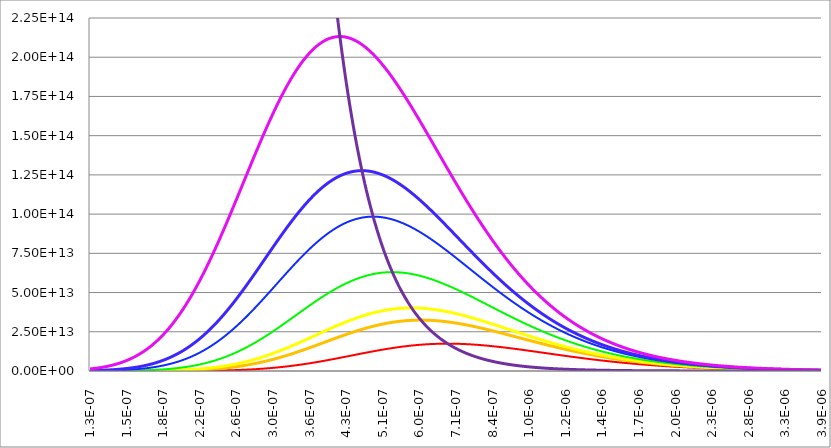
| Category | Series 0 | Series 2 | Series 3 | Series 4 | Series 5 | Series 6 | Series 7 | Series 8 |
|---|---|---|---|---|---|---|---|---|
| 1.3e-07 | 43685138.739 | 930653025.452 | 2456064956.772 | 16452432174.006 | 92391966750.19 | 236537325695.557 | 1309697465786.23 | 70807421631972600 |
| 1.30221265918748e-07 | 45284381.751 | 959721600.731 | 2528606285.021 | 16883714095.347 | 94536330275.323 | 241640933370.322 | 1334070800630.02 | 70207899069705504 |
| 1.30442908442164e-07 | 46938624.629 | 989632102.476 | 2603123802.267 | 17325289490.276 | 96725294709.74 | 246842138157.935 | 1358835514209.74 | 69613452632149400 |
| 1.30664928211246e-07 | 48649628.291 | 1020406833.061 | 2679666373.035 | 17777377075.269 | 98959665130.538 | 252142529249.845 | 1383996691087.79 | 69024039340034304 |
| 1.30887325868083e-07 | 50419205.486 | 1052068624.104 | 2758283931.46 | 18240199549.229 | 101240258477.966 | 257543716109.634 | 1409559460929.66 | 68439616577993296 |
| 1.31110102055858e-07 | 52249222.172 | 1084640847.335 | 2839027501.119 | 18713983650.925 | 103567903677.132 | 263047328628.225 | 1435528998568.02 | 67860142091481400 |
| 1.31333257418846e-07 | 54141598.924 | 1118147425.638 | 2921949215.143 | 19198960216.934 | 105943441759.982 | 268655017278.492 | 1461910524061.21 | 67285573983720704 |
| 1.31556792602423e-07 | 56098312.376 | 1152612844.287 | 3007102336.609 | 19695364240.106 | 108367725987.514 | 274368453269.189 | 1488709302745.95 | 66715870712671000 |
| 1.3178070825306e-07 | 58121396.694 | 1188062162.355 | 3094541279.224 | 20203434928.53 | 110841621972.233 | 280189328698.186 | 1515930645284.19 | 66150991088026200 |
| 1.32005005018328e-07 | 60212945.086 | 1224521024.312 | 3184321628.298 | 20723415765.013 | 113366007800.798 | 286119356704.962 | 1543579907704.01 | 65590894268236096 |
| 1.32229683546903e-07 | 62375111.346 | 1262015671.818 | 3276500161.998 | 21255554567.065 | 115941774156.87 | 292160271622.324 | 1571662491434.59 | 65035539757554000 |
| 1.32454744488563e-07 | 64610111.43 | 1300572955.695 | 3371134872.908 | 21800103547.381 | 118569824444.11 | 298313829127.292 | 1600183843335.03 | 64484887403108400 |
| 1.32680188494192e-07 | 66920225.07 | 1340220348.098 | 3468284989.873 | 22357319374.832 | 121251074909.339 | 304581806391.143 | 1629149455717.06 | 63938897391999696 |
| 1.32906016215783e-07 | 69307797.427 | 1380985954.878 | 3568011000.141 | 22927463235.95 | 123986454765.811 | 310966002228.531 | 1658564866361.43 | 63397530248422200 |
| 1.33132228306438e-07 | 71775240.776 | 1422898528.142 | 3670374671.812 | 23510800896.908 | 126776906316.584 | 317468237245.687 | 1688435658528.08 | 62860746830809696 |
| 1.33358825420371e-07 | 74325036.234 | 1465987479.006 | 3775439076.573 | 24107602765.989 | 129623385077.99 | 324090353987.621 | 1718767460959.88 | 62328508329005400 |
| 1.33585808212908e-07 | 76959735.521 | 1510282890.554 | 3883268612.744 | 24718143956.555 | 132526859903.139 | 330834217084.301 | 1749565947879.8 | 61800776261455904 |
| 1.33813177340492e-07 | 79681962.766 | 1555815530.994 | 3993929028.631 | 25342704350.488 | 135488313105.478 | 337701713395.768 | 1780836838981.73 | 61277512472429104 |
| 1.34040933460683e-07 | 82494416.349 | 1602616867.021 | 4107487446.172 | 25981568662.122 | 138508740582.347 | 344694752156.13 | 1812585899414.47 | 60758679129255400 |
| 1.3426907723216e-07 | 85399870.785 | 1650719077.381 | 4224012384.903 | 26635026502.649 | 141589151938.537 | 351815265116.427 | 1844818939759.15 | 60244238719592400 |
| 1.34497609314724e-07 | 88401178.649 | 1700155066.647 | 4343573786.227 | 27303372445.004 | 144730570609.801 | 359065206686.263 | 1877541815999.82 | 59734154048712496 |
| 1.34726530369297e-07 | 91501272.545 | 1750958479.199 | 4466243037.991 | 27986906089.212 | 147934033986.314 | 366446554074.231 | 1910760429487.19 | 59228388236813800 |
| 1.34955841057927e-07 | 94703167.112 | 1803163713.422 | 4592092999.383 | 28685932128.211 | 151200593536.046 | 373961307427.036 | 1944480726895.49 | 58726904716354096 |
| 1.35185542043789e-07 | 98009961.085 | 1856805936.11 | 4721198026.135 | 29400760414.128 | 154531314928.024 | 381611489967.294 | 1978708700172.24 | 58229667229405800 |
| 1.35415633991188e-07 | 101424839.384 | 1911921097.087 | 4853633996.044 | 30131706025.018 | 157927278155.469 | 389399148129.966 | 2013450386481.1 | 57736639825036000 |
| 1.35646117565556e-07 | 104951075.267 | 1968545944.049 | 4989478334.814 | 30879089332.051 | 161389577658.764 | 397326351697.356 | 2048711868137.37 | 57247786856705800 |
| 1.35876993433462e-07 | 108592032.511 | 2026718037.616 | 5128810042.207 | 31643236067.147 | 164919322448.239 | 405395193932.666 | 2084499272536.48 | 56763072979693800 |
| 1.36108262262607e-07 | 112351167.653 | 2086475766.612 | 5271709718.521 | 32424477391.054 | 168517636226.755 | 413607791712.037 | 2120818772075.07 | 56282463148540600 |
| 1.36339924721828e-07 | 116232032.272 | 2147858363.564 | 5418259591.387 | 33223149961.861 | 172185657512.035 | 421966285655.032 | 2157676584064.79 | 55805922614514400 |
| 1.36571981481102e-07 | 120238275.318 | 2210905920.422 | 5568543542.884 | 34039596003.941 | 175924539758.742 | 430472840253.525 | 2195078970638.6 | 55333416923099400 |
| 1.36804433211546e-07 | 124373645.499 | 2275659404.508 | 5722647136.984 | 34874163377.32 | 179735451480.258 | 439129643998.94 | 2233032238649.63 | 54864911911504000 |
| 1.37037280585418e-07 | 128641993.704 | 2342160674.695 | 5880657647.316 | 35727205647.466 | 183619576370.154 | 447938909507.811 | 2271542739562.53 | 54400373706191104 |
| 1.37270524276122e-07 | 133047275.491 | 2410452497.804 | 6042664085.256 | 36599082155.486 | 187578113423.296 | 456902873645.58 | 2310616869337.05 | 53939768720429400 |
| 1.37504164958206e-07 | 137593553.616 | 2480578565.247 | 6208757228.344 | 37490158088.734 | 191612277056.597 | 466023797648.636 | 2350261068304.13 | 53483063651864000 |
| 1.37738203307369e-07 | 142285000.618 | 2552583509.89 | 6379029649.033 | 38400804551.818 | 195723297229.347 | 475303967244.508 | 2390481821034.02 | 53030225480109600 |
| 1.37972640000458e-07 | 147125901.461 | 2626512923.154 | 6553575743.756 | 39331398637.992 | 199912419563.118 | 484745692770.176 | 2431285656196.78 | 52581221464362800 |
| 1.38207475715472e-07 | 152120656.225 | 2702413372.353 | 6732491762.334 | 40282323500.947 | 204180905461.217 | 494351309288.474 | 2472679146414.75 | 52136019141034400 |
| 1.38442711131564e-07 | 157273782.85 | 2780332418.271 | 6915875837.702 | 41253968426.966 | 208530032227.622 | 504123176702.485 | 2514668908107.18 | 51694586321402896 |
| 1.38678346929045e-07 | 162589919.948 | 2860318632.967 | 7103828015.977 | 42246728907.463 | 212961093185.433 | 514063679867.949 | 2557261601326.79 | 51256891089286800 |
| 1.38914383789382e-07 | 168073829.653 | 2942421617.838 | 7296450286.847 | 43261006711.873 | 217475397794.736 | 524175228703.586 | 2600463929588.28 | 50822901798737400 |
| 1.39150822395201e-07 | 173730400.546 | 3026692021.906 | 7493846614.301 | 44297209960.903 | 222074271769.915 | 534460258299.29 | 2644282639688.78 | 50392587071750200 |
| 1.39387663430292e-07 | 179564650.629 | 3113181560.362 | 7696122967.684 | 45355753200.135 | 226759057196.332 | 544921229022.18 | 2688724521520 | 49965915795996800 |
| 1.39624907579608e-07 | 185581730.361 | 3201943033.345 | 7903387353.087 | 46437057473.956 | 231531112646.379 | 555560626620.409 | 2733796407872.28 | 49542857122575000 |
| 1.39862555529267e-07 | 191786925.753 | 3293030344.973 | 8115749845.072 | 47541550399.829 | 236391813294.847 | 566380962324.738 | 2779505174230.24 | 49123380463778704 |
| 1.40100607966557e-07 | 198185661.527 | 3386498522.622 | 8333322618.73 | 48669666242.875 | 241342551033.589 | 577384772947.771 | 2825857738560.14 | 48707455490886200 |
| 1.40339065579933e-07 | 204783504.333 | 3482403736.448 | 8556219982.068 | 49821845990.782 | 246384734585.458 | 588574620980.849 | 2872861061088.81 | 48295052131967400 |
| 1.40577929059024e-07 | 211586166.034 | 3580803319.166 | 8784558408.735 | 50998537428.998 | 251519789617.453 | 599953094688.522 | 2920522144074.17 | 47886140569709600 |
| 1.40817199094631e-07 | 218599507.052 | 3681755786.077 | 9018456571.081 | 52200195216.236 | 256749158853.092 | 611522808200.559 | 2968848031567.21 | 47480691239261504 |
| 1.41056876378733e-07 | 225829539.776 | 3785320855.348 | 9258035373.546 | 53427280960.25 | 262074302183.928 | 623286401601.482 | 3017845809165.42 | 47078674826096200 |
| 1.41296961604484e-07 | 233282432.046 | 3891559468.549 | 9503417986.387 | 54680263293.891 | 267496696780.204 | 635246541017.479 | 3067522603757.65 | 46680062263890704 |
| 1.41537455466221e-07 | 240964510.69 | 4000533811.438 | 9754729879.735 | 55959617951.426 | 273017837200.615 | 647405918700.778 | 3117885583260.26 | 46284824732425600 |
| 1.41778358659459e-07 | 248882265.142 | 4112307335.014 | 10012098857.986 | 57265827845.112 | 278639235501.127 | 659767253111.33 | 3168941956344.65 | 45892933655500096 |
| 1.42019671880901e-07 | 257042351.119 | 4226944776.816 | 10275655094.528 | 58599383142.009 | 284362421342.834 | 672333288995.792 | 3220698972156.02 | 45504360698867104 |
| 1.42261395828432e-07 | 265451594.373 | 4344512182.486 | 10545531166.791 | 59960781341.027 | 290188942098.817 | 685106797463.749 | 3273163920023.31 | 45119077768183600 |
| 1.42503531201127e-07 | 274116994.513 | 4465076927.594 | 10821862091.643 | 61350527350.2 | 296120362959.953 | 698090576061.15 | 3326344129160.38 | 44737057006980000 |
| 1.42746078699251e-07 | 283045728.897 | 4588707739.717 | 11104785361.102 | 62769133564.16 | 302158267039.674 | 711287448840.879 | 3380246968358.28 | 44358270794645904 |
| 1.42989039024259e-07 | 292245156.599 | 4715474720.784 | 11394440978.39 | 64217119941.818 | 308304255477.61 | 724700266430.431 | 3434879845668.66 | 43982691744433296 |
| 1.43232412878803e-07 | 301722822.448 | 4845449369.683 | 11690971494.308 | 65695014084.224 | 314559947542.095 | 738331906096.622 | 3490250208078.16 | 43610292701475904 |
| 1.43476200966727e-07 | 311486461.143 | 4978704605.13 | 11994522043.946 | 67203351312.613 | 320926980731.503 | 752185271807.316 | 3546365541173.92 | 43241046740826496 |
| 1.43720403993076e-07 | 321544001.439 | 5115314788.804 | 12305240383.717 | 68742674746.601 | 327407010874.366 | 766263294290.099 | 3603233368799.97 | 42874927165509808 |
| 1.43965022664094e-07 | 331903570.423 | 5255355748.742 | 12623276928.716 | 70313535382.542 | 334001712228.256 | 780568931087.833 | 3660861252704.72 | 42511907504592304 |
| 1.44210057687228e-07 | 342573497.85 | 5398904803.006 | 12948784790.409 | 71916492172.012 | 340712777577.389 | 795105166611.097 | 3719256792179.19 | 42151961511268496 |
| 1.44455509771127e-07 | 353562320.569 | 5546040783.61 | 13281919814.641 | 73552112100.434 | 347541918328.901 | 809875012187.406 | 3778427623686.23 | 41795063160963200 |
| 1.44701379625648e-07 | 364878787.028 | 5696844060.719 | 13622840619.971 | 75220970265.792 | 354490864607.782 | 824881506107.19 | 3838381420480.71 | 41441186649449904 |
| 1.44947667961856e-07 | 376531861.858 | 5851396567.108 | 13971708636.323 | 76923649957.471 | 361561365350.424 | 840127713666.487 | 3899125892220.27 | 41090306390984896 |
| 1.45194375492025e-07 | 388530730.535 | 6009781822.9 | 14328688143.959 | 78660742735.154 | 368755188396.735 | 855616727206.278 | 3960668784567.13 | 40742397016457696 |
| 1.45441502929643e-07 | 400884804.135 | 6172084960.559 | 14693946312.772 | 80432848507.813 | 376074120580.799 | 871351666148.45 | 4023017878780.57 | 40397433371556704 |
| 1.45689050989411e-07 | 413603724.162 | 6338392750.157 | 15067653241.887 | 82240575612.742 | 383519967820.036 | 887335677028.288 | 4086180991300.18 | 40055390514950400 |
| 1.45937020387247e-07 | 426697367.47 | 6508793624.917 | 15449981999.585 | 84084540894.644 | 391094555202.833 | 903571933523.535 | 4150165973319.87 | 39716243716484096 |
| 1.46185411840288e-07 | 440175851.262 | 6683377707.011 | 15841108663.532 | 85965369784.736 | 398799727074.599 | 920063636479.844 | 4214980710352.6 | 39379968455392304 |
| 1.46434226066892e-07 | 454049538.186 | 6862236833.636 | 16241212361.32 | 87883696379.877 | 406637347122.208 | 936814013932.709 | 4280633121785.76 | 39046540418525200 |
| 1.46683463786637e-07 | 468329041.511 | 7045464583.361 | 16650475311.316 | 89840163521.693 | 414609298456.813 | 953826321125.733 | 4347131160427.38 | 38715935498591104 |
| 1.46933125720328e-07 | 483025230.398 | 7233156302.735 | 17069082863.814 | 91835422875.679 | 422717483694.951 | 971103840525.217 | 4414482812042.74 | 38388129792413504 |
| 1.47183212589998e-07 | 498149235.257 | 7425409133.17 | 17497223542.49 | 93870135010.28 | 430963825037.959 | 988649881831.049 | 4482696094882.01 | 38063099599202800 |
| 1.47433725118906e-07 | 513712453.195 | 7622322038.094 | 17935089086.156 | 95944969475.917 | 439350264349.609 | 1006467781983.79 | 4551779059198.22 | 37740821418842704 |
| 1.47684664031544e-07 | 529726553.565 | 7823995830.37 | 18382874490.812 | 98060604883.953 | 447878763231.96 | 1024560905167.95 | 4621739786755.96 | 37421271950191096 |
| 1.47936030053636e-07 | 546203483.594 | 8030533199.982 | 18840778051.994 | 100217728985.583 | 456551303099.37 | 1042932642811.43 | 4692586390330.83 | 37104428089395200 |
| 1.48187823912142e-07 | 563155474.12 | 8242038741.999 | 19309001407.405 | 102417038750.622 | 465369885250.651 | 1061586413581.01 | 4764327013199.39 | 36790266928221600 |
| 1.48440046335259e-07 | 580595045.413 | 8458618984.793 | 19787749579.844 | 104659240446.19 | 474336530939.298 | 1080525663373.89 | 4836969828619.73 | 36478765752399400 |
| 1.48692698052423e-07 | 598535013.099 | 8680382418.539 | 20277231020.414 | 106945049715.263 | 483453281441.789 | 1099753865305.25 | 4910523039302.73 | 36169902039978304 |
| 1.48945779794313e-07 | 616988494.182 | 8907439523.97 | 20777657652.012 | 109275191655.079 | 492722198123.88 | 1119274519691.75 | 4984994876873.88 | 35863653459700000 |
| 1.49199292292851e-07 | 635968913.162 | 9139902801.407 | 21289244913.094 | 111650400895.386 | 502145362504.917 | 1139091154030.94 | 5060393601325.74 | 35559997869383900 |
| 1.49453236281203e-07 | 655490008.25 | 9377886800.053 | 21812211801.723 | 114071421676.504 | 511724876320.04 | 1159207322976.53 | 5136727500461.07 | 35258913314326000 |
| 1.49707612493785e-07 | 675565837.695 | 9621508147.549 | 22346780919.879 | 116539007927.2 | 521462861580.324 | 1179626608309.49 | 5214004889326.48 | 34960378025711300 |
| 1.49962421666262e-07 | 696210786.197 | 9870885579.798 | 22893178518.036 | 119053923342.337 | 531361460630.774 | 1200352618904.88 | 5292234109636.77 | 34664370419040700 |
| 1.50217664535552e-07 | 717439571.438 | 10126139971.053 | 23451634540.007 | 121616941460.296 | 541422836206.144 | 1221388990694.55 | 5371423529189.98 | 34370869092569300 |
| 1.50473341839826e-07 | 739267250.707 | 10387394364.262 | 24022382668.042 | 124228845740.153 | 551649171484.547 | 1242739386625.32 | 5451581541272.98 | 34079852825760100 |
| 1.50729454318513e-07 | 761709227.632 | 10654774001.684 | 24605660368.183 | 126890429638.569 | 562042670138.817 | 1264407496612.99 | 5532716564057.78 | 33791300577748900 |
| 1.50986002712299e-07 | 784781259.023 | 10928406355.757 | 25201708935.87 | 129602496686.414 | 572605556385.582 | 1286397037491.89 | 5614837039988.56 | 33505191485823400 |
| 1.51242987763132e-07 | 808499461.819 | 11208421160.227 | 25810773541.787 | 132365860565.073 | 583340075032.01 | 1308711752959.97 | 5697951435159.3 | 33221504863914800 |
| 1.51500410214221e-07 | 832880320.136 | 11494950441.54 | 26433103277.953 | 135181345182.421 | 594248491520.198 | 1331355413519.45 | 5782068238682.25 | 32940220201102200 |
| 1.51758270810042e-07 | 857940692.437 | 11788128550.485 | 27068951204.048 | 138049784748.469 | 605333091969.151 | 1354331816412.96 | 5867195962046.95 | 32661317160129300 |
| 1.52016570296338e-07 | 883697818.807 | 12088092194.092 | 27718574393.971 | 140972023850.629 | 616596183214.327 | 1377644785555.08 | 5953343138470.19 | 32384775575934400 |
| 1.52275309420119e-07 | 910169328.332 | 12394980467.789 | 28382233982.618 | 143948917528.611 | 628040092844.713 | 1401298171459.33 | 6040518322236.78 | 32110575454192400 |
| 1.52534488929669e-07 | 937373246.601 | 12708934887.805 | 29060195212.889 | 146981331348.907 | 639667169237.374 | 1425295851160.49 | 6128730088030.81 | 31838696969868700 |
| 1.52794109574545e-07 | 965328003.316 | 13030099423.826 | 29752727482.902 | 150070141478.85 | 651479781589.458 | 1449641728132.31 | 6217987030258.16 | 31569120465786500 |
| 1.53054172105578e-07 | 994052440.017 | 13358620531.9 | 30460104393.425 | 153216234760.243 | 663480319947.606 | 1474339732200.42 | 6308297762359.56 | 31301826451205100 |
| 1.53314677274879e-07 | 1023565817.92 | 13694647187.583 | 31182603795.504 | 156420508782.504 | 675671195234.755 | 1499393819450.54 | 6399670916114.74 | 31036795600410900 |
| 1.53575625835839e-07 | 1053887825.876 | 14038330919.34 | 31920507838.292 | 159683871955.351 | 688054839274.243 | 1524807972131.94 | 6492115140937.35 | 30774008751320000 |
| 1.53837018543131e-07 | 1085038588.445 | 14389825842.175 | 32674103017.078 | 163007243580.959 | 700633704811.253 | 1550586198556.03 | 6585639103161.03 | 30513446904092800 |
| 1.54098856152711e-07 | 1117038674.084 | 14749288691.514 | 33443680221.487 | 166391553925.611 | 713410265531.492 | 1576732532990.07 | 6680251485316.32 | 30255091219760400 |
| 1.54361139421824e-07 | 1149909103.462 | 15116878857.316 | 34229534783.875 | 169837744290.786 | 726387016077.1 | 1603251035546.07 | 6775960985398.64 | 29998923018862300 |
| 1.54623869109002e-07 | 1183671357.887 | 15492758418.422 | 35031966527.89 | 173346767083.695 | 739566472059.769 | 1630145792064.75 | 6872776316127.52 | 29744923780096000 |
| 1.5488704597407e-07 | 1218347387.861 | 15877092177.141 | 35851279817.2 | 176919585887.213 | 752951170070.981 | 1657420913994.42 | 6970706204196.69 | 29493075138978000 |
| 1.55150670778144e-07 | 1253959621.755 | 16270047694.063 | 36687783604.386 | 180557175529.215 | 766543667689.401 | 1685080538265.07 | 7069759389515.62 | 29243358886515700 |
| 1.55414744283638e-07 | 1290530974.6 | 16671795323.098 | 37541791479.985 | 184260522151.268 | 780346543485.316 | 1713128827157.29 | 7169944624442.01 | 28995756967891100 |
| 1.5567926725426e-07 | 1328084857.013 | 17082508246.742 | 38413621721.685 | 188030623276.676 | 794362397022.146 | 1741569968166.13 | 7271270673005.79 | 28750251481155300 |
| 1.55944240455022e-07 | 1366645184.242 | 17502362511.564 | 39303597343.652 | 191868487877.851 | 808593848854.948 | 1770408173860.03 | 7373746310124.31 | 28506824675934300 |
| 1.56209664652236e-07 | 1406236385.331 | 17931537063.916 | 40212046145.997 | 195775136442.974 | 823043540525.903 | 1799647681734.42 | 7477380320808.93 | 28265458952145600 |
| 1.56475540613517e-07 | 1446883412.425 | 18370213785.849 | 41139300764.365 | 199751601041.955 | 837714134556.738 | 1829292754060.38 | 7582181499363.15 | 28026136858725500 |
| 1.5674186910779e-07 | 1488611750.19 | 18818577531.254 | 42085698719.644 | 203798925391.634 | 852608314438.053 | 1859347677727.96 | 7688158648571.95 | 27788841092367500 |
| 1.57008650905286e-07 | 1531447425.366 | 19276816162.204 | 43051582467.783 | 207918164920.222 | 867728784615.513 | 1889816764084.4 | 7795320578883.02 | 27553554496271400 |
| 1.57275886777547e-07 | 1575417016.449 | 19745120585.5 | 44037299449.708 | 212110386830.969 | 883078270472.905 | 1920704348767.1 | 7903676107579.51 | 27320260058902500 |
| 1.5754357749743e-07 | 1620547663.503 | 20223684789.431 | 45043202141.346 | 216376670164.988 | 898659518311.934 | 1952014791531.31 | 8013234057944.1 | 27088940912762100 |
| 1.57811723839106e-07 | 1666867078.102 | 20712705880.718 | 46069648103.718 | 220718105863.287 | 914475295328.852 | 1983752476072.61 | 8124003258415.52 | 26859580333167300 |
| 1.58080326578063e-07 | 1714403553.402 | 21212384121.665 | 47117000033.124 | 225135796827.913 | 930528389587.794 | 2015921809843.97 | 8235992541736.14 | 26632161737042500 |
| 1.58349386491112e-07 | 1763185974.348 | 21722922967.493 | 48185625811.39 | 229630857982.233 | 946821609990.799 | 2048527223867.61 | 8349210744091.98 | 26406668681720000 |
| 1.58618904356382e-07 | 1813243828.014 | 22244529103.867 | 49275898556.184 | 234204416330.306 | 963357786244.526 | 2081573172541.41 | 8463666704244.32 | 26183084863751200 |
| 1.5888888095333e-07 | 1864607214.068 | 22777412484.602 | 50388196671.372 | 238857611015.338 | 980139768823.597 | 2115064133440.02 | 8579369262653.64 | 25961394117728004 |
| 1.59159317062738e-07 | 1917306855.389 | 23321786369.549 | 51522903897.434 | 243591593377.17 | 997170428930.529 | 2149004607110.53 | 8696327260595.31 | 25741580415113800 |
| 1.59430213466717e-07 | 1971374108.8 | 23877867362.657 | 52680409361.902 | 248407527008.821 | 1014452658452.26 | 2183399116862.73 | 8814549539267.86 | 25523627863085000 |
| 1.59701570948709e-07 | 2026840975.947 | 24445875450.204 | 53861107629.831 | 253306587812.005 | 1031989369913.22 | 2218252208553.98 | 8934044938893.2 | 25307520703381200 |
| 1.59973390293489e-07 | 2083740114.317 | 25026034039.195 | 55065398754.284 | 258289964051.651 | 1049783496424.87 | 2253568450368.61 | 9054822297809.23 | 25093243311166900 |
| 1.6024567228717e-07 | 2142104848.382 | 25618569995.919 | 56293688326.823 | 263358856409.366 | 1067837991631.76 | 2289352432591.73 | 9176890451555.15 | 24880780193900900 |
| 1.60518417717201e-07 | 2201969180.892 | 26223713684.663 | 57546387528.003 | 268514478035.838 | 1086155829654.02 | 2325608767377.81 | 9300258231948.78 | 24670115990216400 |
| 1.60791627372372e-07 | 2263367804.3 | 26841699006.581 | 58823913177.847 | 273758054602.145 | 1104740005026.28 | 2362342088513.51 | 9424934466157.05 | 24461235468810700 |
| 1.61065302042815e-07 | 2326336112.327 | 27472763438.702 | 60126687786.304 | 279090824349.948 | 1123593532632.98 | 2399557051175.14 | 9550927975758.64 | 24254123527343500 |
| 1.61339442520007e-07 | 2390910211.664 | 28117148073.088 | 61455139603.676 | 284514038140.546 | 1142719447640.01 | 2437258331680.52 | 9678247575799.89 | 24048765191345500 |
| 1.61614049596772e-07 | 2457126933.824 | 28775097656.121 | 62809702670.997 | 290028959502.766 | 1162120805422.7 | 2475450627235.31 | 9806902073843.2 | 23845145613135000 |
| 1.61889124067285e-07 | 2525023847.118 | 29446860627.929 | 64190816870.37 | 295636864679.671 | 1181800681490.17 | 2514138655673.86 | 9936900269008.54 | 23643250070745100 |
| 1.6216466672707e-07 | 2594639268.785 | 30132689161.927 | 65598927975.23 | 301339042674.043 | 1201762171405.85 | 2553327155194.31 | 10068250951008.2 | 23443063966858800 |
| 1.62440678373008e-07 | 2666012277.261 | 30832839204.485 | 67034487700.542 | 307136795292.652 | 1222008390704.3 | 2593020884088.35 | 10200962899174.4 | 23244572827754000 |
| 1.62717159803333e-07 | 2739182724.583 | 31547570514.712 | 68497953752.917 | 313031437189.241 | 1242542474804.34 | 2633224620465.23 | 10335044881480.4 | 23047762302256700 |
| 1.6299411181764e-07 | 2814191248.943 | 32277146704.343 | 69989789880.621 | 319024295906.242 | 1263367578918.18 | 2673943161970.19 | 10470505653554.8 | 22852618160703400 |
| 1.63271535216886e-07 | 2891079287.379 | 33021835277.73 | 71510465923.496 | 325116711915.183 | 1284486877956.92 | 2715181325497.35 | 10607353957689.5 | 22659126293912600 |
| 1.63549430803387e-07 | 2969889088.616 | 33781907671.933 | 73060457862.753 | 331310038655.747 | 1305903566432.06 | 2756943946897.01 | 10745598521841.2 | 22467272712164200 |
| 1.63827799380829e-07 | 3050663726.038 | 34557639296.896 | 74640247870.638 | 337605642573.5 | 1327620858353.22 | 2799235880677.22 | 10885248058626.4 | 22277043544188600 |
| 1.64106641754264e-07 | 3133447110.816 | 35349309575.713 | 76250324359.963 | 344004903156.203 | 1349641987121.88 | 2842061999699.84 | 11026311264310.4 | 22088425036163200 |
| 1.64385958730113e-07 | 3218284005.175 | 36157201984.967 | 77891182033.489 | 350509212968.759 | 1371970205421.26 | 2885427194870.99 | 11168796817790.4 | 21901403550718400 |
| 1.64665751116172e-07 | 3305220035.801 | 36981604095.142 | 79563321933.135 | 357119977686.687 | 1394608785102.24 | 2929336374825.79 | 11312713379572 | 21715965565951600 |
| 1.64946019721612e-07 | 3394301707.396 | 37822807611.102 | 81267251489.028 | 363838616128.178 | 1417561017065.22 | 2973794465607.57 | 11458069590740.7 | 21532097674449000 |
| 1.65226765356977e-07 | 3485576416.381 | 38681108412.625 | 83003484568.357 | 370666560284.648 | 1440830211138.15 | 3018806410341.41 | 11604874071926.7 | 21349786582317100 |
| 1.65507988834197e-07 | 3579092464.732 | 39556806594.987 | 84772541524.031 | 377605255349.797 | 1464419695950.38 | 3064377168902.08 | 11753135422264.8 | 21169019108220700 |
| 1.65789690966578e-07 | 3674899073.976 | 40450206509.596 | 86574949243.136 | 384656159747.141 | 1488332818802.61 | 3110511717576.36 | 11902862218349 | 20989782182430600 |
| 1.66071872568814e-07 | 3773046399.317 | 41361616804.655 | 88411241195.155 | 391820745155.994 | 1512572945532.64 | 3157215048719.77 | 12054063013180.7 | 20812062845877900 |
| 1.66354534456985e-07 | 3873585543.914 | 42291350465.863 | 90281957479.966 | 399100496535.863 | 1537143460377.24 | 3204492170407.63 | 12206746335112.5 | 20635848249217800 |
| 1.66637677448558e-07 | 3976568573.306 | 43239724857.134 | 92187644875.588 | 406496912149.262 | 1562047765829.74 | 3252348106080.64 | 12360920686786.8 | 20461125651899800 |
| 1.66921302362394e-07 | 4082048529.974 | 44207061761.33 | 94128856885.67 | 414011503582.888 | 1587289282493.59 | 3300787894184.72 | 12516594544069 | 20287882421247300 |
| 1.67205410018747e-07 | 4190079448.053 | 45193687421.006 | 96106153786.7 | 421645795767.15 | 1612871448931.84 | 3349816587805.37 | 12673776354976.5 | 20116106031543700 |
| 1.67490001239266e-07 | 4300716368.19 | 46199932579.152 | 98120102674.941 | 429401326994.032 | 1638797721512.33 | 3399439254296.42 | 12832474538601.9 | 19945784063127100 |
| 1.67775076846999e-07 | 4414015352.538 | 47226132519.927 | 100171277513.062 | 437279648933.259 | 1665071574248.91 | 3449660974903.2 | 12992697484032.9 | 19776904201491900 |
| 1.68060637666396e-07 | 4530033499.901 | 48272627109.378 | 102260259176.457 | 445282326646.744 | 1691696498638.34 | 3500486844380.18 | 13154453549266.8 | 19609454236399000 |
| 1.68346684523309e-07 | 4648828961.023 | 49339760836.136 | 104387635499.24 | 453410938601.283 | 1718676003493 | 3551921970603.1 | 13317751060121 | 19443422060992800 |
| 1.68633218244996e-07 | 4770460954.019 | 50427882852.081 | 106554001319.909 | 461667076679.502 | 1746013614769.53 | 3603971474175.48 | 13482598309139.2 | 19278795670925400 |
| 1.68920239660122e-07 | 4894989779.943 | 51537347012.961 | 108759958526.648 | 470052346188.993 | 1773712875393.06 | 3656640488029.7 | 13649003554493.8 | 19115563163489600 |
| 1.69207749598765e-07 | 5022476838.512 | 52668511918.972 | 111006116102.277 | 478568365869.658 | 1801777345077.38 | 3709934157022.58 | 13816975018884 | 18953712736757200 |
| 1.69495748892413e-07 | 5152984643.962 | 53821740955.274 | 113293090168.809 | 487216767899.195 | 1830210600140.76 | 3763857637525.41 | 13986520888430.5 | 18793232688726700 |
| 1.69784238373972e-07 | 5286576841.048 | 54997402332.44 | 115621504031.631 | 495999197896.739 | 1859016233317.54 | 3818416097008.64 | 14157649311566.3 | 18634111416476600 |
| 1.70073218877762e-07 | 5423318221.189 | 56195869126.841 | 117991988223.267 | 504917314924.619 | 1888197853565.48 | 3873614713621.05 | 14330368397924.4 | 18476337415326800 |
| 1.70362691239527e-07 | 5563274738.753 | 57417519320.938 | 120405180546.727 | 513972791488.207 | 1917759085868.82 | 3929458675763.47 | 14504686217221.4 | 18319899278006700 |
| 1.70652656296431e-07 | 5706513527.479 | 58662735843.486 | 122861726118.423 | 523167313533.828 | 1947703571037.04 | 3985953181657.2 | 14680610798138.8 | 18164785693830300 |
| 1.70943114887064e-07 | 5853102917.041 | 59931906609.633 | 125362277410.636 | 532502580444.751 | 1978034965499.35 | 4043103438907.03 | 14858150127201 | 18010985447878600 |
| 1.71234067851442e-07 | 6003112449.755 | 61225424560.922 | 127907494293.516 | 541980305035.165 | 2008756941094.87 | 4100914664058.87 | 15037312147649.8 | 17858487420189000 |
| 1.71525516031012e-07 | 6156612897.422 | 62543687705.154 | 130498044076.617 | 551602213542.187 | 2039873184858.52 | 4159392082152.02 | 15218104758317 | 17707280584950500 |
| 1.71817460268653e-07 | 6313676278.302 | 63887099156.141 | 133134601549.932 | 561370045615.859 | 2071387398802.56 | 4218540926266.37 | 15400535812494.3 | 17557354009707400 |
| 1.72109901408679e-07 | 6474375874.238 | 65256067173.305 | 135817849024.429 | 571285554307.073 | 2103303299693.87 | 4278366437064.01 | 15584613116799.8 | 17408696854568500 |
| 1.72402840296839e-07 | 6638786247.908 | 66651005201.145 | 138548476372.058 | 581350506053.472 | 2135624618826.83 | 4338873862325.88 | 15770344430043.7 | 17261298371423300 |
| 1.72696277780325e-07 | 6806983260.211 | 68072331908.536 | 141327181065.24 | 591566680663.24 | 2168355101792 | 4400068456483.06 | 15957737462091.1 | 17115147903164700 |
| 1.72990214707767e-07 | 6979044087.794 | 69520471227.86 | 144154668215.79 | 601935871296.811 | 2201498508240.3 | 4461955480142.92 | 16146799872722.5 | 16970234882919200 |
| 1.73284651929242e-07 | 7155047240.708 | 70995852393.971 | 147031650613.288 | 612459884446.431 | 2235058611643.02 | 4524540199610.18 | 16337539270493.1 | 16826548833282200 |
| 1.73579590296273e-07 | 7335072580.196 | 72498909982.96 | 149958848762.868 | 623140539913.595 | 2269039199047.44 | 4587827886402.76 | 16529963211590.6 | 16684079365560600 |
| 1.73875030661833e-07 | 7519201336.615 | 74030083950.734 | 152936990922.412 | 633979670784.302 | 2303444070828.06 | 4651823816762.7 | 16724079198690.7 | 16542816179022100 |
| 1.74170973880347e-07 | 7707516127.486 | 75589819671.381 | 155966813139.142 | 644979123402.134 | 2338277040433.63 | 4716533271161.9 | 16919894679812.3 | 16402749060149900 |
| 1.74467420807692e-07 | 7900100975.676 | 77178567975.321 | 159049059285.575 | 656140757339.121 | 2373541934129.7 | 4781961533803 | 17117417047170.6 | 16263867881904500 |
| 1.74764372301205e-07 | 8097041327.705 | 78796785187.228 | 162184481094.862 | 667466445364.386 | 2409242590737 | 4848113892115.16 | 17316653636029.9 | 16126162602991700 |
| 1.75061829219679e-07 | 8298424072.176 | 80444933163.715 | 165373838195.448 | 678958073410.53 | 2445382861365.34 | 4914995636245.07 | 17517611723555.6 | 15989623267136000 |
| 1.75359792423372e-07 | 8504337558.344 | 82123479330.768 | 168617898145.087 | 690617540537.765 | 2481966609143.34 | 4982612058542.97 | 17720298527664.7 | 15854240002361600 |
| 1.75658262774003e-07 | 8714871614.791 | 83832896720.925 | 171917436464.155 | 702446758895.763 | 2518997708943.77 | 5050968453043.93 | 17924721205877.1 | 15720003020277700 |
| 1.7595724113476e-07 | 8930117568.234 | 85573664010.182 | 175273236668.274 | 714447653683.181 | 2556480047104.51 | 5120070114944.22 | 18130886854165.2 | 15586902615371800 |
| 1.76256728370299e-07 | 9150168262.455 | 87346265554.617 | 178686090300.221 | 726622163104.889 | 2594417521145.4 | 5189922340073.07 | 18338802505804.9 | 15454929164306900 |
| 1.76556725346748e-07 | 9375118077.345 | 89151191426.728 | 182156796961.105 | 738972238326.834 | 2632814039480.62 | 5260530424359.69 | 18548475130225 | 15324073125226700 |
| 1.7685723293171e-07 | 9605062948.065 | 90988937451.459 | 185686164340.793 | 751499843428.561 | 2671673521126.86 | 5331899663295.54 | 18759911631858 | 15194325037065100 |
| 1.77158251994263e-07 | 9840100384.332 | 92860005241.926 | 189275008247.595 | 764206955353.348 | 2710999895407.21 | 5404035351392.21 | 18973118848990.9 | 15065675518862200 |
| 1.77459783404965e-07 | 10080329489.807 | 94764902234.802 | 192924152637.147 | 777095563855.95 | 2750797101650.79 | 5476942781634.52 | 19188103552616.4 | 14938115269086400 |
| 1.77761828035857e-07 | 10325850981.607 | 96704141725.381 | 196634429640.527 | 790167671447.928 | 2791069088888.07 | 5550627244929.23 | 19404872445284.8 | 14811635064961600 |
| 1.78064386760463e-07 | 10576767209.919 | 98678242902.283 | 200406679591.542 | 803425293340.554 | 2831819815542.08 | 5625094029549.41 | 19623432159957.1 | 14686225761800400 |
| 1.78367460453793e-07 | 10833182177.73 | 100687730881.811 | 204241751053.215 | 816870457385.269 | 2873053249115.21 | 5700348420574.17 | 19843789258859 | 14561878292342800 |
| 1.78671049992347e-07 | 11095201560.658 | 102733136741.925 | 208140500843.416 | 830505204011.671 | 2914773365871.92 | 5776395699324.25 | 20065950232335.5 | 14438583666101200 |
| 1.78975156254118e-07 | 11362932726.89 | 104814997555.851 | 212103794059.651 | 844331586163.048 | 2956984150517.26 | 5853241142793.26 | 20289921497708.8 | 14316332968709600 |
| 1.79279780118593e-07 | 11636484757.226 | 106933856425.278 | 216132504102.973 | 858351669229.386 | 2999689595871.11 | 5930890023074.69 | 20515709398135.1 | 14195117361279700 |
| 1.79584922466754e-07 | 11915968465.22 | 109090262513.169 | 220227512701.019 | 872567530977.905 | 3042893702538.31 | 6009347606784.77 | 20743320201465.6 | 14074928079761300 |
| 1.79890584181084e-07 | 12201496417.419 | 111284771076.139 | 224389709930.138 | 886981261481.031 | 3086600478574.64 | 6088619154481.15 | 20972760099107.7 | 13955756434309200 |
| 1.80196766145568e-07 | 12493182953.702 | 113517943496.417 | 228619994236.612 | 901594963041.88 | 3130813939148.68 | 6168709920077.71 | 21204035204889.7 | 13837593808654500 |
| 1.80503469245696e-07 | 12791144207.711 | 115790347313.36 | 232919272456.934 | 916410750117.143 | 3175538106199.5 | 6249625150255.1 | 21437151553926.6 | 13720431659481800 |
| 1.80810694368465e-07 | 13095498127.372 | 118102556254.524 | 237288459837.157 | 931430749237.441 | 3220777008090.32 | 6331370083867.66 | 21672115101489.4 | 13604261515811600 |
| 1.81118442402379e-07 | 13406364495.51 | 120455150266.256 | 241728480051.261 | 946657098925.072 | 3266534679258.07 | 6413949951346.26 | 21908931721876.1 | 13489074978387600 |
| 1.81426714237459e-07 | 13723864950.544 | 122848715543.828 | 246240265218.564 | 962091949609.197 | 3312815159858.88 | 6497369974097.43 | 22147607207286.4 | 13374863719069500 |
| 1.81735510765238e-07 | 14048123007.275 | 125283844561.067 | 250824755920.118 | 977737463538.408 | 3359622495409.57 | 6581635363898.8 | 22388147266699 | 13261619480231000 |
| 1.82044832878766e-07 | 14379264077.745 | 127761136099.5 | 255482901214.12 | 993595814690.662 | 3406960736425.19 | 6666751322290.73 | 22630557524751.8 | 13149334074162600 |
| 1.82354681472614e-07 | 14717415492.187 | 130281195276.973 | 260215658650.275 | 1009669188680.62 | 3454833938052.42 | 6752723039964.53 | 22874843520626.3 | 13037999382479900 |
| 1.82665057442876e-07 | 15062706520.038 | 132844633575.754 | 265023994283.144 | 1025959782664.33 | 3503246159699.21 | 6839555696147.01 | 23121010706934.6 | 12927607355535998 |
| 1.82975961687171e-07 | 15415268391.039 | 135452068870.099 | 269908882684.419 | 1042469805241.25 | 3552201464660.38 | 6927254457981.67 | 23369064448611.2 | 12818150011840400 |
| 1.83287395104644e-07 | 15775234316.396 | 138104125453.262 | 274871306954.143 | 1059201476353.63 | 3601703919739.33 | 7015824479906.44 | 23619010021807.3 | 12709619437481000 |
| 1.83599358595973e-07 | 16142739510.01 | 140801434063.954 | 279912258730.83 | 1076157027183.22 | 3651757594865.95 | 7105270903028.12 | 23870852612790.8 | 12602007785552800 |
| 1.83911853063368e-07 | 16517921209.778 | 143544631912.224 | 285032738200.504 | 1093338700045.28 | 3702366562710.57 | 7195598854493.66 | 24124597316849.3 | 12495307275589600 |
| 1.84224879410574e-07 | 16900918698.948 | 146334362704.748 | 290233754104.606 | 1110748748279.93 | 3753534898294.25 | 7286813446858.08 | 24380249137198.1 | 12389510193002600 |
| 1.84538438542874e-07 | 17291873327.536 | 149171276669.532 | 295516323746.78 | 1128389436140.76 | 3805266678595.17 | 7378919777449.59 | 24637812983893.4 | 12284608888521400 |
| 1.84852531367094e-07 | 17690928533.801 | 152056030579.991 | 300881472998.516 | 1146263038680.77 | 3857565982151.32 | 7471922927731.48 | 24897293672748.6 | 12180595777641900 |
| 1.85167158791601e-07 | 18098229865.766 | 154989287778.417 | 306330236303.625 | 1164371841635.61 | 3910436888659.52 | 7565827962661.02 | 25158695924257.8 | 12077463340077600 |
| 1.85482321726308e-07 | 18513925002.793 | 157971718198.804 | 311863656681.547 | 1182718141304.03 | 3963883478570.66 | 7660639930045.77 | 25422024362522.5 | 11975204119215600 |
| 1.8579802108268e-07 | 18938163777.203 | 161003998389.027 | 317482785729.471 | 1201304244425.68 | 4017909832681.43 | 7756363859896.96 | 25687283514185.3 | 11873810721578000 |
| 1.8611425777373e-07 | 19371098195.936 | 164086811532.356 | 323188683623.237 | 1220132468056.11 | 4072520031722.27 | 7853004763780.03 | 25954477807367.8 | 11773275816286900 |
| 1.86431032714025e-07 | 19812882462.25 | 167220847468.306 | 328982419117.043 | 1239205139439.07 | 4127718155942 | 7950567634162.81 | 26223611570615 | 11673592134534700 |
| 1.86748346819692e-07 | 20263672997.46 | 170406802712.798 | 334865069541.895 | 1258524595876.06 | 4183508284688.63 | 8049057443761.09 | 26494689031845.7 | 11574752469058200 |
| 1.87066201008413e-07 | 20723628462.698 | 173645380477.612 | 340837720802.831 | 1278093184593.13 | 4239894495986.91 | 8148479144881.57 | 26767714317307.9 | 11476749673617900 |
| 1.87384596199435e-07 | 21192909780.714 | 176937290689.144 | 346901467374.862 | 1297913262604.87 | 4296880866112.25 | 8248837668762.68 | 27042691450541.8 | 11379576662480900 |
| 1.87703533313568e-07 | 21671680157.69 | 180283250006.433 | 353057412297.659 | 1317987196575.74 | 4354471469161.44 | 8350137924913.02 | 27319624351348.9 | 11283226409909000 |
| 1.88023013273191e-07 | 22160105105.082 | 183683981838.448 | 359306667168.935 | 1338317362678.54 | 4412670376619.74 | 8452384800447.56 | 27598516834766.5 | 11187691949650400 |
| 1.8834303700225e-07 | 22658352461.473 | 187140216360.636 | 365650352136.53 | 1358906146450.19 | 4471481656924.86 | 8555583159421.81 | 27879372610050.8 | 11092966374436400 |
| 1.88663605426266e-07 | 23166592414.442 | 190652690530.705 | 372089595889.172 | 1379755942644.68 | 4530909375027.54 | 8659737842163.91 | 28162195279665.9 | 10999042835481600 |
| 1.88984719472335e-07 | 23684997522.441 | 194222148103.624 | 378625535645.921 | 1400869155083.31 | 4590957591948.87 | 8764853664604.75 | 28446988338279.7 | 10905914541988700 |
| 1.89306380069131e-07 | 24213742736.676 | 197849339645.861 | 385259317144.251 | 1422248196502.08 | 4651630364334.57 | 8870935417606.47 | 28733755171768 | 10813574760658100 |
| 1.89628588146907e-07 | 24753005422.986 | 201535022548.795 | 391992094626.784 | 1443895488396.38 | 4712931744005.88 | 8977987866288.93 | 29022499056225.5 | 10722016815200500 |
| 1.89951344637501e-07 | 25302965383.725 | 205279961041.341 | 398825030826.649 | 1465813460862.9 | 4774865777507.56 | 9086015749354.58 | 29313223156984.4 | 10631234085854300 |
| 1.90274650474337e-07 | 25863804879.628 | 209084926201.732 | 405759296951.459 | 1488004552438.7 | 4837436505652.75 | 9195023778411.95 | 29605930527641.3 | 10541220008907100 |
| 1.90598506592427e-07 | 26435708651.67 | 212950695968.484 | 412796072665.892 | 1510471209937.61 | 4900647963064.78 | 9305016637297.45 | 29900624109091.5 | 10451968076221200 |
| 1.90922913928375e-07 | 27018863942.91 | 216878055150.501 | 419936546072.852 | 1533215888283.75 | 4964504177716.08 | 9415998981395.84 | 30197306728572.1 | 10363471834762800 |
| 1.91247873420378e-07 | 27613460520.304 | 220867795436.321 | 427181913693.215 | 1556241050342.35 | 5029009170464.2 | 9527975436959.46 | 30495981098713.1 | 10275724886135600 |
| 1.91573386008232e-07 | 28219690696.505 | 224920715402.495 | 434533380444.139 | 1579549166747.84 | 5094166954584.88 | 9640950600426.24 | 30796649816596.6 | 10188720886118400 |
| 1.9189945263333e-07 | 28837749351.624 | 229037620521.08 | 441992159615.923 | 1603142715729.06 | 5159981535302.44 | 9754929037736.54 | 31099315362825.9 | 10102453544205900 |
| 1.9222607423867e-07 | 29467833954.963 | 233219323166.228 | 449559472847.404 | 1627024182931.78 | 5226456909317.28 | 9869915283649.1 | 31403980100602 | 10016916623154200 |
| 1.92553251768853e-07 | 30110144586.702 | 237466642619.88 | 457236550099.892 | 1651196061238.51 | 5293597064330.87 | 9985913841056.04 | 31710646274810.3 | 9932103938529950 |
| 1.92880986170088e-07 | 30764883959.545 | 241780405076.523 | 465024629629.598 | 1675660850585.47 | 5361405978567.84 | 10102929180296.9 | 32019316011115.5 | 9848009358262940 |
| 1.93209278390196e-07 | 31432257440.322 | 246161443647.028 | 472924957958.599 | 1700421057776.83 | 5429887620295.71 | 10220965738472.2 | 32329991315067 | 9764626802202880 |
| 1.93538129378609e-07 | 32112473071.526 | 250610598361.534 | 480938789844.265 | 1725479196296.28 | 5499045947342.02 | 10340027918756.5 | 32642674071212.7 | 9681950241679810 |
| 1.93867540086376e-07 | 32805741592.805 | 255128716171.38 | 489067388247.181 | 1750837786115.8 | 5568884906608.92 | 10460120089710.3 | 32957366042223 | 9599973699068160 |
| 1.94197511466166e-07 | 33512276462.379 | 259716650950.065 | 497312024297.535 | 1776499353501.69 | 5639408433585.35 | 10581246584592 | 33274068868024.6 | 9518691247354600 |
| 1.94528044472267e-07 | 34232293878.394 | 264375263493.227 | 505673977259.976 | 1802466430817.94 | 5710620451857.01 | 10703411700670.1 | 33592784064944.9 | 9438097009709510 |
| 1.94859140060594e-07 | 34966012800.204 | 269105421517.64 | 514154534496.906 | 1828741556326.85 | 5782524872613.8 | 10826619698533.7 | 33913513024864.7 | 9358185159062050 |
| 1.95190799188686e-07 | 35713654969.568 | 273907999659.189 | 522754991430.215 | 1855327273986.95 | 5855125594155.19 | 10950874801404.5 | 34236257014383.8 | 9278949917678860 |
| 1.95523022815714e-07 | 36475444931.77 | 278783879469.847 | 531476651501.442 | 1882226133248.22 | 5928426501393.4 | 11076181194447.5 | 34561017173994.8 | 9200385556746340 |
| 1.95855811902481e-07 | 37251610056.647 | 283733949413.616 | 540320826130.361 | 1909440688844.67 | 6002431465354.31 | 11202543024082.9 | 34887794517269 | 9122486395956470 |
| 1.96189167411426e-07 | 38042380559.521 | 288759104861.431 | 549288834671.968 | 1936973500584.17 | 6077144342676.49 | 11329964397296.9 | 35216589930052.3 | 9045246803096040 |
| 1.96523090306624e-07 | 38847989522.032 | 293860248085.015 | 558382004371.86 | 1964827133135.67 | 6152568975108.2 | 11458449380954.4 | 35547404169672.8 | 8968661193639510 |
| 1.96857581553792e-07 | 39668672912.87 | 299038288249.68 | 567601670320.02 | 1993004155813.78 | 6228709189002.34 | 11588002001110.5 | 35880237864158.4 | 8892724030345200 |
| 1.97192642120293e-07 | 40504669608.389 | 304294141406.043 | 576949175402.962 | 2021507142360.66 | 6305568794809.69 | 11718626242323.7 | 36215091511466.6 | 8817429822854960 |
| 1.97528272975132e-07 | 41356221413.112 | 309628730480.674 | 586425870254.26 | 2050338670725.33 | 6383151586570.26 | 11850326046969 | 36551965478725.1 | 8742773127297200 |
| 1.97864475088967e-07 | 42223573080.109 | 315042985265.634 | 596033113203.43 | 2079501322840.32 | 6461461341402.88 | 11983105314552 | 36890860001484.7 | 8668748545893290 |
| 1.98201249434107e-07 | 43106972331.251 | 320537842406.93 | 605772270223.175 | 2108997684395.81 | 6540501818993.29 | 12116967901024 | 37231775182983 | 8595350726567300 |
| 1.98538596984516e-07 | 44006669877.332 | 326114245391.833 | 615644714874.961 | 2138830344611.02 | 6620276761080.36 | 12251917618097.5 | 37574710993420 | 8522574362559020 |
| 1.98876518715814e-07 | 44922919438.045 | 331773144535.09 | 625651828252.946 | 2169001896003.28 | 6700789890941.04 | 12387958232562.9 | 37919667269246.9 | 8450414192040320 |
| 1.99215015605284e-07 | 45855977761.827 | 337515496963.982 | 635794998926.219 | 2199514934154.24 | 6782044912873.67 | 12525093465607.2 | 38266643712465 | 8378864997734640 |
| 1.99554088631871e-07 | 46806104645.539 | 343342266602.253 | 646075622879.386 | 2230372057473.83 | 6864045511679.96 | 12663326992132.4 | 38615639889938.9 | 8307921606539850 |
| 1.99893738776187e-07 | 47773562954 | 349254424152.87 | 656495103451.444 | 2261575866961.49 | 6946795352145.62 | 12802662440076.5 | 38966655232720.7 | 8237578889154160 |
| 2.00233967020512e-07 | 48758618639.358 | 355252947079.627 | 667054851272.988 | 2293128965965.04 | 7030298078519.82 | 12943103389735.2 | 39319689035386.9 | 8167831759705340 |
| 2.005747743488e-07 | 49761540760.288 | 361338819587.557 | 677756284201.689 | 2325033959936.95 | 7114557313993.27 | 13084653373086 | 39674740455388.8 | 8098675175382920 |
| 2.00916161746677e-07 | 50782601501.021 | 367513032602.182 | 688600827256.098 | 2357293456188.24 | 7199576660175.44 | 13227315873112.9 | 40031808512414.9 | 8030104136073640 |
| 2.01258130201448e-07 | 51822076190.194 | 373776583747.543 | 699589912547.726 | 2389910063639.85 | 7285359696570.49 | 13371094323133.6 | 40390892087766.4 | 7962113683999950 |
| 2.01600680702098e-07 | 52880243319.507 | 380130477323.041 | 710724979211.396 | 2422886392571.67 | 7371909980052.47 | 13515992106128.7 | 40751989923746 | 7894698903361500 |
| 2.01943814239297e-07 | 53957384562.198 | 386575724279.057 | 722007473333.882 | 2456225054369.07 | 7459231044339.36 | 13662012554072.2 | 41115100623059.4 | 7827854919979770 |
| 2.02287531805398e-07 | 55053784791.313 | 393113342191.353 | 733438847880.835 | 2489928661267.1 | 7547326399466.53 | 13809158947264.6 | 41480222648230.6 | 7761576900945650 |
| 2.02631834394446e-07 | 56169732097.772 | 399744355234.233 | 745020562621.935 | 2523999826092.34 | 7636199531259.3 | 13957434513668.4 | 41847354321030.4 | 7695860054269970 |
| 2.02976723002176e-07 | 57305517808.233 | 406469794152.469 | 756754084054.356 | 2558441162002.35 | 7725853900804.89 | 14106842428245 | 42216493821919 | 7630699628537130 |
| 2.03322198626019e-07 | 58461436502.722 | 413290696231.978 | 768640885324.459 | 2593255282222.86 | 7816292943923.76 | 14257385812295.7 | 42587639189500.49 | 7566090912561430 |
| 2.03668262265103e-07 | 59637786032.059 | 420208105269.23 | 780682446147.725 | 2628444799782.63 | 7907520070640.37 | 14409067732802.8 | 42960788319994.1 | 7502029235046600 |
| 2.04014914920256e-07 | 60834867535.044 | 427223071539.408 | 792880252726.989 | 2664012327246.03 | 7999538664653.65 | 14561891201776.2 | 43335938966716.3 | 7438509964247920 |
| 2.04362157594011e-07 | 62052985455.409 | 434336651763.272 | 805235797668.865 | 2699960476443.42 | 8092352082806.85 | 14715859175600 | 43713088739579.1 | 7375528507637420 |
| 2.04709991290607e-07 | 63292447558.528 | 441549909072.751 | 817750579898.45 | 2736291858199.24 | 8185963654557.35 | 14870974554383.9 | 44092235104601.1 | 7313080311571820 |
| 2.0505841701599e-07 | 64553564947.881 | 448863912975.246 | 830426104572.261 | 2773009082057.98 | 8280376681446.08 | 15027240181317.1 | 44473375383434.1 | 7251160860963290 |
| 2.05407435777821e-07 | 65836652081.26 | 456279739316.623 | 843263882989.4 | 2810114756007.91 | 8375594436566.88 | 15184658842024.3 | 44856506752903 | 7189765678952990 |
| 2.05757048585476e-07 | 67142026786.714 | 463798470242.924 | 856265432500.974 | 2847611486202.7 | 8471620164035.8 | 15343233263926.4 | 45241626244560.1 | 7128890326587390 |
| 2.06107256450047e-07 | 68470010278.231 | 471421194160.724 | 869432276417.728 | 2885501876680.96 | 8568457078460.35 | 15502966115603.2 | 45628730744254.9 | 7068530402497360 |
| 2.06458060384347e-07 | 69820927171.134 | 479149005696.214 | 882765943915.934 | 2923788529083.6 | 8666108364408.92 | 15663860006160.6 | 46017816991717.7 | 7008681542579900 |
| 2.06809461402916e-07 | 71195105497.215 | 486983005652.925 | 896267969941.491 | 2962474042369.24 | 8764577175880.43 | 15825917484600 | 46408881580158.8 | 6949339419682660 |
| 2.07161460522017e-07 | 72592876719.557 | 494924300968.123 | 909939895112.266 | 3001561012527.48 | 8863866635774 | 15989141039192.6 | 46801920955881.2 | 6890499743291010 |
| 2.07514058759645e-07 | 74014575747.088 | 502974004667.882 | 923783265618.673 | 3041052032290.27 | 8963979835359.21 | 16153533096856.9 | 47196931417910 | 6832158259217920 |
| 2.07867257135526e-07 | 75460540948.811 | 511133235820.78 | 937799633122.473 | 3080949690841.25 | 9064919833746.71 | 16319096022539.2 | 47593909117635.2 | 6774310749296290 |
| 2.08221056671124e-07 | 76931114167.745 | 519403119490.271 | 951990554653.785 | 3121256573523.15 | 9166689657359.21 | 16485832118599.9 | 47992850058470.8 | 6716953031074030 |
| 2.0857545838964e-07 | 78426640734.538 | 527784786685.683 | 966357592506.389 | 3161975261543.35 | 9269292299403.23 | 16653743624202.1 | 48393750095529.1 | 6660080957511640 |
| 2.08930463316016e-07 | 79947469480.773 | 536279374311.852 | 980902314131.182 | 3203108331677.47 | 9372730719341.32 | 16822832714704.9 | 48796604935308.7 | 6603690416682360 |
| 2.0928607247694e-07 | 81493952751.93 | 544888025117.39 | 995626292027.939 | 3244658355971.17 | 9477007842365.2 | 16993101501061.4 | 49201410135400.49 | 6547777331474910 |
| 2.09642286900846e-07 | 83066446420.032 | 553611887641.58 | 1010531103635.24 | 3286627901440.13 | 9582126558869.5 | 17164552029220.3 | 49608161104206.9 | 6492337659298690 |
| 2.0999910761792e-07 | 84665309895.938 | 562452116159.888 | 1025618331218.7 | 3329019529768.27 | 9688089723926.74 | 17337186279532.7 | 50016853100678.1 | 6437367391791470 |
| 2.103565356601e-07 | 86290906141.292 | 571409870628.085 | 1040889561757.42 | 3371835797004.22 | 9794900156762.94 | 17511006166162.9 | 50427481234062.49 | 6382862554529630 |
| 2.10714572061081e-07 | 87943601680.118 | 580486316624.994 | 1056346386828.6 | 3415079253256.03 | 9902560640234.48 | 17686013536504 | 50840040463674.9 | 6328819206740750 |
| 2.11073217856317e-07 | 89623766610.058 | 589682625293.836 | 1071990402490.57 | 3458752442384.31 | 10011073920306.2 | 17862210170598.4 | 51254525598678.2 | 6275233441018740 |
| 2.11432474083026e-07 | 91331774613.238 | 598999973282.164 | 1087823209163.85 | 3502857901693.63 | 10120442705530.3 | 18039597780563.1 | 51670931297882.6 | 6222101383041290 |
| 2.11792341780189e-07 | 93068002966.755 | 608439542680.43 | 1103846411510.68 | 3547398161622.38 | 10230669666527.4 | 18218178010019.8 | 52089252069560.2 | 6169419191289760 |
| 2.12152821988557e-07 | 94832832552.8 | 618002520959.108 | 1120061618312.61 | 3592375745431.08 | 10341757435467.8 | 18397952433530.7 | 52509482271275 | 6117183056771460 |
| 2.12513915750651e-07 | 96626647868.37 | 627690100904.445 | 1136470442346.5 | 3637793168889.08 | 10453708605555.7 | 18578922556038.3 | 52931616109729.7 | 6065389202744210 |
| 2.12875624110769e-07 | 98449837034.608 | 637503480552.77 | 1153074500258.73 | 3683652939959.86 | 10566525730513.3 | 18761089812311.7 | 53355647640629.1 | 6014033884443310 |
| 2.13237948114984e-07 | 100302791805.727 | 647443863123.414 | 1169875412437.62 | 3729957558484.86 | 10680211324068.1 | 18944455566397.9 | 53781570768557.6 | 5963113388810770 |
| 2.13600888811151e-07 | 102185907577.528 | 657512456950.194 | 1186874802884.25 | 3776709515865.82 | 10794767859441 | 19129021111077.5 | 54209379246875.51 | 5912624034226860 |
| 2.13964447248906e-07 | 104099583395.516 | 667710475411.493 | 1204074299081.46 | 3823911294745.9 | 10910197768836.3 | 19314787667328.4 | 54639066677629.51 | 5862562170243930 |
| 2.14328624479675e-07 | 106044221962.572 | 678039136858.906 | 1221475531861.18 | 3871565368689.3 | 11026503442934.3 | 19501756383792.3 | 55070626511480.3 | 5812924177322470 |
| 2.14693421556672e-07 | 108020229646.221 | 688499664544.472 | 1239080135270.03 | 3919674201859.66 | 11143687230384.4 | 19689928336249.1 | 55504052047647.1 | 5763706466569410 |
| 2.15058839534902e-07 | 110028016485.45 | 699093286546.49 | 1256889746433.29 | 3968240248697.29 | 11261751437302.5 | 19879304527096.2 | 55939336433867.9 | 5714905479478630 |
| 2.15424879471168e-07 | 112067996197.089 | 709821235693.881 | 1274906005417.07 | 4017265953594.99 | 11380698326768.1 | 20069885884834.2 | 56376472666375.8 | 5666517687673710 |
| 2.15791542424071e-07 | 114140586181.743 | 720684749489.155 | 1293130555088.88 | 4066753750572.94 | 11500530118325.3 | 20261673263558.1 | 56815453589893.1 | 5618539592652780 |
| 2.16158829454014e-07 | 116246207529.277 | 731685070029.935 | 1311565040976.53 | 4116706062952.23 | 11621248987485.7 | 20454667442455.4 | 57256271897640.4 | 5570967725535600 |
| 2.16526741623204e-07 | 118385285023.824 | 742823443929.056 | 1330211111125.29 | 4167125303027.5 | 11742857065233.2 | 20648869125309.7 | 57698920131363.8 | 5523798646812750 |
| 2.16895279995656e-07 | 120558247148.342 | 754101122233.231 | 1349070415953.47 | 4218013871738.37 | 11865356437532.2 | 20844278940011.2 | 58143390681377.1 | 5477028946096959 |
| 2.17264445637198e-07 | 122765526088.687 | 765519360340.299 | 1368144608106.3 | 4269374158340 | 11988749144837.3 | 21040897438073.6 | 58589675786622.2 | 5430655241876490 |
| 2.17634239615469e-07 | 125007557737.209 | 777079417915.042 | 1387435342308.2 | 4321208540072.63 | 12113037181606.5 | 21238725094157.1 | 59037767534744.8 | 5384674181270710 |
| 2.18004662999927e-07 | 127284781695.853 | 788782558803.569 | 1406944275213.44 | 4373519381830.23 | 12238222495816.8 | 21437762305598.2 | 59487657862187.7 | 5339082439787620 |
| 2.1837571686185e-07 | 129597641278.782 | 800630050946.284 | 1426673065255.11 | 4426309035828.23 | 12364306988482.4 | 21638009391946.8 | 59939338554300.2 | 5293876721083530 |
| 2.18747402274341e-07 | 131946583514.481 | 812623166289.417 | 1446623372492.56 | 4479579841270.51 | 12491292513176.4 | 21839466594509.1 | 60392801245465.1 | 5249053756724710 |
| 2.19119720312325e-07 | 134332059147.366 | 824763180695.155 | 1466796858457.22 | 4533334124015.55 | 12619180875554.5 | 22042134075898 | 60848037419240.49 | 5204610305951070 |
| 2.19492672052562e-07 | 136754522638.88 | 837051373850.316 | 1487195185996.8 | 4587574196241.85 | 12747973832883.1 | 22246011919590.8 | 61305038408521.3 | 5160543155441850 |
| 2.1986625857364e-07 | 139214432168.062 | 849489029173.638 | 1507820019117.99 | 4642302356112.74 | 12877673093568.8 | 22451100129492.9 | 61763795395714.6 | 5116849119083330 |
| 2.20240480955987e-07 | 141712249631.594 | 862077433721.628 | 1528673022827.53 | 4697520887440.4 | 13008280316693.1 | 22657398629509.5 | 62224299412933.6 | 5073525037738420 |
| 2.20615340281866e-07 | 144248440643.319 | 874817878093.015 | 1549755862971.76 | 4753232059349.43 | 13139797111548.7 | 22864907263124.7 | 62686541342207.1 | 5030567779018280 |
| 2.20990837635384e-07 | 146823474533.218 | 887711656331.77 | 1571070206074.66 | 4809438125939.85 | 13272225037180.3 | 23073625792986.8 | 63150511915707.7 | 4987974237055810 |
| 2.21366974102494e-07 | 149437824345.841 | 900760065828.742 | 1592617719174.35 | 4866141325949.46 | 13405565601927.9 | 23283553900502.6 | 63616201715993.9 | 4945741332281160 |
| 2.21743750770997e-07 | 152091966838.184 | 913964407221.865 | 1614400069658.06 | 4923343882415.98 | 13539820262974.8 | 23494691185437.5 | 64083601176272.1 | 4903866011198990 |
| 2.22121168730543e-07 | 154786382477.023 | 927325984294.991 | 1636418925095.62 | 4981048002338.57 | 13674990425898.3 | 23707037165524.4 | 64552700580672.7 | 4862345246167760 |
| 2.2249922907264e-07 | 157521555435.668 | 940846103875.293 | 1658675953071.54 | 5039255876339.14 | 13811077444224 | 23920591276080 | 65023490064544.2 | 4821176035180790 |
| 2.22877932890651e-07 | 160297973590.158 | 954526075729.316 | 1681172821015.53 | 5097969678323.28 | 13948082618985.1 | 24135352869628.1 | 65495959614764.9 | 4780355401649250 |
| 2.23257281279803e-07 | 163116128514.88 | 968367212457.601 | 1703911196031.6 | 5157191565140.96 | 14086007198284.2 | 24351321215531.7 | 65970099070069.2 | 4739880394186900 |
| 2.23637275337185e-07 | 165976515477.603 | 982370829387.949 | 1726892744725.76 | 5216923676246.97 | 14224852376859.5 | 24568495499632.4 | 66445898121392.6 | 4699748086396730 |
| 2.24017916161753e-07 | 168879633433.935 | 996538244467.32 | 1750119133032.31 | 5277168133361.34 | 14364619295655.4 | 24786874823897.8 | 66923346312232.49 | 4659955576659390 |
| 2.24399204854334e-07 | 171825985021.171 | 1010870778152.31 | 1773592026038.68 | 5337927040129.44 | 14505309041396.6 | 25006458206077.1 | 67402433039025.2 | 4620499987923360 |
| 2.2478114251763e-07 | 174816076551.562 | 1025369753298.33 | 1797313087808.9 | 5399202481782.21 | 14646922646166.9 | 25227244579364.5 | 67883147551541 | 4581378467496970 |
| 2.25163730256218e-07 | 177850418004.967 | 1040036495047.38 | 1821283981205.78 | 5460996524796.29 | 14789461086991.8 | 25449232792071.4 | 68365478953294.8 | 4542588186842140 |
| 2.25546969176555e-07 | 180929523020.898 | 1054872330714.47 | 1845506367711.61 | 5523311216554.17 | 14932925285425.5 | 25672421607306 | 68849416201973.6 | 4504126341369860 |
| 2.25930860386984e-07 | 184053908889.956 | 1069878589672.71 | 1869981907247.69 | 5586148585004.5 | 15077316107142.9 | 25896809702661.5 | 69334948109880.4 | 4465990150237410 |
| 2.26315404997731e-07 | 187224096544.641 | 1085056603237.08 | 1894712257992.37 | 5649510638322.54 | 15222634361535 | 26122395669913.7 | 69822063344395.3 | 4428176856147330 |
| 2.26700604120913e-07 | 190440610549.535 | 1100407704546.83 | 1919699076198.01 | 5713399364570.68 | 15368880801309.9 | 26349178014725 | 70310750428452.6 | 4390683725148050 |
| 2.27086458870541e-07 | 193703979090.858 | 1115933228446.57 | 1944944016006.42 | 5777816731359.37 | 15516056122097.6 | 26577155156358.7 | 70800997741033.7 | 4353508046436190 |
| 2.2747297036252e-07 | 197014733965.39 | 1131634511366.04 | 1970448729263.27 | 5842764685508.29 | 15664160962060 | 26806325427401.6 | 71292793517678.8 | 4316647132160630 |
| 2.27860139714655e-07 | 200373410568.74 | 1147512891198.61 | 1996214865331.15 | 5908245152707.75 | 15813195901505.7 | 27036687073493.9 | 71786125851011.3 | 4280098317228110 |
| 2.28247968046656e-07 | 203780547882.982 | 1163569707178.42 | 2022244070901.43 | 5974260037180.76 | 15963161462509.1 | 27268238253069.9 | 72280982691282.7 | 4243858959110580 |
| 2.28636456480134e-07 | 207236688463.631 | 1179806299756.29 | 2048537989804.92 | 6040811221345.16 | 16114058108535.1 | 27500977037105.4 | 72777351846929.9 | 4207926437654140 |
| 2.29025606138614e-07 | 210742378425.966 | 1196224010474.28 | 2075098262821.42 | 6107900565476.73 | 16265886244068.1 | 27734901408875.6 | 73275220985152.2 | 4172298154889580 |
| 2.29415418147531e-07 | 214298167430.691 | 1212824181839.08 | 2101926527488.01 | 6175529907372.41 | 16418646214247 | 27970009263721 | 73774577632501.4 | 4136971534844540 |
| 2.29805893634234e-07 | 217904608668.924 | 1229608157194.03 | 2129024417906.35 | 6243701062014.45 | 16572338304504.1 | 28206298408822.3 | 74275409175491.02 | 4101944023357290 |
| 2.30197033727993e-07 | 221562258846.526 | 1246577280589.96 | 2156393564548.7 | 6312415821234.94 | 16726962740210.1 | 28443766562984.3 | 74777702861218.2 | 4067213087892060 |
| 2.30588839560001e-07 | 225271678167.748 | 1263732896654.78 | 2184035594063.04 | 6381675953381.5 | 16882519686324.4 | 28682411356429.7 | 75281445798005.9 | 4032776217355910 |
| 2.30981312263372e-07 | 229033430318.196 | 1281076350461.79 | 2211952129076.97 | 6451483202983.07 | 17039009247049.8 | 28922230330599.9 | 75786624956056.2 | 3998630921917170 |
| 2.31374452973154e-07 | 232848082447.121 | 1298608987396.88 | 2240144788000.67 | 6521839290417.26 | 17196431465493.8 | 29163220937968.2 | 76293227168123.7 | 3964774732825460 |
| 2.31768262826323e-07 | 236716205149.002 | 1316332153024.38 | 2268615184828.77 | 6592745911577.94 | 17354786323334.5 | 29405380541858.6 | 76801239130202.7 | 3931205202233180 |
| 2.32162742961792e-07 | 240638372444.462 | 1334247192951.87 | 2297364928941.31 | 6664204737544.21 | 17514073740492.5 | 29648706416276.9 | 77310647402229.3 | 3897919903018490 |
| 2.32557894520411e-07 | 244615161760.464 | 1352355452693.63 | 2326395624903.64 | 6736217414250.05 | 17674293574807.9 | 29893195745748.9 | 77821438408801.9 | 3864916428609900 |
| 2.32953718644974e-07 | 248647153909.816 | 1370658277533.13 | 2355708872265.43 | 6808785562155.2 | 17835445621723.7 | 30138845625169.4 | 78333598439914.7 | 3832192392812190 |
| 2.33350216480219e-07 | 252734933069.976 | 1389157012384.16 | 2385306265358.79 | 6881910775917.05 | 17997529613974.3 | 30385653059660.2 | 78847113651708.4 | 3799745429633940 |
| 2.33747389172831e-07 | 256879086761.134 | 1407853001650.96 | 2415189393095.36 | 6955594624063.57 | 18160545221279.9 | 30633614964436.7 | 79361970067235.1 | 3767573193116460 |
| 2.34145237871449e-07 | 261080205823.595 | 1426747589087.12 | 2445359838762.66 | 7029838648667.66 | 18324492050047.1 | 30882728164685.3 | 79878153577239.02 | 3735673357164150 |
| 2.34543763726665e-07 | 265338884394.442 | 1445842117653.44 | 2475819179819.6 | 7104644365022.52 | 18489369643075 | 31132989395449.6 | 80395649940954.1 | 3704043615376340 |
| 2.34942967891031e-07 | 269655719883.473 | 1465137929374.62 | 2506568987690.99 | 7180013261318.43 | 18655177479267.4 | 31384395301526.2 | 80914444786913.1 | 3672681680880530 |
| 2.35342851519061e-07 | 274031312948.428 | 1484636365194.94 | 2537610827561.54 | 7255946798320.98 | 18821914973351 | 31636942437370.1 | 81434523613776.2 | 3641585286167030 |
| 2.35743415767232e-07 | 278466267469.474 | 1504338764832.76 | 2568946258168.81 | 7332446409050.41 | 18989581475600.2 | 31890627267010 | 81955871791171.02 | 3610752182925050 |
| 2.3614466179399e-07 | 282961190522.972 | 1524246466634.03 | 2600576831595.58 | 7409513498462.65 | 19158176271566.9 | 32145446163972.5 | 82478474560548.98 | 3580180141880110 |
| 2.36546590759754e-07 | 287516692354.517 | 1544360807424.75 | 2632504093061.52 | 7487149443131.99 | 19327698581817.7 | 32401395411217.9 | 83002317036058 | 3549866952632890 |
| 2.36949203826917e-07 | 292133386351.218 | 1564683122362.39 | 2664729580714.01 | 7565355590934.85 | 19498147561676.9 | 32658471201082.7 | 83527384205426.7 | 3519810423499390 |
| 2.37352502159851e-07 | 296811889013.272 | 1585214744786.26 | 2697254825418.52 | 7644133260735.69 | 19669522300975.3 | 32916669635234.9 | 84053660930866 | 3490008381352470 |
| 2.37756486924909e-07 | 301552819924.769 | 1605957006066.95 | 2730081350548.15 | 7723483742074.23 | 19841821823806.2 | 33175986724637.2 | 84581131949983.5 | 3460458671464750 |
| 2.38161159290431e-07 | 306356801723.777 | 1626911235454.73 | 2763210671772.71 | 7803408294854.58 | 20015045088287.7 | 33436418389520.7 | 85109781876713.4 | 3431159157352820 |
| 2.38566520426742e-07 | 311224460071.661 | 1648078759926.99 | 2796644296847.17 | 7883908149036.07 | 20189190986330.6 | 33697960459368.3 | 85639595202260.2 | 3402107720622720 |
| 2.38972571506164e-07 | 316156423621.67 | 1669460904034.78 | 2830383725399.53 | 7964984504325.94 | 20364258343414.3 | 33960608672908.3 | 86170556296057.2 | 3373302260816860 |
| 2.39379313703009e-07 | 321153323986.762 | 1691058989748.34 | 2864430448718.23 | 8046638529873.89 | 20540245918367.6 | 34224358678116.8 | 86702649406736.98 | 3344740695262090 |
| 2.39786748193592e-07 | 326215795706.687 | 1712874336301.76 | 2898785949539.01 | 8128871363968.6 | 20717152403157.7 | 34489206032232 | 87235858663119.7 | 3316420958919130 |
| 2.40194876156228e-07 | 331344476214.304 | 1734908260036.77 | 2933451701831.35 | 8211684113736.16 | 20894976422684.5 | 34755146201776.3 | 87770168075211.02 | 3288341004233280 |
| 2.40603698771238e-07 | 336540005801.154 | 1757162074245.58 | 2968429170584.48 | 8295077854840.63 | 21073716534583.1 | 35022174562589.8 | 88305561535216.6 | 3260498800986390 |
| 2.41013217220953e-07 | 341803027582.272 | 1779637089012.9 | 3003719811592.94 | 8379053631186.71 | 21253371229031.6 | 35290286399873 | 88842022818570.4 | 3232892336150030 |
| 2.41423432689713e-07 | 347134187460.221 | 1802334611057.1 | 3039325071241.8 | 8463612454624.38 | 21433938928566.5 | 35559476908240 | 89379535584973.6 | 3205519613739990 |
| 2.41834346363878e-07 | 352534134088.408 | 1825255943570.57 | 3075246386291.53 | 8548755304655.89 | 21615417987905.1 | 35829741191781.1 | 89918083379449.6 | 3178378654671950 |
| 2.42245959431824e-07 | 358003518833.591 | 1848402386059.28 | 3111485183662.62 | 8634483128145.08 | 21797806693774.3 | 36101074264136.4 | 90457649633412.1 | 3151467496618380 |
| 2.42658273083953e-07 | 363542995737.648 | 1871775234181.46 | 3148042880219.7 | 8720796839028.62 | 21981103264746.7 | 36373471048578.2 | 90998217665744.3 | 3124784193866670 |
| 2.4307128851269e-07 | 369153221478.59 | 1895375779585.63 | 3184920882555.72 | 8807697318030.16 | 22165305851083.4 | 36646926378104 | 91539770683893.8 | 3098326817178450 |
| 2.4348500691249e-07 | 374834855330.781 | 1919205309747.85 | 3222120586775.71 | 8895185412376.3 | 22350412534584.5 | 36921434995540.1 | 92082291784978.3 | 3072093453650120 |
| 2.43899429479843e-07 | 380588559124.42 | 1943265107808.17 | 3259643378280.33 | 8983261935515.45 | 22536421328445.5 | 37196991553654.4 | 92625763956904.4 | 3046082206574510 |
| 2.44314557413274e-07 | 386414997204.24 | 1967556452406.49 | 3297490631549.36 | 9071927666838.94 | 22723330177122.3 | 37473590615279 | 93170170079500.2 | 3020291195303770 |
| 2.44730391913348e-07 | 392314836387.447 | 1992080617517.59 | 3335663709925.03 | 9161183351404.85 | 22911136956201.5 | 37751226653444.49 | 93715492925659.3 | 2994718555113410 |
| 2.45146934182673e-07 | 398288745920.894 | 2016838872285.66 | 3374163965395.25 | 9251029699664.2 | 23099839472280.2 | 38029894051522.1 | 94261715162496.7 | 2969362437067450 |
| 2.45564185425906e-07 | 404337397437.485 | 2041832480858.03 | 3412992738376.73 | 9341467387190.09 | 23289435462850.4 | 38309587103377.7 | 94808819352518 | 2944221007884750 |
| 2.45982146849751e-07 | 410461464911.809 | 2067062702218.37 | 3452151357498.15 | 9432497054409.31 | 23479922596193.1 | 38590300013534.6 | 95356787954800.1 | 2919292449806440 |
| 2.4640081966297e-07 | 416661624615.016 | 2092530790019.24 | 3491641139383.29 | 9524119306336.85 | 23671298471278.2 | 38872026897347.7 | 95905603326184.6 | 2894574960464550 |
| 2.46820205076378e-07 | 422938555068.916 | 2118237992414.07 | 3531463388434.14 | 9616334712313 | 23863560617671.7 | 39154761781185.8 | 96455247722480.1 | 2870066752751640 |
| 2.47240304302853e-07 | 429292936999.328 | 2144185551888.64 | 3571619396614.18 | 9709143805743.56 | 24056706495451.2 | 39438498602626.2 | 97005703299680.9 | 2845766054691620 |
| 2.47661118557339e-07 | 435725453288.639 | 2170374705091.86 | 3612110443231.67 | 9802547083842.73 | 24250733495128 | 39723231210656.9 | 97556952115192.6 | 2821671109311620 |
| 2.48082649056845e-07 | 442236788927.629 | 2196806682666.23 | 3652937794723.11 | 9896545007379.1 | 24445638937576.8 | 40008953365891.4 | 98108976129071.1 | 2797780174514950 |
| 2.48504897020453e-07 | 448827630966.508 | 2223482709077.67 | 3694102704436.84 | 9991138000424.45 | 24641420073972.8 | 40295658740791 | 98661757205273.6 | 2774091522955190 |
| 2.4892786366932e-07 | 455498668465.198 | 2250404002444.93 | 3735606412416.87 | 10086326450105.8 | 24838074085736.9 | 40583340919899.2 | 99215277112918.6 | 2750603441911230 |
| 2.4935155022668e-07 | 462250592442.859 | 2277571774368.54 | 3777450145186.85 | 10182110706360.2 | 25035598084486.7 | 40871993400084.4 | 99769517527557.8 | 2727314233163500 |
| 2.4977595791785e-07 | 469084095826.653 | 2304987229759.36 | 3819635115534.48 | 10278491081693.2 | 25233989111997.3 | 41161609590793.6 | 100324460032459.02 | 2704222212871160 |
| 2.50201087970234e-07 | 475999873399.749 | 2332651566666.69 | 3862162522295.99 | 10375467850940 | 25433244140167.5 | 41452182814315.8 | 100880086119898 | 2681325711450360 |
| 2.50626941613323e-07 | 482998621748.56 | 2360565976105.99 | 3905033550141.09 | 10473041251029.7 | 25633360070995.2 | 41743706306055 | 101436377192464 | 2658623073453500 |
| 2.51053520078701e-07 | 490081039209.254 | 2388731641886.32 | 3948249369358.3 | 10571211480753.7 | 25834333736559.4 | 42036173214813.51 | 101993314564371.02 | 2636112657449600 |
| 2.51480824600048e-07 | 497247825813.48 | 2417149740437.41 | 3991811135640.53 | 10669978700536.2 | 26036161899009.8 | 42329576603085.1 | 102550879462784 | 2613792835905570 |
| 2.51908856413146e-07 | 504499683233.364 | 2445821440636.31 | 4035719989871.25 | 10769343032209.2 | 26238841250565 | 42623909447357.3 | 103109053029150 | 2591661995068540 |
| 2.52337616755877e-07 | 511837314725.753 | 2474747903634.02 | 4079977057911.02 | 10869304558789.9 | 26442368413516.6 | 42919164638424.8 | 103667816320542 | 2569718534849220 |
| 2.52767106868232e-07 | 519261425075.715 | 2503930282681.59 | 4124583450384.61 | 10969863324262.1 | 26646739940243.4 | 43215334981711.4 | 104227150311012.98 | 2547960868706180 |
| 2.53197327992313e-07 | 526772720539.282 | 2533369722956.08 | 4169540262468.45 | 11071019333361.2 | 26851952313230.2 | 43512413197602.6 | 104787035892956.98 | 2526387423531140 |
| 2.53628281372335e-07 | 534371908785.478 | 2563067361386.47 | 4214848573678.96 | 11172772551362.4 | 27058001945097 | 43810391921787.6 | 105347453878480.98 | 2504996639535260 |
| 2.5405996825463e-07 | 542059698837.582 | 2593024326479.07 | 4260509447661.13 | 11275122903872.2 | 27264885178634.3 | 44109263705610.4 | 105908385000787.02 | 2483786970136330 |
| 2.54492389887653e-07 | 549836801013.686 | 2623241738143.06 | 4306523931978.01 | 11378070276624.6 | 27472598286846.8 | 44409021016432.2 | 106469809915556.98 | 2462756881846980 |
| 2.54925547521983e-07 | 557703926866.5 | 2653720707515.73 | 4352893057900.72 | 11481614515279.4 | 27681137473004.8 | 44709656238001.7 | 107031709202356.98 | 2441904854163780 |
| 2.55359442410328e-07 | 565661789122.436 | 2684462336787.69 | 4399617840199.15 | 11585755425225.7 | 27890498870702.3 | 45011161670836 | 107594063366039.02 | 2421229379457330 |
| 2.55794075807528e-07 | 573711101619.981 | 2715467719027.96 | 4446699276933.54 | 11690492771388 | 28100678543924.6 | 45313529532610.6 | 108156852838158 | 2400728962863250 |
| 2.56229448970558e-07 | 581852579247.328 | 2746737938008.99 | 4494138349246.57 | 11795826278036.7 | 28311672487121.8 | 45616751958559.4 | 108720057978396 | 2380402122174070 |
| 2.56665563158533e-07 | 590086937879.314 | 2778274068031.67 | 4541936021156.56 | 11901755628602.4 | 28523476625291.6 | 45920821001883.8 | 109283659075991.02 | 2360247387732120 |
| 2.57102419632712e-07 | 598414894313.629 | 2810077173750.35 | 4590093239351.22 | 12008280465493.2 | 28736086814068.5 | 46225728634171.3 | 109847636351176.98 | 2340263302323220 |
| 2.575400196565e-07 | 606837166206.333 | 2842148309997.86 | 4638610932982.51 | 12115400389917.3 | 28949498839821.9 | 46531466745823.8 | 110411969956632.98 | 2320448421071350 |
| 2.57978364495452e-07 | 615354472006.654 | 2874488521610.56 | 4687490013462.16 | 12223114961708.5 | 29163708419761.1 | 46838027146494.6 | 110976639978936 | 2300801311334180 |
| 2.58417455417277e-07 | 623967530891.107 | 2907098843253.48 | 4736731374258.37 | 12331423699155.7 | 29378711202048.6 | 47145401565535.8 | 111541626440018 | 2281320552599480 |
| 2.58857293691842e-07 | 632677062696.905 | 2939980299245.56 | 4786335890693.33 | 12440326078837 | 29594502765920.4 | 47453581652453.8 | 112106909298644 | 2262004736382430 |
| 2.59297880591176e-07 | 641483787854.681 | 2973133903384.99 | 4836304419741.72 | 12549821535457 | 29811078621815 | 47762558977374.4 | 112672468451876.98 | 2242852466123740 |
| 2.59739217389471e-07 | 650388427320.545 | 3006560658774.79 | 4886637799830.43 | 12659909461689.2 | 30028434211509.7 | 48072325031518 | 113238283736571.02 | 2223862357088750 |
| 2.60181305363091e-07 | 659391702507.442 | 3040261557648.4 | 4937336850639.09 | 12770589208021.4 | 30246564908264.3 | 48382871227682.2 | 113804334930852 | 2205033036267260 |
| 2.6062414579057e-07 | 668494335215.849 | 3074237581195.64 | 4988402372902.01 | 12881860082605.9 | 30465466016972.8 | 48694188900734.9 | 114370601755616 | 2186363142274260 |
| 2.61067739952619e-07 | 677697047563.812 | 3108489699388.83 | 5039835148210.94 | 12993721351113.9 | 30685132774323.3 | 49006269308116 | 114937063876032 | 2167851325251530 |
| 2.61512089132128e-07 | 687000561916.294 | 3143018870809.15 | 5091635938819.25 | 13106172236593.8 | 30905560348964.7 | 49319103630347.2 | 115503700903047.02 | 2149496246770010 |
| 2.6195719461417e-07 | 696405600813.906 | 3177826042473.3 | 5143805487447.2 | 13219211919333.6 | 31126743841681.9 | 49632682971552.3 | 116070492394903.02 | 2131296579733060 |
| 2.62403057686009e-07 | 705912886900.965 | 3212912149660.53 | 5196344517088.5 | 13332839536728.2 | 31348678285577.8 | 49946998359985 | 116637417858652.98 | 2113251008280480 |
| 2.62849679637095e-07 | 715523142852.914 | 3248278115739.91 | 5249253730818.12 | 13447054183150.4 | 31571358646264.4 | 50262040748566.3 | 117204456751687.02 | 2095358227693400 |
| 2.63297061759077e-07 | 725237091303.109 | 3283924851998.04 | 5302533811601.37 | 13561854909826.5 | 31794779822059.9 | 50577801015429.51 | 117771588483260 | 2077616944299919.8 |
| 2.63745205345798e-07 | 735055454768.973 | 3319853257467.13 | 5356185422104.4 | 13677240724716.2 | 32018936644194.8 | 50894269964475.4 | 118338792416032 | 2060025875381610 |
| 2.64194111693308e-07 | 744978955577.538 | 3356064218753.48 | 5410209204506.01 | 13793210592396.6 | 32243823877024.6 | 51211438325935.2 | 118906047867603.02 | 2042583749080719.8 |
| 2.64643782099859e-07 | 755008315790.345 | 3392558609866.42 | 5464605780310.88 | 13909763433951.1 | 32469436218251.1 | 51529296756941.4 | 119473334112058 | 2025289304308260 |
| 2.65094217865916e-07 | 765144257127.777 | 3429337292047.82 | 5519375750164.29 | 14026898126862.9 | 32695768299150.5 | 51847835842108.7 | 120040630381520.98 | 2008141290652830 |
| 2.65545420294154e-07 | 775387500892.75 | 3466401113601.89 | 5574519693668.23 | 14144613504911.6 | 32922814684809.5 | 52167046094121.7 | 120607915867700.98 | 1991138468290170 |
| 2.65997390689467e-07 | 785738767893.828 | 3503750909725.72 | 5630038169199.05 | 14262908358076.3 | 33150569874368.7 | 52486917954331.6 | 121175169723456.98 | 1974279607893550 |
| 2.66450130358971e-07 | 796198778367.763 | 3541387502340.27 | 5685931713726.68 | 14381781432441.4 | 33379028301274.2 | 52807441793361.8 | 121742371064355.02 | 1957563490544890 |
| 2.66903640612005e-07 | 806768251901.431 | 3579311699921.97 | 5742200842635.36 | 14501231430108.4 | 33608184333535.7 | 53128607911720.2 | 122309498970235.02 | 1940988907646620 |
| 2.67357922760138e-07 | 817447907353.213 | 3617524297334.92 | 5798846049545.97 | 14621257009110.8 | 33838032273992.6 | 53450406540421.1 | 122876532486780.98 | 1924554660834290 |
| 2.6781297811717e-07 | 828238462773.82 | 3656026075663.79 | 5855867806140.15 | 14741856783335.4 | 34068566360588.3 | 53772827841613.8 | 123443450627092 | 1908259561889960 |
| 2.68268807999137e-07 | 839140635326.545 | 3694817802047.26 | 5913266561985.75 | 14863029322446.1 | 34299780766650.3 | 54095861909220.6 | 124010232373256.98 | 1892102432656230 |
| 2.68725413724317e-07 | 850155141206.976 | 3733900229512.3 | 5971042744364.39 | 14984773151814.4 | 34531669601179.5 | 54419498769581.4 | 124576856677938 | 1876082104951119.8 |
| 2.6918279661323e-07 | 861282695562.191 | 3773274096809.07 | 6029196758100.4 | 15107086752452.9 | 34764226909145.3 | 54743728382106.7 | 125143302465944 | 1860197420483580 |
| 2.69640957988644e-07 | 872524012409.376 | 3812940128246.62 | 6087728985391.67 | 15229968560954.5 | 34997446671789.6 | 55068540639938.2 | 125709548635823.02 | 1844447230769750 |
| 2.7009989917558e-07 | 883879804553.984 | 3852899033529.36 | 6146639785642.38 | 15353416969435.9 | 35231322806936.8 | 55393925370617.4 | 126275574061444 | 1828830397049900 |
| 2.70559621501309e-07 | 895350783507.339 | 3893151507594.28 | 6205929495297.34 | 15477430325486 | 35465849169311.7 | 55719872336761.4 | 126841357593587.02 | 1813345790206150 |
| 2.71020126295368e-07 | 906937659403.745 | 3933698230449.13 | 6265598427678.35 | 15602006932118.7 | 35701019550865 | 56046371236745.51 | 127406878061534 | 1797992290680760 |
| 2.71481414889552e-07 | 918641140917.123 | 3974539867011.31 | 6325646872822.33 | 15727145047730.6 | 35936827681105.2 | 56373411705395.2 | 127972114274662 | 1782768788395250 |
| 2.71943488617926e-07 | 930461935177.13 | 4015677066947.7 | 6386075097321.41 | 15852842886063.9 | 36173267227438.3 | 56700983314683.2 | 128537045024036.98 | 1767674182670100 |
| 2.72406348816823e-07 | 942400747684.851 | 4057110464515.51 | 6446883344165.08 | 15979098616173.7 | 36410331795515 | 57029075574435.7 | 129101649084010 | 1752707382145210 |
| 2.72869996824852e-07 | 954458282227.973 | 4098840678403.87 | 6508071832584.02 | 16105910362399.6 | 36648014929583.8 | 57357677933043.6 | 129665905213815.02 | 1737867304700930 |
| 2.73334433982901e-07 | 966635240795.546 | 4140868311576.57 | 6569640757896.25 | 16233276204343.2 | 36886310112852.2 | 57686779778183.51 | 130229792159167.02 | 1723152877379880 |
| 2.73799661634137e-07 | 978932323492.288 | 4183193951115.69 | 6631590291355.1 | 16361194176849.7 | 37125210767855.2 | 58016370437543 | 130793288653862 | 1708563036309350 |
| 2.74265681124017e-07 | 991350228452.434 | 4225818168066.25 | 6693920579999.26 | 16489662269994.4 | 37364710256829.3 | 58346439179554.7 | 131356373421375.02 | 1694096726624370 |
| 2.74732493800286e-07 | 1003889651753.21 | 4268741517282 | 6756631746505.08 | 16618678429074.4 | 37604801882095.51 | 58676975214136.2 | 131919025176463.02 | 1679752902391470 |
| 2.75200101012984e-07 | 1016551287327.83 | 4311964537272.19 | 6819723889040.78 | 16748240554605 | 37845478886447.7 | 59007967693437.1 | 132481222626764 | 1665530526533020 |
| 2.75668504114447e-07 | 1029335826878.16 | 4355487750049.5 | 6883197081122.9 | 16878346502320.5 | 38086734453548.2 | 59339405712592.49 | 133042944474402 | 1651428570752300 |
| 2.76137704459315e-07 | 1042243959786.91 | 4399311660979.01 | 6947051371474.9 | 17008994083180.7 | 38328561708331.1 | 59671278310483.1 | 133604169417580.98 | 1637446015459090 |
| 2.76607703404532e-07 | 1055276373029.52 | 4443436758628.48 | 7011286783888.04 | 17140181063382 | 38570953717410.6 | 60003574470501.3 | 134164876152195.02 | 1623581849696010 |
| 2.77078502309352e-07 | 1068433751085.64 | 4487863514619.66 | 7075903317084.4 | 17271905164373 | 38813903489498.6 | 60336283121324.8 | 134725043373420 | 1609835071065380 |
| 2.77550102535343e-07 | 1081716775850.24 | 4532592383480.86 | 7140900944582.05 | 17404164062875.5 | 39057403975825.9 | 60669393137694.2 | 135284649777319.02 | 1596204685656790 |
| 2.78022505446391e-07 | 1095126126544.38 | 4577623802500.86 | 7206279614562.82 | 17536955390910.4 | 39301448070573.3 | 61002893341200.3 | 135843674062442 | 1582689707975190 |
| 2.784957124087e-07 | 1108662479625.69 | 4622958191583.83 | 7272039249742.06 | 17670276735828.4 | 39546028611306.49 | 61336772501073.6 | 136402094931420 | 1569289160869680.2 |
| 2.78969724790804e-07 | 1122326508698.41 | 4668595953105.8 | 7338179747240.81 | 17804125640345.5 | 39791138379419.3 | 61671019334981.7 | 136959891092564 | 1556002075462840 |
| 2.79444543963564e-07 | 1136118884423.25 | 4714537471772.33 | 7404700978460.55 | 17938499602583.5 | 40036770100582.9 | 62005622509833.7 | 137517041261463.02 | 1542827491080660 |
| 2.79920171300174e-07 | 1150040274426.88 | 4760783114477.41 | 7471602788959.97 | 18073396076116.1 | 40282916445201 | 62340570642587 | 138073524162575.02 | 1529764455183150 |
| 2.80396608176165e-07 | 1164091343211.1 | 4807333230163.98 | 7538884998334.44 | 18208812470018.7 | 40529570028872.2 | 62675852301063.8 | 138629318530820.98 | 1516812023295390 |
| 2.80873855969411e-07 | 1178272752061.77 | 4854188149685.58 | 7606547400097.76 | 18344746148924.1 | 40776723412858.2 | 63011456004769.2 | 139184403113176.98 | 1503969258939270 |
| 2.8135191606013e-07 | 1192585158957.53 | 4901348185669.53 | 7674589761566.48 | 18481194433083.4 | 41024369104558.4 | 63347370225718.1 | 139738756670260 | 1491235233565820 |
| 2.81830789830888e-07 | 1207029218478.13 | 4948813632381.59 | 7743011823746.55 | 18618154598430.5 | 41272499557990.9 | 63683583389265.4 | 140292357977915.02 | 1478609026488020 |
| 2.82310478666607e-07 | 1221605581712.64 | 4996584765592.01 | 7811813301222.68 | 18755623876653.1 | 41521107174279.2 | 64020083874942.3 | 140845185828803 | 1466089724814270 |
| 2.82790983954564e-07 | 1236314896167.34 | 5044661842443.04 | 7880993882049.96 | 18893599455267.6 | 41770184302145.8 | 64356860017297 | 141397219033974 | 1453676423382360 |
| 2.83272307084398e-07 | 1251157805673.51 | 5093045101318.1 | 7950553227648.4 | 19032078477699.5 | 42019723238410.8 | 64693900106742 | 141948436424456 | 1441368224694040 |
| 2.83754449448113e-07 | 1266134950294.86 | 5141734761712.3 | 8020490972699.64 | 19171058043368.7 | 42269716228497.6 | 65031192390403.8 | 142498816852823 | 1429164238850150 |
| 2.84237412440082e-07 | 1281246966234.9 | 5190731024104.67 | 8090806725046.57 | 19310535207779.3 | 42520155466943.8 | 65368725072980.7 | 143048339194768 | 1417063583486240 |
| 2.84721197457053e-07 | 1296494485744.06 | 5240034069831.87 | 8161500065595.41 | 19450506982615.2 | 42771033097918.1 | 65706486317601.8 | 143596982350676 | 1405065383708780 |
| 2.85205805898148e-07 | 1311878137026.68 | 5289644060963.61 | 8232570548220.48 | 19590970335839.6 | 43022341215743.4 | 66044464246693.7 | 144144725247189 | 1393168772031940 |
| 2.85691239164874e-07 | 1327398544147.8 | 5339561140179.58 | 8304017699671.63 | 19731922191800.2 | 43274071865424.9 | 66382646942849.9 | 144691546838764 | 1381372888314830 |
| 2.86177498661121e-07 | 1343056326939.86 | 5389785430648.15 | 8375841019484.35 | 19873359431339.4 | 43526217043184.8 | 66721022449704.8 | 145237426109235 | 1369676879699330 |
| 2.8666458579317e-07 | 1358852100909.27 | 5440317035906.72 | 8448039979892.62 | 20015278891908.7 | 43778768697001.7 | 67059578772812.9 | 145782342073368 | 1358079900548430 |
| 2.87152501969694e-07 | 1374786477142.82 | 5491156039743.66 | 8520614025744.32 | 20157677367688.7 | 44031718727156.49 | 67398303880530.9 | 146326273778407 | 1346581112385060 |
| 2.87641248601764e-07 | 1390860062214.02 | 5542302506082.19 | 8593562574419.71 | 20300551609713.7 | 44285058986782.7 | 67737185704905.6 | 146869200305621 | 1335179683831520 |
| 2.88130827102854e-07 | 1407073458089.37 | 5593756478865.82 | 8666885015752.28 | 20443898326001.4 | 44538781282423.3 | 68076212142563.4 | 147411100771849 | 1323874790549310 |
| 2.88621238888843e-07 | 1423427262034.52 | 5645517981945.63 | 8740580711952.76 | 20587714181687.3 | 44792877374592.1 | 68415371055606.3 | 147951954331030.03 | 1312665615179590 |
| 2.8911248537802e-07 | 1439922066520.39 | 5697587018969.32 | 8814648997535.57 | 20731995799163.9 | 45047338978340.49 | 68754650272509.4 | 148491740175741 | 1301551347284020 |
| 2.89604567991087e-07 | 1456558459129.25 | 5749963573272.14 | 8889089179248.32 | 20876739758225.3 | 45302157763830.2 | 69094037589023.51 | 149030437538717 | 1290531183286210 |
| 2.90097488151166e-07 | 1473337022460.74 | 5802647607769.6 | 8963900536004.19 | 21021942596215.9 | 45557325356910.2 | 69433520769080.7 | 149568025694380 | 1279604326413630 |
| 2.90591247283799e-07 | 1490258334037.92 | 5855639064851.97 | 9039082318816.92 | 21167600808184.6 | 45812833339698.7 | 69773087545703.2 | 150104483960345 | 1268769986639940 |
| 2.91085846816956e-07 | 1507322966213.24 | 5908937866280.83 | 9114633750738.88 | 21313710847043.6 | 46068673251171.51 | 70112725621916 | 150639791698942.03 | 1258027380627940 |
| 2.91581288181037e-07 | 1524531486074.61 | 5962543913087.38 | 9190554026801.98 | 21460269123732 | 46324836587753.51 | 70452422671662.5 | 151173928318710.03 | 1247375731672890 |
| 2.92077572808877e-07 | 1541884455351.41 | 6016457085472.65 | 9266842313961.32 | 21607272007383.8 | 46581314803916 | 70792166340722.5 | 151706873275904 | 1236814269646360 |
| 2.92574702135749e-07 | 1559382430320.6 | 6070677242709.84 | 9343497751042.12 | 21754715825501.7 | 46838099312779 | 71131944247635.2 | 152238606075982.03 | 1226342230940570 |
| 2.93072677599368e-07 | 1577025961712.83 | 6125204223048.33 | 9420519448689.13 | 21902596864135 | 47095181486717.6 | 71471743984621.6 | 152769106275097 | 1215958858413170 |
| 2.935715006399e-07 | 1594815594618.65 | 6180037843619.98 | 9497906489319.37 | 22050911368061.8 | 47352552657973.2 | 71811553118514 | 153298353481572 | 1205663401332470 |
| 2.94071172699956e-07 | 1612751868394.79 | 6235177900347.12 | 9575657927077.5 | 22199655540977.1 | 47610204119269.4 | 72151359191684.2 | 153826327357377.97 | 1195455115323190 |
| 2.94571695224608e-07 | 1630835316570.56 | 6290624167852.87 | 9653772787794.59 | 22348825545684.7 | 47868127124432.7 | 72491149722977.1 | 154353007619599 | 1185333262312660 |
| 2.95073069661386e-07 | 1649066466754.25 | 6346376399373.21 | 9732250068949.35 | 22498417504294.2 | 48126312889016.8 | 72830912208644.4 | 154878374041895 | 1175297110477390 |
| 2.95575297460282e-07 | 1667445840539.84 | 6402434326671.34 | 9811088739632.84 | 22648427498422.5 | 48384752590931.7 | 73170634123282.6 | 155402406455951 | 1165345934190240 |
| 2.96078380073757e-07 | 1685973953413.69 | 6458797659953.92 | 9890287740515.83 | 22798851569400.2 | 48643437371077.4 | 73510302920771.7 | 155925084752928 | 1155479013967880 |
| 2.96582318956745e-07 | 1704651314661.37 | 6515466087789.56 | 9969845983819.39 | 22949685718482.4 | 48902358333981.4 | 73849906035217.2 | 156446388884901 | 1145695636418840 |
| 2.97087115566656e-07 | 1723478427274.86 | 6572439277029.31 | 10049762353288.6 | 23100925907064.2 | 49161506548439.4 | 74189430881892.5 | 156966298866287 | 1135995094191870 |
| 2.9759277136338e-07 | 1742455787859.67 | 6629716872729.36 | 10130035704168.8 | 23252568056900.9 | 49420873048162.3 | 74528864858185.1 | 157484794775276 | 1126376685924830 |
| 2.98099287809292e-07 | 1761583886542.32 | 6687298498075.8 | 10210664863185.9 | 23404608050332.6 | 49680448832424.49 | 74868195344542.5 | 158001856755241.97 | 1116839716193980 |
| 2.98606666369256e-07 | 1780863206877.97 | 6745183754311.61 | 10291648628528.2 | 23557041730513.6 | 49940224866718.4 | 75207409705421.2 | 158517465016152 | 1107383495463690 |
| 2.99114908510629e-07 | 1800294225758.33 | 6803372220665.79 | 10372985769833.3 | 23709864901646 | 50200192083410.8 | 75546495290236.98 | 159031599835972 | 1098007340036610 |
| 2.99624015703267e-07 | 1819877413319.7 | 6861863454284.76 | 10454675028176 | 23863073329218 | 50460341382404.2 | 75885439434315.8 | 159544241562054.03 | 1088710572004180 |
| 3.00133989419525e-07 | 1839613232851.39 | 6920656990165.77 | 10536715116060.9 | 24016662740246.6 | 50720663631800.8 | 76224229459846.1 | 160055370612521.97 | 1079492519197680 |
| 3.00644831134267e-07 | 1859502140704.31 | 6979752341092.82 | 10619104717417.3 | 24170628823525 | 50981149668571.4 | 76562852676833.5 | 160564967477648 | 1070352515139610 |
| 3.01156542324866e-07 | 1879544586199.92 | 7039148997574.6 | 10701842487597.5 | 24324967229874.1 | 51241790299226 | 76901296384055.2 | 161073012721222.03 | 1061289898995490 |
| 3.01669124471209e-07 | 1899741011539.41 | 7098846427784.78 | 10784927053378 | 24479673572398 | 51502576300489.4 | 77239547870015.6 | 161579486981905.97 | 1052304015526090 |
| 3.02182579055701e-07 | 1920091851713.24 | 7158844077504.48 | 10868357012963.9 | 24634743426745.4 | 51763498419978.49 | 77577594413902.9 | 162084370974588 | 1043394215040039.9 |
| 3.02696907563274e-07 | 1940597534410.96 | 7219141370067.27 | 10952130935996.7 | 24790172331373.4 | 52024547376884.7 | 77915423286546.9 | 162587645491721.97 | 1034559853346900 |
| 3.03212111481384e-07 | 1961258479931.47 | 7279737706306.06 | 11036247363564.9 | 24945955787816.8 | 52285713862657.2 | 78253021751376.2 | 163089291404657 | 1025800291710540 |
| 3.03728192300018e-07 | 1982075101093.51 | 7340632464502.75 | 11120704808217.8 | 25102089260961.4 | 52546988541691.6 | 78590377065376.9 | 163589289664967 | 1017114896802970 |
| 3.04245151511703e-07 | 2003047803146.58 | 7401825000339.85 | 11205501753982.3 | 25258568179321.3 | 52808362052019.3 | 78927476480051.1 | 164087621305757 | 1008503040658560 |
| 3.04762990611502e-07 | 2024176983682.28 | 7463314646854.61 | 11290636656383.5 | 25415387935321.2 | 53069825006001.51 | 79264307242375.8 | 164584267442969 | 999964100628621 |
| 3.05281711097026e-07 | 2045463032546.02 | 7525100714395.52 | 11376107942467.6 | 25572543885581.4 | 53331367991025 | 79600856595762.7 | 165079209276680 | 991497459336414 |
| 3.05801314468433e-07 | 2066906331749.1 | 7587182490581.09 | 11461914010828.7 | 25730031351208.5 | 53592981570201.3 | 79937111781016.1 | 165572428092384 | 983102504632482 |
| 3.06321802228435e-07 | 2088507255381.33 | 7649559240260.99 | 11548053231637.8 | 25887845618089.5 | 53854656283067.4 | 80273060037292.9 | 166063905262267 | 974778629550405 |
| 3.06843175882301e-07 | 2110266169523.95 | 7712230205479.71 | 11634523946676.4 | 26045981937189.6 | 54116382646290 | 80608688603060.98 | 166553622246472 | 966525232262918 |
| 3.07365436937865e-07 | 2132183432163.16 | 7775194605442.45 | 11721324469371.7 | 26204435524854.8 | 54378151154372.2 | 80943984717057.8 | 167041560594356 | 958341716038393 |
| 3.07888586905522e-07 | 2154259393104.03 | 7838451636483.54 | 11808453084836 | 26363201563118.1 | 54639952280361.3 | 81278935619247.8 | 167527701945733 | 950227489197695 |
| 3.08412627298243e-07 | 2176494393884.88 | 7902000472037.24 | 11895908049908.9 | 26522275200009.7 | 54901776476560.49 | 81613528551781.2 | 168012028032109 | 942181965071404 |
| 3.08937559631572e-07 | 2198888767692.28 | 7965840262610.96 | 11983687593202.9 | 26681651549871.2 | 55163614175241.9 | 81947750759949.6 | 168494520677905.97 | 934204561957401 |
| 3.09463385423631e-07 | 2221442839276.44 | 8029970135760.9 | 12071789915151.7 | 26841325693673.5 | 55425455789361.51 | 82281589493143.3 | 168975161801677 | 926294703078804 |
| 3.09990106195128e-07 | 2244156924867.23 | 8094389196070.16 | 12160213188062.1 | 27001292679339 | 55687291713276.4 | 82615032005805.3 | 169453933417309 | 918451816542267 |
| 3.1051772346936e-07 | 2267031332090.65 | 8159096525129.32 | 12248955556168.8 | 27161547522066.6 | 55949112323463.9 | 82948065558386 | 169930817635213 | 910675335296640 |
| 3.11046238772214e-07 | 2290066359885.94 | 8224091181519.53 | 12338015135692.6 | 27322085204662.5 | 56210907979243 | 83280677418297.1 | 170405796663511 | 902964697091958 |
| 3.11575653632176e-07 | 2313262298423.27 | 8289372200797.83 | 12427390014901.6 | 27482900677872 | 56472669023496.1 | 83612854860861.9 | 170878852809199 | 895319344438800 |
| 3.12105969580334e-07 | 2336619429021.95 | 8354938595485.37 | 12517078254175.5 | 27643988860717.5 | 56734385783394.2 | 83944585170267.6 | 171349968479313.97 | 887738724567974 |
| 3.1263718815038e-07 | 2360138024069.3 | 8420789355057.66 | 12607077886073 | 27805344640838.4 | 56996048571122.3 | 84275855640513.7 | 171819126182081 | 880222289390558 |
| 3.13169310878618e-07 | 2383818346940.13 | 8486923445937.68 | 12697386915403 | 27966962874835.6 | 57257647684607.1 | 84606653576359.8 | 172286308528044 | 872769495458266 |
| 3.13702339303966e-07 | 2407660651916.85 | 8553339811491.31 | 12788003319297.8 | 28128838388619.5 | 57519173408245.51 | 84936966294271.5 | 172751498231203 | 865379803924160 |
| 3.14236274967963e-07 | 2431665184110.21 | 8620037372025.27 | 12878925047290.4 | 28290965977760.8 | 57780616013634.8 | 85266781123364.7 | 173214678110120 | 858052680503689 |
| 3.14771119414769e-07 | 2455832179380.71 | 8687015024787.6 | 12970150021394.6 | 28453340407845.7 | 58041965760303.8 | 85596085406348.7 | 173675831089027 | 850787595436060 |
| 3.15306874191174e-07 | 2480161864260.73 | 8754271643970.74 | 13061676136188.1 | 28615956414833.9 | 58303212896445.6 | 85924866500465.7 | 174134940198913 | 843584023445938 |
| 3.15843540846602e-07 | 2504654455877.26 | 8821806080716.92 | 13153501258898.8 | 28778808705420.5 | 58564347659650.6 | 86253111778429.8 | 174591988578611 | 836441443705461 |
| 3.1638112093311e-07 | 2529310161875.44 | 8889617163126.43 | 13245623229494.7 | 28941891957400.6 | 58825360277641.1 | 86580808629363.6 | 175046959475857.97 | 829359339796593 |
| 3.16919616005401e-07 | 2554129180342.68 | 8957703696267.96 | 13338039860775.8 | 29105200820038.2 | 59086240969006.49 | 86907944459731.3 | 175499836248359 | 822337199673777 |
| 3.17459027620822e-07 | 2579111699733.68 | 9026064462191.87 | 13430748938470.3 | 29268729914437.1 | 59346979943939.2 | 87234506694270.9 | 175950602364827 | 815374515626921 |
| 3.17999357339372e-07 | 2604257898796.01 | 9094698219945.85 | 13523748221333.2 | 29432473833916.3 | 59607567404971.4 | 87560482776923.5 | 176399241406015 | 808470784244684 |
| 3.18540606723703e-07 | 2629567946496.64 | 9163603705593.08 | 13617035441248.1 | 29596427144387.6 | 59867993547712.8 | 87885860171759.1 | 176845737065740 | 801625506378083 |
| 3.19082777339128e-07 | 2655042001949.06 | 9232779632233.04 | 13710608303332.1 | 29760584384737.1 | 60128248561587.4 | 88210626363901.6 | 177290073151888 | 794838187104400 |
| 3.19625870753626e-07 | 2680680214341.31 | 9302224690024.69 | 13804464486044.1 | 29924940067208.7 | 60388322630572.6 | 88534768860448.6 | 177732233587409.97 | 788108335691404 |
| 3.20169888537841e-07 | 2706482722864.74 | 9371937546212.48 | 13898601641295.4 | 30089488677792.2 | 60648205933937.7 | 88858275191390.7 | 178172202411310.03 | 781435465561863 |
| 3.20714832265093e-07 | 2732449656643.64 | 9441916845154.64 | 13993017394564 | 30254224676612.8 | 60907888646982 | 89181132910526.1 | 178609963779611 | 774819094258372 |
| 3.2126070351138e-07 | 2758581134665.62 | 9512161208354.19 | 14087709345012 | 30419142498324.8 | 61167360941774.8 | 89503329596373.1 | 179045501966313.97 | 768258743408462 |
| 3.21807503855381e-07 | 2784877265712.89 | 9582669234492.34 | 14182675065605.2 | 30584236552507.2 | 61426612987893.3 | 89824852853078.3 | 179478801364351 | 761753938690020 |
| 3.22355234878463e-07 | 2811338148294.36 | 9653439499464.73 | 14277912103236.9 | 30749501224063 | 61685634953162.8 | 90145690311323.2 | 179909846486509 | 755304209796993 |
| 3.22903898164684e-07 | 2837963870578.6 | 9724470556419.88 | 14373417978853.4 | 30914930873620.5 | 61944417004394.4 | 90465829629226.1 | 180338621966360 | 748909090405382 |
| 3.23453495300797e-07 | 2864754510327.7 | 9795760935800.43 | 14469190187583.8 | 31080519837938.2 | 62202949308125 | 90785258493240.6 | 180765112559164 | 742568118139529 |
| 3.2400402787626e-07 | 2891710134832 | 9867309145386.8 | 14565226198871.6 | 31246262430311.3 | 62461222031354.7 | 91103964619051.2 | 181189303142764 | 736280834538683 |
| 3.24555497483229e-07 | 2918830800845.7 | 9939113670343.57 | 14661523456610.2 | 31412152940982 | 62719225342285.3 | 91421935752464.7 | 181611178718475 | 730046785023858 |
| 3.25107905716579e-07 | 2946116554523.42 | 10011172973268.1 | 14758079379280.5 | 31578185637552 | 62976949411058 | 91739159670297.7 | 182030724411945.97 | 723865518864963 |
| 3.25661254173892e-07 | 2973567431357.7 | 10083485494242.2 | 14854891360092.5 | 31744354765396.5 | 63234384410490.7 | 92055624181261.6 | 182447925474023 | 717736589148212 |
| 3.26215544455472e-07 | 3001183456117.36 | 10156049650885.6 | 14951956767128.4 | 31910654548082.7 | 63491520516813.9 | 92371317126840.6 | 182862767281590.03 | 711659552743815 |
| 3.26770778164348e-07 | 3028964642786.86 | 10228863838412.9 | 15049272943490.1 | 32077079187789 | 63748347910407.3 | 92686226382170.2 | 183275235338400 | 705633970273938 |
| 3.27326956906276e-07 | 3056910994506.67 | 10301926429692 | 15146837207448.2 | 32243622865727.4 | 64004856776533.9 | 93000339856906.5 | 183685315275895 | 699659406080934 |
| 3.27884082289744e-07 | 3085022503514.49 | 10375235775306.3 | 15244646852595.2 | 32410279742567.9 | 64261037306075.1 | 93313645496095.4 | 184092992854007 | 693735428195846 |
| 3.28442155925981e-07 | 3113299151087.57 | 10448790203617.9 | 15342699148000.4 | 32577043958865.7 | 64516879696263 | 93626131281035.2 | 184498253961952 | 687861608307175 |
| 3.29001179428954e-07 | 3141740907485.97 | 10522588020834.9 | 15440991338368.2 | 32743909635490 | 64772374151413 | 93937785230135.6 | 184901084619009.97 | 682037521729911 |
| 3.29561154415382e-07 | 3170347731896.83 | 10596627511080.4 | 15539520644199.6 | 32910870874055.3 | 65027510883655.1 | 94248595399772 | 185301470975285 | 676262747374829 |
| 3.30122082504731e-07 | 3199119572379.7 | 10670906936463.5 | 15638284261955.3 | 33077921757355 | 65282280113663.1 | 94558549885135.4 | 185699399312460 | 670536867718044 |
| 3.30683965319227e-07 | 3228056365812.79 | 10745424537154.3 | 15737279364222.7 | 33245056349796.4 | 65536672071383.3 | 94867636821077.4 | 186094856044537 | 664859468770822 |
| 3.31246804483855e-07 | 3257158037840.41 | 10820178531459.8 | 15836503099885.5 | 33412268697838.7 | 65790676996762 | 95175844382950.4 | 186487827718558.03 | 659230140049649 |
| 3.31810601626367e-07 | 3286424502821.37 | 10895167115903.4 | 15935952594295.4 | 33579552830432 | 66044285140470.7 | 95483160787443.3 | 186878301015316 | 653648474546555 |
| 3.32375358377284e-07 | 3315855663778.43 | 10970388465306.4 | 16035624949447.2 | 33746902759459.2 | 66297486764631 | 95789574293412.3 | 187266262750061 | 648114068699680 |
| 3.32941076369904e-07 | 3345451412348.88 | 11045840732872.3 | 16135517244156.3 | 33914312480178.3 | 66550272143535.8 | 96095073202705.9 | 187651699873172 | 642626522364103 |
| 3.33507757240304e-07 | 3375211628736.16 | 11121522050272.8 | 16235626534238.8 | 34081775971668.6 | 66802631564371.8 | 96399645860986.2 | 188034599470841 | 637185438782907 |
| 3.34075402627346e-07 | 3405136181662.6 | 11197430527737.6 | 16335949852694.7 | 34249287197276.3 | 67054555327937.4 | 96703280658543.4 | 188414948765721 | 631790424558495 |
| 3.34644014172681e-07 | 3435224928323.24 | 11273564254145.4 | 16436484209893.1 | 34416840105063.8 | 67306033749360.2 | 97005966031106.5 | 188792735117575 | 626441089624146 |
| 3.35213593520754e-07 | 3465477714340.77 | 11349921297118 | 16537226593760.4 | 34584428628259.3 | 67557057158812.49 | 97307690460647.8 | 189167946023903 | 621137047215811 |
| 3.3578414231881e-07 | 3495894373721.59 | 11426499703116.6 | 16638173969971.3 | 34752046685708.6 | 67807615902224.3 | 97608442476182 | 189540569120561.97 | 615877913844152.1 |
| 3.36355662216896e-07 | 3526474728813.06 | 11503297497540.7 | 16739323282141.9 | 34919688182328.6 | 68057700341994.8 | 97908210654561.3 | 189910592182369 | 610663309266814 |
| 3.3692815486787e-07 | 3557218590261.75 | 11580312684829.6 | 16840671452025.4 | 35087347009561.3 | 68307300857700.8 | 98206983621261.8 | 190278003123685 | 605492856460935 |
| 3.375016219274e-07 | 3588125756972.99 | 11657543248565.5 | 16942215379711.2 | 35255017045830.5 | 68556407846803.8 | 98504750051167.6 | 190642789998999 | 600366181595882 |
| 3.38076065053975e-07 | 3619196016071.52 | 11734987151580.1 | 17043951943824.8 | 35422692156998.9 | 68805011725354.8 | 98801498669347.9 | 191004941003486.03 | 595282914006226 |
| 3.38651485908906e-07 | 3650429142863.28 | 11812642336062.5 | 17145878001731.9 | 35590366196827.1 | 69053102928695.2 | 99097218251826.6 | 191364444473552 | 590242686164944 |
| 3.39227886156329e-07 | 3681824900798.41 | 11890506723670.9 | 17247990389744.1 | 35758033007433.5 | 69300671912157.7 | 99391897626349.7 | 191721288887377 | 585245133656844 |
| 3.39805267463217e-07 | 3713383041435.46 | 11968578215644.9 | 17350285923327 | 35925686419755.1 | 69547709151762 | 99685525673143.3 | 192075462865429 | 580289895152214 |
| 3.40383631499376e-07 | 3745103304406.75 | 12046854692921.4 | 17452761397311 | 36093320254010.6 | 69794205144910 | 99978091325667.8 | 192426955170973 | 575376612380705 |
| 3.40962979937457e-07 | 3776985417384.94 | 12125334016252.6 | 17555413586104.4 | 36260928320163 | 70040150411076.8 | 100269583571364 | 192775754710568 | 570504930105421 |
| 3.41543314452957e-07 | 3809029096050.79 | 12204014026326.2 | 17658239243908.4 | 36428504418384.8 | 70285535492500.3 | 100559991452396.98 | 193121850534543 | 565674496097238 |
| 3.42124636724224e-07 | 3841234044062.26 | 12282892543888 | 17761235104935.7 | 36596042339522.7 | 70530350954866.1 | 100849304066388.98 | 193465231837465 | 560884961109338 |
| 3.42706948432464e-07 | 3873599953024.65 | 12361967369866.5 | 17864397883629.5 | 36763535865564.4 | 70774587387991.9 | 101137510567146 | 193805887958589 | 556135978851954 |
| 3.43290251261743e-07 | 3906126502462.12 | 12441236285500.2 | 17967724274886.8 | 36930978770105.51 | 71018235406506.5 | 101424600165387.02 | 194143808382302.03 | 551427205967338 |
| 3.43874546898995e-07 | 3938813359790.37 | 12520697052467 | 18071210954282.1 | 37098364818817.7 | 71261285650527 | 101710562129454 | 194478982738542.03 | 546758302004931 |
| 3.44459837034023e-07 | 3971660180290.61 | 12600347413016.2 | 18174854578294.7 | 37265687769917.1 | 71503728786333.1 | 101995385786022 | 194811400803215 | 542128929396752 |
| 3.4504612335951e-07 | 4004666607084.8 | 12680185090101.9 | 18278651784537.7 | 37432941374634.3 | 71745555507037.5 | 102279060520806 | 195141052498585.97 | 537538753432990 |
| 3.45633407571014e-07 | 4037832271112.05 | 12760207787519.4 | 18382599191989 | 37600119377683.6 | 71986756533252.9 | 102561575779254 | 195467927893669 | 532987442237802 |
| 3.46221691366986e-07 | 4071156791106.4 | 12840413190043.6 | 18486693401224.3 | 37767215517734.1 | 72227322613756.5 | 102842921067236.98 | 195792017204593.97 | 528474666745320 |
| 3.46810976448762e-07 | 4104639773575.91 | 12920798963569.6 | 18590930994653.1 | 37934223527880.9 | 72467244526150.3 | 103123085951735.02 | 196113310794966.03 | 524000100675859.94 |
| 3.47401264520576e-07 | 4138280812782.81 | 13001362755255.5 | 18695308536755.7 | 38101137136116.3 | 72706513077518.7 | 103402060061510 | 196431799176201.97 | 519563420512328 |
| 3.47992557289564e-07 | 4172079490725.21 | 13082102193667.1 | 18799822574323.1 | 38267950065802.2 | 72945119105081.4 | 103679833087778 | 196747473007868 | 515164305476834 |
| 3.48584856465766e-07 | 4206035377119.88 | 13163014888925.3 | 18904469636698.1 | 38434656036142 | 73183053476843.5 | 103956394784868.98 | 197060323097991 | 510802437507494 |
| 3.49178163762132e-07 | 4240148029386.53 | 13244098432855.1 | 19009246236019.1 | 38601248762653.6 | 73420307092242.1 | 104231734970887.02 | 197370340403358.03 | 506477501235440 |
| 3.49772480894529e-07 | 4274416992633.2 | 13325350399137 | 19114148867465.7 | 38767721957642.1 | 73656870882788.7 | 104505843528355.02 | 197677516029809.97 | 502189183962012.06 |
| 3.50367809581744e-07 | 4308841799643.05 | 13406768343460.3 | 19219174009506.1 | 38934069330673 | 73892735812707.3 | 104778710404856.98 | 197981841232513 | 497937175636153 |
| 3.50964151545489e-07 | 4343421970862.52 | 13488349803678.9 | 19324318124146.1 | 39100284589045 | 74127892879570.2 | 105050325613678 | 198283307416220 | 493721168831993 |
| 3.51561508510408e-07 | 4378157014390.71 | 13570092299968.7 | 19429577657180.8 | 39266361438263.51 | 74362333114928 | 105320679234422 | 198581906135521 | 489540858726618 |
| 3.52159882204077e-07 | 4413046425970.12 | 13651993334987.2 | 19534949038447.1 | 39432293582514.2 | 74596047584936.8 | 105589761413642 | 198877629095072 | 485395943078035 |
| 3.52759274357017e-07 | 4448089688978.72 | 13734050394035.2 | 19640428682079.3 | 39598074725135.7 | 74829027390981.5 | 105857562365447.02 | 199170468149823 | 481286122203315 |
| 3.5335968670269e-07 | 4483286274423.34 | 13816260945220.4 | 19746012986764.9 | 39763698569092.8 | 75061263670293.2 | 106124072372111.02 | 199460415305217.97 | 477211098956930 |
| 3.53961120977512e-07 | 4518635640934.48 | 13898622439623.2 | 19851698336003.7 | 39929158817449.8 | 75292747596565.2 | 106389281784671.02 | 199747462717395 | 473170578709264 |
| 3.54563578920852e-07 | 4554137234762.26 | 13981132311463.9 | 19957481098367.4 | 40094449173842.8 | 75523470380562.3 | 106653181023515.02 | 200031602693361.97 | 469164269325319 |
| 3.55167062275041e-07 | 4589790489773.93 | 14063787978272.8 | 20063357627761.5 | 40259563342952.49 | 75753423270727.02 | 106915760578972.98 | 200312827691167 | 465191881143582 |
| 3.55771572785375e-07 | 4625594827452.62 | 14146586841061.3 | 20169324263689 | 40424495030976.4 | 75982597553780.8 | 107177011011884.98 | 200591130320051 | 461253126955093 |
| 3.5637711220012e-07 | 4661549656897.41 | 14229526284495.4 | 20275377331515 | 40589237946100.1 | 76210984555322 | 107436922954176.98 | 200866503340589 | 457347721982671 |
| 3.56983682270518e-07 | 4697654374824.87 | 14312603677070.8 | 20381513142733.7 | 40753785798969.4 | 76438575640417.9 | 107695487109416 | 201138939664817 | 453475383860332.06 |
| 3.57591284750793e-07 | 4733908365571.81 | 14395816371290.3 | 20487727995236.3 | 40918132303160.8 | 76665362214193.1 | 107952694253372 | 201408432356345 | 449635832612864 |
| 3.58199921398152e-07 | 4770311001099.5 | 14479161703842.7 | 20594018173581.1 | 41082271175651.9 | 76891335722413.1 | 108208535234552.98 | 201674974630461 | 445828790635595 |
| 3.58809593972796e-07 | 4806861640999.2 | 14562636995783.3 | 20700379949264.1 | 41246196137290.9 | 77116487652063.3 | 108463000974756 | 201938559854217 | 442053982674312 |
| 3.59420304237919e-07 | 4843559632499.04 | 14646239552717.1 | 20806809580992 | 41409900913266.49 | 77340809531923.02 | 108716082469587.02 | 202199181546502.03 | 438311135805367 |
| 3.60032053959719e-07 | 4880404310472.32 | 14729966664982.3 | 20913303314956.4 | 41573379233575.51 | 77564292933135.3 | 108967770788992 | 202456833378110.03 | 434599979415942 |
| 3.60644844907397e-07 | 4917394997447.12 | 14813815607837.2 | 21019857385108.9 | 41736624833491 | 77786929469771.5 | 109218057077768 | 202711509171783 | 430920245184481 |
| 3.61258678853168e-07 | 4954531003617.26 | 14897783641647.6 | 21126468013438 | 41899631454029 | 78008710799391.02 | 109466932556071.02 | 202963202902247 | 427271667061293 |
| 3.61873557572262e-07 | 4991811626854.77 | 14981868012076.7 | 21233131410247.2 | 42062392842414.4 | 78229628623596.6 | 109714388519920 | 203211908696240 | 423653981249315 |
| 3.6248948284293e-07 | 5029236152723.49 | 15066065950275.7 | 21339843774434.6 | 42224902752546.4 | 78449674688584.2 | 109960416341680.98 | 203457620832519 | 420066926185040 |
| 3.63106456446452e-07 | 5066803854494.27 | 15150374673077.7 | 21446601293773.2 | 42387154945462.6 | 78668840785688 | 110205007470562 | 203700333741856 | 416510242519603 |
| 3.63724480167137e-07 | 5104513993161.42 | 15234791383191 | 21553400145192.8 | 42549143189801.51 | 78887118751920.2 | 110448153433078 | 203940042007025.97 | 412983673100034 |
| 3.64343555792332e-07 | 5142365817460.52 | 15319313269396.4 | 21660236495063.5 | 42710861262265.8 | 79104500470506.5 | 110689845833527.02 | 204176740362780 | 409486962950662 |
| 3.64963685112427e-07 | 5180358563887.69 | 15403937506744.3 | 21767106499479 | 42872302948082 | 79320977871415.3 | 110930076354447.02 | 204410423695797 | 406019859254680 |
| 3.65584869920859e-07 | 5218491456720.16 | 15488661256754.2 | 21874006304542.8 | 43033462041460.9 | 79536542931882.7 | 111168836757072 | 204641087044643 | 402582111335869 |
| 3.66207112014116e-07 | 5256763708038.2 | 15573481667615.1 | 21980932046653.8 | 43194332346056.49 | 79751187676931.7 | 111406118881768.98 | 204868725599693 | 399173470640471 |
| 3.66830413191746e-07 | 5295174517748.44 | 15658395874388.8 | 22087879852794.2 | 43354907675422.3 | 79964904179886.3 | 111641914648484.98 | 205093334703062.03 | 395793690719218 |
| 3.6745477525636e-07 | 5333723073608.7 | 15743400999212.8 | 22194845840817.6 | 43515181853468.4 | 80177684562880.5 | 111876216057164.98 | 205314909848513 | 392442527209516.06 |
| 3.68080200013632e-07 | 5372408551253.88 | 15828494151506.1 | 22301826119738.7 | 43675148714914.9 | 80389520997361.7 | 112109015188178 | 205533446681351 | 389119737817776 |
| 3.68706689272317e-07 | 5411230114223.46 | 15913672428176 | 22408816790023 | 43834802105746.2 | 80600405704588.5 | 112340304202731.02 | 205748940998310.03 | 385825082301893 |
| 3.69334244844243e-07 | 5450186913990.38 | 15998932913825.8 | 22515813943878.7 | 43994135883662.2 | 80810330956123.9 | 112570075343267.02 | 205961388747427 | 382558322453882 |
| 3.69962868544325e-07 | 5489278089991.09 | 16084272680965.1 | 22622813665548.2 | 44153143918528.1 | 81019289074321.6 | 112798320933866 | 206170786027904 | 379319222082649 |
| 3.70592562190565e-07 | 5528502769657.15 | 16169688790219.9 | 22729812031601.4 | 44311820092824 | 81227272432809.1 | 113025033380631.02 | 206377129089952 | 376107546996919 |
| 3.7122332760406e-07 | 5567860068448.1 | 16255178290545.4 | 22836805111229 | 44470158302090.7 | 81434273456962.2 | 113250205172070 | 206580414334633 | 372923064988302 |
| 3.71855166609007e-07 | 5607349089885.74 | 16340738219439.6 | 22943788966537.1 | 44628152455376.3 | 81640284624376.7 | 113473828879462 | 206780638313683 | 369765545814502 |
| 3.72488081032707e-07 | 5646968925589.67 | 16426365603157.7 | 23050759652842.5 | 44785796475678.7 | 81845298465333.1 | 113695897157228.98 | 206977797729323 | 366634761182674 |
| 3.73122072705572e-07 | 5686718655314.31 | 16512057456928.7 | 23157713218968.3 | 44943084300388.3 | 82049307563255.3 | 113916402743283.02 | 207171889434064 | 363530484732913 |
| 3.73757143461129e-07 | 5726597346987.21 | 16597810785172.4 | 23264645707540.5 | 45100009881727.3 | 82252304555165.2 | 114135338459379.02 | 207362910430495 | 360452492021894 |
| 3.74393295136026e-07 | 5766604056748.68 | 16683622581718.1 | 23371553155284.9 | 45256567187188.9 | 82454282132129.5 | 114352697211452 | 207550857871062.03 | 357400560506640 |
| 3.75030529570037e-07 | 5806737828992.81 | 16769489830024.4 | 23478431593325.1 | 45412750199972.6 | 82655233039702.9 | 114568471989946 | 207735729057830.03 | 354374469528432 |
| 3.75668848606067e-07 | 5846997696409.85 | 16855409503399.9 | 23585277047480.5 | 45568552919418.9 | 82855150078363.5 | 114782655870140 | 207917521442246.03 | 351374000296860.06 |
| 3.76308254090158e-07 | 5887382680029.83 | 16941378565225.2 | 23692085538565.1 | 45723969361442.1 | 83054026103944.3 | 114995242012458 | 208096232624876 | 348398935873996.06 |
| 3.76948747871495e-07 | 5927891789267.64 | 17027393969176.2 | 23798853082686.3 | 45878993558959.9 | 83251854028056.9 | 115206223662780.98 | 208271860355141 | 345449061158716.06 |
| 3.77590331802409e-07 | 5968524021969.35 | 17113452659448.2 | 23905575691545.2 | 46033619562322.2 | 83448626818511.1 | 115415594152740 | 208444402531033 | 342524162871146 |
| 3.78233007738383e-07 | 6009278364459.92 | 17199551570980.9 | 24012249372736.1 | 46187841439737 | 83644337499727.5 | 115623346900007.02 | 208613857198833.97 | 339624029537238 |
| 3.78876777538061e-07 | 6050153791592.11 | 17285687629684.6 | 24118870130046.9 | 46341653277694.2 | 83838979153144.5 | 115829475408576 | 208780222552806.03 | 336748451473488 |
| 3.79521643063248e-07 | 6091149266796.94 | 17371857752668 | 24225433963760 | 46495049181387.7 | 84032544917619.9 | 116033973269039.02 | 208943496934883 | 333897220771766 |
| 3.80167606178919e-07 | 6132263742135.17 | 17458058848465.6 | 24331936870953.2 | 46648023275134.49 | 84225027989825.1 | 116236834158848.98 | 209103678834349 | 331070131284291 |
| 3.80814668753223e-07 | 6173496158350.33 | 17544287817267.2 | 24438374845801 | 46800569702792.1 | 84416421624634.7 | 116438051842574 | 209260766887499 | 328266978608723.94 |
| 3.81462832657488e-07 | 6214845444922.91 | 17630541551147.8 | 24544743879875.6 | 46952682628173.3 | 84606719135509.5 | 116637620172152.98 | 209414759877301 | 325487560073389 |
| 3.82112099766228e-07 | 6256310520125.95 | 17716816934298.5 | 24651039962449.3 | 47104356235458.49 | 84795913894873.9 | 116835533087127.02 | 209565656733037 | 322731674722620.06 |
| 3.82762471957148e-07 | 6297890291081.75 | 17803110843258.1 | 24757259080795.6 | 47255584729606 | 84983999334486 | 117031784614880.98 | 209713456529935 | 319999123302233 |
| 3.83413951111147e-07 | 6339583653820.08 | 17889420147145.7 | 24863397220491.4 | 47406362336759.3 | 85170968945803.3 | 117226368870859.02 | 209858158488799 | 317289708245115 |
| 3.84066539112328e-07 | 6381389493337.56 | 17975741707894.1 | 24969450365719.1 | 47556683304652.2 | 85356816280340.8 | 117419280058787.02 | 209999761975617 | 314603233656945 |
| 3.84720237847998e-07 | 6423306683658.26 | 18062072380483.8 | 25075414499568.1 | 47706541903011.4 | 85541534950024.3 | 117610512470875.02 | 210138266501163 | 311939505302030 |
| 3.85375049208678e-07 | 6465334087895.65 | 18148409013177.7 | 25181285604337.5 | 47855932423956.4 | 85725118627536.4 | 117800060488020 | 210273671720596 | 309298330589257 |
| 3.86030975088107e-07 | 6507470558315.84 | 18234748447756.9 | 25287059661837.2 | 48004849182396.7 | 85907561046656.98 | 117987918579996.98 | 210405977433037 | 306679518558174 |
| 3.86688017383247e-07 | 6549714936401.87 | 18321087519756.3 | 25392732653690.7 | 48153286516426.4 | 86088856002596.8 | 118174081305639.02 | 210535183581141 | 304082879865178 |
| 3.87346177994287e-07 | 6592066052919.61 | 18407423058702.1 | 25498300561636.2 | 48301238787716.4 | 86268997352327.1 | 118358543313016 | 210661290250665 | 301508226769831 |
| 3.88005458824652e-07 | 6634522727984.46 | 18493751888349 | 25603759367828.6 | 48448700381903.2 | 86447979014898.9 | 118541299339600.98 | 210784297670016 | 298955373121280 |
| 3.88665861781007e-07 | 6677083771129.67 | 18580070826918 | 25709105055141 | 48595665708975.7 | 86625794971760.98 | 118722344212424.98 | 210904206209795 | 296424134344803 |
| 3.89327388773261e-07 | 6719747981375.6 | 18666376687335.2 | 25814333607465.9 | 48742129203658.49 | 86802439267067.3 | 118901672848232 | 211021016382329 | 293914327428463 |
| 3.89990041714575e-07 | 6762514147300.38 | 18752666277470.9 | 25919441010016.1 | 48888085325792.6 | 86977906007980.5 | 119079280253619.02 | 211134728841199 | 291425770909871 |
| 3.90653822521364e-07 | 6805381047111.68 | 18838936400379.2 | 26024423249625.5 | 49033528560713.6 | 87152189364969.8 | 119255161525174 | 211245344380749 | 288958284863074 |
| 3.91318733113308e-07 | 6848347448719.69 | 18925183854538 | 26129276315049.9 | 49178453419626.4 | 87325283572099.5 | 119429311849595.02 | 211352863935593.97 | 286511690885541 |
| 3.91984775413352e-07 | 6891412109811.4 | 19011405434089.8 | 26233996197266.5 | 49322854439977.3 | 87497182927315.1 | 119601726503816.98 | 211457288580112 | 284085812085266 |
| 3.92651951347714e-07 | 6934573777925.81 | 19097597929082.1 | 26338578889774.2 | 49466726185822.7 | 87667881792720 | 119772400855116.98 | 211558619527935 | 281680473067976 |
| 3.93320262845893e-07 | 6977831190530.63 | 19183758125709.5 | 26443020388892.3 | 49610063248195.51 | 87837374594847.3 | 119941330361218 | 211656858131422.03 | 279295499924453 |
| 3.93989711840669e-07 | 7021183075099.92 | 19269882806554.7 | 26547316694059.9 | 49752860245467.6 | 88005655824925.8 | 120108510570380.98 | 211752005881129.97 | 276930720217960 |
| 3.94660300268113e-07 | 7064628149192.97 | 19355968750830.7 | 26651463808133.9 | 49895111823710.3 | 88172720039138.1 | 120273937121496 | 211844064405269 | 274585962971771 |
| 3.95332030067592e-07 | 7108165120534.3 | 19442012734623.4 | 26755457737686.8 | 50036812657050.1 | 88338561858873.7 | 120437605744158 | 211933035469158.03 | 272261058656811 |
| 3.96004903181772e-07 | 7151792687094.86 | 19528011531133.9 | 26859294493304.5 | 50177957448023.51 | 88503175970975.7 | 120599512258736 | 212018920974662.03 | 269955839179397 |
| 3.96678921556629e-07 | 7195509537174.23 | 19613961910921.2 | 26962970089882.3 | 50318540927926.1 | 88666557127980.2 | 120759652576436.98 | 212101722959625 | 267670137869088 |
| 3.97354087141446e-07 | 7239314349484.11 | 19699860642145.7 | 27066480546921.5 | 50458557857160.4 | 88828700148350.4 | 120918022699363.02 | 212181443597300 | 265403789466632 |
| 3.98030401888828e-07 | 7283205793232.76 | 19785704490811.6 | 27169821888824.4 | 50598003025579.9 | 88989599916703.5 | 121074618720554 | 212258085195757 | 263156630112017 |
| 3.98707867754702e-07 | 7327182528210.65 | 19871490221011.3 | 27272990145189.6 | 50736871252829.1 | 89149251384032.8 | 121229436824028.98 | 212331650197296 | 260928497332627 |
| 3.99386486698324e-07 | 7371243204877.1 | 19957214595168 | 27375981351105.5 | 50875157388681.51 | 89307649567921.1 | 121382473284820 | 212402141177846.03 | 258719230031489 |
| 4.00066260682285e-07 | 7415386464448.15 | 20042874374279.7 | 27478791547443.9 | 51012856313373.1 | 89464789552749.6 | 121533724468991.02 | 212469560846353 | 256528668475633.97 |
| 4.00747191672516e-07 | 7459610938985.32 | 20128466318162.8 | 27581416781152.3 | 51149962937933.4 | 89620666489900.7 | 121683186833656.98 | 212533912044168 | 254356654284540 |
| 4.01429281638294e-07 | 7503915251485.49 | 20213987185695.7 | 27683853105545.6 | 51286472204512.4 | 89775275597952 | 121830856926991.02 | 212595197744419 | 252203030418683 |
| 4.02112532552249e-07 | 7548298015971.97 | 20299433735062.6 | 27786096580597.1 | 51422379086704.4 | 89928612162867.5 | 121976731388226 | 212653421051377.97 | 250067641168189 |
| 4.02796946390367e-07 | 7592757837586.32 | 20384802723997 | 27888143273228.2 | 51557678589868.7 | 90080671538179.3 | 122120806947646 | 212708585199824 | 247950332141566.03 |
| 4.03482525131998e-07 | 7637293312681.5 | 20470090910025.5 | 27989989257597.6 | 51692365751446.49 | 90231449145165.2 | 122263080426572.98 | 212760693554393 | 245850950254550.03 |
| 4.04169270759861e-07 | 7681903028915.8 | 20555295050711.2 | 28091630615389.2 | 51826435641273.7 | 90380940473018.3 | 122403548737343.02 | 212809749608924 | 243769343719030.03 |
| 4.04857185260049e-07 | 7726585565347.85 | 20640411903897.3 | 28193063436099.6 | 51959883361892.1 | 90529141079011.7 | 122542208883279.02 | 212855756985793 | 241705362032080 |
| 4.05546270622036e-07 | 7771339492532.7 | 20725438227950.4 | 28294283817323.8 | 52092704048854.3 | 90676046588656.4 | 122679057958652.98 | 212898719435246.03 | 239658855965070.03 |
| 4.06236528838683e-07 | 7816163372618.78 | 20810370782003.2 | 28395287865040.2 | 52224892871027.7 | 90821652695852.1 | 122814093148639.02 | 212938640834723 | 237629677552883 |
| 4.06927961906241e-07 | 7861055759445.82 | 20895206326198.2 | 28496071693895.4 | 52356445030893 | 90965955163032.98 | 122947311729262 | 212975525188168 | 235617680083216 |
| 4.07620571824361e-07 | 7906015198643.8 | 20979941621929.9 | 28596631427485.7 | 52487355764840.4 | 91108949821306.1 | 123078711067340.98 | 213009376625345 | 233622718085968 |
| 4.08314360596094e-07 | 7951040227732.79 | 21064573432087.4 | 28696963198640.6 | 52617620343461.1 | 91250632570584.98 | 123208288620419.02 | 213040199401133 | 231644647322726.03 |
| 4.09009330227905e-07 | 7996129376223.77 | 21149098521296.8 | 28797063149701.9 | 52747234071836 | 91390999379714.7 | 123336041936692.98 | 213067997894825 | 229683324776339 |
| 4.0970548272967e-07 | 8041281165720.21 | 21233513656162.8 | 28896927432803.8 | 52876192289820 | 91530046286593.2 | 123461968654926 | 213092776609414.03 | 227738608640569.97 |
| 4.10402820114688e-07 | 8086494110020.89 | 21317815605510.6 | 28996552210151.2 | 53004490372323.7 | 91667769398284.1 | 123586066504364.98 | 213114540170877 | 225810358309848 |
| 4.11101344399684e-07 | 8131766715223.17 | 21402001140626.8 | 29095933654296.5 | 53132123729589.7 | 91804164891125.5 | 123708333304640.98 | 213133293327448 | 223898434369105.97 |
| 4.11801057604817e-07 | 8177097479827.54 | 21486067035500.8 | 29195067948415.2 | 53259087807466.9 | 91939229010830.5 | 123828766965670 | 213149040948887 | 222002698583693 |
| 4.12501961753681e-07 | 8222484894842.81 | 21570010067064.3 | 29293951286580.5 | 53385378087679.6 | 92072958072582.7 | 123947365487538 | 213161788025744 | 220123013889385 |
| 4.13204058873319e-07 | 8267927443892.15 | 21653827015432.3 | 29392579874036.1 | 53510990088094.6 | 92205348461125.4 | 124064126960388.98 | 213171539668615 | 218259244382470.03 |
| 4.13907350994219e-07 | 8313423603320.24 | 21737514664142.1 | 29490949927468 | 53635919362982.2 | 92336396630844.3 | 124179049564296.98 | 213178301107390.03 | 216411255309929 |
| 4.1461184015033e-07 | 8358971842300.73 | 21821069800392 | 29589057675275 | 53760161503275.4 | 92466099105844.6 | 124292131569136 | 213182077690500 | 214578913059689 |
| 4.15317528379058e-07 | 8404570622945.13 | 21904489215280.8 | 29686899357836.9 | 53883712136824.1 | 92594452480020.8 | 124403371334444 | 213182874884153 | 212762085150961 |
| 4.16024417721282e-07 | 8450218400412.06 | 21987769704044.8 | 29784471227783 | 54006566928646.2 | 92721453417122 | 124512767309276 | 213180698271571 | 210960640224665 |
| 4.16732510221349e-07 | 8495913623017.42 | 22070908066295.5 | 29881769550257.2 | 54128721581174.3 | 92847098650809.8 | 124620318032052 | 213175553552211 | 209174448033932 |
| 4.1744180792709e-07 | 8541654732345.4 | 22153901106256.8 | 29978790603182.6 | 54250171834498.9 | 92971384984710.8 | 124726022130402 | 213167446540993 | 207403379434684 |
| 4.1815231288982e-07 | 8587440163360.15 | 22236745633000.5 | 30075530677524.7 | 54370913466607.51 | 93094309292462.1 | 124829878320995.02 | 213156383167509 | 205647306376300 |
| 4.18864027164345e-07 | 8633268344518.32 | 22319438460682.2 | 30171986077552.7 | 54490942293619.7 | 93215868517752.8 | 124931885409372.98 | 213142369475241 | 203906101892357 |
| 4.19576952808969e-07 | 8679137697882.15 | 22401976408776.1 | 30268153121099.2 | 54610254170018.8 | 93336059674356.8 | 125032042289767.02 | 213125411620761.97 | 202179640091449 |
| 4.20291091885498e-07 | 8725046639233.47 | 22484356302308.9 | 30364028139818.4 | 54728844988879.51 | 93454879846161.6 | 125130347944916.98 | 213105515872937 | 200467796148085 |
| 4.2100644645925e-07 | 8770993578188.32 | 22566574972093.7 | 30459607479442.7 | 54846710682090.8 | 93572326187190.3 | 125226801445876.98 | 213082688612120 | 198770446293667 |
| 4.21723018599056e-07 | 8816976918312.19 | 22648629254962 | 30554887500037.7 | 54963847220575.9 | 93688395921617.8 | 125321401951816.98 | 213056936329343 | 197087467807537 |
| 4.22440810377268e-07 | 8862995057236.14 | 22730515993996.1 | 30649864576255.5 | 55080250614508.2 | 93803086343780.7 | 125414148709819.02 | 213028265625501 | 195418739008107 |
| 4.23159823869766e-07 | 8909046386773.3 | 22812232038759.6 | 30744535097585.8 | 55195916913522.1 | 93916394818182 | 125505041054664.98 | 212996683210537 | 193764139244057.97 |
| 4.23880061155965e-07 | 8955129293036.34 | 22893774245528.3 | 30838895468606.4 | 55310842206921.8 | 94028318779489.7 | 125594078408623.02 | 212962195902613 | 192123548885623 |
| 4.24601524318817e-07 | 9001242156555.25 | 22975139477519 | 30932942109230.4 | 55425022623883.7 | 94138855732528.9 | 125681260281216.98 | 212924810627286.03 | 190496849315931 |
| 4.2532421544482e-07 | 9047383352396.01 | 23056324605118.4 | 31026671454953.4 | 55538454333657.7 | 94248003252268.3 | 125766586269004 | 212884534416673.97 | 188883922922433.97 |
| 4.26048136624021e-07 | 9093551250279.72 | 23137326506110.1 | 31120079957097.2 | 55651133545761.2 | 94355758983802.1 | 125850056055331.02 | 212841374408617.97 | 187284653088403 |
| 4.26773289950029e-07 | 9139744214702.33 | 23218142065902.1 | 31213164083053 | 55763056510172.3 | 94462120642324.2 | 125931669410100 | 212795337845843 | 185698924184497 |
| 4.27499677520014e-07 | 9185960605054.98 | 23298768177751.5 | 31305920316521.8 | 55874219517516.49 | 94567086013097.5 | 126011426189512.98 | 212746432075113.97 | 184126621560401.97 |
| 4.28227301434714e-07 | 9232198775744.9 | 23379201742990.2 | 31398345157753.5 | 55984618899251.1 | 94670652951418.4 | 126089326335820.98 | 212694664546382.03 | 182567631536543 |
| 4.28956163798444e-07 | 9278457076316.84 | 23459439671248 | 31490435123784.2 | 56094251027843.9 | 94772819382574 | 126165369877062 | 212640042811937.97 | 181021841395860 |
| 4.29686266719103e-07 | 9324733851575.03 | 23539478880675.3 | 31582186748670.9 | 56203112316950.3 | 94873583301794.2 | 126239556926796 | 212582574525550.03 | 179489139375668 |
| 4.30417612308172e-07 | 9371027441705.67 | 23619316298165.2 | 31673596583725.1 | 56311199221583.3 | 94972942774199.02 | 126311887683834 | 212522267441607 | 177969414659565 |
| 4.31150202680732e-07 | 9417336182399.89 | 23698948859573.5 | 31764661197743.6 | 56418508238282.2 | 95070895934738.8 | 126382362431956 | 212459129414254.03 | 176462557369429 |
| 4.3188403995546e-07 | 9463658404977.25 | 23778373509938.5 | 31855377177238.3 | 56525035905275.3 | 95167440988129.8 | 126450981539630 | 212393168396521.97 | 174968458557469 |
| 4.3261912625464e-07 | 9509992436509.64 | 23857587203699.5 | 31945741126663.2 | 56630778802640 | 95262576208784.4 | 126517745459722 | 212324392439463 | 173487010198347 |
| 4.33355463704169e-07 | 9556336599945.74 | 23936586904913.8 | 32035749668639.7 | 56735733552457.9 | 95356299940735.2 | 126582654729200.98 | 212252809691271 | 172018105181374.03 |
| 4.34093054433562e-07 | 9602689214235.76 | 24015369587472.6 | 32125399444179.7 | 56839896818966 | 95448610597552.98 | 126645709968839.02 | 212178428396406.03 | 170561637302757 |
| 4.34831900575957e-07 | 9649048594456.78 | 24093932235316.4 | 32214687112907.2 | 56943265308704.4 | 95539506662262.1 | 126706911882900.98 | 212101256894716 | 169117501257926.03 |
| 4.35572004268126e-07 | 9695413051938.35 | 24172271842648.2 | 32303609353276.8 | 57045835770659.2 | 95628986687245.6 | 126766261258838 | 212021303620551 | 167685592633921.97 |
| 4.36313367650475e-07 | 9741780894388.65 | 24250385414146 | 32392162862791.3 | 57147604996401.8 | 95717049294150.7 | 126823758966968 | 211938577101880 | 166265807901840 |
| 4.37055992867054e-07 | 9788150426020.82 | 24328269965174.6 | 32480344358216.2 | 57248569820224 | 95803693173783.3 | 126879405960154 | 211853085959400 | 164858044409352 |
| 4.37799882065563e-07 | 9834519947679.82 | 24405922521994.5 | 32568150575792.5 | 57348727119269 | 95888917086001.7 | 126933203273472 | 211764838905644 | 163462200373279 |
| 4.38545037397356e-07 | 9880887756969.59 | 24483340121971.6 | 32655578271447.8 | 57448073813658.7 | 95972719859602.2 | 126985152023884.98 | 211673844744089.97 | 162078174872239 |
| 4.3929146101745e-07 | 9927252148380.52 | 24560519813783.7 | 32742624221003.9 | 57546606866616.6 | 96055100392200.7 | 127035253409900.98 | 211580112368263 | 160705867839340 |
| 4.40039155084529e-07 | 9973611413417.27 | 24637458657627 | 32829285220384.1 | 57644323284586.2 | 96136057650108.8 | 127083508711227.02 | 211483650760836 | 159345180054955 |
| 4.40788121760951e-07 | 10019963840726.8 | 24714153725420.7 | 32915558085816.4 | 57741220117346.4 | 96215590668204.5 | 127129919288424.98 | 211384468992729 | 157996013139544 |
| 4.41538363212757e-07 | 10066307716226.9 | 24790602101010 | 33001439654035.7 | 57837294458122.1 | 96293698549797.7 | 127174486582558 | 211282576222208 | 156658269546537.97 |
| 4.42289881609671e-07 | 10112641323234.7 | 24866800880368.5 | 33086926782483.9 | 57932543443691.2 | 96370380466491.9 | 127217212114828 | 211177981693975 | 155331852555294.03 |
| 4.43042679125112e-07 | 10158962942595.7 | 24942747171798 | 33172016349506.2 | 58026964254487 | 96445635658038.6 | 127258097486218 | 211070694738265 | 154016666264093 |
| 4.43796757936199e-07 | 10205270852812.8 | 25018438096128.2 | 33256705254547.4 | 58120554114697 | 96519463432187.9 | 127297144377118 | 210960724769937 | 152712615583214.03 |
| 4.44552120223755e-07 | 10251563330175.9 | 25093870786913.9 | 33340990418344 | 58213310292357.7 | 96591863164534.9 | 127334354546958 | 210848081287560 | 151419606228053 |
| 4.45308768172314e-07 | 10297838648891.2 | 25169042390631.4 | 33424868783115.1 | 58305230099445.1 | 96662834298359.6 | 127369729833826 | 210732773872504 | 150137544712310.03 |
| 4.46066703970132e-07 | 10344095081211.1 | 25243950066872.9 | 33508337312750.5 | 58396310891961.4 | 96732376344462.5 | 127403272154087.02 | 210614812188022.03 | 148866338341229 |
| 4.46825929809185e-07 | 10390330897564.4 | 25318590988540 | 33591392992996.7 | 58486550070017.4 | 96800488880995.5 | 127434983501998 | 210494205978337.97 | 147605895204893 |
| 4.47586447885183e-07 | 10436544366685.9 | 25392962342034.9 | 33674032831640.4 | 58575945077911.3 | 96867171553288 | 127464865949312.98 | 210370965067729.97 | 146356124171583 |
| 4.48348260397572e-07 | 10482733755747.1 | 25467061327451 | 33756253858690.1 | 58664493404203.51 | 96932424073667.9 | 127492921644892.98 | 210245099359606.03 | 145116934881188 |
| 4.49111369549541e-07 | 10528897330486.5 | 25540885158760.9 | 33838053126554.4 | 58752192581786.6 | 96996246221277.9 | 127519152814299.02 | 210116618835593.97 | 143888237738670 |
| 4.49875777548031e-07 | 10575033355340 | 25614431064003.7 | 33919427710219.2 | 58839040187952.7 | 97058637841887.02 | 127543561759391.02 | 209985533554612 | 142669943907586 |
| 4.50641486603736e-07 | 10621140093571.5 | 25687696285470.4 | 34000374707421.4 | 58925033844455.4 | 97119598847698.1 | 127566150857920.98 | 209851853651953 | 141461965303669 |
| 4.51408498931116e-07 | 10667215807403.6 | 25760678079887.6 | 34080891238820.7 | 59010171217569.1 | 97179129217149.6 | 127586922563116 | 209715589338359 | 140264214588454 |
| 4.52176816748399e-07 | 10713258758148.8 | 25833373718599.5 | 34160974448169.1 | 59094450018143.3 | 97237228994713.5 | 127605879403264 | 209576750899097.97 | 139076605162968.98 |
| 4.52946442277587e-07 | 10759267206339.4 | 25905780487748.6 | 34240621502477.8 | 59177868001653.2 | 97293898290688.2 | 127623023981291.02 | 209435348693041 | 137899051161467.02 |
| 4.53717377744466e-07 | 10805239411859.2 | 25977895688454.5 | 34319829592181.3 | 59260422968247.51 | 97349137280988.4 | 127638358974335.02 | 209291393151736 | 136731467445226 |
| 4.54489625378609e-07 | 10851173634074 | 26049716636991.3 | 34398595931300.3 | 59342112762790.2 | 97402946206927.6 | 127651887133320.98 | 209144894778484 | 135573769596384.98 |
| 4.55263187413386e-07 | 10897068131962.5 | 26121240664962.5 | 34476917757600.3 | 59422935274900 | 97455325374998.9 | 127663611282522 | 208995864147409.97 | 134425873911847.02 |
| 4.56038066085964e-07 | 10942921164247 | 26192465119475.3 | 34554792332749.5 | 59502888438985.8 | 97506275156650.6 | 127673534319126 | 208844311902541 | 133287697397222 |
| 4.56814263637323e-07 | 10988730989524.8 | 26263387363312.9 | 34632216942473.1 | 59581970234277.3 | 97555795988056.5 | 127681659212794 | 208690248756877 | 132159157760832 |
| 4.57591782312254e-07 | 11034495866398.3 | 26334004775104.2 | 34709188896705.9 | 59660178684852.49 | 97603888369883.3 | 127687989005216.98 | 208533685491463 | 131040173407756 |
| 4.58370624359369e-07 | 11080214053606.2 | 26404314749492.7 | 34785705529741.2 | 59737511859661.6 | 97650552867052.7 | 127692526809664.98 | 208374632954463 | 129930663433934 |
| 4.59150792031108e-07 | 11125883810154.3 | 26474314697303.8 | 34861764200379.1 | 59813967872546 | 97695790108500.2 | 127695275810536.98 | 208213102060236 | 128830547620314 |
| 4.59932287583744e-07 | 11171503395445.4 | 26544002045709 | 34937362292070.2 | 59889544882254.4 | 97739600786928.9 | 127696239262907.02 | 208049103788404 | 127739746427056.98 |
| 4.60715113277392e-07 | 11217071069410.7 | 26613374238390 | 35012497213058.7 | 59964241092454.6 | 97781985658559.7 | 127695420492063.02 | 207882649182929 | 126658180987782 |
| 4.61499271376011e-07 | 11262585092639.4 | 26682428735699.9 | 35087166396521.4 | 60038054751741.8 | 97822945542876.98 | 127692822893047.02 | 207713749351184 | 125585773103866 |
| 4.62284764147415e-07 | 11308043726509.4 | 26751163014822.8 | 35161367300705.2 | 60110984153643 | 97862481322371.3 | 127688449930186 | 207542415463027 | 124522445238790 |
| 4.6307159386328e-07 | 11353445233317.4 | 26819574569931.9 | 35235097409061.6 | 60183027636617.2 | 97900593942276.7 | 127682305136628.98 | 207368658749877 | 123468120512528.98 |
| 4.63859762799144e-07 | 11398787876408.5 | 26887660912345.2 | 35308354230379.2 | 60254183584052.4 | 97937284410304.7 | 127674392113871.02 | 207192490503787 | 122422722696002 |
| 4.64649273234421e-07 | 11444069920306.3 | 26955419570680.1 | 35381135298912.7 | 60324450424258.9 | 97972553796374.9 | 127664714531278 | 207013922076518.03 | 121386176205552 |
| 4.65440127452405e-07 | 11489289630842.4 | 27022848091005.5 | 35453438174510 | 60393826630458.4 | 98006403232341.3 | 127653276125612 | 206832964878615 | 120358406097487.02 |
| 4.66232327740275e-07 | 11534445275285.7 | 27089944036992.3 | 35525260442737.1 | 60462310720769.4 | 98038833911714.1 | 127640080700544 | 206649630378486.03 | 119339338062656 |
| 4.67025876389102e-07 | 11579535122471.4 | 27156704990062 | 35596599714999.6 | 60529901258189.4 | 98069847089379.7 | 127625132126179.02 | 206463930101476 | 118328898421082 |
| 4.67820775693859e-07 | 11624557442930.4 | 27223128549533.5 | 35667453628662.2 | 60596596850573.1 | 98099444081314.4 | 127608434338558 | 206275875628945 | 117327014116632 |
| 4.68617027953423e-07 | 11669510509017.5 | 27289212332767.6 | 35737819847165.5 | 60662396150607.1 | 98127626264297.1 | 127589991339178 | 206085478597349 | 116333612711734 |
| 4.69414635470586e-07 | 11714392595040 | 27354953975310.2 | 35807696060139.8 | 60727297855780.2 | 98154395075615.7 | 127569807194492.98 | 205892750697320 | 115348622382144 |
| 4.70213600552057e-07 | 11759201977385.6 | 27420351131033.2 | 35877079983517.4 | 60791300708351.51 | 98179752012772.7 | 127547886035423.02 | 205697703672743 | 114371971911746 |
| 4.71013925508473e-07 | 11803936934650.8 | 27485401472273.4 | 35945969359641.4 | 60854403495314 | 98203698633185.3 | 127524232056851.02 | 205500349319841.97 | 113403590687410 |
| 4.71815612654402e-07 | 11848595747767.8 | 27550102689969.8 | 36014361957371.7 | 60916605048353.7 | 98226236553882.6 | 127498849517128.98 | 205300699486264 | 112443408693880.98 |
| 4.72618664308354e-07 | 11893176700131.9 | 27614452493798.3 | 36082255572189.6 | 60977904243807.6 | 98247367451199.6 | 127471742737568 | 205098766070159 | 111491356508722 |
| 4.73423082792783e-07 | 11937678077728.7 | 27678448612305.7 | 36149648026298.9 | 61038300002615.8 | 98267093060467.7 | 127442916101939.02 | 204894561019273 | 110547365297290 |
| 4.74228870434096e-07 | 11982098169260.1 | 27742088793039.8 | 36216537168724.1 | 61097791290271.1 | 98285415175701.6 | 127412374055960 | 204688096330025.97 | 109611366807762 |
| 4.75036029562661e-07 | 12026435266270.9 | 27805370802680 | 36282920875407.3 | 61156377116765 | 98302335649283.4 | 127380121106788.98 | 204479384046614.03 | 108683293366199.02 |
| 4.75844562512813e-07 | 12070687663274.1 | 27868292427163.1 | 36348797049301.3 | 61214056536530.49 | 98317856391643.4 | 127346161822508.98 | 204268436260086.03 | 107763077871654 |
| 4.76654471622857e-07 | 12114853657876.8 | 27930851471809.8 | 36414163620460.9 | 61270828648380.4 | 98331979370936.98 | 127310500831615.02 | 204055265107446.03 | 106850653791319.02 |
| 4.7746575923508e-07 | 12158931550905.1 | 27993045761447.3 | 36479018546130.6 | 61326692595444 | 98344706612719.8 | 127273142822499.02 | 203839882770745 | 105945955155718 |
| 4.78278427695757e-07 | 12202919646528.3 | 28054873140530.8 | 36543359810831.51 | 61381647565097.8 | 98356040199618.1 | 127234092542924.98 | 203622301476174.03 | 105048916553932.98 |
| 4.79092479355153e-07 | 12246816252383.2 | 28116331473262.6 | 36607185426443.1 | 61435692788895.51 | 98365982270997.4 | 127193354799512.98 | 203402533493164 | 104159473128876 |
| 4.79907916567537e-07 | 12290619679698.2 | 28177418643709.7 | 36670493432285.3 | 61488827542493.1 | 98374535022628.1 | 127150934457216 | 203180591133488 | 103277560572602 |
| 4.80724741691182e-07 | 12334328243415.9 | 28238132555918.4 | 36733281895195.4 | 61541051145570.2 | 98381700706346.6 | 127106836438792.98 | 202956486750358.03 | 102403115121658 |
| 4.81542957088376e-07 | 12377940262316.4 | 28298471134028.1 | 36795548909604 | 61592362961749.7 | 98387481629716 | 127061065724284 | 202730232737532 | 101536073552471.02 |
| 4.82362565125429e-07 | 12421454059139.1 | 28358432322382.4 | 36857292597607.8 | 61642762398512.49 | 98391880155682 | 127013627350478 | 202501841528421 | 100676373176780 |
| 4.83183568172677e-07 | 12464867960705 | 28418014085637.5 | 36918511109039.9 | 61692248907110.3 | 98394898702226.6 | 126964526410390 | 202271325595195 | 99823951837101.2 |
| 4.8400596860449e-07 | 12508180298037.3 | 28477214408870.4 | 36979202621537.3 | 61740821982473.4 | 98396539742019.02 | 126913768052720 | 202038697447895 | 98978747902236 |
| 4.84829768799281e-07 | 12551389406483 | 28536031297682.7 | 37039365340606.2 | 61788481163117.3 | 98396805802064.5 | 126861357481327.02 | 201803969633545.97 | 98140700262812.6 |
| 4.85654971139511e-07 | 12594493625832.3 | 28594462778304.7 | 37098997499684.49 | 61835226031045 | 98395699463349.5 | 126807299954688.98 | 201567154735270.03 | 97309748326869.2 |
| 4.86481578011694e-07 | 12637491300438.8 | 28652506897695.6 | 37158097360201.8 | 61881056211645.51 | 98393223360485.1 | 126751600785371.02 | 201328265371409.97 | 96485832015472.98 |
| 4.87309591806408e-07 | 12680380779338.3 | 28710161723642.4 | 37216663211636.6 | 61925971373590.6 | 98389380181347.02 | 126694265339482 | 201087314194641.97 | 95668891758376.2 |
| 4.88139014918299e-07 | 12723160416367.4 | 28767425344856.8 | 37274693371571.4 | 61969971228727.51 | 98384172666714 | 126635299036140 | 200844313891104 | 94858868489708.9 |
| 4.88969849746089e-07 | 12765828570281.7 | 28824295871070.3 | 37332186185744.9 | 62013055531969 | 98377603609903.4 | 126574707346928 | 200599277179521.97 | 94055703643708.8 |
| 4.89802098692583e-07 | 12808383604872.6 | 28880771433126 | 37389140028101.6 | 62055224081179.51 | 98369675856404.1 | 126512495795355.02 | 200352216810336 | 93259339150486.7 |
| 4.90635764164676e-07 | 12850823889084.6 | 28936850183069.6 | 37445553300838.9 | 62096476717059.51 | 98360392303507.4 | 126448669956310 | 200103145564829 | 92469717431827.9 |
| 4.91470848573357e-07 | 12893147797131 | 28992530294238 | 37501424434452.2 | 62136813323025.4 | 98349755899935.2 | 126383235455522 | 199852076254268 | 91686781397029.4 |
| 4.92307354333723e-07 | 12935353708609.7 | 29047809961345.8 | 37556751887776.3 | 62176233825088.3 | 98337769645466.8 | 126316197969008.98 | 199599021719035 | 90910474438771.9 |
| 4.93145283864978e-07 | 12977440008617.6 | 29102687400568.9 | 37611534148025.7 | 62214738191727.1 | 98324436590562.2 | 126247563222536 | 199343994827769 | 90140740429027.4 |
| 4.93984639590445e-07 | 13019405087865.2 | 29157160849627.5 | 37665769730830.6 | 62252326433761.9 | 98309759835984.7 | 126177336991068 | 199087008476509 | 89377523715000.6 |
| 4.94825423937572e-07 | 13061247342790.1 | 29211228567866 | 37719457180272.7 | 62288998604221.4 | 98293742532419.7 | 126105525098216 | 198828075587840 | 88620769115105.5 |
| 4.95667639337937e-07 | 13102965175669.3 | 29264888836330.9 | 37772595068915.9 | 62324754798209.6 | 98276387880093.1 | 126032133415696.98 | 198567209110043 | 87870421914975.6 |
| 4.96511288227259e-07 | 13144556994731.9 | 29318139957846.9 | 37825181997836.6 | 62359595152768.4 | 98257699128386.4 | 125957167862775.02 | 198304422016246.03 | 87126427863507.9 |
| 4.97356373045401e-07 | 13186021214270.2 | 29370980257090.6 | 37877216596650.1 | 62393519846737.8 | 98237679575450.5 | 125880634405716.98 | 198039727303580 | 86388733168940.5 |
| 4.98202896236379e-07 | 13227356254750.7 | 29423408080662.9 | 37928697523535.9 | 62426529100613.8 | 98216332567817.9 | 125802539057240.98 | 197773137992339 | 85657284494963.2 |
| 4.99050860248369e-07 | 13268560542923.9 | 29475421797157.8 | 37979623465258.4 | 62458623176402 | 98193661500011.7 | 125722887875956.98 | 197504667125137.97 | 84932028956861.9 |
| 4.99900267533715e-07 | 13309632511933.5 | 29527019797230.9 | 38029993137187.7 | 62489802377470.1 | 98169669814154.2 | 125641686965827.02 | 197234327766087 | 84212914117694.2 |
| 5.00751120548933e-07 | 13350570601424.9 | 29578200493664.1 | 38079805283315.7 | 62520067048397.1 | 98144360999572.6 | 125558942475599.02 | 196962132999951 | 83499887984498.2 |
| 5.01603421754721e-07 | 13391373257653.3 | 29628962321429.7 | 38129058676271 | 62549417574818.8 | 98117738592404.1 | 125474660598262 | 196688095931328 | 82792899004534.1 |
| 5.02457173615965e-07 | 13432038933590.2 | 29679303737751.5 | 38177752117331.1 | 62577854383272.2 | 98089806175198.5 | 125388847570491.02 | 196412229683824 | 82091896061555.8 |
| 5.03312378601748e-07 | 13472566089030 | 29729223222163.9 | 38225884436431.7 | 62605377941036.7 | 98060567376518.8 | 125301509672090 | 196134547399231 | 81396828472116 |
| 5.04169039185353e-07 | 13512953190695.3 | 29778719276569.5 | 38273454492174.2 | 62631988755971.8 | 98030025870541.8 | 125212653225436.98 | 195855062236713 | 80707645981901.1 |
| 5.05027157844274e-07 | 13553198712341.4 | 29827790425293.6 | 38320461171830.49 | 62657687376353.4 | 97998185376655.1 | 125122284594934 | 195573787371990.03 | 80024298762098.3 |
| 5.05886737060221e-07 | 13593301134860.3 | 29876435215138 | 38366903391345.2 | 62682474390707 | 97965049659054.3 | 125030410186448.98 | 195290735996533 | 79346737405792.5 |
| 5.0674777931913e-07 | 13633258946383.6 | 29924652215431.3 | 38412780095335.6 | 62706350427638.7 | 97930622526337.8 | 124937036446759.02 | 195005921316752 | 78674912924394.1 |
| 5.07610287111166e-07 | 13673070642384.7 | 29972440018077.8 | 38458090257089.2 | 62729316155662.7 | 97894907831100.1 | 124842169862996.98 | 194719356553201.97 | 78008776744097.5 |
| 5.08474262930733e-07 | 13712734725780.4 | 30019797237604.9 | 38502832878558.8 | 62751372283027.8 | 97857909469525.1 | 124745816962098 | 194431054939777.97 | 77348280702368.7 |
| 5.0933970927648e-07 | 13752249707030.8 | 30066722511207.1 | 38547006990355.8 | 62772519557540.49 | 97819631380976.1 | 124647984310240.98 | 194141029722928 | 76693377044463.1 |
| 5.10206628651311e-07 | 13791614104239.6 | 30113214498788.9 | 38590611651739.6 | 62792758766385.6 | 97780077547585.7 | 124548678512295.02 | 193849294160855 | 76044018419973.2 |
| 5.11075023562387e-07 | 13830826443252.6 | 30159271883005.8 | 38633645950607 | 62812090735945.51 | 97739251993844.7 | 124447906211264 | 193555861522740 | 75400157879404.7 |
| 5.11944896521139e-07 | 13869885257755.6 | 30204893369302.1 | 38676109003476.3 | 62830516331615.2 | 97697158786189.2 | 124345674087732 | 193260745087952 | 74761748870782 |
| 5.12816250043272e-07 | 13908789089371.4 | 30250077685948.2 | 38717999955472.3 | 62848036457617.2 | 97653802032586.6 | 124241988859308.98 | 192963958145275 | 74128745236282.4 |
| 5.1368908664877e-07 | 13947536487756.3 | 30294823584074.1 | 38759317980306.2 | 62864652056812.9 | 97609185882120.9 | 124136857280072.98 | 192665513992133 | 73501101208899.4 |
| 5.14563408861911e-07 | 13986126010694.7 | 30339129837702.6 | 38800062280254.8 | 62880364110510.9 | 97563314524576.8 | 124030286140020.98 | 192365425933820 | 72878771409132.8 |
| 5.15439219211265e-07 | 14024556224194.2 | 30382995243779.4 | 38840232086136.9 | 62895173638275.7 | 97516192190022.5 | 123922282264512 | 192063707282734.03 | 72261710841708.4 |
| 5.16316520229708e-07 | 14062825702578.5 | 30426418622200.9 | 38879826657287.3 | 62909081697731.2 | 97467823148392.1 | 123812852513715.02 | 191760371357617.97 | 71649874892324.5 |
| 5.17195314454427e-07 | 14100933028580.2 | 30469398815841.3 | 38918845281529 | 62922089384363.8 | 97418211709066.7 | 123702003782054 | 191455431482799 | 71043219324426.2 |
| 5.18075604426927e-07 | 14138876793432.4 | 30511934690576.1 | 38957287275142.6 | 62934197831323.4 | 97367362220455.02 | 123589742997658 | 191148900987439 | 70441700276007 |
| 5.18957392693039e-07 | 14176655596958.9 | 30554025135305 | 38995151982833.51 | 62945408209221.1 | 97315279069572 | 123476077121808 | 190840793204787 | 69845274256437.7 |
| 5.19840681802927e-07 | 14214268047664.8 | 30595669061971.4 | 39032438777697.4 | 62955721725925.9 | 97261966681618.6 | 123361013148384 | 190531121471431 | 69253898143321.8 |
| 5.20725474311094e-07 | 14251712762824.2 | 30636865405581 | 39069147061183.1 | 62965139626359.2 | 97207429519559.6 | 123244558103319.02 | 190219899126561.97 | 68667529179378.1 |
| 5.21611772776395e-07 | 14288988368569 | 30677613124218.1 | 39105276263053.1 | 62973663192286.9 | 97151672083700.6 | 123126719044043.02 | 189907139511237 | 68086124969348.4 |
| 5.22499579762035e-07 | 14326093499975.2 | 30717911199059.4 | 39140825841342.1 | 62981293742109.6 | 97094698911264.98 | 123007503058939.02 | 189592855967649.97 | 67509643476933.4 |
| 5.23388897835585e-07 | 14363026801148.6 | 30757758634386.5 | 39175795282313.51 | 62988032630650.7 | 97036514575969.6 | 122886917266791.02 | 189277061838401.97 | 66938043021752.4 |
| 5.24279729568987e-07 | 14399786925310.3 | 30797154457596.1 | 39210184100413.51 | 62993881248943.8 | 96977123687601.4 | 122764968816240 | 188959770465785 | 66371282276330.49 |
| 5.25172077538557e-07 | 14436372534880.2 | 30836097719208 | 39243991838223 | 62998841024016 | 96916530891591.1 | 122641664885231.02 | 188640995191060 | 65809320263110 |
| 5.26065944324999e-07 | 14472782301559.8 | 30874587492871.7 | 39277218066407.8 | 63002913418671.2 | 96854740868588.6 | 122517012680474 | 188320749353745.97 | 65252116351488.1 |
| 5.26961332513408e-07 | 14509014906414.6 | 30912622875370.4 | 39309862383665.8 | 63006099931271.2 | 96791758334036.98 | 122391019436895.02 | 187999046290913 | 64699630254879.1 |
| 5.2785824469328e-07 | 14545069039954.5 | 30950202986623.7 | 39341924416673.2 | 63008402095513.9 | 96727588037745.9 | 122263692417092.98 | 187675899336477 | 64151822027801.7 |
| 5.28756683458517e-07 | 14580943402214.2 | 30987326969687.4 | 39373403820028 | 63009821480211.1 | 96662234763465.7 | 122135038910799.02 | 187351321820501 | 63608652062990.4 |
| 5.29656651407438e-07 | 14616636702831.6 | 31023993990752.9 | 39404300276191.1 | 63010359689064 | 96595703328459.9 | 122005066234330 | 187025327068505 | 63070081088532.9 |
| 5.30558151142782e-07 | 14652147661126.1 | 31060203239142.8 | 39434613495425.9 | 63010018360436.8 | 96527998583078.2 | 121873781730051.02 | 186697928400771 | 62536070165029.4 |
| 5.3146118527172e-07 | 14687475006175.3 | 31095953927306.2 | 39464343215736 | 63008799167128.8 | 96459125410328.98 | 121741192765838 | 186369139131663 | 62006580682778.2 |
| 5.3236575640586e-07 | 14722617476890.5 | 31131245290810.8 | 39493489202800.1 | 63006703816145.3 | 96389088725452.3 | 121607306734534 | 186038972568943 | 61481574358983.8 |
| 5.33271867161254e-07 | 14757573822092.2 | 31166076588334.3 | 39522051249905.7 | 63003734048465.7 | 96317893475491.6 | 121472131053415.02 | 185707442013102.03 | 60961013234989 |
| 5.34179520158408e-07 | 14792342800583 | 31200447101653.1 | 39550029177879.8 | 62999891638811.4 | 96245544638866.1 | 121335673163656 | 185374560756681.97 | 60444859673530.49 |
| 5.35088718022287e-07 | 14826923181221.1 | 31234356135629 | 39577422835019.3 | 62995178395411.3 | 96172047224942.8 | 121197940529792.98 | 185040342083617.97 | 59933076356017.6 |
| 5.35999463382325e-07 | 14861313742991.3 | 31267803018194.6 | 39604232097017.4 | 62989596159765.8 | 96097406273608.98 | 121058940639192 | 184704799268572 | 59425626279834 |
| 5.36911758872432e-07 | 14895513275075.8 | 31300787100336.8 | 39630456866889.51 | 62983146806410 | 96021626854844.2 | 120918681001516.98 | 184367945576281.97 | 58922472755662.7 |
| 5.37825607130998e-07 | 14929520576924.1 | 31333307756077.7 | 39656097074896.6 | 62975832242674.3 | 95944714068292.2 | 120777169148198 | 184029794260905.97 | 58423579404832.9 |
| 5.38741010800907e-07 | 14963334458320.7 | 31365364382454.8 | 39681152678467.1 | 62967654408444.6 | 95866673042833.6 | 120634412631904.98 | 183690358565381 | 57928910156690.4 |
| 5.39657972529539e-07 | 14996953739453.4 | 31396956399498.1 | 39705623662116.2 | 62958615275920.7 | 95787508936158.1 | 120490419026020 | 183349651720779 | 57438429245988.8 |
| 5.40576494968781e-07 | 15030377250978.6 | 31428083250206.3 | 39729510037363.8 | 62948716849373.2 | 95707226934337.2 | 120345195924110 | 183007686945673 | 56952101210304.4 |
| 5.41496580775035e-07 | 15063603834087.6 | 31458744400521 | 39752811842650.4 | 62937961164899.2 | 95625832251396.98 | 120198750939404 | 182664477445504 | 56469890887471.9 |
| 5.42418232609221e-07 | 15096632340570 | 31488939339298.9 | 39775529143251.4 | 62926350290176.8 | 95543330128891.4 | 120051091704268.98 | 182320036411956 | 55991763413041.8 |
| 5.4334145313679e-07 | 15129461632877.1 | 31518667578282.1 | 39797662031189.2 | 62913886324218.1 | 95459725835475.02 | 119902225869691.02 | 181974377022337.97 | 55517684217760.4 |
| 5.44266245027731e-07 | 15162090584184 | 31547928652067.1 | 39819210625143.7 | 62900571397120.9 | 95375024666477.3 | 119752161104756 | 181627512438960 | 55047619025069.7 |
| 5.45192610956575e-07 | 15194518078450 | 31576722118071.6 | 39840175070361 | 62886407669819.8 | 95289231943476.98 | 119600905096130 | 181279455808529.97 | 54581533848629.51 |
| 5.46120553602406e-07 | 15226743010479.2 | 31605047556499.5 | 39860555538560.2 | 62871397333835.7 | 95202353013875.4 | 119448465547547.02 | 180930220261545.97 | 54119394989860.1 |
| 5.47050075648868e-07 | 15258764285978.5 | 31632904570304.7 | 39880352227838.49 | 62855542611023 | 95114393250472.1 | 119294850179291.02 | 180579818911692 | 53661169035506 |
| 5.47981179784173e-07 | 15290580821615.6 | 31660292785152.4 | 39899565362574.8 | 62838845753318.4 | 95025358051040.2 | 119140066727688.98 | 180228264855245 | 53206822855219.7 |
| 5.4891386870111e-07 | 15322191545075.4 | 31687211849379.2 | 39918195193331.1 | 62821309042485.9 | 94935252837902.5 | 118984122944595.02 | 179875571170484 | 52756323599166.4 |
| 5.49848145097046e-07 | 15353595395115.7 | 31713661433951.8 | 39936241996752.8 | 62802934789862 | 94844083057506.8 | 118827026596887.02 | 179521750917104 | 52309638695649.51 |
| 5.50784011673945e-07 | 15384791321620.9 | 31739641232422.4 | 39953706075466.4 | 62783725336100 | 94751854180004.1 | 118668785465956.98 | 179166817135635 | 51866735848754.7 |
| 5.51721471138366e-07 | 15415778285655.7 | 31765150960884.7 | 39970587757976.8 | 62763683050912.9 | 94658571698825.6 | 118509407347210 | 178810782846868 | 51427583036015.7 |
| 5.52660526201478e-07 | 15446555259517.2 | 31790190357926.7 | 39986887398561.8 | 62742810332815.1 | 94564241130260.98 | 118348900049558 | 178453661051284 | 50992148506098.7 |
| 5.53601179579061e-07 | 15477121226785.5 | 31814759184581.8 | 40002605377165.51 | 62721109608863.7 | 94468868013037.3 | 118187271394922 | 178095464728487 | 50560400776506.49 |
| 5.5454343399152e-07 | 15507475182374.2 | 31838857224279.2 | 40017742099290.1 | 62698583334399.1 | 94372457907898.6 | 118024529217732.98 | 177736206836647 | 50132308631302.7 |
| 5.55487292163889e-07 | 15537616132578.3 | 31862484282791.7 | 40032297995886.1 | 62675233992783.4 | 94275016397186.9 | 117860681364436 | 177375900311943 | 49707841118854.4 |
| 5.56432756825839e-07 | 15567543095122.7 | 31885640188182.6 | 40046273523240.6 | 62651064095139.51 | 94176549084421.7 | 117695735692996 | 177014558068015 | 49286967549594.49 |
| 5.5737983071169e-07 | 15597255099208.1 | 31908324790750.5 | 40059669162864.3 | 62626076180088.3 | 94077061593884.1 | 117529700072404.98 | 176652192995417.97 | 48869657493802.7 |
| 5.58328516560414e-07 | 15626751185556.8 | 31930537962972.6 | 40072485421377.51 | 62600272813486 | 93976559570197.8 | 117362582382194 | 176288817961083 | 48455880779405.8 |
| 5.59278817115646e-07 | 15656030406456.6 | 31952279599446.5 | 40084722830393.1 | 62573656588159.3 | 93875048677913.8 | 117194390511944 | 175924445807784 | 48045607489795.4 |
| 5.60230735125688e-07 | 15685091825804.6 | 31973549616830.7 | 40096381946400 | 62546230123642 | 93772534601094.7 | 117025132360800 | 175559089353607 | 47638807961665.7 |
| 5.61184273343523e-07 | 15713934519148.3 | 31994347953782.7 | 40107463350643.2 | 62517996065908 | 93669023042900.2 | 116854815836992.98 | 175192761391428 | 47235452782868.6 |
| 5.62139434526818e-07 | 15742557573727.4 | 32014674570896.5 | 40117967649004.1 | 62488957087106.6 | 93564519725173.2 | 116683448857348.98 | 174825474688393 | 46835512790286.8 |
| 5.63096221437935e-07 | 15770960088513.2 | 32034529450638.1 | 40127895471877.9 | 62459115885295 | 93459030388028.5 | 116511039346822 | 174457241985406.03 | 46438959067725.51 |
| 5.64054636843935e-07 | 15799141174247.3 | 32053912597279.3 | 40137247474050.6 | 62428475184171.3 | 93352560789439.6 | 116337595238008.98 | 174088075996619 | 46045762943821.9 |
| 5.65014683516593e-07 | 15827099953479.2 | 32072824036830.3 | 40146024334574.1 | 62397037732806.3 | 93245116704829.8 | 116163124470682 | 173717989408932 | 45655895989972 |
| 5.65976364232397e-07 | 15854835560602.7 | 32091263816971.1 | 40154226756640.2 | 62364806305375.1 | 93136703926662.2 | 115987634991312 | 173346994881491 | 45269330018275.2 |
| 5.66939681772563e-07 | 15882347141891.3 | 32109232006980.4 | 40161855467452.8 | 62331783700888.1 | 93027328264031.2 | 115811134752603.02 | 172975105045200 | 44886037079496.4 |
| 5.67904638923042e-07 | 15909633855532.3 | 32126728697664.3 | 40168911218099.4 | 62297972742921.51 | 92916995542256.3 | 115633631713024.98 | 172602332502228 | 44505989461045 |
| 5.68871238474524e-07 | 15936694871659.9 | 32143754001282.6 | 40175394783420.7 | 62263376279347.3 | 92805711602475.5 | 115455133836348 | 172228689825533 | 44129159684971.51 |
| 5.6983948322245e-07 | 15963529372387.2 | 32160308051474 | 40181306961878.9 | 62227997182062.3 | 92693482301240.9 | 115275649091183.02 | 171854189558382.03 | 43755520505980.6 |
| 5.70809375967021e-07 | 15990136551837 | 32176391003179.7 | 40186648575425.8 | 62191838346718.2 | 92580313510115.3 | 115095185450520 | 171478844213878.03 | 43385044909461.7 |
| 5.71780919513201e-07 | 16016515616171.3 | 32192003032566.4 | 40191420469367.4 | 62154902692449.2 | 92466211115269.6 | 114913750891274 | 171102666274494.03 | 43017706109534.9 |
| 5.7275411667073e-07 | 16042665783620.5 | 32207144336946.8 | 40195623512230 | 62117193161601.3 | 92351181017082.9 | 114731353393828 | 170725668191616 | 42653477547115.51 |
| 5.7372897025413e-07 | 16068586284510.1 | 32221815134699 | 40199258595622.7 | 62078712719459.8 | 92235229129742 | 114548000941584.98 | 170347862385080 | 42292332887992.6 |
| 5.74705483082712e-07 | 16094276361287.6 | 32236015665185.2 | 40202326634100.2 | 62039464353976.8 | 92118361380843.1 | 114363701520515.02 | 169969261242726.03 | 41934246020926 |
| 5.75683657980588e-07 | 16119735268547.6 | 32249746188668.2 | 40204828565023.7 | 61999451075499.2 | 92000583710996.1 | 114178463118712 | 169589877119950.03 | 41579191055757.6 |
| 5.76663497776676e-07 | 16144962273056 | 32263006986227.4 | 40206765348420.9 | 61958675916495.2 | 91881902073427.6 | 113992293725948.98 | 169209722339264 | 41227142321540.1 |
| 5.77645005304708e-07 | 16169956653773 | 32275798359672.3 | 40208137966844.9 | 61917141931281.8 | 91762322433588.1 | 113805201333235.02 | 168828809189860 | 40878074364680.6 |
| 5.78628183403239e-07 | 16194717701874.7 | 32288120631456.3 | 40208947425231.51 | 61874852195751 | 91641850768758.9 | 113617193932380.98 | 168447149927183 | 40531961947100.49 |
| 5.79613034915656e-07 | 16219244720774.6 | 32299974144587.6 | 40209194750756.3 | 61831809807096.9 | 91520493067660.6 | 113428279515559.02 | 168064756772501 | 40188780044410.49 |
| 5.80599562690187e-07 | 16243537026142.6 | 32311359262539.9 | 40208880992689.4 | 61788017883541.3 | 91398255330064.4 | 113238466074874 | 167681641912489 | 39848503844101.4 |
| 5.81587769579906e-07 | 16267593945924.2 | 32322276369161.5 | 40208007222250.9 | 61743479564060.7 | 91275143566403.1 | 113047761601930 | 167297817498812 | 39511108743750.2 |
| 5.82577658442743e-07 | 16291414820357.6 | 32332725868583.3 | 40206574532463 | 61698198008112 | 91151163797384.98 | 112856174087403.02 | 166913295647716 | 39176570349241.4 |
| 5.83569232141493e-07 | 16314999001990.1 | 32342708185124.7 | 40204584038003.2 | 61652176395358.7 | 91026322053608.8 | 112663711520616.98 | 166528088439627 | 38844864473003.1 |
| 5.84562493543823e-07 | 16338345855693.9 | 32352223763200.1 | 40202036875055.3 | 61605417925397.2 | 90900624375180.1 | 112470381889123.02 | 166142207918745 | 38515967132257.9 |
| 5.85557445522283e-07 | 16361454758679.8 | 32361273067222.1 | 40198934201159.8 | 61557925817482.1 | 90774076811329.9 | 112276193178278 | 165755666092657 | 38189854547289.9 |
| 5.86554090954308e-07 | 16384325100510.4 | 32369856581505.6 | 40195277195063.2 | 61509703310253.1 | 90646685420034.1 | 112081153370828 | 165368474931944 | 37866503139724.2 |
| 5.87552432722235e-07 | 16406956283112.7 | 32377974810168.3 | 40191067056566.3 | 61460753661460.2 | 90518456267635.02 | 111885270446496 | 164980646369796 | 37545889530822.9 |
| 5.88552473713304e-07 | 16429347720788.1 | 32385628277032.9 | 40186305006371.9 | 61411080147690.4 | 90389395428464.5 | 111688552381571.02 | 164592192301639 | 37227990539794.6 |
| 5.89554216819671e-07 | 16451498840223.2 | 32392817525525.5 | 40180992285931.3 | 61360686064093.8 | 90259508984469.6 | 111491007148496.98 | 164203124584755 | 36912783182118.49 |
| 5.90557664938413e-07 | 16473409080498.3 | 32399543118574.9 | 40175130157290 | 61309574724109.2 | 90128803024838.1 | 111292642715474 | 163813455037918.03 | 36600244667882.3 |
| 5.91562820971539e-07 | 16495077893094.8 | 32405805638509.3 | 40168719902932.2 | 61257749459191.6 | 89997283645627.4 | 111093467046050 | 163423195441028 | 36290352400134.7 |
| 5.92569687825997e-07 | 16516504741902.3 | 32411605686953 | 40161762825625.3 | 61205213618537.6 | 89864956949394.3 | 110893488098723.02 | 163032357534753 | 35983083973251.6 |
| 5.93578268413683e-07 | 16537689103224.1 | 32416943884721.6 | 40154260248262.4 | 61151970568813 | 89731829044827.5 | 110692713826548 | 162640953020177 | 35678417171316.1 |
| 5.94588565651448e-07 | 16558630465781.6 | 32421820871715.7 | 40146213513705.2 | 61098023693879.3 | 89597906046380.7 | 110491152176739.02 | 162248993558452 | 35376329966512.1 |
| 5.9560058246111e-07 | 16579328330717.9 | 32426237306814.7 | 40137623984625.3 | 61043376394520.6 | 89463194073908.1 | 110288811090280 | 161856490770452 | 35076800517531.9 |
| 5.96614321769458e-07 | 16599782211600.3 | 32430193867768.2 | 40128493043344.6 | 60988032088171.9 | 89327699252302.4 | 110085698501539.02 | 161463456236437 | 34779807167997.1 |
| 5.97629786508263e-07 | 16619991634421.4 | 32433691251087.6 | 40118822091676 | 60931994208645.51 | 89191427711133.3 | 109881822337879.02 | 161069901495721 | 34485328444892.5 |
| 5.98646979614286e-07 | 16639956137599.8 | 32436730171935.9 | 40108612550762 | 60875266205860 | 89054385584289.2 | 109677190519283.02 | 160675838046341 | 34193343057013.8 |
| 5.99665904029287e-07 | 16659675271979 | 32439311364016.8 | 40097865860913.6 | 60817851545567.9 | 88916579009619.4 | 109471810957968 | 160281277344736 | 33903829893428.1 |
| 6.00686562700034e-07 | 16679148600826.1 | 32441435579463 | 40086583481448.2 | 60759753709084.49 | 88778014128579.7 | 109265691558014 | 159886230805425.97 | 33616768021947.7 |
| 6.01708958578307e-07 | 16698375699828.5 | 32443103588723 | 40074766890526.4 | 60700976193016.9 | 88638697085879.1 | 109058840214988.98 | 159490709800704 | 33332136687616.5 |
| 6.02733094620913e-07 | 16717356157090.6 | 32444316180448 | 40062417584988.9 | 60641522508992.8 | 88498634029128.4 | 108851264815580.98 | 159094725660321 | 33049915311209.7 |
| 6.03758973789692e-07 | 16736089573128.7 | 32445074161376.9 | 40049537080192.49 | 60581396183391.1 | 88357831108491.2 | 108642973237228 | 158698289671190.03 | 32770083487745.3 |
| 6.04786599051523e-07 | 16754575560865.1 | 32445378356220.5 | 40036126909844.7 | 60520600757071.3 | 88216294476336.3 | 108433973347759.02 | 158301413077079 | 32492620985009.4 |
| 6.05815973378336e-07 | 16772813745621.2 | 32445229607545.6 | 40022188625839.2 | 60459139785104.6 | 88074030286892.7 | 108224273005028.98 | 157904107078327 | 32217507742093.3 |
| 6.0684709974712e-07 | 16790803765110.2 | 32444628775657.1 | 40007723798089.3 | 60397016836504.6 | 87931044695906.2 | 108013880056560.98 | 157506382831545.97 | 31944723867942.4 |
| 6.07879981139929e-07 | 16808545269427.4 | 32443576738480.8 | 39992734014361.9 | 60334235493959.3 | 87787343860298.4 | 107802802339196.98 | 157108251449345.97 | 31674249639919.2 |
| 6.08914620543895e-07 | 16826037921040.7 | 32442074391443.2 | 39977220880110.2 | 60270799353562.6 | 87642933937827.2 | 107591047678740 | 156709724000048 | 31406065502376.3 |
| 6.09951020951232e-07 | 16843281394780 | 32440122647352.7 | 39961186018306.4 | 60206712024547.7 | 87497821086749.7 | 107378623889608 | 156310811507416 | 31140152065242.8 |
| 6.10989185359249e-07 | 16860275377824.9 | 32437722436278.6 | 39944631069273.4 | 60141977129019.3 | 87352011465487.6 | 107165538774490 | 155911524950385 | 30876490102622.9 |
| 6.12029116770354e-07 | 16877019569692.1 | 32434874705429.7 | 39927557690516.6 | 60076598301688.1 | 87205511232293.8 | 106951800123999.02 | 155511875262795 | 30615060551405.1 |
| 6.13070818192068e-07 | 16893513682221.7 | 32431580419032.2 | 39909967556554.49 | 60010579189605.1 | 87058326544921.6 | 106737415716339.02 | 155111873333136 | 30355844509884.2 |
| 6.1411429263703e-07 | 16909757439561.9 | 32427840558207 | 39891862358749.6 | 59943923451895.8 | 86910463560295.7 | 106522393316964 | 154711530004288 | 30098823236394.9 |
| 6.15159543123004e-07 | 16925750578154.1 | 32423656120845.6 | 39873243805138.6 | 59876634759496.6 | 86761928434186.4 | 106306740678244.98 | 154310856073273.97 | 29843978147956.3 |
| 6.16206572672895e-07 | 16941492846715.3 | 32419028121486.3 | 39854113620261.51 | 59808716794890.7 | 86612727320884.2 | 106090465539142 | 153909862291013 | 29591290818928.8 |
| 6.1725538431475e-07 | 16956984006221.2 | 32413957591188.7 | 39834473544991.8 | 59740173251845 | 86462866372878.2 | 105873575624878 | 153508559362081 | 29340742979681.6 |
| 6.18305981081771e-07 | 16972223829887.1 | 32408445577408 | 39814325336364.7 | 59671007835147.51 | 86312351740535.2 | 105656078646608.98 | 153106957944473 | 29092316515271.9 |
| 6.19358366012321e-07 | 16987212103148.4 | 32402493143868.9 | 39793670767406.2 | 59601224260346.1 | 86161189571782.3 | 105437982301111.02 | 152705068649371 | 28845993464135.1 |
| 6.20412542149937e-07 | 17001948623640.6 | 32396101370438.1 | 39772511626961.2 | 59530826253487 | 86009386011790.8 | 105219294270456.98 | 152302902040921 | 28601756016786.1 |
| 6.21468512543335e-07 | 17016433201177.2 | 32389271352996.8 | 39750849719521.3 | 59459817550855.1 | 85856947202662.9 | 105000022221703.02 | 151900468636007 | 28359586514531.8 |
| 6.2252628024642e-07 | 17030665657727.8 | 32382004203312.3 | 39728686865052.6 | 59388201898714 | 85703879283119.7 | 104780173806580 | 151497778904035 | 28119467448194.4 |
| 6.23585848318293e-07 | 17044645827394.9 | 32374301048908.9 | 39706024898823 | 59315983053047.7 | 85550188388192.9 | 104559756661180.98 | 151094843266720 | 27881381456845.2 |
| 6.24647219823266e-07 | 17058373556389.4 | 32366163032938.7 | 39682865671229.2 | 59243164779302.3 | 85395880648916.98 | 104338778405659.02 | 150691672097878.03 | 27645311326549.7 |
| 6.25710397830864e-07 | 17071848703006 | 32357591314050.8 | 39659211047623.9 | 59169750852129.51 | 85240962192024.98 | 104117246643923.02 | 150288275723223 | 27411239989122.5 |
| 6.26775385415835e-07 | 17085071137596.8 | 32348587066261.5 | 39635062908141.8 | 59095745055129.9 | 85085439139645.9 | 103895168963340 | 149884664420163 | 27179150520894 |
| 6.27842185658165e-07 | 17098040742544.8 | 32339151478822 | 39610423147526.49 | 59021151180597.7 | 84929317609004.6 | 103672552934439.02 | 149480848417613 | 26949026141486.1 |
| 6.28910801643076e-07 | 17110757412236 | 32329285756087.5 | 39585293674956.49 | 58945973029266.7 | 84772603712124 | 103449406110618 | 149076837895798.03 | 26720850212599.4 |
| 6.29981236461047e-07 | 17123221053030.8 | 32318991117384.4 | 39559676413871.3 | 58870214410055.9 | 84615303555528.9 | 103225736027854 | 148672642986070.03 | 26494606236810.1 |
| 6.31053493207814e-07 | 17135431583234.7 | 32308268796877.7 | 39533573301797 | 58793879139817.1 | 84457423239952.98 | 103001550204416.98 | 148268273770728 | 26270277856376.9 |
| 6.32127574984382e-07 | 17147388933067.9 | 32297120043437.6 | 39506986290172.3 | 58716971043083.7 | 84298968860047.9 | 102776856140584.98 | 147863740282836 | 26047848852058.9 |
| 6.33203484897036e-07 | 17159093044633.9 | 32285546120505.6 | 39479917344174.1 | 58639493951818.7 | 84139946504094.1 | 102551661318368 | 147459052506057 | 25827303141942.5 |
| 6.34281226057345e-07 | 17170543871887.8 | 32273548305960.6 | 39452368442542.7 | 58561451705165.7 | 83980362253714.7 | 102325973201224.98 | 147054220374481 | 25608624780278.9 |
| 6.35360801582179e-07 | 17181741380603.4 | 32261127891984.2 | 39424341577407.4 | 58482848149199.8 | 83820222183591.2 | 102099799233792.98 | 146649253772460 | 25391797956330.9 |
| 6.36442214593707e-07 | 17192685548339 | 32248286184925.1 | 39395838754111.6 | 58403687136679.1 | 83659532361181.2 | 101873146841618 | 146244162534452 | 25176806993230 |
| 6.37525468219416e-07 | 17203376364403.7 | 32235024505164.3 | 39366861991038.2 | 58323972526798.3 | 83498298846440.1 | 101646023430882 | 145838956444862.03 | 24963636346843 |
| 6.38610565592115e-07 | 17213813829821.4 | 32221344186978.7 | 39337413319435.1 | 58243708184942.9 | 83336527691542.3 | 101418436388143.02 | 145433645237895 | 24752270604647.9 |
| 6.39697509849946e-07 | 17223997957295 | 32207246578405.1 | 39307494783239.4 | 58162897982443.4 | 83174224940607.9 | 101190393080072 | 145028238597406.03 | 24542694484619.7 |
| 6.40786304136392e-07 | 17233928771169.2 | 32192733041103.5 | 39277108438903.7 | 58081545796332.49 | 83011396629429.3 | 100961900853192 | 144622746156760 | 24334892834125.6 |
| 6.41876951600284e-07 | 17243606307392.9 | 32177804950220 | 39246256355220.4 | 57999655509101.4 | 82848048785201.2 | 100732967033626 | 144217177498692 | 24128850628829.1 |
| 6.42969455395815e-07 | 17253030613480.7 | 32162463694249.5 | 39214940613147.6 | 57917231008458.49 | 82684187426252.98 | 100503598926843.02 | 143811542155173 | 23924552971604.1 |
| 6.44063818682547e-07 | 17262201748473.5 | 32146710674898.1 | 39183163305633.3 | 57834276187088.7 | 82519818561783.6 | 100273803817408 | 143405849607281 | 23721985091457.6 |
| 6.45160044625419e-07 | 17271119782898.4 | 32130547306945.4 | 39150926537441.8 | 57750794942413.4 | 82354948191597.6 | 100043588968739.02 | 143000109285075 | 23521132342461.7 |
| 6.46258136394755e-07 | 17279784798727.8 | 32113975018105.8 | 39118232424978.49 | 57666791176353 | 82189582305845.5 | 99812961622860.1 | 142594330567473 | 23321980202694.9 |
| 6.47358097166277e-07 | 17288196889338 | 32096995248890.1 | 39085083096114.9 | 57582268795088.3 | 82023726884764.9 | 99581929000164 | 142188522782135 | 23124514273192 |
| 6.48459930121112e-07 | 17296356159466.4 | 32079609452467 | 39051480690015.1 | 57497231708825.2 | 81857387898424.6 | 99350498299174 | 141782695205348 | 22928720276903 |
| 6.49563638445801e-07 | 17304262725169.2 | 32061819094523.9 | 39017427356960.49 | 57411683831559.4 | 81690571306471.2 | 99118676696311.02 | 141376857061918 | 22734584057660.9 |
| 6.5066922533231e-07 | 17311916713776.4 | 32043625653127.4 | 38982925258176 | 57325629080842.49 | 81523283057877.9 | 98886471345662.1 | 140971017525066 | 22542091579158.1 |
| 6.51776693978035e-07 | 17319318263848.4 | 32025030618584.3 | 38947976565656.1 | 57239071377549.1 | 81355529090695.7 | 98653889378752.98 | 140565185716322 | 22351228923932 |
| 6.52886047585818e-07 | 17326467525130.1 | 32006035493301.5 | 38912583461990.1 | 57152014645645.4 | 81187315331807.2 | 98420937904324.1 | 140159370705430 | 22161982292357.9 |
| 6.53997289363948e-07 | 17333364658504.7 | 31986641791646.4 | 38876748140189.7 | 57064462811959.1 | 81018647696682.3 | 98187624008107.8 | 139753581510256.98 | 21974338001652.2 |
| 6.55110422526178e-07 | 17340009835947.8 | 31966851039806.6 | 38840472803514 | 56976419805949.8 | 80849532089136.7 | 97953954752611.02 | 139347827096698 | 21788282484882.4 |
| 6.5622545029173e-07 | 17346403240479.2 | 31946664775650 | 38803759665297.2 | 56887889559481.6 | 80679974401093.1 | 97719937176898.8 | 138942116378594 | 21603802289986.6 |
| 6.57342375885305e-07 | 17352545066115.3 | 31926084548584 | 38766610948774.7 | 56798876006595.9 | 80509980512343.9 | 97485578296382.9 | 138536458217648.98 | 21420884078800.7 |
| 6.58461202537093e-07 | 17358435517820.2 | 31905111919415.7 | 38729028886910.8 | 56709383083286.49 | 80339556290316.98 | 97250885102611.7 | 138130861423352.98 | 21239514626094.2 |
| 6.5958193348278e-07 | 17364074811456.4 | 31883748460210.5 | 38691015722225.3 | 56619414727274.9 | 80168707589843.8 | 97015864563063.5 | 137725334752904 | 21059680818613.9 |
| 6.60704571963563e-07 | 17369463173734.4 | 31861995754151.9 | 38652573706622 | 56528974877787.9 | 79997440252929.9 | 96780523620943.8 | 137319886911140 | 20881369654135.6 |
| 6.61829121226153e-07 | 17374600842162.4 | 31839855395400.6 | 38613705101215.7 | 56438067475335.8 | 79825760108527.4 | 96544869194985.2 | 136914526550476 | 20704568240524.4 |
| 6.62955584522787e-07 | 17379488064994.9 | 31817328988953.4 | 38574412176160.7 | 56346696461491.51 | 79653672972310.4 | 96308908179248.7 | 136509262270832 | 20529263794802.5 |
| 6.64083965111238e-07 | 17384125101180.1 | 31794418150502.4 | 38534697210479.4 | 56254865778672.4 | 79481184646452.5 | 96072647442930.6 | 136104102619580.98 | 20355443642224.6 |
| 6.65214266254825e-07 | 17388512220308 | 31771124506294.3 | 38494562491890.9 | 56162579369921.9 | 79308300919407.3 | 95836093830170.6 | 135699056091491.02 | 20183095215362 |
| 6.66346491222419e-07 | 17392649702556.8 | 31747449692988.5 | 38454010316639.8 | 56069841178693.4 | 79135027565690.3 | 95599254159863.2 | 135294131128672.98 | 20012206053193.5 |
| 6.67480643288457e-07 | 17396537838639.1 | 31723395357517 | 38413042989326.2 | 55976655148634.8 | 78961370345663.5 | 95362135225472.6 | 134889336120530 | 19842763800205 |
| 6.68616725732948e-07 | 17400176929747.3 | 31698963156942.8 | 38371662822735 | 55883025223375.2 | 78787335005323.7 | 95124743794850 | 134484679403718 | 19674756205495.7 |
| 6.69754741841484e-07 | 17403567287498.7 | 31674154758318.7 | 38329872137666.4 | 55788955346312 | 78612927276091.02 | 94887086610053.8 | 134080169262096.98 | 19508171121892.3 |
| 6.7089469490525e-07 | 17406709233880 | 31648971838546.6 | 38287673262766.3 | 55694449460399.9 | 78438152874601.4 | 94649170387173.4 | 133675813926702 | 19342996505071.4 |
| 6.7203658822103e-07 | 17409603101190.5 | 31623416084236.2 | 38245068534356.9 | 55599511507941.8 | 78263017502501.3 | 94411001816155.5 | 133271621575700 | 19179220412687.8 |
| 6.73180425091224e-07 | 17412249231986.1 | 31597489191564.2 | 38202060296268.49 | 55504145430379.1 | 78087526846243.9 | 94172587560632.6 | 132867600334364.98 | 19016831003511.6 |
| 6.74326208823847e-07 | 17414647979021.3 | 31571192866133 | 38158650899671.3 | 55408355168086.4 | 77911686576888.98 | 93933934257756.1 | 132463758275048 | 18855816536572.2 |
| 6.7547394273255e-07 | 17416799705191.6 | 31544528822830.1 | 38114842702906.9 | 55312144660164.3 | 77735502349904.2 | 93695048518030.7 | 132060103417156 | 18696165370308.9 |
| 6.76623630136621e-07 | 17418704783475.1 | 31517498785687.4 | 38070638071321.8 | 55215517844236.3 | 77558979804968.9 | 93455936925152.4 | 131656643727127.02 | 18537865961729.5 |
| 6.77775274360997e-07 | 17420363596873.4 | 31490104487740.1 | 38026039377099.8 | 55118478656245.51 | 77382124565781.1 | 93216606035849.5 | 131253387118416.98 | 18380906865575.6 |
| 6.78928878736276e-07 | 17421776538352 | 31462347670886.1 | 37981048999095.8 | 55021031030253.2 | 77204942239865.6 | 92977062379726 | 130850341451483.02 | 18225276733495.4 |
| 6.80084446598724e-07 | 17422944010780.6 | 31434230085746 | 37935669322670 | 54923178898239.1 | 77027438418385.7 | 92737312459108.5 | 130447514533774 | 18070964313222.8 |
| 6.81241981290286e-07 | 17423866426872.2 | 31405753491522.1 | 37889902739521.9 | 54824926189902.4 | 76849618675956.4 | 92497362748895.02 | 130044914119724.98 | 17917958447764.1 |
| 6.82401486158594e-07 | 17424544209122.3 | 31376919655858.6 | 37843751647526.1 | 54726276832465 | 76671488570460.5 | 92257219696407.3 | 129642547910752 | 17766248074591.2 |
| 6.83562964556978e-07 | 17424977789747.5 | 31347730354701.2 | 37797218450566.9 | 54627234750475.6 | 76493053642866.8 | 92016889721246.7 | 129240423555248 | 17615822224841.8 |
| 6.84726419844478e-07 | 17425167610623 | 31318187372157.3 | 37750305558375.2 | 54527803865615.3 | 76314319417050.8 | 91776379215150.7 | 128838548648592 | 17466670022526.5 |
| 6.85891855385847e-07 | 17425114123220.7 | 31288292500356.1 | 37703015386364.3 | 54427988096505 | 76135291399617.8 | 91535694541854.2 | 128436930733148.98 | 17318780683742.1 |
| 6.87059274551569e-07 | 17424817788546.1 | 31258047539309.4 | 37655350355467.8 | 54327791358513.8 | 75955975079727.9 | 91294842036953.2 | 128035577298282 | 17172143515892.3 |
| 6.88228680717862e-07 | 17424279077074.4 | 31227454296771.7 | 37607312891976.8 | 54227217563569.1 | 75776375928924.3 | 91053828007770.4 | 127634495780363.02 | 17026747916914.3 |
| 6.89400077266692e-07 | 17423498468687.4 | 31196514588101.5 | 37558905427378.2 | 54126270619968.3 | 75596499400963.02 | 90812658733224.7 | 127233693562786 | 16882583374512.5 |
| 6.90573467585781e-07 | 17422476452608.9 | 31165230236121.8 | 37510130398193.6 | 54024954432191.6 | 75416350931645.5 | 90571340463702.4 | 126833177975988.98 | 16739639465398.3 |
| 6.91748855068615e-07 | 17421213527339.6 | 31133603070982 | 37460990245818.9 | 53923272900716.4 | 75235935938653.1 | 90329879420931.9 | 126432956297472 | 16597905854536.3 |
| 6.9292624311446e-07 | 17419710200592.7 | 31101634930018.9 | 37411487416364 | 53821229921833.4 | 75055259821384.6 | 90088281797861.3 | 126033035751823.02 | 16457372294397.7 |
| 6.94105635128363e-07 | 17417966989227.8 | 31069327657618.7 | 37361624360493.6 | 53718829387464.2 | 74874327960795.4 | 89846553758537.5 | 125633423510744 | 16318028624218.5 |
| 6.9528703452117e-07 | 17415984419185 | 31036683105079.1 | 37311403533268.49 | 53616075184979.7 | 74693145719239.5 | 89604701437989.3 | 125234126693080 | 16179864769265.8 |
| 6.96470444709532e-07 | 17413763025418.7 | 31003703130471.3 | 37260827393987.2 | 53512971197020.8 | 74511718440313.1 | 89362730942112.5 | 124835152364855.02 | 16042870740108.5 |
| 6.97655869115914e-07 | 17411303351830.8 | 30970389598502.9 | 37209898406028.9 | 53409521301320.2 | 74330051448701.7 | 89120648347558.2 | 124436507539306 | 15907036631895.6 |
| 6.98843311168606e-07 | 17408605951203.6 | 30936744380380.5 | 37158619036696.3 | 53305729370525.9 | 74148150050028.2 | 88878459701622.7 | 124038199176920.98 | 15772352623640.1 |
| 7.00032774301735e-07 | 17405671385132.2 | 30902769353673.2 | 37106991757059.3 | 53201599272026.1 | 73966019530704.1 | 88636171022141.7 | 123640234185480.98 | 15638808977508.6 |
| 7.01224261955271e-07 | 17402500223956.6 | 30868466402175.8 | 37055019041799.9 | 53097134867775.3 | 73783665157783.1 | 88393788297385.5 | 123242619420108 | 15506396038117.4 |
| 7.02417777575041e-07 | 17399093046693.7 | 30833837415772.8 | 37002703369057 | 52992340014122.3 | 73601092178816.3 | 88151317485957.9 | 122845361683306 | 15375104231834.5 |
| 7.03613324612734e-07 | 17395450440968.7 | 30798884290302.4 | 36950047220272.4 | 52887218561640.1 | 73418305821710.3 | 87908764516696.98 | 122448467725015.02 | 15244924066087.1 |
| 7.04810906525918e-07 | 17391573002945.8 | 30763608927421.3 | 36897053080037.51 | 52781774354956 | 73235311294587.2 | 87666135288579.6 | 122051944242663.02 | 15115846128675.8 |
| 7.06010526778043e-07 | 17387461337259.6 | 30728013234469.1 | 36843723435940.1 | 52676011232584.7 | 73052113785647.2 | 87423435670626.6 | 121655797881220.98 | 14987861087093.6 |
| 7.07212188838454e-07 | 17383116056945.1 | 30692099124333.9 | 36790060778412.8 | 52569933026761.7 | 72868718463032.9 | 87180671501812.6 | 121260035233260.98 | 14860959687851.3 |
| 7.08415896182402e-07 | 17378537783367.8 | 30655868515317.7 | 36736067600581.2 | 52463543563279.51 | 72685130474696.9 | 86937848590977.2 | 120864662839016 | 14735132755808.5 |
| 7.09621652291053e-07 | 17373727146154.2 | 30619323331002.7 | 36681746398114 | 52356846661323.8 | 72501354948270.4 | 86694972716738.8 | 120469687186447.02 | 14610371193510.4 |
| 7.10829460651497e-07 | 17368684783120.2 | 30582465500117.2 | 36627099669072.3 | 52249846133312.6 | 72317396990934.7 | 86452049627411.02 | 120075114711302 | 14486665980529.5 |
| 7.12039324756761e-07 | 17363411340201.5 | 30545296956402.5 | 36572129913761 | 52142545784736.2 | 72133261689295.2 | 86209085040922 | 119680951797192.98 | 14364008172814.2 |
| 7.13251248105816e-07 | 17357907471381.8 | 30507819638480.5 | 36516839634580.4 | 52034949413998.3 | 71948954109256.9 | 85966084644735.9 | 119287204775658 | 14242388902041.3 |
| 7.14465234203588e-07 | 17352173838621.8 | 30470035489720.7 | 36461231335878.2 | 51927060812259.8 | 71764479295902.5 | 85723054095776.6 | 118893879926243.02 | 14121799374975.4 |
| 7.15681286560971e-07 | 17346211111787.6 | 30431946458108.8 | 36405307523803.1 | 51818883763283 | 71579842273373 | 85479999020354.4 | 118500983476572.98 | 14002230872832.9 |
| 7.16899408694831e-07 | 17340019968579.1 | 30393554496114.6 | 36349070706158.6 | 51710422043278 | 71395048044749.9 | 85236925014094.8 | 118108521602428.98 | 13883674750651.7 |
| 7.18119604128022e-07 | 17333601094457.3 | 30354861560561.5 | 36292523392257.4 | 51601679420750.2 | 71210101591940 | 84993837641869.8 | 117716500427836 | 13766122436666 |
| 7.19341876389395e-07 | 17326955182572.9 | 30315869612495.4 | 36235668092777.2 | 51492659656349.8 | 71025007875562.2 | 84750742437732 | 117324926025138 | 13649565431687 |
| 7.20566229013805e-07 | 17320082933692.9 | 30276580617055 | 36178507319617.1 | 51383366502722.6 | 70839771834836.9 | 84507644904850.2 | 116933804415088.98 | 13533995308487.6 |
| 7.21792665542125e-07 | 17312985056128.6 | 30236996543341.7 | 36121043585754.2 | 51273803704362.1 | 70654398387476.3 | 84264550515448.4 | 116543141566939.02 | 13419403711193.9 |
| 7.23021189521255e-07 | 17305662265662 | 30197119364290.6 | 36063279405101.8 | 51163974997463.51 | 70468892429578.8 | 84021464710746.6 | 116152943398526 | 13305782354680.7 |
| 7.24251804504131e-07 | 17298115285473.1 | 30156951056541.7 | 36005217292368.3 | 51053884109779.4 | 70283258835523.8 | 83778392900903.9 | 115763215776366 | 13193123023972.3 |
| 7.25484514049736e-07 | 17290344846066.3 | 30116493600311.8 | 35946859762916.2 | 50943534760476.2 | 70097502457869.8 | 83535340464964.5 | 115373964515748.98 | 13081417573648.9 |
| 7.26719321723111e-07 | 17282351685197 | 30075748979266.9 | 35888209332623.1 | 50832930659993 | 69911628127253.6 | 83292312750805.4 | 114985195380838 | 12970657927257.5 |
| 7.27956231095366e-07 | 17274136547797.6 | 30034719180394.5 | 35829268517742.2 | 50722075509901.51 | 69725640652292.8 | 83049315075086.6 | 114596914084764 | 12860836076728.1 |
| 7.29195245743687e-07 | 17265700185903.8 | 29993406193877.5 | 35770039834764.8 | 50610973002767.6 | 69539544819489.3 | 82806352723204 | 114209126289734 | 12751944081794.4 |
| 7.30436369251351e-07 | 17257043358580.8 | 29951812012967.7 | 35710525800283.3 | 50499626822014.4 | 69353345393135.8 | 82563430949243.9 | 113821837607128 | 12643974069420 |
| 7.31679605207731e-07 | 17248166831848.4 | 29909938633860.3 | 35650728930854.3 | 50388040641787.1 | 69167047115223.7 | 82320554975940.6 | 113435053597608 | 12536918233229.1 |
| 7.32924957208313e-07 | 17239071378607.1 | 29867788055569 | 35590651742863.6 | 50276218126819 | 68980654705353.3 | 82077729994634.9 | 113048779771227.02 | 12430768832941.8 |
| 7.34172428854699e-07 | 17229757778563.6 | 29825362279801 | 35530296752392 | 50164162932299.2 | 68794172860646.3 | 81834961165236.6 | 112663021587536.98 | 12325518193815.2 |
| 7.35422023754623e-07 | 17220226818155.8 | 29782663310833.6 | 35469666475080.7 | 50051878703741.9 | 68607606255660.1 | 81592253616187.9 | 112277784455700 | 12221158706087.6 |
| 7.36673745521959e-07 | 17210479290478.6 | 29739693155390.4 | 35408763425999.3 | 49939369076857.2 | 68420959542304.4 | 81349612444429.6 | 111893073734607.02 | 12117682824428.9 |
| 7.37927597776733e-07 | 17200515995208.3 | 29696453822518.7 | 35347590119513.4 | 49826637677423.4 | 68234237349759.51 | 81107042715369.1 | 111508894732988 | 12015083067394.9 |
| 7.3918358414513e-07 | 17190337738528 | 29652947323467.1 | 35286149069154 | 49713688121161 | 68047444284396.49 | 80864549462850.6 | 111125252709532.98 | 11913352016886.5 |
| 7.40441708259511e-07 | 17179945333052.7 | 29609175671564.1 | 35224442787486.5 | 49600524013607.7 | 67860584929700.6 | 80622137689128.5 | 110742152873014 | 11812482317612.9 |
| 7.41701973758415e-07 | 17169339597753.4 | 29565140882096.5 | 35162473785982.6 | 49487148949996 | 67673663846194.8 | 80379812364840.8 | 110359600382402 | 11712466676560.5 |
| 7.42964384286576e-07 | 17158521357882.7 | 29520844972189.6 | 35100244574890.8 | 49373566515130.7 | 67486685571366.9 | 80137578428987.1 | 109977600346994 | 11613297862465 |
| 7.44228943494933e-07 | 17147491444898.5 | 29476289960686.8 | 35037757663109.8 | 49259780283269.7 | 67299654619598 | 79895440788906.7 | 109596157826540.98 | 11514968705289.1 |
| 7.45495655040636e-07 | 17136250696389.4 | 29431477868030.7 | 34975015558061.3 | 49145793818005 | 67112575482092.49 | 79653404320259.8 | 109215277831368.98 | 11417472095703.4 |
| 7.46764522587061e-07 | 17124799955998.6 | 29386410716144 | 34912020765564.6 | 49031610672146 | 66925452626811.3 | 79411473867010.7 | 108834965322512.98 | 11320800984573.2 |
| 7.48035549803821e-07 | 17113140073348.6 | 29341090528312.2 | 34848775789712 | 48917234387603.8 | 66738290498405.4 | 79169654241412.9 | 108455225211848 | 11224948382448.2 |
| 7.49308740366772e-07 | 17101271903965.5 | 29295519329065.3 | 34785283132744.9 | 48802668495277.3 | 66551093518152.9 | 78927950223995.8 | 108076062362220.98 | 11129907359057.4 |
| 7.50584097958028e-07 | 17089196309203.4 | 29249699144062 | 34721545294930.4 | 48687916514940.7 | 66363866083896.7 | 78686366563554.6 | 107697481587584 | 11035671042808.3 |
| 7.5186162626597e-07 | 17076914156168.6 | 29203631999972.8 | 34657564774440.2 | 48572981955132.8 | 66176612569985 | 78444907977140.9 | 107319487653134 | 10942232620289.4 |
| 7.53141328985257e-07 | 17064426317643.9 | 29157319924365 | 34593344067229 | 48457868313047.3 | 65989337327213.6 | 78203579150056.1 | 106942085275447.02 | 10849585335778.3 |
| 7.54423209816835e-07 | 17051733672013.1 | 29110764945587.6 | 34528885666914.3 | 48342579074424.8 | 65802044682769.2 | 77962384735846.5 | 106565279122620 | 10757722490752.6 |
| 7.55707272467951e-07 | 17038837103184.6 | 29063969092657.3 | 34464192064657.7 | 48227117713446.8 | 65614738940176 | 77721329356300.4 | 106189073814414 | 10666637443406.4 |
| 7.5699352065216e-07 | 17025737500516.5 | 29016934395145 | 34399265749046.2 | 48111487692630.4 | 65427424379242.9 | 77480417601447.3 | 105813473922392.98 | 10576323608169.1 |
| 7.58281958089341e-07 | 17012435758740.1 | 28969662883062.9 | 34334109205975 | 47995692462724.7 | 65240105256013.51 | 77239654029558.4 | 105438483970070 | 10486774455230.2 |
| 7.59572588505701e-07 | 16998932777884.5 | 28922156586752.3 | 34268724918531.3 | 47879735462609.51 | 65052785802717.3 | 76999043167150.1 | 105064108433056 | 10397983510066.3 |
| 7.60865415633791e-07 | 16985229463200.8 | 28874417536772.1 | 34203115366879 | 47763620119194.3 | 64865470227722.9 | 76758589508988.2 | 104690351739203.02 | 10309944352973.9 |
| 7.62160443212513e-07 | 16971326725086.1 | 28826447763788.3 | 34137283028143.7 | 47647349847319.2 | 64678162715493.51 | 76518297518094.8 | 104317218268756.98 | 10222650618604.5 |
| 7.63457674987136e-07 | 16957225479008.3 | 28778249298463.3 | 34071230376300 | 47530928049657.9 | 64490867426543.51 | 76278171625756.9 | 103944712354504.98 | 10136095995504.7 |
| 7.647571147093e-07 | 16942926645430 | 28729824171347.2 | 34004959882058.2 | 47414358116621.6 | 64303588497397.3 | 76038216231536.4 | 103572838281932 | 10050274225659.8 |
| 7.66058766137034e-07 | 16928431149733 | 28681174412768.3 | 33938474012753 | 47297643426264 | 64116330040549.8 | 75798435703282.4 | 103201600289368.98 | 9965179104041.41 |
| 7.6736263303476e-07 | 16913739922142.8 | 28632302052725.6 | 33871775232233.3 | 47180787344188.49 | 63929096144429 | 75558834377145.5 | 102831002568152.98 | 9880804478158.87 |
| 7.6866871917331e-07 | 16898853897653.1 | 28583209120781.3 | 33804866000751.8 | 47063793223456.9 | 63741890873359.6 | 75319416557592.98 | 102461049262780.98 | 9797144247614.18 |
| 7.69977028329932e-07 | 16883774015950 | 28533897645954.2 | 33737748774856.8 | 46946664404498.4 | 63554718267528.9 | 75080186517426.5 | 102091744471066 | 9714192363661.13 |
| 7.71287564288304e-07 | 16868501221336.9 | 28484369656613.6 | 33670426007284.3 | 46829404215021.8 | 63367582342954.7 | 74841148497801.5 | 101723092244300 | 9631942828767.92 |
| 7.72600330838545e-07 | 16853036462659.3 | 28434627180374.4 | 33602900146851.2 | 46712015969927.9 | 63180487091454.4 | 74602306708248.5 | 101355096587412 | 9550389696183.5 |
| 7.73915331777223e-07 | 16837380693229 | 28384672243992.6 | 33535173638349.6 | 46594502971223.2 | 62993436480615.9 | 74363665326695.2 | 100987761459130 | 9469527069507.66 |
| 7.75232570907369e-07 | 16821534870749.7 | 28334506873261.1 | 33467248922442.2 | 46476868507936.3 | 62806434453770.4 | 74125228499491.2 | 100621090772144.98 | 9389349102264.67 |
| 7.76552052038487e-07 | 16805499957241.1 | 28284133092907.3 | 33399128435557.7 | 46359115856034.7 | 62619484929966.7 | 73887000341434.3 | 100255088393275.02 | 9309849997480.6 |
| 7.77873778986564e-07 | 16789276918964.6 | 28233552926490.3 | 33330814609789 | 46241248278342.8 | 62432591803947.51 | 73648984935798.3 | 99889758143628 | 9231024007264.18 |
| 7.79197755574084e-07 | 16772866726348.2 | 28182768396299.7 | 33262309872790.2 | 46123269024462.6 | 62245758946127.1 | 73411186334362.3 | 99525103798772.98 | 9152865432391.22 |
| 7.80523985630035e-07 | 16756270353911.4 | 28131781523254.5 | 33193616647676.7 | 46005181330694.49 | 62058990202570.49 | 73173608557441.6 | 99161129088905.1 | 9075368621892.54 |
| 7.81852472989923e-07 | 16739488780191.2 | 28080594326803.1 | 33124737352924.4 | 45886988419960.3 | 61872289394974.9 | 72936255593921.1 | 98797837699015.5 | 8998527972645.42 |
| 7.83183221495782e-07 | 16722522987667.1 | 28029208824824.1 | 33055674402271.2 | 45768693501727.2 | 61685660320652 | 72699131401289.2 | 98435233269061.5 | 8922337928968.47 |
| 7.84516234996185e-07 | 16705373962686.9 | 27977627033527.6 | 32986430204619 | 45650299771933.51 | 61499106752512.6 | 72462239905673.4 | 98073319394137.7 | 8846792982219.94 |
| 7.85851517346257e-07 | 16688042695392.3 | 27925850967357.1 | 32917007163936.7 | 45531810412915.51 | 61312632439052.4 | 72225585001878.6 | 97712099624648.9 | 8771887670399.46 |
| 7.87189072407682e-07 | 16670530179645 | 27873882638892.8 | 32847407679163.8 | 45413228593335.8 | 61126241104339.1 | 71989170553425.5 | 97351577466483.6 | 8697616577753.12 |
| 7.88528904048719e-07 | 16652837412952.5 | 27821724058755.2 | 32777634144115.9 | 45294557468113.4 | 60939936448002.3 | 71753000392591.6 | 96991756381188.1 | 8623974334381.88 |
| 7.8987101614421e-07 | 16634965396394.5 | 27769377235509.1 | 32707688947390.3 | 45175800178354.2 | 60753722145223.3 | 71517078320453.1 | 96632639786142.6 | 8550955615853.38 |
| 7.91215412575592e-07 | 16616915134549.2 | 27716844175569.5 | 32637574472273 | 45056959851284.1 | 60567601846727.9 | 71281408106928.4 | 96274231054737.7 | 8478555142816.9 |
| 7.92562097230909e-07 | 16598687635419.4 | 27664126883106.8 | 32567293096646.5 | 44938039600182.6 | 60381579178779.8 | 71045993490823.8 | 95916533516552 | 8406767680621.71 |
| 7.93911074004823e-07 | 16580283910359.9 | 27611227359953.9 | 32496847192899.1 | 44819042524318 | 60195657743175.8 | 70810838179879.5 | 95559550457530.8 | 8335588038938.57 |
| 7.95262346798623e-07 | 16561704974003.7 | 27558147605513.8 | 32426239127834.3 | 44699971708884.2 | 60009841117243 | 70575945850817.8 | 95203285120165.4 | 8265011071384.5 |
| 7.9661591952024e-07 | 16542951844189.4 | 27504889616667.2 | 32355471262581.7 | 44580830224938.49 | 59824132853836.7 | 70341320149392.9 | 94847740703674 | 8195031675150.63 |
| 7.97971796084256e-07 | 16524025541888.1 | 27451455387682.4 | 32284545952509 | 44461621129341 | 59638536481340.3 | 70106964690441.51 | 94492920364182.9 | 8125644790633.32 |
| 7.99329980411916e-07 | 16504927091131.3 | 27397846910124.4 | 32213465547134.9 | 44342347464695 | 59453055503666.4 | 69872883057935.2 | 94138827214908.1 | 8056845401068.3 |
| 8.00690476431137e-07 | 16485657518937.8 | 27344066172765.8 | 32142232390042.6 | 44223012259289.4 | 59267693400260.1 | 69639078805034.4 | 93785464326339.8 | 7988628532167.98 |
| 8.02053288076525e-07 | 16466217855242.1 | 27290115161497.8 | 32070848818794.8 | 44103618527041.51 | 59082453626102.2 | 69405555454143.2 | 93432834726425.3 | 7920989251761.77 |
| 8.03418419289381e-07 | 16446609132822.1 | 27235995859242.7 | 31999317164849.5 | 43984169267442.2 | 58897339611715.6 | 69172316496965.9 | 93080941400754.1 | 7853922669439.53 |
| 8.04785874017714e-07 | 16426832387227.5 | 27181710245866.6 | 31927639753476.3 | 43864667465501.3 | 58712354763172.2 | 68939365394564.8 | 92729787292743.5 | 7787423936197.93 |
| 8.06155656216253e-07 | 16406888656707.9 | 27127260298093.1 | 31855818903674.7 | 43745116091695.2 | 58527502462100.8 | 68706705577419.8 | 92379375303825.1 | 7721488244089.9 |
| 8.07527769846459e-07 | 16386778982141.8 | 27072647989417.7 | 31783856928092.5 | 43625518101915.4 | 58342786065697.8 | 68474340445487.9 | 92029708293631.9 | 7656110825876.98 |
| 8.08902218876534e-07 | 16366504406965.2 | 27017875290023 | 31711756132945.4 | 43505876437418.1 | 58158208906737.7 | 68242273368265.9 | 91680789080186.2 | 7591286954684.67 |
| 8.10279007281435e-07 | 16346065977100.9 | 26962944166695 | 31639518817937.8 | 43386194024775.6 | 57973774293586.3 | 68010507684852.9 | 91332620440088 | 7527011943660.66 |
| 8.11658139042885e-07 | 16325464740887.9 | 26907856582739.6 | 31567147276184.3 | 43266473775828.49 | 57789485510214.1 | 67779046704014.6 | 90985205108704.6 | 7463281145635.94 |
| 8.13039618149383e-07 | 16304701749010.6 | 26852614497900.3 | 31494643794132.5 | 43146718587639.51 | 57605345816212 | 67547893704249.2 | 90638545780360.8 | 7400089952788.85 |
| 8.14423448596217e-07 | 16283778054429.1 | 26797219868276.5 | 31422010651486.2 | 43026931342448.3 | 57421358446807.9 | 67317051933853.9 | 90292645108528.8 | 7337433796311.89 |
| 8.15809634385477e-07 | 16262694712308.7 | 26741674646243 | 31349250121130.4 | 42907114907627.8 | 57237526612884.7 | 67086524610992.7 | 89947505706020.4 | 7275308146081.41 |
| 8.17198179526061e-07 | 16241452779950.9 | 26685980780369.6 | 31276364469056.4 | 42787272135641.7 | 57053853500999.2 | 66856314923766.2 | 89603130145178.3 | 7213708510330.06 |
| 8.18589088033693e-07 | 16220053316723.6 | 26630140215341.8 | 31203355954288.3 | 42667405864003.1 | 56870342273403.6 | 66626426030281.4 | 89259520958069.1 | 7152630435322.06 |
| 8.19982363930931e-07 | 16198497383991.7 | 26574154891882.8 | 31130226828811 | 42547518915234.3 | 56686996068066.2 | 66396861058723.51 | 88916680636676.3 | 7092069505031.13 |
| 8.21378011247181e-07 | 16176786045048.8 | 26518026746675.5 | 31056979337497.8 | 42427614096828.4 | 56503817998695.51 | 66167623107428.7 | 88574611633093.9 | 7032021340821.29 |
| 8.22776034018705e-07 | 16154920365048.2 | 26461757712285.5 | 30983615718040.3 | 42307694201211.1 | 56320811154764.3 | 65938715244957.7 | 88233316359720.7 | 6972481601130.18 |
| 8.24176436288637e-07 | 16132901410934.7 | 26405349717085.3 | 30910138200878.6 | 42187762005704.8 | 56137978601535 | 65710140510171 | 87892797189455.2 | 6913445981155.26 |
| 8.25579222106991e-07 | 16110730251376.2 | 26348804685179.1 | 30836549009132.5 | 42067820272493.51 | 55955323380086.9 | 65481901912305 | 87553056455891.02 | 6854910212542.47 |
| 8.26984395530675e-07 | 16088407956696.4 | 26292124536327.7 | 30762850358533.9 | 41947871748588.4 | 55772848507344.49 | 65254002431048.8 | 87214096453512.2 | 6796870063077.71 |
| 8.28391960623502e-07 | 16065935598807.2 | 26235311185875.7 | 30689044457359.8 | 41827919165795.4 | 55590556976106.1 | 65026445016622.9 | 86875919437890.5 | 6739321336380.78 |
| 8.29801921456201e-07 | 16043314251141.2 | 26178366544677.6 | 30615133506366.7 | 41707965240683.3 | 55408451755075 | 64799232589858.2 | 86538527625880.9 | 6682259871602.01 |
| 8.31214282106432e-07 | 16020544988585 | 26121292519026.4 | 30541119698725.5 | 41588012674554 | 55226535788890.6 | 64572368042276.4 | 86201923195819.9 | 6625681543121.42 |
| 8.32629046658793e-07 | 15997628887412.8 | 26064091010582.3 | 30467005219957.7 | 41468064153412.4 | 55044811998162 | 64345854236171.6 | 85866108287722.4 | 6569582260250.42 |
| 8.34046219204834e-07 | 15974567025219.6 | 26006763916301.5 | 30392792247872.3 | 41348122347939 | 54863283279501.4 | 64119694004692.4 | 85531085003480.3 | 6513957966936.07 |
| 8.35465803843071e-07 | 15951360480855.6 | 25949313128367 | 30318482952503.6 | 41228189913462.7 | 54681952505559.4 | 63893890151925.4 | 85196855407060.7 | 6458804641467.8 |
| 8.36887804678994e-07 | 15928010334360.4 | 25891740534119.5 | 30244079496050.6 | 41108269489935 | 54500822525061.4 | 63668445452979.8 | 84863421524704.3 | 6404118296186.63 |
| 8.38312225825082e-07 | 15904517666897.7 | 25834048015989.5 | 30169584032816.2 | 40988363701905.6 | 54319896162845.1 | 63443362654072.7 | 84530785345125.6 | 6349894977196.9 |
| 8.39739071400813e-07 | 15880883560690 | 25776237451429.4 | 30094998709148.3 | 40868475158498.9 | 54139176219898.8 | 63218644472615 | 84198948819711.2 | 6296130764080.32 |
| 8.41168345532677e-07 | 15857109098954 | 25718310712847.3 | 30020325663381.6 | 40748606453391.2 | 53958665473401.3 | 62994293597299.3 | 83867913862720.8 | 6242821769612.64 |
| 8.42600052354186e-07 | 15833195365836.4 | 25660269667541.1 | 29945567025779.9 | 40628760164790.1 | 53778366676762.2 | 62770312688187.7 | 83537682351486.4 | 6189964139482.45 |
| 8.44034196005889e-07 | 15809143446349.5 | 25602116177633.5 | 29870724918479.8 | 40508938855414 | 53598282559663.9 | 62546704376801 | 83208256126613.2 | 6137554052012.63 |
| 8.45470780635382e-07 | 15784954426307.5 | 25543852100007.9 | 29795801455435.2 | 40389145072473.1 | 53418415828104.8 | 62323471266208.7 | 82879636992180.5 | 6085587717883.98 |
| 8.46909810397321e-07 | 15760629392263.3 | 25485479286244.7 | 29720798742362.6 | 40269381347651.51 | 53238769164442.4 | 62100615931119.9 | 82551826715942.3 | 6034061379861.25 |
| 8.48351289453432e-07 | 15736169431445.2 | 25426999582559.1 | 29645718876687.7 | 40149650197090.4 | 53059345227438.7 | 61878140917975.1 | 82224827029528.6 | 5982971312521.51 |
| 8.49795221972525e-07 | 15711575631694.2 | 25368414829738.6 | 29570563947492.3 | 40029954121372.3 | 52880146652306.2 | 61656048745038.7 | 81898639628647.2 | 5932313821984.76 |
| 8.51241612130506e-07 | 15686849081401.6 | 25309726863082.7 | 29495336035462.5 | 39910295605506.3 | 52701176050754.49 | 61434341902492.6 | 81573266173284.9 | 5882085245646.9 |
| 8.52690464110389e-07 | 15661990869447.1 | 25250937512341.8 | 29420037212837.9 | 39790677118914.6 | 52522436011038.4 | 61213022852530.4 | 81248708287909.7 | 5832281951914.88 |
| 8.54141782102305e-07 | 15637002085136.9 | 25192048601658.4 | 29344669543361.4 | 39671101115419.6 | 52343929098006.7 | 60992094029452.4 | 80924967561672.8 | 5782900339944.18 |
| 8.55595570303521e-07 | 15611883818142.3 | 25133061949508.1 | 29269235082230.3 | 39551570033232.7 | 52165657853152.6 | 60771557839762 | 80602045548610.7 | 5733936839378.4 |
| 8.57051832918445e-07 | 15586637158438.9 | 25073979368641.3 | 29193735876047.6 | 39432086294943.7 | 51987624794663.51 | 60551416662261.2 | 80279943767847.7 | 5685387910091.17 |
| 8.58510574158641e-07 | 15561263196246 | 25014802666026.7 | 29118173962775.3 | 39312652307511.4 | 51809832417473.8 | 60331672848149.7 | 79958663703798.5 | 5637250041930.17 |
| 8.59971798242843e-07 | 15535763021966 | 24955533642794.4 | 29042551371687.3 | 39193270462254.8 | 51632283193317.1 | 60112328721121.8 | 79638206806370.5 | 5589519754463.35 |
| 8.61435509396964e-07 | 15510137726124.8 | 24896174094180.3 | 28966870123324.3 | 39073943134846.4 | 51454979570779.8 | 59893386577465.7 | 79318574491167.02 | 5542193596727.29 |
| 8.6290171185411e-07 | 15484388399312.1 | 24836725809471.6 | 28891132229448.9 | 38954672685305.1 | 51277923975356.1 | 59674848686163.6 | 78999768139689.8 | 5495268146977.69 |
| 8.64370409854593e-07 | 15458516132122.3 | 24777190571952.4 | 28815339693001.8 | 38835461457991.2 | 51101118809502.8 | 59456717288991.51 | 78681789099542 | 5448740012441.95 |
| 8.65841607645941e-07 | 15432522015095.5 | 24717570158850.6 | 28739494508059 | 38716311781601.6 | 50924566452696 | 59238994600620.7 | 78364638684631.4 | 5402605829073.93 |
| 8.67315309482912e-07 | 15406407138659.4 | 24657866341285 | 28663598659789.9 | 38597225969166.8 | 50748269261488.7 | 59021682808719.3 | 78048318175373.2 | 5356862261310.65 |
| 8.68791519627505e-07 | 15380172593070.9 | 24598080884214 | 28587654124415.5 | 38478206318048.3 | 50572229569567.8 | 58804784074055.1 | 77732828818892.98 | 5311506001831.17 |
| 8.70270242348974e-07 | 15353819468358.6 | 24538215546384.3 | 28511662869168.7 | 38359255109936.7 | 50396449687814 | 58588300530598.2 | 77418171829230.4 | 5266533771317.45 |
| 8.7175148192384e-07 | 15327348854265.5 | 24478272080280.7 | 28435626852254.8 | 38240374610851.8 | 50220931904361.1 | 58372234285625 | 77104348387541.6 | 5221942318217.27 |
| 8.73235242635901e-07 | 15300761840191.8 | 24418252232076.7 | 28359548022812.6 | 38121567071142.4 | 50045678484656.9 | 58156587419823 | 76791359642302.9 | 5177728418509.13 |
| 8.74721528776248e-07 | 15274059515138.9 | 24358157741585.5 | 28283428320876.8 | 38002834725488.3 | 49870691671523.9 | 57941361987395 | 76479206709513.6 | 5133888875469.11 |
| 8.76210344643275e-07 | 15247242967652.8 | 24297990342212.4 | 28207269677341.5 | 37884179792901.9 | 49695973685222.4 | 57726560016165.51 | 76167890672899.02 | 5090420519439.8 |
| 8.77701694542692e-07 | 15220313285768.3 | 24237751760907.3 | 28131074013923.3 | 37765604476731.9 | 49521526723513 | 57512183507686.4 | 75857412584113.8 | 5047320207601.11 |
| 8.79195582787536e-07 | 15193271556954.1 | 24177443718118.3 | 28054843243126.9 | 37647110964667.1 | 49347352961720 | 57298234437344.49 | 75547773462944.6 | 5004584823743.03 |
| 8.80692013698189e-07 | 15166118868057.2 | 24117067927746.2 | 27978579268210.7 | 37528701428741.7 | 49173454552796.9 | 57084714754468 | 75238974297513.3 | 4962211278040.32 |
| 8.82190991602382e-07 | 15138856305248.8 | 24056626097099 | 27902283983152.6 | 37410378025341 | 48999833627390.7 | 56871626382435.3 | 74931016044479.4 | 4920196506829.13 |
| 8.83692520835215e-07 | 15111484953969.9 | 23996119926848.1 | 27825959272618 | 37292142895208.49 | 48826492293908.8 | 56658971218782.8 | 74623899629243.4 | 4878537472385.49 |
| 8.85196605739165e-07 | 15084005898877.5 | 23935551110984.9 | 27749607011927.6 | 37173998163453.3 | 48653432638585.1 | 56446751135314.6 | 74317625946148.7 | 4837231162705.66 |
| 8.867032506641e-07 | 15056420223791.4 | 23874921336777.6 | 27673229067026.6 | 37055945939558.9 | 48480656725547.6 | 56234967978211.51 | 74012195858684.7 | 4796274591288.38 |
| 8.88212459967294e-07 | 15028729011640.6 | 23814232284729.5 | 27596827294454.1 | 36937988317392.49 | 48308166596887.1 | 56023623568141.3 | 73707610199688.98 | 4755664796918.93 |
| 8.89724238013434e-07 | 15000933344411.6 | 23753485628537.8 | 27520403541314 | 36820127375215.4 | 48135964272725.51 | 55812719700369.6 | 73403869771549.6 | 4715398843455.02 |
| 8.91238589174639e-07 | 14973034303095.6 | 23692683035052.5 | 27443959645246.3 | 36702365175694.3 | 47964051751285.7 | 55602258144870.2 | 73100975346407.02 | 4675473819614.55 |
| 8.92755517830466e-07 | 14945032967636.7 | 23631826164237.6 | 27367497434399.2 | 36584703765912.9 | 47792431008961.9 | 55392240646437.3 | 72798927666356.2 | 4635886838765.04 |
| 8.9427502836793e-07 | 14916930416880.9 | 23570916669130.7 | 27291018727402.3 | 36467145177385.3 | 47621104000390.2 | 55182668924797.2 | 72497727443648.6 | 4596635038715 |
| 8.95797125181509e-07 | 14888727728524.8 | 23509956195806 | 27214525333340 | 36349691426069 | 47450072658520.7 | 54973544674720.6 | 72197375360892.98 | 4557715581506.97 |
| 8.97321812673165e-07 | 14860425979065.2 | 23448946383335.4 | 27138019051726.5 | 36232344512380 | 47279338894689.4 | 54764869566135.7 | 71897872071257.9 | 4519125653212.28 |
| 8.9884909525235e-07 | 14832026243749 | 23387888863752.5 | 27061501672481.1 | 36115106421207.8 | 47108904598691.1 | 54556645244241.3 | 71599218198671.7 | 4480862463727.67 |
| 9.00378977336018e-07 | 14803529596523 | 23326785262015.9 | 26984974975904.1 | 35997979121931.4 | 46938771638852.9 | 54348873329620.7 | 71301414338024.5 | 4442923246573.53 |
| 9.01911463348648e-07 | 14774937109985.5 | 23265637195973.9 | 26908440732653.8 | 35880964568436.5 | 46768941862108.3 | 54141555418355.51 | 71004461055368.1 | 4405305258693.86 |
| 9.03446557722243e-07 | 14746249855336.2 | 23204446276329.4 | 26831900703724.4 | 35764064699132.9 | 46599417094072.1 | 53934693082140.6 | 70708358888116.9 | 4368005780258 |
| 9.04984264896352e-07 | 14717468902328.9 | 23143214106606.2 | 26755356640424.1 | 35647281436972.9 | 46430199139115.51 | 53728287868398.49 | 70413108345248.2 | 4331022114463.91 |
| 9.06524589318083e-07 | 14688595319222.4 | 23081942283115.6 | 26678810284354.7 | 35530616689470.8 | 46261289780441.8 | 53522341300395.1 | 70118709907501.7 | 4294351587343.26 |
| 9.08067535442108e-07 | 14659630172733.6 | 23020632394923.3 | 26602263367391.3 | 35414072348722.9 | 46092690780163.4 | 53316854877354.49 | 69825164027579.6 | 4257991547568.03 |
| 9.09613107730685e-07 | 14630574527989.6 | 22959286023817.8 | 26525717611663.1 | 35297650291427.7 | 45924403879378 | 53111830074576 | 69532471130345.8 | 4221939366258.88 |
| 9.11161310653665e-07 | 14601429448481.5 | 22897904744279 | 26449174729534.9 | 35181352378908 | 45756430798247 | 52907268343549.6 | 69240631613025.1 | 4186192436795.02 |
| 9.12712148688508e-07 | 14572195996017.7 | 22836490123447.4 | 26372636423589.4 | 35065180457132.9 | 45588773236073 | 52703171112072.8 | 68949645845402.1 | 4150748174625.8 |
| 9.14265626320294e-07 | 14542875230677.5 | 22775043721094.5 | 26296104386609.9 | 34949136356740.5 | 45421432871378.6 | 52499539784367.6 | 68659514170019.4 | 4115604017083.79 |
| 9.15821748041737e-07 | 14513468210766.5 | 22713567089593.5 | 26219580301564.3 | 34833221893062 | 45254411361985.6 | 52296375741197.8 | 68370236902375.9 | 4080757423199.56 |
| 9.17380518353199e-07 | 14483975992770.4 | 22652061773890.3 | 26143065841589.2 | 34717438866145.7 | 45087710345094.49 | 52093680339986 | 68081814331124.9 | 4046205873517.91 |
| 9.189419417627e-07 | 14454399631311.1 | 22590529311476.5 | 26066562669975.4 | 34601789060782.1 | 44921331437364.8 | 51891454914932.2 | 67794246718271.3 | 4011946869915.72 |
| 9.20506022785933e-07 | 14424740179102 | 22528971232361.1 | 25990072440153.3 | 34486274246530.2 | 44755276234995.4 | 51689700777131.1 | 67507534299368.7 | 3977977935421.35 |
| 9.22072765946279e-07 | 14394998686903.9 | 22467389059045.1 | 25913596795680 | 34370896177743.1 | 44589546313806 | 51488419214690.9 | 67221677283716.4 | 3944296614035.56 |
| 9.23642175774816e-07 | 14365176203482.1 | 22405784306494.6 | 25837137370226.1 | 34255656593596 | 44424143229318.4 | 51287611492851.6 | 66936675854556 | 3910900470553.9 |
| 9.25214256810334e-07 | 14335273775563.2 | 22344158482116.4 | 25760695787564 | 34140557218113.3 | 44259068516838.49 | 51087278854104 | 66652530169266.6 | 3877787090390.66 |
| 9.2678901359935e-07 | 14305292447792 | 22282513085732.9 | 25684273661556.2 | 34025599760197.5 | 44094323691539.1 | 50887422518308.4 | 66369240359561.51 | 3844954079404.32 |
| 9.28366450696117e-07 | 14275233262690.1 | 22220849609558.5 | 25607872596145.3 | 33910785913658.4 | 43929910248542.49 | 50688043682814.2 | 66086806531682.7 | 3812399063724.4 |
| 9.29946572662642e-07 | 14245097260613.5 | 22159169538176.4 | 25531494185343.5 | 33796117357242.6 | 43765829663003.9 | 50489143522579.51 | 65805228766596.3 | 3780119689579.86 |
| 9.31529384068696e-07 | 14214885479711.6 | 22097474348515.8 | 25455140013223.3 | 33681595754664 | 43602083390195.1 | 50290723190289.9 | 65524507120186.49 | 3748113623128.91 |
| 9.33114889491825e-07 | 14184598955886.3 | 22035765509830 | 25378811653909.7 | 33567222754634.9 | 43438672865588.9 | 50092783816479.51 | 65244641623449.7 | 3716378550290.28 |
| 9.34703093517372e-07 | 14154238722751.1 | 21974044483675.4 | 25302510671571 | 33452999990897.8 | 43275599504943.4 | 49895326509649.9 | 64965632282688.3 | 3684912176575.88 |
| 9.36294000738479e-07 | 14123805811591.8 | 21912312723890.4 | 25226238620413 | 33338929082257.4 | 43112864704387 | 49698352356391.2 | 64687479079703.8 | 3653712226924.95 |
| 9.37887615756108e-07 | 14093301251326.2 | 21850571676575.7 | 25149997044671.1 | 33225011632613.8 | 42950469840503.8 | 49501862421501.6 | 64410181971989.3 | 3622776445539.52 |
| 9.39483943179053e-07 | 14062726068465.2 | 21788822780074.7 | 25073787478605.5 | 33111249230996 | 42788416270419.2 | 49305857748108.7 | 64133740892922.1 | 3592102595721.35 |
| 9.4108298762395e-07 | 14032081287073.8 | 21727067464954.9 | 24997611446495.1 | 32997643451595.6 | 42626705331886.2 | 49110339357789.3 | 63858155751955 | 3561688459710.21 |
| 9.42684753715296e-07 | 14001367928733.2 | 21665307153989.5 | 24921470462633.2 | 32884195853802.2 | 42465338343371.3 | 48915308250691 | 63583426434808.2 | 3531531838523.5 |
| 9.44289246085455e-07 | 13970587012502.3 | 21603543262140.4 | 24845366031323.6 | 32770907982237.9 | 42304316604141.9 | 48720765405652.4 | 63309552803659.6 | 3501630551797.32 |
| 9.45896469374679e-07 | 13939739554880.7 | 21541777196540.5 | 24769299646877.2 | 32657781366793.5 | 42143641394352.8 | 48526711780324.49 | 63036534697335.8 | 3471982437628.76 |
| 9.47506428231116e-07 | 13908826569771.2 | 21480010356478.2 | 24693272793609.1 | 32544817522665.2 | 41983313975133.9 | 48333148311291.51 | 62764371931501.3 | 3442585352419.63 |
| 9.49119127310827e-07 | 13877849068443.4 | 21418244133381 | 24617286945836.7 | 32432017950390.9 | 41823335588678.1 | 48140075914192.49 | 62493064298848.3 | 3413437170721.49 |
| 9.50734571277795e-07 | 13846808059497.5 | 21356479910801 | 24541343567878.3 | 32319384135888.2 | 41663707458328.9 | 47947495483842.2 | 62222611569285.3 | 3384535785081.93 |
| 9.52352764803945e-07 | 13815704548828.4 | 21294719064400.1 | 24465444114052.1 | 32206917550492.3 | 41504430788668.9 | 47755407894352.8 | 61953013490126.1 | 3355879105892.23 |
| 9.5397371256915e-07 | 13784539539590.2 | 21232962961936.2 | 24389590028675.8 | 32094619650994.5 | 41345506765608.7 | 47563813999255 | 61684269786276.8 | 3327465061236.29 |
| 9.55597419261252e-07 | 13753314032161.6 | 21171212963249.7 | 24313782746067.5 | 31982491879681.3 | 41186936556475.3 | 47372714631619.7 | 61416380160423.51 | 3299291596740.78 |
| 9.57223889576069e-07 | 13722029024110.9 | 21109470420251.3 | 24238023690545.9 | 31870535664374.1 | 41028721310101.6 | 47182110604179.51 | 61149344293219.2 | 3271356675426.67 |
| 9.58853128217413e-07 | 13690685510162.2 | 21047736676909.2 | 24162314276432.6 | 31758752418469.3 | 40870862156916 | 46992002709450.3 | 60883161843469.9 | 3243658277561.9 |
| 9.60485139897102e-07 | 13659284482161.8 | 20986013069238 | 24086655908053.8 | 31647143540979.1 | 40713360209031.4 | 46802391719853 | 60617832448320.49 | 3216194400515.36 |
| 9.62119929334974e-07 | 13627826929044.6 | 20924300925287.7 | 24011049979743.3 | 31535710416572 | 40556216560336 | 46613278387834.8 | 60353355723439.51 | 3188963058612.13 |
| 9.63757501258899e-07 | 13596313836801.6 | 20862601565133.1 | 23935497875845.3 | 31424454415615.2 | 40399432286582.7 | 46424663445991.51 | 60089731263204.2 | 3161962282989.89 |
| 9.65397860404795e-07 | 13564746188447 | 20800916300864.2 | 23860000970719 | 31313376894216.4 | 40243008445480.1 | 46236547607188.3 | 59826958640884.3 | 3135190121456.56 |
| 9.67041011516641e-07 | 13533124963986.9 | 20739246436576.7 | 23784560628742.6 | 31202479194265.8 | 40086946076782.8 | 46048931564682.4 | 59565037408825.6 | 3108644638349.16 |
| 9.6868695934649e-07 | 13501451140387 | 20677593268363.6 | 23709178204318.4 | 31091762643480.3 | 39931246202382.1 | 45861815992243.9 | 59303967098632.6 | 3082323914393.87 |
| 9.70335708654484e-07 | 13469725691541.9 | 20615958084306.6 | 23633855041878.3 | 30981228555445.7 | 39775909826397.51 | 45675201544277.9 | 59043747221351.2 | 3056226046567.26 |
| 9.71987264208865e-07 | 13437949588244.2 | 20554342164468.9 | 23558592475890.1 | 30870878229661.7 | 39620937935267.51 | 45489088855946 | 58784377267650.4 | 3030349147958.68 |
| 9.73641630785994e-07 | 13406123798154.1 | 20492746780888.2 | 23483391830864 | 30760712951585.5 | 39466331497841.4 | 45303478543287.9 | 58525856708002.8 | 3004691347633.87 |
| 9.75298813170358e-07 | 13374249285769.5 | 20431173197569.7 | 23408254421360.1 | 30650733992677.2 | 39312091465470.49 | 45118371203342.7 | 58268184992866.2 | 2979250790499.65 |
| 9.7695881615459e-07 | 13342327012396.7 | 20369622670480.6 | 23333181551995.8 | 30540942610444.5 | 39158218772100.1 | 44933767414271 | 58011361552862.4 | 2954025637169.81 |
| 9.78621644539479e-07 | 13310357936121.1 | 20308096447544.4 | 23258174517454.1 | 30431340048489.1 | 39004714334361.51 | 44749667735475.7 | 57755385798957.7 | 2929014063832.16 |
| 9.80287303133986e-07 | 13278343011778.4 | 20246595768636.3 | 23183234602492.8 | 30321927536551.8 | 38851579051663.9 | 44566072707724 | 57500257122640.3 | 2904214262116.57 |
| 9.81955796755256e-07 | 13246283190926.7 | 20185121865578.5 | 23108363081953.5 | 30212706290560.1 | 38698813806287 | 44382982853268.1 | 57245974896099.8 | 2879624438964.32 |
| 9.83627130228634e-07 | 13214179421818.5 | 20123675962136.5 | 23033561220771.3 | 30103677512674 | 38546419463473 | 44200398675967.2 | 56992538472403.51 | 2855242816498.41 |
| 9.85301308387677e-07 | 13182032649373.2 | 20062259274015.6 | 22958830273985.7 | 29994842391334.3 | 38394396871519.2 | 44018320661407.8 | 56739947185674 | 2831067631895.04 |
| 9.86978336074171e-07 | 13149843815149.8 | 20000873008858.6 | 22884171486751 | 29886202101309.6 | 38242746861871 | 43836749277025.6 | 56488200351265.1 | 2807097137256.12 |
| 9.8865821813814e-07 | 13117613857321 | 19939518366242.8 | 22809586094347.8 | 29777757803744.4 | 38091470249214.4 | 43655684972226 | 56237297265937.4 | 2783329599482.93 |
| 9.90340959437865e-07 | 13085343710646.2 | 19878196537678.5 | 22735075322194.8 | 29669510646208 | 37940567831568.6 | 43475128178505.1 | 55987237208033.2 | 2759763300150.79 |
| 9.92026564839896e-07 | 13053034306446.4 | 19816908706608 | 22660640385861.3 | 29561461762742.8 | 37790040390379.7 | 43295079309570.6 | 55738019437651.1 | 2736396535384.85 |
| 9.93715039219065e-07 | 13020686572578 | 19755656048404.3 | 22586282491080 | 29453612273913.8 | 37639888690613.2 | 43115538761462.2 | 55489643196819.3 | 2713227615736.86 |
| 9.954063874585e-07 | 12988301433408.6 | 19694439730371 | 22512002833760.1 | 29345963286857.8 | 37490113480847.4 | 42936506912672.4 | 55242107709668.7 | 2690254866063.03 |
| 9.97100614449645e-07 | 12955879809791.9 | 19633260911742.7 | 22437802600001.3 | 29238515895333.6 | 37340715493366.7 | 42757984124266.7 | 54995412182605.2 | 2667476625402.94 |
| 9.98797725092265e-07 | 12923422619043.6 | 19572120743685.1 | 22363682966108.1 | 29131271179771.9 | 37191695444255 | 42579970740004 | 54749555804481.6 | 2644891246859.41 |
| 1.00049772429447e-06 | 12890930774917.6 | 19511020369296.8 | 22289645098604.2 | 29024230207326.2 | 37043054033488.7 | 42402467086456.6 | 54504537746768.2 | 2622497097479.47 |
| 1.00220061697271e-06 | 12858405187582.8 | 19449960923610.6 | 22215690154248.1 | 28917394031923.1 | 36894791945030.8 | 42225473473130.4 | 54260357163723.8 | 2600292558136.25 |
| 1.00390640805182e-06 | 12825846763599.8 | 19388943533595.4 | 22141819280048.5 | 28810763694314 | 36746909846924.1 | 42048990192584.49 | 54017013192564.3 | 2578276023411.96 |
| 1.00561510246501e-06 | 12793256405898.4 | 19327969318159.2 | 22068033613280.3 | 28704340222126.6 | 36599408391384.7 | 41873017520550.8 | 53774504953632.8 | 2556445901481.78 |
| 1.00732670515389e-06 | 12760635013755.6 | 19267039388151.8 | 21994334281501.4 | 28598124629916.3 | 36452288214895.9 | 41697555716053.8 | 53532831550567.4 | 2534800613998.78 |
| 1.00904122106847e-06 | 12727983482773.3 | 19206154846368.5 | 21920722402569.2 | 28492117919218.4 | 36305549938301.4 | 41522605021529.7 | 53291992070468.49 | 2513338595979.84 |
| 1.01075865516719e-06 | 12695302704857.5 | 19145316787553.8 | 21847199084658.6 | 28386321078601.1 | 36159194166899.8 | 41348165662945.51 | 53051985584066.4 | 2492058295692.41 |
| 1.01247901241695e-06 | 12662593568196.6 | 19084526298405.9 | 21773765426279.3 | 28280735083717.2 | 36013221490537.4 | 41174237849918 | 52812811145887.1 | 2470958174542.43 |
| 1.01420229779307e-06 | 12629856957241.4 | 19023784457581.9 | 21700422516294.5 | 28175360897357.9 | 35867632483702.6 | 41000821775832.4 | 52574467794417.9 | 2450036706963 |
| 1.01592851627936e-06 | 12597093752684.2 | 18963092335702.3 | 21627171433939 | 28070199469505.9 | 35722427705619.3 | 40827917617961.6 | 52336954552272.49 | 2429292380304.11 |
| 1.01765767286811e-06 | 12564304831439.5 | 18902450995357.5 | 21554013248838.8 | 27965251737388.3 | 35577607700340.9 | 40655525537583.4 | 52100270426354.8 | 2408723694723.31 |
| 1.01938977256009e-06 | 12531491066624.1 | 18841861491113.4 | 21480949021030.3 | 27860518625531.3 | 35433172996843.8 | 40483645680099.51 | 51864414408022.4 | 2388329163077.18 |
| 1.02112482036462e-06 | 12498653327538.2 | 18781324869518.5 | 21407979800980.5 | 27756001045813.7 | 35289124109121.5 | 40312278175153.2 | 51629385473249.7 | 2368107310813.9 |
| 1.0228628212995e-06 | 12465792479646.6 | 18720842169110.4 | 21335106629606.6 | 27651699897521 | 35145461536277.6 | 40141423136746.9 | 51395182582789.51 | 2348056675866.6 |
| 1.0246037803911e-06 | 12432909384560.3 | 18660414420423.4 | 21262330538297.5 | 27547616067400.6 | 35002185762620.6 | 39971080663359.9 | 51161804682334.49 | 2328175808547.62 |
| 1.02634770267434e-06 | 12400004900018.8 | 18600042645996.7 | 21189652548934.4 | 27443750429716 | 34859297257756.5 | 39801250838065.6 | 50929250702678 | 2308463271443.77 |
| 1.0280945931927e-06 | 12367079879872 | 18539727860382 | 21117073673912.3 | 27340103846302.1 | 34716796476683.5 | 39631933728648.3 | 50697519559873.51 | 2288917639312.31 |
| 1.02984445699826e-06 | 12334135174063.5 | 18479471070152.9 | 21044594916161.9 | 27236677166620.3 | 34574683859884.5 | 39463129387720.2 | 50466610155394 | 2269537498978 |
| 1.03159729915169e-06 | 12301171628613.3 | 18419273273913.4 | 20972217269171.8 | 27133471227814.1 | 34432959833421.5 | 39294837852838.1 | 50236521376290.7 | 2250321449230.83 |
| 1.03335312472227e-06 | 12268190085601.9 | 18359135462307.7 | 20899941717010.9 | 27030486854764.7 | 34291624809029 | 39127059146618.9 | 50007252095350.4 | 2231268100724.79 |
| 1.0351119387879e-06 | 12235191383153.5 | 18299058618029.9 | 20827769234351.7 | 26927724860146.8 | 34150679184207.2 | 38959793276856.8 | 49778801171252.4 | 2212376075877.4 |
| 1.03687374643516e-06 | 12202176355420.6 | 18239043715834.3 | 20755700786493.2 | 26825186044484.8 | 34010123342315.5 | 38793040236638.1 | 49551167448725.2 | 2193644008770.05 |
| 1.03863855275924e-06 | 12169145832569 | 18179091722546.1 | 20683737329384.7 | 26722871196209.1 | 33869957652666 | 38626800004457.3 | 49324349758701.6 | 2175070545049.32 |
| 1.04040636286404e-06 | 12136100640762 | 18119203597072.6 | 20611879809649.7 | 26620781091712.6 | 33730182470616.6 | 38461072544331.8 | 49098346918473.7 | 2156654341829.03 |
| 1.04217718186212e-06 | 12103041602146.3 | 18059380290414.3 | 20540129164610.6 | 26518916495407.2 | 33590798137664.4 | 38295857805917.51 | 48873157731847 | 2138394067593.11 |
| 1.04395101487476e-06 | 12069969534837.6 | 17999622745676.8 | 20468486322312.7 | 26417278159780.9 | 33451804981538.6 | 38131155724623 | 48648780989293.6 | 2120288402099.41 |
| 1.04572786703195e-06 | 12036885252906.6 | 17939931898083 | 20396952201550 | 26315866825454.6 | 33313203316293.6 | 37966966221724 | 48425215468104.8 | 2102336036284.16 |
| 1.0475077434724e-06 | 12003789566365.6 | 17880308674985.6 | 20325527711889.8 | 26214683221239.4 | 33174993442402.1 | 37803289204477.8 | 48202459932543 | 2084535672167.38 |
| 1.0492906493436e-06 | 11970683281154.8 | 17820753995880.2 | 20254213753698.9 | 26113728064194.1 | 33037175646847.7 | 37640124566236.8 | 47980513133992.7 | 2066886022759.01 |
| 1.05107658980176e-06 | 11937567199130.2 | 17761268772418.2 | 20183011218169.2 | 26013002059682.5 | 32899750203217.8 | 37477472186561.8 | 47759373811111.1 | 2049385811965.86 |
| 1.05286557001189e-06 | 11904442118050.3 | 17701853908420.6 | 20111920987344.4 | 25912505901431.2 | 32762717371796.1 | 37315331931336 | 47539040689977.51 | 2032033774499.37 |
| 1.0546575951478e-06 | 11871308831564.5 | 17642510299891.8 | 20040943934146.2 | 25812240271587.4 | 32626077399655.4 | 37153703652877.1 | 47319512484242.1 | 2014828655784.09 |
| 1.05645267039206e-06 | 11838168129201 | 17583238835034.4 | 19970080922401.3 | 25712205840776.8 | 32489830520749.6 | 36992587190050.3 | 47100787895274.4 | 1997769211867 |
| 1.05825080093612e-06 | 11805020796355.5 | 17524040394263 | 19899332806869 | 25612403268161.8 | 32353976956006.3 | 36831982368380.49 | 46882865612310.3 | 1980854209327.55 |
| 1.06005199198024e-06 | 11771867614279.7 | 17464915850220.1 | 19828700433268.1 | 25512833201499.8 | 32218516913419 | 36671889000164.3 | 46665744312598.8 | 1964082425188.5 |
| 1.06185624873352e-06 | 11738709360071 | 17405866067790.6 | 19758184638305.1 | 25413496277201.6 | 32083450588138.7 | 36512306884581.6 | 46449422661547.8 | 1947452646827.51 |
| 1.06366357641394e-06 | 11705546806661.7 | 17346891904118.1 | 19687786249702.2 | 25314393120389.5 | 31948778162566.3 | 36353235807807.1 | 46233899312869.6 | 1930963671889.43 |
| 1.06547398024836e-06 | 11672380722809.1 | 17287994208620.4 | 19617506086225.7 | 25215524344956.4 | 31814499806444.1 | 36194675543121 | 46019172908724.7 | 1914614308199.38 |
| 1.06728746547252e-06 | 11639211873085.4 | 17229173823006 | 19547344957714.5 | 25116890553624.3 | 31680615676947.2 | 36036625851020.1 | 45805242079865.6 | 1898403373676.57 |
| 1.06910403733111e-06 | 11606041017868.8 | 17170431581291 | 19477303665109.2 | 25018492338003.3 | 31547125918775.6 | 35879086479327.5 | 45592105445779.9 | 1882329696248.82 |
| 1.07092370107771e-06 | 11572868913333.7 | 17111768309815.2 | 19407383000481.3 | 24920330278650.1 | 31414030664244.7 | 35722057163303.2 | 45379761614831.9 | 1866392113767.82 |
| 1.07274646197485e-06 | 11539696311442.4 | 17053184827260.4 | 19337583747062.3 | 24822404945127.6 | 31281330033377 | 35565537625753.4 | 45168209184404.49 | 1850589473925.11 |
| 1.07457232529402e-06 | 11506523959936.6 | 16994681944666.9 | 19267906679273.9 | 24724716896063.7 | 31149024133993.1 | 35409527577140.1 | 44957446741039.4 | 1834920634168.75 |
| 1.07640129631569e-06 | 11473352602329 | 16936260465452.3 | 19198352562757.7 | 24627266679210.6 | 31017113061802.1 | 35254026715689.5 | 44747472860576.8 | 1819384461620.75 |
| 1.07823338032932e-06 | 11440182977895.7 | 16877921185428.9 | 19128922154405.4 | 24530054831503.9 | 30885596900492.4 | 35099034727501.3 | 44538286108294.9 | 1803979832995.11 |
| 1.08006858263334e-06 | 11407015821668.6 | 16819664892822.5 | 19059616202389.5 | 24433081879122.6 | 30754475721822.5 | 34944551286656.3 | 44329885039047.9 | 1788705634516.64 |
| 1.08190690853525e-06 | 11373851864428.4 | 16761492368291.1 | 18990435446193.6 | 24336348337547.6 | 30623749585711.1 | 34790576055324.9 | 44122268197403.4 | 1773560761840.43 |
| 1.08374836335153e-06 | 11340691832697.4 | 16703404384943.7 | 18921380616644 | 24239854711622.1 | 30493418540326.8 | 34637108683874.1 | 43915434117779.51 | 1758544119971.99 |
| 1.08559295240775e-06 | 11307536448733.3 | 16645401708360 | 18852452435939.8 | 24143601495610.7 | 30363482622178.6 | 34484148810974.7 | 43709381324580.6 | 1743654623188.09 |
| 1.08744068103853e-06 | 11274386430522.8 | 16587485096609.5 | 18783651617685.8 | 24047589173259.2 | 30233941856205.5 | 34331696063708.5 | 43504108332332.6 | 1728891194958.27 |
| 1.08929155458756e-06 | 11241242491775.7 | 16529655300271.7 | 18714978866922.6 | 23951818217854.3 | 30104796255865.7 | 34179750057674.2 | 43299613645817.7 | 1714252767866.97 |
| 1.09114557840764e-06 | 11208105341919.2 | 16471913062455.9 | 18646434880159.7 | 23856289092283.3 | 29976045823226.4 | 34028310397093.9 | 43095895760207.7 | 1699738283536.4 |
| 1.09300275786068e-06 | 11174975686092.9 | 16414259118822.1 | 18578020345406.8 | 23761002249093.9 | 29847690549052.7 | 33877376674918.4 | 42892953161197.3 | 1685346692550 |
| 1.0948630983177e-06 | 11141854225143.2 | 16356694197601 | 18509735942206.3 | 23665958130554.3 | 29719730412896.5 | 33726948472932.6 | 42690784325135.9 | 1671076954376.54 |
| 1.09672660515887e-06 | 11108741655619.2 | 16299219019615.4 | 18441582341666 | 23571157168712.6 | 29592165383185.1 | 33577025361860.5 | 42489387719159.6 | 1656928037294.93 |
| 1.09859328377353e-06 | 11075638669768.1 | 16241834298301 | 18373560206491.4 | 23476599785457.1 | 29464995417310.2 | 33427606901469.5 | 42288761801321.3 | 1642898918319.6 |
| 1.10046313956018e-06 | 11042545955530.8 | 16184540739728.2 | 18305670191019.1 | 23382286392576.3 | 29338220461715.7 | 33278692640674.6 | 42088905020721 | 1628988583126.55 |
| 1.10233617792652e-06 | 11009464196538.4 | 16127339042623.4 | 18237912941249.2 | 23288217391818.3 | 29211840451986 | 33130282117642.4 | 41889815817634.9 | 1615196025979.98 |
| 1.10421240428943e-06 | 10976394072108.6 | 16070229898391.1 | 18170289094879.6 | 23194393174951.6 | 29085855312933.7 | 32982374859894 | 41691492623643.3 | 1601520249659.64 |
| 1.10609182407503e-06 | 10943336257242.6 | 16013213991136 | 18102799281338.2 | 23100814123824.5 | 28960264958687.5 | 32834970384408.1 | 41493933861759.1 | 1587960265388.65 |
| 1.10797444271867e-06 | 10910291422621.6 | 15956291997685.2 | 18035444121817.8 | 23007480610425.3 | 28835069292779.3 | 32688068197723.7 | 41297137946553.8 | 1574515092762.08 |
| 1.10986026566496e-06 | 10877260234605 | 15899464587611.3 | 17968224229308.9 | 22914392996942.6 | 28710268208231.4 | 32541667796042.1 | 41101103284284.1 | 1561183759676.02 |
| 1.11174929836777e-06 | 10844243355227.1 | 15842732423254.6 | 17901140208634.5 | 22821551635824.7 | 28585861587643.7 | 32395768665328.7 | 40905828273017 | 1547965302257.32 |
| 1.11364154629024e-06 | 10811241442195.9 | 15786096159746.6 | 17834192656483.9 | 22728956869840.5 | 28461849303280.1 | 32250370281414.1 | 40711311302754.6 | 1534858764793.86 |
| 1.11553701490482e-06 | 10778255148890.6 | 15729556445033.2 | 17767382161446.8 | 22636609032138.7 | 28338231217154.8 | 32105472110095.5 | 40517550755557.7 | 1521863199665.54 |
| 1.11743570969329e-06 | 10745285124360.1 | 15673113919898.2 | 17700709304048.6 | 22544508446308.3 | 28215007181119.2 | 31961073607236.6 | 40324545005669 | 1508977667275.64 |
| 1.11933763614673e-06 | 10712332013322.4 | 15616769217986.8 | 17634174656784.2 | 22452655426438.6 | 28092177036946.9 | 31817174218868.4 | 40132292419635.3 | 1496201235983.02 |
| 1.12124279976558e-06 | 10679396456162.6 | 15560522965830 | 17567778784153.4 | 22361050277179 | 27969740616420.1 | 31673773381288.3 | 39940791356428.9 | 1483532982034.64 |
| 1.12315120605966e-06 | 10646479088933.2 | 15504375782868.1 | 17501522242695.7 | 22269693293799.1 | 27847697741414.8 | 31530870521159.6 | 39750040167568.7 | 1470971989498.86 |
| 1.12506286054814e-06 | 10613580543352.7 | 15448328281475.7 | 17435405581025.3 | 22178584762248.8 | 27726048223986 | 31388465055610.5 | 39560037197240.1 | 1458517350199.17 |
| 1.12697776875959e-06 | 10580701446806.1 | 15392381066985.8 | 17369429339866.7 | 22087724959218 | 27604791866452.4 | 31246556392332.2 | 39370780782414.2 | 1446168163648.54 |
| 1.128895936232e-06 | 10547842422344.7 | 15336534737714.6 | 17303594052089.8 | 21997114152196.4 | 27483928461481.7 | 31105143929677.3 | 39182269252966.2 | 1433923536984.31 |
| 1.13081736851278e-06 | 10515004088686.3 | 15280789884986.7 | 17237900242745.5 | 21906752599533.9 | 27363457792174.1 | 30964227056757.2 | 38994500931793.3 | 1421782584903.67 |
| 1.13274207115878e-06 | 10482187060216.1 | 15225147093159.6 | 17172348429101.7 | 21816640550499.8 | 27243379632147.2 | 30823805153539.2 | 38807474134931.8 | 1409744429599.57 |
| 1.13467004973632e-06 | 10449391946987.2 | 15169606939649.9 | 17106939120678.7 | 21726778245343 | 27123693745619.6 | 30683877590943.3 | 38621187171673.1 | 1397808200697.35 |
| 1.13660130982117e-06 | 10416619354722 | 15114169994958.1 | 17041672819285.3 | 21637165915351.9 | 27004399887494.3 | 30544443730938.6 | 38435638344679.6 | 1385973035191.74 |
| 1.13853585699862e-06 | 10383869884813.4 | 15058836822694.2 | 16976550019054.9 | 21547803782913.4 | 26885497803442.3 | 30405502926639.2 | 38250825950098.6 | 1374238077384.49 |
| 1.14047369686344e-06 | 10351144134326.3 | 15003607979604.1 | 16911571206481.9 | 21458692061573.3 | 26766987229985.2 | 30267054522399.6 | 38066748277677.51 | 1362602478822.51 |
| 1.14241483501993e-06 | 10318442695999.8 | 14948484015595.4 | 16846736860457.4 | 21369830956095.4 | 26648867894578.5 | 30129097853909.5 | 37883403610875.8 | 1351065398236.51 |
| 1.14435927708195e-06 | 10285766158248.8 | 14893465473763.2 | 16782047452306.3 | 21281220662521.6 | 26531139515693.9 | 29991632248288.8 | 37700790226978.49 | 1339626001480.17 |
| 1.14630702867289e-06 | 10253115105166.7 | 14838552890416.8 | 16717503445823.2 | 21192861368230.5 | 26413801802901.1 | 29854657024181.5 | 37518906397207.7 | 1328283461469.87 |
| 1.14825809542571e-06 | 10220490116528 | 14783746795106.3 | 16653105297309.6 | 21104753251997.7 | 26296854456950.2 | 29718171491849.5 | 37337750386832.9 | 1317036958124.83 |
| 1.15021248298297e-06 | 10187891767790.7 | 14729047710649.1 | 16588853455610.2 | 21016896484054.8 | 26180297169853 | 29582174953265.8 | 37157320455282.3 | 1305885678307.88 |
| 1.15217019699684e-06 | 10155320630099.7 | 14674456153156.5 | 16524748362149.9 | 20929291226148.4 | 26064129624964.5 | 29446666702207.5 | 36977614856251.6 | 1294828815766.6 |
| 1.15413124312909e-06 | 10122777270290.2 | 14619972632061.2 | 16460790450970.7 | 20841937631600 | 25948351497063.6 | 29311646024348 | 36798631837812.8 | 1283865571075.1 |
| 1.15609562705115e-06 | 10090262250890.8 | 14565597650144 | 16396980148768.6 | 20754835845364 | 25832962452434.3 | 29177112197349.2 | 36620369642522.7 | 1272995151576.16 |
| 1.15806335444407e-06 | 10057776130127.6 | 14511331703561.1 | 16333317874931.1 | 20667986004088.1 | 25717962148945.8 | 29043064490952.6 | 36442826507529.7 | 1262216771323.97 |
| 1.16003443099861e-06 | 10025319461927.8 | 14457175281871.7 | 16269804041573.6 | 20581388236171.4 | 25603350236132.8 | 28909502167071 | 36266000664680.6 | 1251529651027.27 |
| 1.16200886241518e-06 | 9992892795924.26 | 14403128868065.7 | 16206439053577.6 | 20495042661823.5 | 25489126355274.9 | 28776424479878.6 | 36089890340626.49 | 1240933017992.99 |
| 1.16398665440392e-06 | 9960496677459.84 | 14349192938590.7 | 16143223308627.4 | 20408949393123.2 | 25375290139476.8 | 28643830675901.5 | 35914493756927.5 | 1230426106070.46 |
| 1.16596781268466e-06 | 9928131647591.85 | 14295367963380.6 | 16080157197247.6 | 20323108534077.4 | 25261841213747 | 28511719994107.1 | 35739809130157.4 | 1220008155595.92 |
| 1.16795234298701e-06 | 9895798243097.02 | 14241654405883.1 | 16017241102840.7 | 20237520180679.6 | 25148779195077 | 28380091665993.8 | 35565834672007.3 | 1209678413337.67 |
| 1.16994025105028e-06 | 9863496996476.57 | 14188052723088 | 15954475401724.9 | 20152184420968.2 | 25036103692519.6 | 28248944915679.5 | 35392568589388.2 | 1199436132441.56 |
| 1.17193154262358e-06 | 9831228435961.5 | 14134563365555 | 15891860463171.3 | 20067101335085.4 | 24923814307267.4 | 28118278959990.5 | 35220009084533.7 | 1189280572377.05 |
| 1.1739262234658e-06 | 9798993085518.01 | 14081186777442.7 | 15829396649441.5 | 19982270995335 | 24811910632730.8 | 27988093008548.5 | 35048154355100.8 | 1179210998883.58 |
| 1.17592429934563e-06 | 9766791464853.26 | 14027923396536.4 | 15767084315826 | 19897693466241 | 24700392254615.6 | 27858386263859.2 | 34877002594270.9 | 1169226683917.58 |
| 1.17792577604157e-06 | 9734624089421.31 | 13974773654276.9 | 15704923810681.4 | 19813368804605.4 | 24589258751000.2 | 27729157921398.7 | 34706551990850 | 1159326905599.75 |
| 1.17993065934198e-06 | 9702491470429.08 | 13921737975789.4 | 15642915475468.3 | 19729297059566.3 | 24478509692412.8 | 27600407169699.9 | 34536800729367.6 | 1149510948162.93 |
| 1.18193895504504e-06 | 9670394114842.85 | 13868816779911.7 | 15581059644789.6 | 19645478272655.8 | 24368144641908.2 | 27472133190439.5 | 34367746990175.2 | 1139778101900.31 |
| 1.18395066895883e-06 | 9638332525394.65 | 13816010479223.7 | 15519356646428.1 | 19561912477857.7 | 24258163155143.9 | 27344335158522.7 | 34199388949544.7 | 1130127663114.12 |
| 1.18596580690129e-06 | 9606307200588.96 | 13763319480075.9 | 15457806801384.4 | 19478599701665.1 | 24148564780456.4 | 27217012242169.2 | 34031724779764.8 | 1120558934064.78 |
| 1.18798437470027e-06 | 9574318634709.72 | 13710744182618.8 | 15396410423915.2 | 19395539963138.1 | 24039349058936.7 | 27090163602997.4 | 33864752649237.9 | 1111071222920.41 |
| 1.19000637819356e-06 | 9542367317827.31 | 13658284980831.8 | 15335167821571.5 | 19312733273960.8 | 23930515524506.1 | 26963788396109.2 | 33698470722575.4 | 1101663843706.84 |
| 1.19203182322884e-06 | 9510453735805.9 | 13605942262552.8 | 15274079295236.2 | 19230179638499.2 | 23822063703990.9 | 26837885770173.6 | 33532877160693.1 | 1092336116258.03 |
| 1.19406071566379e-06 | 9478578370310.89 | 13553716409507.2 | 15213145139162.7 | 19147879053857.6 | 23713993117197.3 | 26712454867510.1 | 33367970120904.9 | 1083087366166.84 |
| 1.19609306136604e-06 | 9446741698816.61 | 13501607797337.7 | 15152365641012.6 | 19065831509936 | 23606303276986 | 26587494824171.8 | 33203747757016.8 | 1073916924736.3 |
| 1.19812886621321e-06 | 9414944194614.12 | 13449616795633.4 | 15091741081894.6 | 18984036989487.2 | 23498993689346 | 26463004770027.9 | 33040208219419.8 | 1064824128931.27 |
| 1.20016813609291e-06 | 9383186326819.3 | 13397743767960 | 15031271736402 | 18902495468172.9 | 23392063853468.6 | 26338983828845.5 | 32877349655181.5 | 1055808321330.5 |
| 1.2022108769028e-06 | 9351468560380.97 | 13345989071888.9 | 14970957872651.3 | 18821206914621 | 23285513261820.7 | 26215431118371.7 | 32715170208138.2 | 1046868850079.07 |
| 1.20425709455054e-06 | 9319791356089.36 | 13294353059027.3 | 14910799752320.4 | 18740171290481.3 | 23179341400218.1 | 26092345750414.1 | 32553668018985.1 | 1038005068841.29 |
| 1.20630679495389e-06 | 9288155170584.62 | 13242836075048.1 | 14850797630686.9 | 18659388550482.7 | 23073547747898.1 | 25969726830922.1 | 32392841225366.8 | 1029216336753.96 |
| 1.20835998404064e-06 | 9256560456365.54 | 13191438459719.7 | 14790951756666.4 | 18578858642488.6 | 22968131777591.8 | 25847573460066.5 | 32232687961966.3 | 1020502018380.03 |
| 1.21041666774869e-06 | 9225007661798.51 | 13140160546935.7 | 14731262372850.6 | 18498581507553.3 | 22863092955596.7 | 25725884732319.9 | 32073206360593.8 | 1011861483662.67 |
| 1.21247685202606e-06 | 9193497231126.55 | 13089002664745.7 | 14671729715545.8 | 18418557079977.9 | 22758430741847.7 | 25604659736535.5 | 31914394550274.8 | 1003294107879.7 |
| 1.21454054283086e-06 | 9162029604478.53 | 13037965135384.5 | 14612354014811.3 | 18338785287365.7 | 22654144589989.5 | 25483897556026.2 | 31756250657337 | 994799271598.411 |
| 1.21660774613137e-06 | 9130605217878.64 | 12987048275303.2 | 14553135494497.3 | 18259266050678.3 | 22550233947446.5 | 25363597268642.9 | 31598772805497.5 | 986376360630.83 |
| 1.21867846790602e-06 | 9099224503255.9 | 12936252395198.5 | 14494074372283.8 | 18179999284290.6 | 22446698255494.9 | 25243757946852.7 | 31441959115948 | 978024765989.258 |
| 1.2207527141434e-06 | 9067887888453.9 | 12885577800043.9 | 14435170859718.3 | 18100984896046.2 | 22343536949331.7 | 25124378657816 | 31285807707440.7 | 969743883842.269 |
| 1.22283049084232e-06 | 9036595797240.68 | 12835024789119.4 | 14376425162254.6 | 18022222787312.3 | 22240749458146 | 25005458463463.6 | 31130316696372.2 | 961533115471.041 |
| 1.22491180401178e-06 | 9005348649318.79 | 12784593656042 | 14317837479290.9 | 17943712853035.3 | 22138335205187.8 | 24886996420573.6 | 30975484196868 | 953391867226.075 |
| 1.22699665967101e-06 | 8974146860335.46 | 12734284688796.6 | 14259408004207.8 | 17865454981794.7 | 22036293607838 | 24768991580847.1 | 30821308320865.3 | 945319550484.268 |
| 1.22908506384949e-06 | 8942990841892.96 | 12684098169765.7 | 14201136924407.2 | 17787449055858.3 | 21934624077676.9 | 24651442990984 | 30667787178195.6 | 937315581606.356 |
| 1.23117702258697e-06 | 8911881001559.08 | 12634034375760.7 | 14143024421350.1 | 17709694951236.5 | 21833326020553.3 | 24534349692758.4 | 30514918876666.6 | 929379381894.718 |
| 1.23327254193347e-06 | 8880817742877.78 | 12584093578052 | 14085070670594.8 | 17632192537736.7 | 21732398836652.7 | 24417710723093 | 30362701522143.5 | 921510377551.533 |
| 1.2353716279493e-06 | 8849801465380.01 | 12534276042399.9 | 14027275841835.5 | 17554941679017.1 | 21631841920565.3 | 24301525114133.7 | 30211133218629.2 | 913707999637.295 |
| 1.23747428670509e-06 | 8818832564594.57 | 12484582029084.9 | 13969640098940.1 | 17477942232640.9 | 21531654661353.5 | 24185791893323.2 | 30060212068344.4 | 905971684029.68 |
| 1.23958052428183e-06 | 8787911432059.24 | 12435011792938.8 | 13912163599988.8 | 17401194050130.1 | 21431836442619.6 | 24070510083474.5 | 29909936171807 | 898300871382.751 |
| 1.24169034677081e-06 | 8757038455332 | 12385565583375 | 13854846497311.8 | 17324696977018.9 | 21332386642572.1 | 23955678702843.8 | 29760303627910 | 890695007086.529 |
| 1.24380376027372e-06 | 8726214018002.29 | 12336243644419.6 | 13797688937527.7 | 17248450852907.4 | 21233304634093 | 23841296765203 | 29611312534000.1 | 883153541226.884 |
| 1.24592077090264e-06 | 8695438499702.63 | 12287046214741.9 | 13740691061581.6 | 17172455511514.5 | 21134589784803.6 | 23727363279911.4 | 29462960985954.5 | 875675928545.779 |
| 1.24804138478003e-06 | 8664712276120.12 | 12237973527685.3 | 13683853004783 | 17096710780731.3 | 21036241457130.6 | 23613877251988 | 29315247078257.5 | 868261628401.848 |
| 1.2501656080388e-06 | 8634035719008.27 | 12189025811298.3 | 13627174896843.8 | 17021216482673.8 | 20938259008371.5 | 23500837682181.9 | 29168168904076.6 | 860910104731.304 |
| 1.25229344682226e-06 | 8603409196198.79 | 12140203288365 | 13570656861916.8 | 16945972433735.6 | 20840641790760.1 | 23388243567043.1 | 29021724555337.9 | 853620826009.183 |
| 1.25442490728421e-06 | 8572833071613.69 | 12091506176436 | 13514299018633 | 16870978444640.5 | 20743389151530.9 | 23276093898993 | 28875912122800.1 | 846393265210.916 |
| 1.25655999558891e-06 | 8542307705277.36 | 12042934687859.5 | 13458101480139.6 | 16796234320494.7 | 20646500432984.2 | 23164387666393.9 | 28730729696129.4 | 839226899774.222 |
| 1.25869871791111e-06 | 8511833453328.8 | 11994489029812.1 | 13402064354138.4 | 16721739860839.2 | 20549974972549.5 | 23053123853618.2 | 28586175363972.1 | 832121211561.322 |
| 1.26084108043608e-06 | 8481410668034.06 | 11946169404329.6 | 13346187742923 | 16647494859701.5 | 20453812102850.2 | 22942301441117.8 | 28442247214027.7 | 825075686821.486 |
| 1.2629870893596e-06 | 8451039697798.68 | 11897976008337.7 | 13290471743417 | 16573499105647.6 | 20358011151766.3 | 22831919405491.8 | 28298943333121.2 | 818089816153.882 |
| 1.26513675088802e-06 | 8420720887180.31 | 11849909033683.6 | 13234916447211.2 | 16499752381833.3 | 20262571442497.8 | 22721976719554.8 | 28156261807274 | 811163094470.746 |
| 1.26729007123823e-06 | 8390454576901.43 | 11801968667166.1 | 13179521940602.1 | 16426254466055.8 | 20167492293627.4 | 22612472352404.5 | 28014200721775 | 804295020960.863 |
| 1.26944705663771e-06 | 8360241103862.24 | 11754155090567 | 13124288304628.7 | 16353005130805.1 | 20072773019183.2 | 22503405269488.5 | 27872758161251 | 797485099053.364 |
| 1.27160771332455e-06 | 8330080801153.54 | 11706468480681.8 | 13069215615110.5 | 16280004143314.3 | 19978412928700.2 | 22394774432671.3 | 27731932209736.2 | 790732836381.814 |
| 1.27377204754744e-06 | 8299973998069.82 | 11658909009350.8 | 13014303942684.9 | 16207251265611.3 | 19884411327282.2 | 22286578800299.8 | 27591720950740.7 | 784037744748.619 |
| 1.27594006556572e-06 | 8269921020122.45 | 11611476843489.8 | 12959553352844.8 | 16134746254568.7 | 19790767515663.6 | 22178817327269.9 | 27452122467319.7 | 777399340089.727 |
| 1.27811177364938e-06 | 8239922189052.88 | 11564172145121.3 | 12904963905975.7 | 16062488861954.6 | 19697480790269.7 | 22071488965090.9 | 27313134842140.4 | 770817142439.631 |
| 1.28028717807906e-06 | 8209977822846.13 | 11516995071405.1 | 12850535657393.1 | 15990478834482.7 | 19604550443277.6 | 21964592661951 | 27174756157549.8 | 764290675896.665 |
| 1.28246628514613e-06 | 8180088235744.17 | 11469945774669.1 | 12796268657380 | 15918715913862.3 | 19511975762676.8 | 21858127362781.3 | 27036984495640.7 | 757819468588.595 |
| 1.28464910115265e-06 | 8150253738259.53 | 11423024402440.7 | 12742162951224 | 15847199836848.2 | 19419756032328.6 | 21752092009320 | 26899817938317.7 | 751403052638.505 |
| 1.28683563241138e-06 | 8120474637189 | 11376231097477 | 12688218579254.1 | 15775930335290.2 | 19327890532026.2 | 21646485540175.6 | 26763254567362.9 | 745040964130.968 |
| 1.28902588524587e-06 | 8090751235627.35 | 11329565997796.4 | 12634435576878.2 | 15704907136182.5 | 19236378537553.3 | 21541306890890.2 | 26627292464500.1 | 738732743078.5 |
| 1.2912198659904e-06 | 8061083832981.29 | 11283029236708.6 | 12580813974619.9 | 15634129961713.1 | 19145219320743.7 | 21436554994002.2 | 26491929711459.1 | 732477933388.311 |
| 1.29341758099005e-06 | 8031472724983.32 | 11236620942846 | 12527353798155.4 | 15563598529312.6 | 19054412149539.4 | 21332228779108.2 | 26357164390039.3 | 726276082829.319 |
| 1.29561903660068e-06 | 8001918203705.83 | 11190341240194.4 | 12474055068350.4 | 15493312551703.1 | 18963956288048.6 | 21228327172924.9 | 26222994582172.5 | 720126742999.46 |
| 1.297824239189e-06 | 7972420557575.27 | 11144190248123.4 | 12420917801296.7 | 15423271736946.6 | 18873850996604.2 | 21124849099350.6 | 26089418369985 | 714029469293.265 |
| 1.30003319513252e-06 | 7942980071386.34 | 11098168081417.7 | 12367942008349.2 | 15353475788493.7 | 18784095531820.6 | 21021793479525.5 | 25956433835859.8 | 707983820869.716 |
| 1.30224591081963e-06 | 7913597026316.31 | 11052274850307.5 | 12315127696162.2 | 15283924405231.6 | 18694689146651 | 20919159231893 | 25824039062497.5 | 701989360620.371 |
| 1.30446239264958e-06 | 7884271699939.4 | 11006510660499 | 12262474866726.1 | 15214617281532.1 | 18605631090444.3 | 20816945272258.9 | 25692232132976.7 | 696045655137.761 |
| 1.30668264703252e-06 | 7855004366241.3 | 10960875613205.6 | 12209983517403.8 | 15145554107299.1 | 18516920609001.7 | 20715150513851.5 | 25561011130814.3 | 690152274684.057 |
| 1.3089066803895e-06 | 7825795295633.7 | 10915369805178 | 12157653640967.1 | 15076734568016.5 | 18428556944632.1 | 20613773867380.4 | 25430374140024.6 | 684308793159.994 |
| 1.31113449915252e-06 | 7796644754968.91 | 10869993328735.2 | 12105485225632.9 | 15008158344795.6 | 18340539336208.6 | 20512814241095.5 | 25300319245178.4 | 678514788074.065 |
| 1.3133661097645e-06 | 7767553007554.63 | 10824746271794.6 | 12053478255099.4 | 14939825114421.6 | 18252867019223.4 | 20412270540845 | 25170844531461.1 | 672769840511.978 |
| 1.31560151867934e-06 | 7738520313168.65 | 10779628717903.2 | 12001632708582.2 | 14871734549401.2 | 18165539225842.9 | 20312141670133.7 | 25041948084730.3 | 667073535106.364 |
| 1.31784073236194e-06 | 7709546928073.83 | 10734640746267.4 | 11949948560850.5 | 14803886318009 | 18078555184962.4 | 20212426530179.7 | 24913627991573.3 | 661425460006.748 |
| 1.32008375728817e-06 | 7680633105032.89 | 10689782431783.8 | 11898425782262.8 | 14736280084333.7 | 17991914122260.5 | 20113124019972.2 | 24785882339363.2 | 655825206849.77 |
| 1.32233059994494e-06 | 7651779093323.57 | 10645053845069.5 | 11847064338802.7 | 14668915508325.1 | 17905615260253.1 | 20014233036327.5 | 24658709216315.1 | 650272370729.66 |
| 1.32458126683022e-06 | 7622985138753.55 | 10600455052492.8 | 11795864192114.8 | 14601792245839.2 | 17819657818346.8 | 19915752473945.5 | 24532106711541.8 | 644766550168.961 |
| 1.326835764453e-06 | 7594251483675.7 | 10555986116203 | 11744825299540.3 | 14534909948684.9 | 17734041012892.3 | 19817681225465.3 | 24406072915108.1 | 639307347089.508 |
| 1.32909409933338e-06 | 7565578367003.23 | 10511647094160.8 | 11693947614152.5 | 14468268264668.9 | 17648764057237.5 | 19720018181520.3 | 24280605918085.6 | 633894366783.639 |
| 1.33135627800255e-06 | 7536966024224.96 | 10467438040168.9 | 11643231084792.2 | 14401866837641.7 | 17563826161779.8 | 19622762230793.6 | 24155703812606.6 | 628527217885.659 |
| 1.33362230700281e-06 | 7508414687420.67 | 10423359003901.9 | 11592675656103.3 | 14335705307542.3 | 17479226534018.6 | 19525912260071.8 | 24031364691916.7 | 623205512343.549 |
| 1.33589219288759e-06 | 7479924585276.45 | 10379410030936.3 | 11542281268567.5 | 14269783310443.4 | 17394964378607.1 | 19429467154299.7 | 23907586650428.2 | 617928865390.901 |
| 1.3381659422215e-06 | 7451495943100.18 | 10335591162780.8 | 11492047858540.3 | 14204100478596 | 17311038897403.6 | 19333425796633.6 | 23784367783771.8 | 612696895519.107 |
| 1.34044356158029e-06 | 7423128982837.01 | 10291902436906.4 | 11441975358285.1 | 14138656440474.2 | 17227449289523.3 | 19237787068494.5 | 23661706188848.4 | 607509224449.767 |
| 1.34272505755093e-06 | 7394823923084.95 | 10248343886776 | 11392063696008.9 | 14073450820819.1 | 17144194751388.5 | 19142549849620.9 | 23539599963880.1 | 602365477107.348 |
| 1.34501043673159e-06 | 7366580979110.42 | 10204915541874.7 | 11342312795896.7 | 14008483240683.2 | 17061274476779.6 | 19047713018121.5 | 23418047208460.9 | 597265281592.058 |
| 1.34729970573166e-06 | 7338400362863.99 | 10161617427739.5 | 11292722578146.3 | 13943753317473.9 | 16978687656885.1 | 18953275450526.8 | 23297046023606.6 | 592208269152.962 |
| 1.3495928711718e-06 | 7310282282996.02 | 10118449565989.2 | 11243292959003.1 | 13879260664997.7 | 16896433480351.4 | 18859236021840.7 | 23176594511804.1 | 587194074161.317 |
| 1.35188993968392e-06 | 7282226944872.5 | 10075411974353.7 | 11194023850794.5 | 13815004893502.9 | 16814511133332.3 | 18765593605592 | 23056690777061 | 582222334084.14 |
| 1.35419091791123e-06 | 7254234550590.77 | 10032504666704.6 | 11144915161964.3 | 13750985609723.5 | 16732919799538.4 | 18672347073884.8 | 22937332924953.1 | 577292689457.994 |
| 1.35649581250825e-06 | 7226305298995.49 | 9989727653083.63 | 11095966797106.9 | 13687202416921.6 | 16651658660285.4 | 18579495297449.3 | 22818519062673.3 | 572404783863.002 |
| 1.3588046301408e-06 | 7198439385694.39 | 9947080939733.32 | 11047178657001.6 | 13623654914930.5 | 16570726894543.2 | 18487037145690.9 | 22700247299078.4 | 567558263897.07 |
| 1.36111737748609e-06 | 7170637003074.38 | 9904564529125.77 | 10998550638646.9 | 13560342700196.9 | 16490123678983.6 | 18394971486740.7 | 22582515744736.1 | 562752779150.344 |
| 1.36343406123266e-06 | 7142898340317.42 | 9862178419992.33 | 10950082635293.8 | 13497265365823.7 | 16409848188028.2 | 18303297187504.1 | 22465322511971.6 | 557987982179.87 |
| 1.36575468808044e-06 | 7115223583416.56 | 9819922607352.94 | 10901774536480.4 | 13434422501611.4 | 16329899593895.9 | 18212013113709.6 | 22348665714913.2 | 553263528484.472 |
| 1.36807926474077e-06 | 7087612915192.06 | 9777797082545.42 | 10853626228065.2 | 13371813694100.6 | 16250277066650 | 18121118129957.3 | 22232543469538 | 548579076479.851 |
| 1.37040779793641e-06 | 7060066515307.46 | 9735801833254.65 | 10805637592260.7 | 13309438526613.1 | 16170979774245.3 | 18030611099766.7 | 22116953893716.6 | 543934287473.881 |
| 1.37274029440156e-06 | 7032584560285.67 | 9693936843541.76 | 10757808507667.1 | 13247296579293.8 | 16092006882573.8 | 17940490885624.3 | 22001895107257.2 | 539328825642.122 |
| 1.37507676088189e-06 | 7005167223525.21 | 9652202093873.19 | 10710138849305.5 | 13185387429151.5 | 16013357555511.6 | 17850756349030.7 | 21887365231950.1 | 534762358003.546 |
| 1.37741720413455e-06 | 6977814675316.39 | 9610597561149.66 | 10662628488651.4 | 13123710650099.8 | 15935030954964.3 | 17761406350547.4 | 21773362391610.7 | 530234554396.452 |
| 1.37976163092819e-06 | 6950527082857.53 | 9569123218735.18 | 10615277293667.4 | 13062265812998.3 | 15857026240912.7 | 17672439749843.4 | 21659884712122.3 | 525745087454.603 |
| 1.38211004804296e-06 | 6923304610271.24 | 9527779036485.82 | 10568085128836.6 | 13001052485692.6 | 15779342571457.5 | 17583855405740.6 | 21546930321479 | 521293632583.553 |
| 1.38446246227059e-06 | 6896147418620.72 | 9486564980778.53 | 10521051855195.5 | 12940070233054.7 | 15701979102864.5 | 17495652176259.9 | 21434497349827 | 516879867937.18 |
| 1.38681888041433e-06 | 6869055665926.06 | 9445481014539.81 | 10474177330366.5 | 12879318617023.4 | 15624934989609.1 | 17407828918666.3 | 21322583929506.5 | 512503474394.416 |
| 1.38917930928904e-06 | 6842029507180.6 | 9404527097274.4 | 10427461408590.8 | 12818797196643.6 | 15548209384419.9 | 17320384489513.6 | 21211188195092.6 | 508164135536.171 |
| 1.39154375572116e-06 | 6815069094367.32 | 9363703185093.73 | 10380903940760.7 | 12758505528106.3 | 15471801438323.2 | 17233317744688.8 | 21100308283435.7 | 503861537622.462 |
| 1.39391222654876e-06 | 6788174576475.19 | 9323009230744.43 | 10334504774452.4 | 12698443164787.7 | 15395710300686 | 17146627539456.4 | 20989942333701.4 | 499595369569.721 |
| 1.39628472862154e-06 | 6761346099515.65 | 9282445183636.72 | 10288263753957.6 | 12638609657288.7 | 15319935119259.4 | 17060312728501.7 | 20880088487410.4 | 495365322928.312 |
| 1.39866126880087e-06 | 6734583806538.97 | 9242010989872.68 | 10242180720316.5 | 12579004553473.3 | 15244475040221.3 | 16974372165974.5 | 20770744888477.3 | 491171091860.221 |
| 1.40104185395978e-06 | 6707887837650.78 | 9201706592274.47 | 10196255511349.1 | 12519627398507.9 | 15169329208218.9 | 16888804705531.7 | 20661909683249.4 | 487012373116.95 |
| 1.40342649098302e-06 | 6681258330028.53 | 9161531930412.48 | 10150487961687.4 | 12460477734899.3 | 15094496766411.1 | 16803609200379.8 | 20553581020544.7 | 482888866017.589 |
| 1.40581518676704e-06 | 6654695417937.92 | 9121486940633.35 | 10104877902807.2 | 12401555102533.3 | 15019976856510.1 | 16718784503317.4 | 20445757051689.6 | 478800272427.078 |
| 1.40820794822005e-06 | 6628199232749.51 | 9081571556087.92 | 10059425163059.7 | 12342859038712.2 | 14945768618822.9 | 16634329466776.6 | 20338435930556.4 | 474746296734.648 |
| 1.41060478226198e-06 | 6601769902955.16 | 9041785706759.16 | 10014129567702.9 | 12284389078193.3 | 14871871192293 | 16550242942864.7 | 20231615813599.7 | 470726645832.451 |
| 1.41300569582458e-06 | 6575407554184.6 | 9002129319489.87 | 9968990938933.25 | 12226144753226.1 | 14798283714540.5 | 16466523783405 | 20125294859893.1 | 466741029094.369 |
| 1.41541069585137e-06 | 6549112309221.98 | 8962602318010.43 | 9924009095916.46 | 12168125593589.4 | 14725005321903.5 | 16383170839977.7 | 20019471231164.7 | 462789158354.996 |
| 1.41781978929771e-06 | 6522884288022.43 | 8923204622966.39 | 9879183854819.01 | 12110331126628.9 | 14652035149477.8 | 16300182963960 | 19914143091833.1 | 458870747888.809 |
| 1.42023298313077e-06 | 6496723607728.61 | 8883936151945.98 | 9834515028839.01 | 12052760877293.9 | 14579372331157.1 | 16217559006566.3 | 19809308609041.9 | 454985514389.507 |
| 1.42265028432961e-06 | 6470630382687.29 | 8844796819507.53 | 9790002428236.95 | 11995414368173.9 | 14507015999672.6 | 16135297818887.4 | 19704965952694.4 | 451133176949.528 |
| 1.42507169988514e-06 | 6444604724465.96 | 8805786537206.83 | 9745645860366.6 | 11938291119535.1 | 14434965286632.3 | 16053398251930 | 19601113295487.8 | 447313457039.739 |
| 1.4274972368002e-06 | 6418646741869.39 | 8766905213624.33 | 9701445129705.41 | 11881390649356.7 | 14363219322559.7 | 15971859156655.5 | 19497748812947 | 443526078489.298 |
| 1.42992690208951e-06 | 6392756540956.25 | 8728152754392.27 | 9657400037885.05 | 11824712473366.6 | 14291777236933.3 | 15890679384018.5 | 19394870683457.6 | 439770767465.684 |
| 1.43236070277977e-06 | 6366934225055.67 | 8689529062221.8 | 9613510383721.78 | 11768256105077.9 | 14220638158223.9 | 15809857785004.8 | 19292477088298.8 | 436047252454.906 |
| 1.43479864590961e-06 | 6341179894783.87 | 8651034036929.89 | 9569775963246.52 | 11712021055823.4 | 14149801213933.7 | 15729393210669.4 | 19190566211676 | 432355264241.862 |
| 1.43724073852966e-06 | 6315493648060.79 | 8612667575466.15 | 9526196569734.93 | 11656006834791.8 | 14079265530633.2 | 15649284512173.7 | 19089136240752.7 | 428694535890.882 |
| 1.43968698770253e-06 | 6289875580126.61 | 8574429571939.68 | 9482771993737.35 | 11600212949062.4 | 14009030233999.2 | 15569530540822.6 | 18988185365681.7 | 425064802726.426 |
| 1.44213740050286e-06 | 6264325783558.45 | 8536319917645.65 | 9439502023108.57 | 11544638903640.2 | 13939094448851.8 | 15490130148101.6 | 18887711779637 | 421465802313.946 |
| 1.44459198401735e-06 | 6238844348286.9 | 8498338501091.94 | 9396386443037.41 | 11489284201490.2 | 13869457299191.2 | 15411082185712.7 | 18787713678843.9 | 417897274440.914 |
| 1.44705074534473e-06 | 6213431361612.64 | 8460485208025.53 | 9353425036076.27 | 11434148343572.3 | 13800117908234.1 | 15332385505610.4 | 18688189262609.4 | 414358961098.007 |
| 1.44951369159584e-06 | 6188086908223.03 | 8422759921458.95 | 9310617582170.47 | 11379230828875 | 13731075398450.2 | 15254038960037.8 | 18589136733352.3 | 410850606460.453 |
| 1.4519808298936e-06 | 6162811070208.72 | 8385162521696.5 | 9267963858687.46 | 11324531154449.9 | 13662328891598.1 | 15176041401561.6 | 18490554296632.9 | 407371956869.533 |
| 1.45445216737307e-06 | 6137603927080.22 | 8347692886360.41 | 9225463640445.92 | 11270048815445.2 | 13593877508760.4 | 15098391683107.4 | 18392440161181.5 | 403922760814.244 |
| 1.45692771118145e-06 | 6112465555784.44 | 8310350890416.95 | 9183116699744.69 | 11215783305139.1 | 13525720370380 | 15021088657993.8 | 18294792538927.5 | 400502768913.112 |
| 1.4594074684781e-06 | 6087396030721.33 | 8273136406202.35 | 9140922806391.59 | 11161734114973.6 | 13457856596294.2 | 14944131179967.3 | 18197609645027.7 | 397111733896.164 |
| 1.46189144643457e-06 | 6062395423760.35 | 8236049303448.7 | 9098881727732.05 | 11107900734587.1 | 13390285305769.9 | 14867518103235.8 | 18100889697894.4 | 393749410587.045 |
| 1.46437965223461e-06 | 6037463804257.12 | 8199089449309.7 | 9056993228677.7 | 11054282651847.5 | 13323005617537.9 | 14791248282502.8 | 18004630919222.1 | 390415555885.299 |
| 1.46687209307421e-06 | 6012601239069.89 | 8162256708386.29 | 9015257071734.68 | 11000879352884.9 | 13256016649827.1 | 14715320573000.1 | 17908831534015.6 | 387109928748.784 |
| 1.46936877616159e-06 | 5987807792576.04 | 8125550942752.24 | 8973673017031.9 | 10947690322124.1 | 13189317520398.3 | 14639733830520.9 | 17813489770616.3 | 383832290176.252 |
| 1.47186970871726e-06 | 5963083526688.69 | 8088972011979.59 | 8932240822349.19 | 10894715042316.6 | 13122907346577.6 | 14564486911452.9 | 17718603860728.4 | 380582403190.064 |
| 1.47437489797401e-06 | 5938428500873.11 | 8052519773163.97 | 8890960243145.2 | 10841952994572.7 | 13056785245290.1 | 14489578672810.1 | 17624172039445.1 | 377360032819.056 |
| 1.47688435117693e-06 | 5913842772163.25 | 8016194080949.88 | 8849831032585.27 | 10789403658393.5 | 12990950333092.2 | 14415007972264.9 | 17530192545274.1 | 374164946081.557 |
| 1.47939807558345e-06 | 5889326395178.2 | 7979994787555.76 | 8808852941569.08 | 10737066511702 | 12925401726204.8 | 14340773668179.8 | 17436663620162.9 | 370996911968.533 |
| 1.48191607846336e-06 | 5864879422138.59 | 7943921742799.1 | 8768025718758.17 | 10684941030875.1 | 12860138540545.7 | 14266874619638.8 | 17343583509523.6 | 367855701426.895 |
| 1.48443836709881e-06 | 5840501902883.16 | 7907974794121.25 | 8727349110603.4 | 10633026690774.2 | 12795159891761.2 | 14193309686478.4 | 17250950462257.1 | 364741087342.933 |
| 1.48696494878436e-06 | 5816193884885.01 | 7872153786612.36 | 8686822861372.11 | 10581322964776.1 | 12730464895258.4 | 14120077729318 | 17158762730777.7 | 361652844525.895 |
| 1.48949583082697e-06 | 5791955413268.11 | 7836458563035.98 | 8646446713175.31 | 10529829324804.3 | 12666052666236.5 | 14047177609590.8 | 17067018571036.5 | 358590749691.708 |
| 1.49203102054604e-06 | 5767786530823.63 | 7800888963853.69 | 8606220405994.61 | 10478545241358.8 | 12601922319718.1 | 13974608189573.1 | 16975716242544.6 | 355554581446.833 |
| 1.49457052527344e-06 | 5743687278026.31 | 7765444827249.59 | 8566143677709.06 | 10427470183546.6 | 12538072970580.2 | 13902368332414.8 | 16884854008396.6 | 352544120272.258 |
| 1.49711435235351e-06 | 5719657693050.8 | 7730125989154.7 | 8526216264121.78 | 10376603619112.1 | 12474503733584.7 | 13830456902168.5 | 16794430135292.8 | 349559148507.626 |
| 1.49966250914308e-06 | 5695697811787.92 | 7694932283271.16 | 8486437898986.6 | 10325945014466.2 | 12411213723409.1 | 13758872763818.4 | 16704442893561.8 | 346599450335.499 |
| 1.50221500301153e-06 | 5671807667861.05 | 7659863541096.48 | 8446808314034.34 | 10275493834716.8 | 12348202054676.3 | 13687614783309.4 | 16614890557182.1 | 343664811765.752 |
| 1.50477184134075e-06 | 5647987292642.28 | 7624919591947.51 | 8407327238999.17 | 10225249543697.5 | 12285467841984.7 | 13616681827575.4 | 16525771403804 | 340755020620.105 |
| 1.50733303152521e-06 | 5624236715268.72 | 7590100262984.41 | 8367994401644.61 | 10175211603997.1 | 12223010199937.5 | 13546072764567.6 | 16437083714770.7 | 337869866516.778 |
| 1.50989858097198e-06 | 5600555962658.69 | 7555405379234.48 | 8328809527789.6 | 10125379476988.8 | 12160828243172.3 | 13475786463282.3 | 16348825775139.1 | 335009140855.281 |
| 1.51246849710072e-06 | 5576945059527.9 | 7520834763615.88 | 8289772341334.23 | 10075752622858.5 | 12098921086389.8 | 13405821793788.4 | 16260995873700.6 | 332172636801.337 |
| 1.51504278734371e-06 | 5553404028405.61 | 7486388236961.22 | 8250882564285.5 | 10026330500633.5 | 12037287844382.9 | 13336177627255 | 16173592303001 | 329360149271.919 |
| 1.51762145914589e-06 | 5529932889650.76 | 7452065618041.05 | 8212139916782.79 | 9977112568211.33 | 11975927632064.9 | 13266852835977.8 | 16086613359360.6 | 326571474920.43 |
| 1.52020451996489e-06 | 5506531661468.09 | 7417866723587.26 | 8173544117123.27 | 9928098282387.14 | 11914839564497.6 | 13197846293406.2 | 16000057342893.6 | 323806412121.995 |
| 1.52279197727101e-06 | 5483200359924.17 | 7383791368316.32 | 8135094881787.16 | 9879287098882.21 | 11854022756919.6 | 13129156874169.7 | 15913922557527.5 | 321064760958.888 |
| 1.52538383854726e-06 | 5459938998963.47 | 7349839364952.46 | 8096791925462.83 | 9830678472371.41 | 11793476324773.7 | 13060783454103.7 | 15828207311021.4 | 318346323206.075 |
| 1.52798011128942e-06 | 5436747590424.37 | 7316010524250.72 | 8058634961071.74 | 9782271856510.78 | 11733199383734.4 | 12992724910275.2 | 15742909914985.5 | 315650902316.88 |
| 1.53058080300598e-06 | 5413626144055.12 | 7282304655019.84 | 8020623699793.28 | 9734066703964.82 | 11673191049735 | 12924980121008.8 | 15658028684898.2 | 312978303408.781 |
| 1.53318592121825e-06 | 5390574667529.77 | 7248721564145.1 | 7982757851089.4 | 9686062466433.6 | 11613450438994.4 | 12857547965911.4 | 15573561940125 | 310328333249.313 |
| 1.53579547346033e-06 | 5367593166464.14 | 7215261056611.05 | 7945037122729.2 | 9638258594679.64 | 11553976668044 | 12790427325897.4 | 15489508003935.3 | 307700800242.099 |
| 1.53840946727913e-06 | 5344681644431.62 | 7181922935524.04 | 7907461220813.23 | 9590654538554.63 | 11494768853753.5 | 12723617083213.1 | 15405865203520.1 | 305095514413.001 |
| 1.54102791023443e-06 | 5321840102979.09 | 7148707002134.73 | 7870029849797.84 | 9543249747025.88 | 11435826113357.6 | 12657116121461.2 | 15322631870008.9 | 302512287396.378 |
| 1.54365080989885e-06 | 5299068541642.66 | 7115613055860.47 | 7832742712519.16 | 9496043668202.58 | 11377147564481.4 | 12590923325624.8 | 15239806338486 | 299950932421.475 |
| 1.54627817385792e-06 | 5276366957963.45 | 7082640894307.49 | 7795599510217.13 | 9449035749361.91 | 11318732325166.1 | 12525037582091.1 | 15157386948007.2 | 297411264298.91 |
| 1.54891000971006e-06 | 5253735347503.38 | 7049790313293.08 | 7758599942559.27 | 9402225436974.89 | 11260579513894.5 | 12459457778674.9 | 15075372041615.4 | 294893099407.293 |
| 1.55154632506665e-06 | 5231173703860.8 | 7017061106867.58 | 7721743707664.36 | 9355612176732.03 | 11202688249615.7 | 12394182804642.1 | 14993759966356.8 | 292396255679.944 |
| 1.55418712755201e-06 | 5208682018686.18 | 6984453067336.32 | 7685030502125.97 | 9309195413568.82 | 11145057651770.2 | 12329211550732.1 | 14912549073295.8 | 289920552591.733 |
| 1.55683242480343e-06 | 5186260281697.73 | 6951965985281.34 | 7648460021035.82 | 9262974591690.99 | 11087686840314.3 | 12264542909180.9 | 14831737717530.4 | 287465811146.025 |
| 1.5594822244712e-06 | 5163908480696.97 | 6919599649583.11 | 7612031958007 | 9216949154599.52 | 11030574935744.5 | 12200175773743.2 | 14751324258206.9 | 285031853861.742 |
| 1.56213653421866e-06 | 5141626601584.27 | 6887353847442.1 | 7575746005197.11 | 9171118545115.58 | 10973721059121.5 | 12136109039714.9 | 14671307058534.3 | 282618504760.526 |
| 1.56479536172215e-06 | 5119414628374.36 | 6855228364400.17 | 7539601853331.16 | 9125482205405.1 | 10917124332094 | 12072341603954.3 | 14591684485798.6 | 280225589354.02 |
| 1.56745871467111e-06 | 5097272543211.8 | 6823222984361.93 | 7503599191724.41 | 9080039577003.31 | 10860783876922.3 | 12008872364904.4 | 14512454911376.7 | 277852934631.249 |
| 1.57012660076804e-06 | 5075200326386.36 | 6791337489615.95 | 7467737708304.98 | 9034790100838.95 | 10804698816501.4 | 11945700222613.6 | 14433616710749.9 | 275500369046.114 |
| 1.57279902772858e-06 | 5053197956348.44 | 6759571660855.84 | 7432017089636.46 | 8989733217258.36 | 10748868274384.7 | 11882824078757.2 | 14355168263517.7 | 273167722504.985 |
| 1.57547600328148e-06 | 5031265409724.37 | 6727925277201.24 | 7396437020940.19 | 8944868366049.33 | 10693291374805.9 | 11820242836657.8 | 14277107953410 | 270854826354.409 |
| 1.57815753516864e-06 | 5009402661331.72 | 6696398116218.66 | 7360997186117.55 | 8900194986464.8 | 10637967242702.4 | 11757955401306 | 14199434168300.5 | 268561513368.908 |
| 1.58084363114517e-06 | 4987609684194.53 | 6664989953942.27 | 7325697267772.03 | 8855712517246.27 | 10582895003737.1 | 11695960679380.8 | 14122145300219.1 | 266287617738.898 |
| 1.58353429897934e-06 | 4965886449558.54 | 6633700564894.48 | 7290536947231.2 | 8811420396647.2 | 10528073784320.8 | 11634257579269.1 | 14045239745364.1 | 264032975058.691 |
| 1.58622954645267e-06 | 4944232926906.31 | 6602529722106.49 | 7255515904568.5 | 8767318062455.94 | 10473502711634.1 | 11572845011086.2 | 13968715904113.7 | 261797422314.617 |
| 1.58892938135992e-06 | 4922649083972.37 | 6571477197138.68 | 7220633818624.9 | 8723404952018.78 | 10419180913648.6 | 11511721886694.4 | 13892572181038.4 | 259580797873.231 |
| 1.59163381150909e-06 | 4901134886758.24 | 6540542760100.88 | 7185890367030.45 | 8679680502262.53 | 10365107519149 | 11450887119723 | 13816806984911.7 | 257382941469.63 |
| 1.59434284472151e-06 | 4879690299547.51 | 6509726179672.57 | 7151285226225.66 | 8636144149717.11 | 10311281657753.6 | 11390339625586.8 | 13741418728721.7 | 255203694195.866 |
| 1.59705648883179e-06 | 4858315284920.76 | 6479027223122.85 | 7116818071482.69 | 8592795330537.8 | 10257702459935.6 | 11330078321505 | 13666405829681.5 | 253042898489.456 |
| 1.5997747516879e-06 | 4837009803770.52 | 6448445656330.49 | 7082488576926.55 | 8549633480527.42 | 10204369057043.7 | 11270102126519.7 | 13591766709240.3 | 250900398121.989 |
| 1.60249764115115e-06 | 4815773815316.12 | 6417981243803.67 | 7048296415555.96 | 8506658035158.25 | 10151280581322.5 | 11210409961514 | 13517499793093.3 | 248776038187.832 |
| 1.60522516509623e-06 | 4794607277118.57 | 6387633748699.67 | 7014241259264.24 | 8463868429593.77 | 10098436165932.8 | 11151000749230.2 | 13443603511191.8 | 246669665092.929 |
| 1.60795733141125e-06 | 4773510145095.28 | 6357402932844.54 | 6980322778859.93 | 8421264098710.22 | 10045834944971.7 | 11091873414287.3 | 13370076297753.4 | 244581126543.698 |
| 1.61069414799773e-06 | 4752482373534.82 | 6327288556752.46 | 6946540644087.41 | 8378844477118.01 | 9993476053492.29 | 11033026883198.5 | 13296916591271.1 | 242510271536.015 |
| 1.61343562277065e-06 | 4731523915111.63 | 6297290379645.2 | 6912894523647.22 | 8336608999182.84 | 9941358627523.13 | 10974460084388.8 | 13224122834522.5 | 240456950344.304 |
| 1.61618176365845e-06 | 4710634720900.61 | 6267408159471.26 | 6879384085216.37 | 8294557099046.75 | 9889481804087.77 | 10916171948211.6 | 13151693474579.6 | 238421014510.704 |
| 1.61893257860306e-06 | 4689814740391.72 | 6237641652925.08 | 6846008995468.42 | 8252688210648.93 | 9837844721223.72 | 10858161406965.8 | 13079626962816.8 | 236402316834.341 |
| 1.62168807555995e-06 | 4669063921504.55 | 6207990615465.98 | 6812768920093.53 | 8211001767746.34 | 9786446518001.43 | 10800427394912 | 13007921754919.6 | 234400711360.679 |
| 1.62444826249812e-06 | 4648382210602.72 | 6178454801337.08 | 6779663523818.22 | 8169497203934.14 | 9735286334542.9 | 10742968848289 | 12936576310893.2 | 232416053370.976 |
| 1.62721314740012e-06 | 4627769552508.39 | 6149033963584.09 | 6746692470425.16 | 8128173952666 | 9684363312040.2 | 10685784705330.2 | 12865589095070.5 | 230448199371.812 |
| 1.62998273826211e-06 | 4607225890516.6 | 6119727854073.92 | 6713855422772.67 | 8087031447274.12 | 9633676592773.66 | 10628873906279 | 12794958576119.7 | 228497007084.719 |
| 1.63275704309384e-06 | 4586751166409.6 | 6090536223513.28 | 6681152042814.17 | 8046069120989.21 | 9583225320129.92 | 10572235393404.3 | 12724683227051.8 | 226562335435.894 |
| 1.63553606991871e-06 | 4566345320471.12 | 6061458821467.06 | 6648581991617.48 | 8005286406960.13 | 9533008638619.71 | 10515868111016.4 | 12654761525228.4 | 224644044545.997 |
| 1.63831982677376e-06 | 4546008291500.61 | 6032495396376.69 | 6616144929383.99 | 7964682738273.5 | 9483025693895.51 | 10459771005481.9 | 12585191952368.4 | 222741995720.038 |
| 1.64110832170972e-06 | 4525740016827.39 | 6003645695578.28 | 6583840515467.66 | 7924257547972.99 | 9433275632768.84 | 10403943025238.5 | 12515972994555.2 | 220856051437.352 |
| 1.64390156279101e-06 | 4505540432324.76 | 5974909465320.76 | 6551668408393.87 | 7884010269078.57 | 9383757603227.54 | 10348383120810 | 12447103142242.9 | 218986075341.652 |
| 1.6466995580958e-06 | 4485409472424.09 | 5946286450783.83 | 6519628265878.24 | 7843940334605.48 | 9334470754452.64 | 10293090244820.4 | 12378580890263.1 | 217131932231.174 |
| 1.64950231571599e-06 | 4465347070128.79 | 5917776396095.77 | 6487719744845.16 | 7804047177583.07 | 9285414236835.19 | 10238063352008.8 | 12310404737831.1 | 215293488048.899 |
| 1.65230984375725e-06 | 4445353157028.27 | 5889379044351.24 | 6455942501446.33 | 7764330231073.46 | 9236587201992.75 | 10183301399242.7 | 12242573188551.6 | 213470609872.86 |
| 1.65512215033906e-06 | 4425427663311.85 | 5861094137628.88 | 6424296191079.05 | 7724788928189.99 | 9187988802785.8 | 10128803345532.5 | 12175084750424.6 | 211663165906.536 |
| 1.65793924359472e-06 | 4405570517782.59 | 5832921417008.8 | 6392780468404.47 | 7685422702115.56 | 9139618193333.82 | 10074568152044.6 | 12107937935851 | 209871025469.317 |
| 1.66076113167135e-06 | 4385781647871.08 | 5804860622590 | 6361394987365.59 | 7646230986120.76 | 9091474529031.24 | 10020594782115.3 | 12041131261637.8 | 208094058987.061 |
| 1.66358782272997e-06 | 4366060979649.17 | 5776911493507.64 | 6330139401205.29 | 7607213213581.81 | 9043556966563.24 | 9966882201263.41 | 11974663249003.2 | 206332137982.722 |
| 1.66641932494547e-06 | 4346408437843.63 | 5749073767950.22 | 6299013362484.05 | 7568368817998.33 | 8995864663921.2 | 9913429377203.85 | 11908532423581.5 | 204585135067.061 |
| 1.66925564650665e-06 | 4326823945849.8 | 5721347183176.59 | 6268016523097.65 | 7529697233011.02 | 8948396780418.08 | 9860235279860.01 | 11842737315427.8 | 202852923929.44 |
| 1.67209679561627e-06 | 4307307425745.1 | 5693731475532.96 | 6237148534294.71 | 7491197892419.06 | 8901152476703.58 | 9807298881376.49 | 11777276459022.4 | 201135379328.682 |
| 1.67494278049102e-06 | 4287858798302.59 | 5666226380469.67 | 6206409046694.09 | 7452870230197.37 | 8854130914779.04 | 9754619156131.4 | 11712148393275.3 | 199432377084.024 |
| 1.67779360936161e-06 | 4268477983004.38 | 5638831632557.91 | 6175797710302.15 | 7414713680513.77 | 8807331258012.2 | 9702195080748.54 | 11647351661529.7 | 197743794066.133 |
| 1.68064929047272e-06 | 4249164898055 | 5611546965506.35 | 6145314174529.89 | 7376727677745.89 | 8760752671151.8 | 9650025634109.36 | 11582884811566.3 | 196069508188.204 |
| 1.68350983208311e-06 | 4229919460394.82 | 5584372112177.61 | 6114958088209.99 | 7338911656497.95 | 8714394320341.85 | 9598109797364.72 | 11518746395607 | 194409398397.138 |
| 1.68637524246555e-06 | 4210741585713.2 | 5557306804604.6 | 6084729099613.62 | 7301265051617.38 | 8668255373135.9 | 9546446553946.4 | 11454934970317.8 | 192763344664.781 |
| 1.68924552990692e-06 | 4191631188461.81 | 5530350774006.86 | 6054626856467.25 | 7263787298211.23 | 8622334998511 | 9495034889578.53 | 11391449096812.6 | 191131227979.255 |
| 1.6921207027082e-06 | 4172588181867.72 | 5503503750806.63 | 6024651005969.21 | 7226477831662.49 | 8576632366881.39 | 9443873792288.66 | 11328287340656.1 | 189512930336.348 |
| 1.69500076918449e-06 | 4153612477946.56 | 5476765464644.93 | 5994801194806.24 | 7189336087646.18 | 8531146650112.26 | 9392962252418.79 | 11265448271866.5 | 187908334730.981 |
| 1.69788573766505e-06 | 4134703987515.48 | 5450135644397.5 | 5965077069169.78 | 7152361502145.33 | 8485877021533.05 | 9342299262636.12 | 11202930464918.1 | 186317325148.754 |
| 1.70077561649331e-06 | 4115862620206.21 | 5423614018190.57 | 5935478274772.21 | 7115553511466.74 | 8440822655950.75 | 9291883817943.6 | 11140732498744.1 | 184739786557.552 |
| 1.7036704140269e-06 | 4097088284477.93 | 5397200313416.59 | 5906004456863.01 | 7078911552256.61 | 8395982729662.91 | 9241714915690.34 | 11078852956738.7 | 183175604899.232 |
| 1.7065701386377e-06 | 4078380887630.16 | 5370894256749.85 | 5876655260244.63 | 7042435061516.05 | 8351356420470.53 | 9191791555581.8 | 11017290426759 | 181624667081.375 |
| 1.70947479871181e-06 | 4059740335815.53 | 5344695574161.88 | 5847430329288.42 | 7006123476616.34 | 8306942907690.73 | 9142112739689.79 | 10956043501127.2 | 180086860969.108 |
| 1.71238440264961e-06 | 4041166534052.58 | 5318603990936.94 | 5818329307950.27 | 6969976235314.13 | 8262741372169.27 | 9092677472462.29 | 10895110776632.2 | 178562075376.998 |
| 1.71529895886578e-06 | 4022659386238.39 | 5292619231687.16 | 5789351839786.28 | 6933992775766.4 | 8218750996292.87 | 9043484760733.11 | 10834490854531.2 | 177050200061.016 |
| 1.71821847578933e-06 | 4004218795161.22 | 5266741020367.78 | 5760497567968.13 | 6898172536545.29 | 8174970964001.35 | 8994533613731.3 | 10774182340550.8 | 175551125710.559 |
| 1.7211429618636e-06 | 3985844662513.09 | 5240969080292.14 | 5731766135298.49 | 6862514956652.85 | 8131400460799.61 | 8945823043090.43 | 10714183844888.6 | 174064743940.554 |
| 1.72407242554632e-06 | 3967536888902.26 | 5215303134146.64 | 5703157184226.18 | 6827019475535.48 | 8088038673769.44 | 8897352062857.7 | 10654493982214 | 172590947283.615 |
| 1.72700687530961e-06 | 3949295373865.67 | 5189742904005.55 | 5674670356861.28 | 6791685533098.36 | 8044884791581.11 | 8849119689502.81 | 10595111371668.8 | 171129629182.282 |
| 1.72994631963999e-06 | 3931120015881.36 | 5164288111345.74 | 5646305294990.09 | 6756512569719.63 | 8001938004504.88 | 8801124941926.73 | 10536034636868.3 | 169680683981.305 |
| 1.73289076703845e-06 | 3913010712380.74 | 5138938477061.25 | 5618061640089.94 | 6721500026264.51 | 7959197504422.18 | 8753366841470.23 | 10477262405901.6 | 168244006920.015 |
| 1.73584022602044e-06 | 3894967359760.9 | 5113693721477.84 | 5589939033343.93 | 6686647344099.15 | 7916662484836.86 | 8705844411922.26 | 10418793311331.7 | 166819494124.746 |
| 1.73879470511591e-06 | 3876989853396.76 | 5088553564367.33 | 5561937115655.51 | 6651953965104.45 | 7874332140885.97 | 8658556679528.15 | 10360625990196.1 | 165407042601.323 |
| 1.74175421286931e-06 | 3859078087653.25 | 5063517724961.91 | 5534055527662.93 | 6617419331689.63 | 7832205669350.66 | 8611502672997.63 | 10302759084006.4 | 164006550227.617 |
| 1.74471875783965e-06 | 3841231955897.35 | 5038585921968.3 | 5506293909753.61 | 6583042886805.73 | 7790282268666.71 | 8564681423512.72 | 10245191238748.1 | 162617915746.162 |
| 1.7476883486005e-06 | 3823451350510.14 | 5013757873581.83 | 5478651902078.33 | 6548824073958.89 | 7748561138935.02 | 8518091964735.42 | 10187921104880.9 | 161241038756.835 |
| 1.75066299374003e-06 | 3805736162898.74 | 4989033297500.38 | 5451129144565.34 | 6514762337223.55 | 7707041481931.83 | 8471733332815.17 | 10130947337337.2 | 159875819709.592 |
| 1.75364270186101e-06 | 3788086283508.19 | 4964411910938.27 | 5423725276934.37 | 6480857121255.47 | 7665722501118.89 | 8425604566396.31 | 10074268595522.3 | 158522159897.277 |
| 1.75662748158088e-06 | 3770501601833.31 | 4939893430639.96 | 5396439938710.43 | 6447107871304.57 | 7624603401653.36 | 8379704706625.18 | 10017883543313.1 | 157179961448.48 |
| 1.75961734153173e-06 | 3752982006430.43 | 4915477572893.73 | 5369272769237.61 | 6413514033227.7 | 7583683390397.64 | 8334032797157.16 | 9961790849057.42 | 155849127320.465 |
| 1.76261229036034e-06 | 3735527384929.12 | 4891164053545.2 | 5342223407692.63 | 6380075053501.21 | 7542961675928.97 | 8288587884163.57 | 9905989185572.6 | 154529561292.148 |
| 1.76561233672822e-06 | 3718137624043.88 | 4866952588010.76 | 5315291493098.42 | 6346790379233.4 | 7502437468548.92 | 8243369016338.35 | 9850477230144.44 | 153221167957.147 |
| 1.76861748931159e-06 | 3700812609585.61 | 4842842891290.9 | 5288476664337.42 | 6313659458176.79 | 7462109980292.69 | 8198375244904.6 | 9795253664525.67 | 151923852716.879 |
| 1.77162775680149e-06 | 3683552226473.25 | 4818834677983.43 | 5261778560164.89 | 6280681738740.34 | 7421978424938.27 | 8153605623620.95 | 9740317174934.41 | 150637521773.723 |
| 1.77464314790371e-06 | 3666356358745.18 | 4794927662296.59 | 5235196819222.06 | 6247856670001.39 | 7382042018015.45 | 8109059208787.8 | 9685666452052.42 | 149362082124.236 |
| 1.77766367133887e-06 | 3649224889570.61 | 4771121558062.1 | 5208731080049.12 | 6215183701717.61 | 7342299976814.68 | 8064735059253.4 | 9631300191023.28 | 148097441552.431 |
| 1.78068933584244e-06 | 3632157701260.96 | 4747416078748 | 5182380981098.17 | 6182662284338.67 | 7302751520395.74 | 8020632236419.72 | 9577217091450.3 | 146843508623.109 |
| 1.78372015016475e-06 | 3615154675281.09 | 4723810937471.53 | 5156146160746 | 6150291869017.92 | 7263395869596.3 | 7976749804248.26 | 9523415857394.44 | 145600192675.248 |
| 1.78675612307103e-06 | 3598215692260.53 | 4700305847011.78 | 5130026257306.75 | 6118071907623.77 | 7224232247040.31 | 7933086829265.64 | 9469895197371.97 | 144367403815.445 |
| 1.78979726334141e-06 | 3581340632004.64 | 4676900519822.32 | 5104020909044.52 | 6086001852751.06 | 7185259877146.28 | 7889642380569.04 | 9416653824352.06 | 143145052911.423 |
| 1.792843579771e-06 | 3564529373505.67 | 4653594668043.7 | 5078129754185.79 | 6054081157732.25 | 7146477986135.29 | 7846415529831.52 | 9363690455754.17 | 141933051585.582 |
| 1.79589508116984e-06 | 3547781794953.8 | 4630388003515.82 | 5052352430931.73 | 6022309276648.45 | 7107885802039.05 | 7803405351307.19 | 9311003813445.37 | 140731312208.611 |
| 1.798951776363e-06 | 3531097773748.1 | 4607280237790.27 | 5026688577470.49 | 5990685664340.37 | 7069482554707.61 | 7760610921836.21 | 9258592623737.5 | 139539747893.149 |
| 1.80201367419055e-06 | 3514477186507.44 | 4584271082142.46 | 5001137831989.25 | 5959209776419.1 | 7031267475817.11 | 7718031320849.65 | 9206455617384.14 | 138358272487.508 |
| 1.8050807835076e-06 | 3497919909081.3 | 4561360247583.8 | 4975699832686.24 | 5927881069276.71 | 6993239798877.21 | 7675665630374.23 | 9154591529577.59 | 137186800569.442 |
| 1.80815311318435e-06 | 3481425816560.59 | 4538547444873.62 | 4950374217782.63 | 5896699000096.87 | 6955398759238.52 | 7633512935036.89 | 9102999099945.55 | 136025247439.968 |
| 1.81123067210608e-06 | 3464994783288.3 | 4515832384531.09 | 4925160625534.29 | 5865663026865.16 | 6917743594099.82 | 7591572322069.22 | 9051677072547.78 | 134873529117.246 |
| 1.81431346917323e-06 | 3448626682870.21 | 4493214776847.03 | 4900058694243.47 | 5834772608379.35 | 6880273542515.14 | 7549842881311.78 | 9000624195872.59 | 133731562330.506 |
| 1.81740151330133e-06 | 3432321388185.44 | 4470694331895.58 | 4875068062270.32 | 5804027204259.57 | 6842987845400.74 | 7508323705218.22 | 8949839222833.27 | 132599264514.028 |
| 1.82049481342114e-06 | 3416078771397 | 4448270759545.8 | 4850188368044.36 | 5773426274958.24 | 6805885745541.9 | 7467013888859.34 | 8899320910764.25 | 131476553801.168 |
| 1.82359337847859e-06 | 3399898703962.23 | 4425943769473.2 | 4825419250075.82 | 5742969281770.04 | 6768966487599.61 | 7425912529926.92 | 8849068021417.33 | 130363349018.446 |
| 1.82669721743483e-06 | 3383781056643.22 | 4403713071171.08 | 4800760346966.82 | 5712655686841.56 | 6732229318117.12 | 7385018728737.56 | 8799079320957.63 | 129259569679.672 |
| 1.8298063392663e-06 | 3367725699517.14 | 4381578373961.88 | 4776211297422.53 | 5682484953180.98 | 6695673485526.33 | 7344331588236.15 | 8749353579959.49 | 128165135980.127 |
| 1.83292075296467e-06 | 3351732501986.52 | 4359539387008.39 | 4751771740262.14 | 5652456544667.57 | 6659298240154.09 | 7303850213999.5 | 8699889573402.23 | 127079968790.797 |
| 1.83604046753696e-06 | 3335801332789.46 | 4337595819324.81 | 4727441314429.81 | 5622569926061.03 | 6623102834228.32 | 7263573714239.58 | 8650686080665.85 | 126003989652.645 |
| 1.83916549200549e-06 | 3319932060009.78 | 4315747379787.79 | 4703219659005.4 | 5592824563010.76 | 6587086521884.03 | 7223501199806.78 | 8601741885526.51 | 124937120770.947 |
| 1.84229583540794e-06 | 3304124551087.13 | 4293993777147.36 | 4679106413215.2 | 5563219922064.98 | 6551248559169.21 | 7183631784192.99 | 8553055776151.99 | 123879285009.66 |
| 1.84543150679738e-06 | 3288378672826.98 | 4272334720037.73 | 4655101216442.5 | 5533755470679.74 | 6515588204050.56 | 7143964583534.55 | 8504626545096.98 | 122830405885.847 |
| 1.84857251524229e-06 | 3272694291410.62 | 4250769916988 | 4631203708238.06 | 5504430677227.78 | 6480104716419.13 | 7104498716615.1 | 8456452989298.28 | 121790407564.149 |
| 1.85171886982658e-06 | 3257071272405.06 | 4229299076432.83 | 4607413528330.48 | 5475245011007.33 | 6444797358095.83 | 7065233304868.27 | 8408533910069.93 | 120759214851.301 |
| 1.85487057964962e-06 | 3241509480772.85 | 4207921906722.92 | 4583730316636.48 | 5446197942250.72 | 6409665392836.73 | 7026167472380.25 | 8360868113098.11 | 119736753190.696 |
| 1.85802765382628e-06 | 3226008780881.88 | 4186638116135.51 | 4560153713271.04 | 5417288942132.92 | 6374708086338.42 | 6987300345892.29 | 8313454408436.09 | 118722948656.991 |
| 1.86119010148692e-06 | 3210569036515.09 | 4165447412884.67 | 4536683358557.48 | 5388517482779.95 | 6339924706243.01 | 6948631054802.96 | 8266291610498.96 | 117717727950.768 |
| 1.86435793177746e-06 | 3195190110880.13 | 4144349505131.6 | 4513318893037.4 | 5359883037277.12 | 6305314522143.22 | 6910158731170.45 | 8219378538058.27 | 116721018393.229 |
| 1.86753115385939e-06 | 3179871866618.94 | 4123344100994.76 | 4490059957480.56 | 5331385079677.28 | 6270876805587.2 | 6871882509714.58 | 8172714014236.64 | 115732747920.943 |
| 1.87070977690977e-06 | 3164614165817.33 | 4102430908559.94 | 4466906192894.6 | 5303023085008.82 | 6236610830083.31 | 6833801527818.85 | 8126296866502.18 | 114752845080.639 |
| 1.8738938101213e-06 | 3149416870014.37 | 4081609635890.26 | 4443857240534.72 | 5274796529283.65 | 6202515871104.75 | 6795914925532.21 | 8080125926662.84 | 113781239024.035 |
| 1.87708326270232e-06 | 3134279840211.9 | 4060879991036.01 | 4420912741913.21 | 5246704889504.96 | 6168591206094.06 | 6758221845570.89 | 8034200030860.69 | 112817859502.716 |
| 1.88027814387685e-06 | 3119202936883.78 | 4040241682044.49 | 4398072338808.92 | 5218747643675.03 | 6134836114467.55 | 6720721433319.95 | 7988518019566.04 | 111862636863.06 |
| 1.8834784628846e-06 | 3104186019985.25 | 4019694416969.66 | 4375335673276.6 | 5190924270802.74 | 6101249877619.54 | 6683412836834.83 | 7943078737571.54 | 110915502041.195 |
| 1.886684228981e-06 | 3089228948962.13 | 3999237903881.83 | 4352702387656.16 | 5163234250911.13 | 6067831778926.57 | 6646295206842.74 | 7897881033986.13 | 109976386558.012 |
| 1.88989545143726e-06 | 3074331582759.99 | 3978871850877.07 | 4330172124581.82 | 5135677065044.72 | 6034581103751.41 | 6609367696743.91 | 7852923762228.89 | 109045222514.208 |
| 1.89311213954034e-06 | 3059493779833.22 | 3958595966086.74 | 4307744526991.17 | 5108252195276.83 | 6001497139447.02 | 6572629462612.82 | 7808205780022.82 | 108121942585.382 |
| 1.89633430259302e-06 | 3044715398154.14 | 3938409957686.78 | 4285419238134.12 | 5080959124716.72 | 5968579175360.36 | 6536079663199.19 | 7763725949388.55 | 107206480017.165 |
| 1.89956194991392e-06 | 3029996295221.92 | 3918313533906.98 | 4263195901581.79 | 5053797337516.62 | 5935826502836.12 | 6499717459929 | 7719483136637.9 | 106298768620.391 |
| 1.90279509083751e-06 | 3015336328071.55 | 3898306403040.14 | 4241074161235.25 | 5026766318878.69 | 5903238415220.29 | 6463542016905.3 | 7675476212367.41 | 105398742766.316 |
| 1.90603373471415e-06 | 3000735353282.66 | 3878388273451.14 | 4219053661334.19 | 4999865555061.87 | 5870814207863.68 | 6427552500908.95 | 7631704051451.74 | 104506337381.872 |
| 1.90927789091013e-06 | 2986193226988.35 | 3858558853585.93 | 4197134046465.52 | 4973094533388.59 | 5838553178125.29 | 6391748081399.24 | 7588165533036.98 | 103621487944.958 |
| 1.91252756880765e-06 | 2971709804883.91 | 3838817851980.46 | 4175314961571.83 | 4946452742251.39 | 5806454625375.58 | 6356127930514.46 | 7544859540533.93 | 102744130479.782 |
| 1.9157827778049e-06 | 2957284942235.53 | 3819164977269.46 | 4153596051959.78 | 4919939671119.45 | 5774517850999.63 | 6320691223072.27 | 7501784961611.21 | 101874201552.229 |
| 1.91904352731608e-06 | 2942918493888.87 | 3799599938195.17 | 4131976963308.4 | 4893554810545.01 | 5742742158400.23 | 6285437136570.07 | 7458940688188.4 | 101011638265.276 |
| 1.92230982677138e-06 | 2928610314277.68 | 3780122443616.01 | 4110457341677.29 | 4867297652169.68 | 5711126853000.79 | 6250364851185.19 | 7416325616428.95 | 100156378254.449 |
| 1.92558168561707e-06 | 2914360257432.26 | 3760732202515.1 | 4089036833514.72 | 4841167688730.62 | 5679671242248.23 | 6215473549774.99 | 7373938646733.13 | 99308359683.308 |
| 1.92885911331548e-06 | 2900168176987.89 | 3741428924008.78 | 4067715085665.66 | 4815164414066.69 | 5648374635615.72 | 6180762417876.94 | 7331778683730.87 | 98467521238.981 |
| 1.93214211934504e-06 | 2886033926193.27 | 3722212317354.95 | 4046491745379.7 | 4789287323124.44 | 5617236344605.29 | 6146230643708.49 | 7289844636274.5 | 97633802127.726 |
| 1.93543071320034e-06 | 2871957357918.77 | 3703082091961.41 | 4025366460318.85 | 4763535911964 | 5586255682750.44 | 6111877418166.9 | 7248135417431.39 | 96807142070.539 |
| 1.93872490439211e-06 | 2857938324664.75 | 3684037957394.05 | 4004338878565.35 | 4737909677764.9 | 5555431965618.52 | 6077701934829.01 | 7206649944476.59 | 95987481298.798 |
| 1.94202470244726e-06 | 2843976678569.7 | 3665079623384.99 | 3983408648629.26 | 4712408118831.79 | 5524764510813.09 | 6043703389950.78 | 7165387138885.31 | 95174760549.934 |
| 1.94533011690895e-06 | 2830072271418.47 | 3646206799840.67 | 3962575419456.06 | 4687030734600.02 | 5494252637976.2 | 6009880982466.93 | 7124345926325.41 | 94368921063.156 |
| 1.94864115733653e-06 | 2816224954650.27 | 3627419196849.79 | 3941838840434.12 | 4661777025641.2 | 5463895668790.51 | 5976233913990.35 | 7083525236649.72 | 93569904575.192 |
| 1.95195783330568e-06 | 2802434579366.74 | 3608716524691.18 | 3921198561402.08 | 4636646493668.55 | 5433692926981.32 | 5942761388811.4 | 7042924003888.36 | 92777653316.085 |
| 1.95528015440832e-06 | 2788700996339.91 | 3590098493841.64 | 3900654232656.14 | 4611638641542.29 | 5403643738318.58 | 5909462613897.24 | 7002541166241 | 91992110005.014 |
| 1.95860813025275e-06 | 2775024056020.11 | 3571564814983.67 | 3880205504957.3 | 4586752973274.8 | 5373747430618.68 | 5876336798890.95 | 6962375666068.95 | 91213217846.15 |
| 1.96194177046358e-06 | 2761403608543.82 | 3553115199013.1 | 3859852029538.47 | 4561988994035.82 | 5344003333746.29 | 5843383156110.65 | 6922426449887.3 | 90440920524.55 |
| 1.96528108468183e-06 | 2747839503741.45 | 3534749357046.63 | 3839593458111.49 | 4537346210157.4 | 5314410779615.98 | 5810600900548.47 | 6882692468356.92 | 89675162202.089 |
| 1.96862608256491e-06 | 2734331591145.09 | 3516467000429.36 | 3819429442874.13 | 4512824129138.93 | 5284969102193.82 | 5777989249869.45 | 6843172676276.41 | 88915887513.42 |
| 1.97197677378668e-06 | 2720879719996.18 | 3498267840742.19 | 3799359636516.9 | 4488422259651.95 | 5255677637498.85 | 5745547424410.36 | 6803866032573.99 | 88163041561.969 |
| 1.97533316803746e-06 | 2707483739253.14 | 3480151589809.11 | 3779383692229.89 | 4464140111544.92 | 5226535723604.53 | 5713274647178.45 | 6764771500299.34 | 87416569915.971 |
| 1.97869527502407e-06 | 2694143497598.89 | 3462117959704.47 | 3759501263709.43 | 4439977195847.85 | 5197542700639.97 | 5681170143850.06 | 6725888046615.32 | 86676418604.53 |
| 1.98206310446985e-06 | 2680858843448.43 | 3444166662760.18 | 3739712005164.73 | 4415933024776.97 | 5168697910791.23 | 5649233142769.25 | 6687214642789.67 | 85942534113.721 |
| 1.98543666611468e-06 | 2667629624956.19 | 3426297411572.74 | 3720015571324.41 | 4392007111739.11 | 5140000698302.39 | 5617462874946.2 | 6648750264186.69 | 85214863382.715 |
| 1.98881596971502e-06 | 2654455690023.52 | 3408509919010.3 | 3700411617442.94 | 4368198971336.2 | 5111450409476.64 | 5585858574055.64 | 6610493890258.74 | 84493353799.948 |
| 1.99220102504394e-06 | 2641336886305.92 | 3390803898219.59 | 3680899799307.01 | 4344508119369.52 | 5083046392677.2 | 5554419476435.22 | 6572444504537.81 | 83777953199.317 |
| 1.99559184189115e-06 | 2628273061220.42 | 3373179062632.76 | 3661479773241.83 | 4320934072843.96 | 5054787998328.24 | 5523144821083.65 | 6534601094626.94 | 83068609856.403 |
| 1.99898843006302e-06 | 2615264061952.71 | 3355635125974.19 | 3642151196117.32 | 4297476349972.11 | 5026674578915.59 | 5492033849658.95 | 6496962652191.62 | 82365272484.737 |
| 2.00239079938259e-06 | 2602309735464.36 | 3338171802267.2 | 3622913725354.27 | 4274134470178.4 | 4998705488987.55 | 5461085806476.47 | 6459528172951.13 | 81667890232.089 |
| 2.00579895968966e-06 | 2589409928499.9 | 3320788805840.66 | 3603767018930.34 | 4250907954102.99 | 4970880085155.43 | 5430299938506.91 | 6422296656669.83 | 80976412676.793 |
| 2.00921292084073e-06 | 2576564487593.88 | 3303485851335.58 | 3584710735386.06 | 4227796323605.7 | 4943197726094.12 | 5399675495374.28 | 6385267107148.37 | 80290789824.1 |
| 2.01263269270912e-06 | 2563773259077.86 | 3286262653711.55 | 3565744533830.71 | 4204799101769.77 | 4915657772542.55 | 5369211729353.67 | 6348438532214.84 | 79610972102.562 |
| 2.01605828518493e-06 | 2551036089087.36 | 3269118928253.21 | 3546868073948.12 | 4181915812905.62 | 4888259587304.07 | 5338907895369.11 | 6311809943715.95 | 78936910360.453 |
| 2.01948970817509e-06 | 2538352823568.74 | 3252054390576.55 | 3528081016002.43 | 4159145982554.47 | 4861002535246.73 | 5308763250991.26 | 6275380357508.05 | 78268555862.21 |
| 2.02292697160341e-06 | 2525723308286.01 | 3235068756635.19 | 3509383020843.7 | 4136489137491.89 | 4833885983303.53 | 5278777056434.97 | 6239148793448.16 | 77605860284.91 |
| 2.02637008541059e-06 | 2513147388827.62 | 3218161742726.55 | 3490773749913.54 | 4113944805731.25 | 4806909300472.54 | 5248948574556.91 | 6203114275384.89 | 76948775714.782 |
| 2.02981905955422e-06 | 2500624910613.21 | 3201333065497.99 | 3472252865250.56 | 4091512516527.17 | 4780071857816.97 | 5219277070853.03 | 6167275831149.44 | 76297254643.734 |
| 2.03327390400887e-06 | 2488155718900.2 | 3184582441952.88 | 3453820029495.85 | 4069191800378.76 | 4753373028465.16 | 5189761813455.99 | 6131632492546.38 | 75651249965.923 |
| 2.03673462876608e-06 | 2475739658790.46 | 3167909589456.53 | 3435474905898.28 | 4046982189032.92 | 4726812187610.5 | 5160402073132.46 | 6096183295344.54 | 75010714974.351 |
| 2.04020124383439e-06 | 2463376575236.85 | 3151314225742.11 | 3417217158319.83 | 4024883215487.45 | 4700388712511.25 | 5131197123280.46 | 6060927279267.69 | 74375603357.483 |
| 2.04367375923937e-06 | 2451066313049.72 | 3134796068916.5 | 3399046451240.72 | 4002894413994.15 | 4674101982490.33 | 5102146239926.53 | 6025863487985.37 | 73745869195.904 |
| 2.04715218502368e-06 | 2438808716903.33 | 3118354837466.08 | 3380962449764.62 | 3981015320061.79 | 4647951378934.98 | 5073248701722.87 | 5990990969103.49 | 73121466958.992 |
| 2.05063653124704e-06 | 2426603631342.3 | 3101990250262.34 | 3362964819623.64 | 3959245470459.07 | 4621936285296.4 | 5044503789944.44 | 5956308774154.98 | 72502351501.634 |
| 2.05412680798631e-06 | 2414450900787.91 | 3085702026567.62 | 3345053227183.35 | 3937584403217.47 | 4596056087089.31 | 5015910788485.96 | 5921815958590.43 | 71888478060.958 |
| 2.05762302533549e-06 | 2402350369544.38 | 3069489886040.57 | 3327227339447.69 | 3916031657633.97 | 4570310171891.38 | 4987468983858.84 | 5887511581768.56 | 71279802253.094 |
| 2.06112519340579e-06 | 2390301881805.14 | 3053353548741.7 | 3309486824063.76 | 3894586774273.8 | 4544697929342.68 | 4959177665188.09 | 5853394706946.78 | 70676280069.971 |
| 2.06463332232559e-06 | 2378305281658.98 | 3037292735138.77 | 3291831349326.66 | 3873249294973.05 | 4519218751145 | 4931036124209.11 | 5819464401271.65 | 70077867876.129 |
| 2.06814742224053e-06 | 2366360413096.17 | 3021307166112.18 | 3274260584184.13 | 3852018762841.21 | 4493872031061.09 | 4903043655264.47 | 5785719735769.29 | 69484522405.57 |
| 2.07166750331352e-06 | 2354467120014.59 | 3005396562960.21 | 3256774198241.21 | 3830894722263.66 | 4468657164913.94 | 4875199555300.6 | 5752159785335.76 | 68896200758.624 |
| 2.07519357572476e-06 | 2342625246225.69 | 2989560647404.27 | 3239371861764.77 | 3809876718904.08 | 4443573550585.8 | 4847503123864.42 | 5718783628727.44 | 68312860398.853 |
| 2.07872564967179e-06 | 2330834635460.5 | 2973799141594.07 | 3222053245688.03 | 3788964299706.76 | 4418620588017.35 | 4819953663099.91 | 5685590348551.3 | 67734459149.97 |
| 2.08226373536948e-06 | 2319095131375.52 | 2958111768112.67 | 3204818021614.93 | 3768157012898.89 | 4393797679206.63 | 4792550477744.63 | 5652579031255.19 | 67160955192.794 |
| 2.08580784305011e-06 | 2307406577558.62 | 2942498249981.52 | 3187665861824.54 | 3747454407992.76 | 4369104228208 | 4765292875126.17 | 5619748767118.1 | 66592307062.224 |
| 2.08935798296338e-06 | 2295768817534.84 | 2926958310665.43 | 3170596439275.31 | 3726856035787.86 | 4344539641131.03 | 4738180165158.6 | 5587098650240.31 | 66028473644.243 |
| 2.09291416537641e-06 | 2284181694772.14 | 2911491674077.46 | 3153609427609.26 | 3706361448372.94 | 4320103326139.27 | 4711211660338.71 | 5554627778533.59 | 65469414172.941 |
| 2.09647640057382e-06 | 2272645052687.15 | 2896098064583.73 | 3136704501156.18 | 3685970199128.03 | 4295794693449.02 | 4684386675742.41 | 5522335253711.34 | 64915088227.575 |
| 2.10004469885772e-06 | 2261158734650.8 | 2880777207008.2 | 3119881334937.69 | 3665681842726.31 | 4271613155328.01 | 4657704529020.87 | 5490220181278.64 | 64365455729.639 |
| 2.10361907054776e-06 | 2249722583993.95 | 2865528826637.4 | 3103139604671.25 | 3645495935136.01 | 4247558126094 | 4631164540396.78 | 5458281670522.4 | 63820476939.971 |
| 2.10719952598115e-06 | 2238336444012.93 | 2850352649225.01 | 3086478986774.12 | 3625412033622.16 | 4223629022113.37 | 4604766032660.37 | 5426518834501.29 | 63280112455.877 |
| 2.1107860755127e-06 | 2227000157975.1 | 2835248400996.49 | 3069899158367.23 | 3605429696748.34 | 4199825261799.61 | 4578508331165.58 | 5394930790035.83 | 62744323208.286 |
| 2.11437872951485e-06 | 2215713569124.24 | 2820215808653.56 | 3053399797279.03 | 3585548484378.33 | 4176146265611.73 | 4552390763826.02 | 5363516657698.34 | 62213070458.919 |
| 2.11797749837768e-06 | 2204476520686.04 | 2805254599378.7 | 3036980582049.22 | 3565767957677.67 | 4152591456052.71 | 4526412661110.96 | 5332275561802.86 | 61686315797.495 |
| 2.12158239250896e-06 | 2193288855873.41 | 2790364500839.48 | 3020641191932.47 | 3546087679115.24 | 4129160257667.73 | 4500573356041.22 | 5301206630395.09 | 61164021138.95 |
| 2.12519342233418e-06 | 2182150417891.81 | 2775545241192.93 | 3004381306902.04 | 3526507212464.7 | 4105852097042.55 | 4474872184185.05 | 5270308995242.25 | 60646148720.684 |
| 2.12881059829657e-06 | 2171061049944.51 | 2760796549089.84 | 2988200607653.34 | 3507026122805.85 | 4082666402801.6 | 4449308483653.97 | 5239581791823 | 60132661099.829 |
| 2.13243393085713e-06 | 2160020595237.81 | 2746118153678.89 | 2972098775607.44 | 3487643976526.05 | 4059602605606.23 | 4423881595098.46 | 5209024159317.21 | 59623521150.547 |
| 2.13606343049467e-06 | 2149028896986.21 | 2731509784610.87 | 2956075492914.53 | 3468360341321.44 | 4036660138152.76 | 4398590861703.76 | 5178635240595.79 | 59118692061.34 |
| 2.13969910770585e-06 | 2138085798417.52 | 2716971172042.76 | 2940130442457.3 | 3449174786198.16 | 4013838435170.53 | 4373435629185.5 | 5148414182210.47 | 58618137332.392 |
| 2.14334097300516e-06 | 2127191142777.92 | 2702502046641.74 | 2924263307854.26 | 3430086881473.54 | 3991136933419.9 | 4348415245785.33 | 5118360134383.59 | 58121820772.928 |
| 2.14698903692503e-06 | 2116344773337.03 | 2688102139589.2 | 2908473773462.98 | 3411096198777.17 | 3968555071690.2 | 4323529062266.48 | 5088472250997.78 | 57629706498.601 |
| 2.15064331001578e-06 | 2105546533392.83 | 2673771182584.62 | 2892761524383.35 | 3392202311051.92 | 3946092290797.55 | 4298776431909.32 | 5058749689585.71 | 57141758928.891 |
| 2.15430380284571e-06 | 2094796266276.6 | 2659508907849.46 | 2877126246460.67 | 3373404792554.96 | 3923748033582.78 | 4274156710506.83 | 5029191611319.76 | 56657942784.539 |
| 2.15797052600109e-06 | 2084093815357.82 | 2645315048130.94 | 2861567626288.78 | 3354703218858.64 | 3901521744909.14 | 4249669256360.03 | 4999797181001.69 | 56178223084.992 |
| 2.16164349008622e-06 | 2073439024049 | 2631189336705.81 | 2846085351213.03 | 3336097166851.4 | 3879412871660.07 | 4225313430273.42 | 4970565567052.3 | 55702565145.877 |
| 2.16532270572345e-06 | 2062831735810.43 | 2617131507384.03 | 2830679109333.33 | 3317586214738.49 | 3857420862736.87 | 4201088595550.27 | 4941495941501.02 | 55230934576.49 |
| 2.1690081835532e-06 | 2052271794154.96 | 2603141294512.38 | 2815348589506.99 | 3299169942042.85 | 3835545169056.29 | 4176994117988 | 4912587479975.57 | 54763297277.313 |
| 2.17269993423402e-06 | 2041759042652.69 | 2589218432978.08 | 2800093481351.62 | 3280847929605.65 | 3813785243548.19 | 4153029365873.42 | 4883839361691.48 | 54299619437.544 |
| 2.17639796844258e-06 | 2031293324935.58 | 2575362658212.28 | 2784913475247.89 | 3262619759587.06 | 3792140541153 | 4129193709977.96 | 4855250769441.7 | 53839867532.659 |
| 2.18010229687372e-06 | 2020874484702.09 | 2561573706193.56 | 2769808262342.33 | 3244485015466.73 | 3770610518819.24 | 4105486523552.84 | 4826820889586.14 | 53384008321.981 |
| 2.18381293024051e-06 | 2010502365721.73 | 2547851313451.31 | 2754777534549.97 | 3226443282044.41 | 3749194635500.95 | 4081907182324.28 | 4798548912041.19 | 52932008846.281 |
| 2.18752987927424e-06 | 2000176811839.55 | 2534195217069.1 | 2739820984556.99 | 3208494145440.33 | 3727892352155.08 | 4058455064488.57 | 4770434030269.25 | 52483836425.396 |
| 2.19125315472444e-06 | 1989897666980.6 | 2520605154688 | 2724938305823.27 | 3190637193095.69 | 3706703131738.82 | 4035129550707.12 | 4742475441268.22 | 52039458655.86 |
| 2.19498276735898e-06 | 1979664775154.39 | 2507080864509.83 | 2710129192584.98 | 3172872013773 | 3685626439206.93 | 4011930024101.55 | 4714672345560.97 | 51598843408.57 |
| 2.19871872796403e-06 | 1969477980459.22 | 2493622085300.33 | 2695393339856.98 | 3155198197556.41 | 3664661741508.97 | 3988855870248.65 | 4687023947184.82 | 51161958826.455 |
| 2.20246104734412e-06 | 1959337127086.54 | 2480228556392.37 | 2680730443435.27 | 3137615335851.94 | 3643808507586.53 | 3965906477175.36 | 4659529453681.01 | 50728773322.178 |
| 2.20620973632218e-06 | 1949242059325.23 | 2466900017688.98 | 2666140199899.36 | 3120123021387.75 | 3623066208370.37 | 3943081235353.67 | 4632188076084.1 | 50299255575.848 |
| 2.20996480573955e-06 | 1939192621565.81 | 2453636209666.44 | 2651622306614.53 | 3102720848214.23 | 3602434316777.57 | 3920379537695.55 | 4604999028911.41 | 49873374532.76 |
| 2.21372626645603e-06 | 1929188658304.69 | 2440436873377.23 | 2637176461734.18 | 3085408411704.17 | 3581912307708.6 | 3897800779547.75 | 4577961530152.45 | 49451099401.148 |
| 2.21749412934991e-06 | 1919230014148.28 | 2427301750453.03 | 2622802364201.94 | 3068185308552.82 | 3561499658044.35 | 3875344358686.69 | 4551074801258.31 | 49032399649.955 |
| 2.22126840531799e-06 | 1909316533817.13 | 2414230583107.57 | 2608499713753.89 | 3051051136777.85 | 3541195846643.15 | 3853009675313.16 | 4524338067131.02 | 48617245006.632 |
| 2.22504910527559e-06 | 1899448062149.98 | 2401223114139.47 | 2594268210920.63 | 3034005495719.38 | 3521000354337.71 | 3830796132047.15 | 4497750556112.99 | 48205605454.945 |
| 2.22883624015666e-06 | 1889624444107.79 | 2388279086935.05 | 2580107557029.38 | 3017047986039.85 | 3500912663932.04 | 3808703133922.54 | 4471311499976.29 | 47797451232.804 |
| 2.23262982091372e-06 | 1879845524777.72 | 2375398245471.06 | 2566017454205.91 | 3000178209723.9 | 3480932260198.34 | 3786730088381.78 | 4445020133912.11 | 47392752830.116 |
| 2.23642985851794e-06 | 1870111149377.08 | 2362580334317.4 | 2551997605376.57 | 2983395770078.21 | 3461058629873.82 | 3764876405270.54 | 4418875696520 | 46991480986.646 |
| 2.24023636395918e-06 | 1860421163257.22 | 2349825098639.72 | 2538047714270.15 | 2966700271731.27 | 3441291261657.5 | 3743141496832.39 | 4392877429797.28 | 46593606689.905 |
| 2.24404934824598e-06 | 1850775411907.36 | 2337132284202.04 | 2524167485419.76 | 2950091320633.07 | 3421629646207 | 3721524777703.31 | 4367024579128.37 | 46199101173.052 |
| 2.24786882240564e-06 | 1841173740958.45 | 2324501637369.32 | 2510356624164.62 | 2933568524054.84 | 3402073276135.23 | 3700025664906.34 | 4341316393274.06 | 45807935912.81 |
| 2.25169479748422e-06 | 1831615996186.92 | 2311932905109.92 | 2496614836651.84 | 2917131490588.65 | 3382621646007.08 | 3678643577846.06 | 4315752124360.87 | 45420082627.411 |
| 2.25552728454657e-06 | 1822102023518.39 | 2299425834998.08 | 2482941829838.12 | 2900779830147.03 | 3363274252336.11 | 3657377938303.1 | 4290331027870.33 | 45035513274.544 |
| 2.25936629467639e-06 | 1812631669031.39 | 2286980175216.33 | 2469337311491.43 | 2884513153962.48 | 3344030593581.12 | 3636228170428.66 | 4265052362628.31 | 44654200049.333 |
| 2.26321183897624e-06 | 1803204778961.01 | 2274595674557.83 | 2455800990192.61 | 2868331074587.03 | 3324890170142.74 | 3615193700738.93 | 4239915390794.27 | 44276115382.323 |
| 2.26706392856757e-06 | 1793821199702.47 | 2262272082428.69 | 2442332575336.96 | 2852233205891.64 | 3305852484359.99 | 3594273958109.51 | 4214919377850.59 | 43901231937.488 |
| 2.27092257459077e-06 | 1784480777814.73 | 2250009148850.28 | 2428931777135.77 | 2836219163065.68 | 3286917040506.77 | 3573468373769.81 | 4190063592591.85 | 43529522610.257 |
| 2.27478778820517e-06 | 1775183360023.98 | 2237806624461.39 | 2415598306617.79 | 2820288562616.27 | 3268083344788.35 | 3552776381297.44 | 4165347307114.07 | 43160960525.547 |
| 2.27865958058913e-06 | 1765928793227.17 | 2225664260520.44 | 2402331875630.67 | 2804441022367.62 | 3249350905337.82 | 3532197416612.55 | 4140769796804.05 | 42795519035.831 |
| 2.28253796294e-06 | 1756716924495.42 | 2213581808907.62 | 2389132196842.35 | 2788676161460.33 | 3230719232212.48 | 3511730917972.11 | 4116330340328.57 | 42433171719.2 |
| 2.28642294647421e-06 | 1747547601077.45 | 2201559022126.98 | 2375998983742.43 | 2772993600350.65 | 3212187837390.21 | 3491376325964.28 | 4092028219623.71 | 42073892377.46 |
| 2.29031454242728e-06 | 1738420670402.93 | 2189595653308.46 | 2362931950643.45 | 2757392960809.68 | 3193756234765.86 | 3471133083502.6 | 4067862719884.12 | 41717655034.236 |
| 2.29421276205384e-06 | 1729335980085.83 | 2177691456209.92 | 2349930812682.16 | 2741873865922.55 | 3175423940147.53 | 3451000635820.3 | 4043833129552.22 | 41364433933.094 |
| 2.29811761662768e-06 | 1720293377927.71 | 2165846185219.05 | 2336995285820.74 | 2726435940087.54 | 3157190471252.82 | 3430978430464.5 | 4019938740307.54 | 41014203535.676 |
| 2.30202911744179e-06 | 1711292711920.95 | 2154059595355.34 | 2324125086847.98 | 2711078809015.2 | 3139055347705.18 | 3411065917290.39 | 3996178847055.93 | 40666938519.858 |
| 2.30594727580837e-06 | 1702333830251.98 | 2142331442271.94 | 2311319933380.39 | 2695802099727.39 | 3121018091030.04 | 3391262548455.46 | 3972552747918.86 | 40322613777.917 |
| 2.30987210305889e-06 | 1693416581304.46 | 2130661482257.48 | 2298579543863.32 | 2680605440556.28 | 3103078224651.04 | 3371567778413.6 | 3949059744222.63 | 39981204414.713 |
| 2.31380361054407e-06 | 1684540813662.43 | 2119049472237.84 | 2285903637571.99 | 2665488461143.37 | 3085235273886.2 | 3351981063909.3 | 3925699140487.68 | 39642685745.896 |
| 2.31774180963399e-06 | 1675706376113.36 | 2107495169777.97 | 2273291934612.52 | 2650450792438.39 | 3067488765944.03 | 3332501863971.68 | 3902470244417.78 | 39307033296.114 |
| 2.32168671171807e-06 | 1666913117651.27 | 2095998333083.52 | 2260744155922.88 | 2635492066698.24 | 3049838229919.67 | 3313129639908.68 | 3879372366889.39 | 38974222797.247 |
| 2.3256383282051e-06 | 1658160887479.73 | 2084558721002.54 | 2248260023273.8 | 2620611917485.84 | 3032283196790.97 | 3293863855301.06 | 3856404821940.84 | 38644230186.653 |
| 2.3295966705233e-06 | 1649449535014.85 | 2073176093027.13 | 2235839259269.71 | 2605809979668.95 | 3014823199414.48 | 3274703975996.5 | 3833566926761.63 | 38317031605.426 |
| 2.33356175012035e-06 | 1640778909888.24 | 2061850209294.98 | 2223481587349.54 | 2591085889419.01 | 2997457772521.57 | 3255649470103.6 | 3810858001681.67 | 37992603396.672 |
| 2.33753357846339e-06 | 1632148861949.92 | 2050580830590.95 | 2211186731787.55 | 2576439284209.85 | 2980186452714.35 | 3236699807985.94 | 3788277370160.58 | 37670922103.799 |
| 2.34151216703911e-06 | 1623559241271.18 | 2039367718348.58 | 2198954417694.09 | 2561869802816.47 | 2963008778461.69 | 3217854462256.03 | 3765824358776.94 | 37351964468.821 |
| 2.34549752735373e-06 | 1615009898147.48 | 2028210634651.52 | 2186784371016.34 | 2547377085313.67 | 2945924290095.16 | 3199112907769.34 | 3743498297217.57 | 37035707430.675 |
| 2.34948967093305e-06 | 1606500683101.2 | 2017109342235.01 | 2174676318539 | 2532960773074.78 | 2928932529804.93 | 3180474621618.23 | 3721298518266.81 | 36722128123.556 |
| 2.35348860932249e-06 | 1598031446884.42 | 2006063604487.24 | 2162629987884.95 | 2518620508770.23 | 2912033041635.69 | 3161939083125.91 | 3699224357795.8 | 36411203875.263 |
| 2.35749435408715e-06 | 1589602040481.71 | 1995073185450.7 | 2150645107515.84 | 2504355936366.15 | 2895225371482.54 | 3143505773840.38 | 3677275154751.75 | 36102912205.556 |
| 2.36150691681177e-06 | 1581212315112.76 | 1984137849823.54 | 2138721406732.72 | 2490166701122.97 | 2878509067086.78 | 3125174177528.3 | 3655450251147.26 | 35797230824.538 |
| 2.36552630910084e-06 | 1572862122235.09 | 1973257362960.78 | 2126858615676.53 | 2476052449593.9 | 2861883678031.82 | 3106943780168.98 | 3633748992049.6 | 35494137631.038 |
| 2.36955254257858e-06 | 1564551313546.67 | 1962431490875.61 | 2115056465328.65 | 2462012829623.45 | 2845348755738.92 | 3088814069948.15 | 3612170725570 | 35193610711.012 |
| 2.373585628889e-06 | 1556279740988.52 | 1951660000240.56 | 2103314687511.36 | 2448047490345.88 | 2828903853463 | 3070784537251.91 | 3590714802852.99 | 34895628335.964 |
| 2.37762557969595e-06 | 1548047256747.27 | 1940942658388.68 | 2091633014888.25 | 2434156082183.63 | 2812548526288.38 | 3052854674660.58 | 3569380578065.67 | 34600168961.372 |
| 2.38167240668311e-06 | 1539853713257.69 | 1930279233314.69 | 2080011180964.65 | 2420338256845.77 | 2796282331124.56 | 3035023976942.48 | 3548167408387.09 | 34307211225.127 |
| 2.38572612155405e-06 | 1531698963205.2 | 1919669493676.04 | 2068448920088.01 | 2406593667326.3 | 2780104826701.89 | 3017291941047.84 | 3527074653997.49 | 34016733945.996 |
| 2.38978673603226e-06 | 1523582859528.3 | 1909113208793.99 | 2056945967448.16 | 2392921967902.52 | 2764015573567.3 | 2999658066102.54 | 3506101678067.73 | 33728716122.084 |
| 2.39385426186119e-06 | 1515505255421.04 | 1898610148654.64 | 2045502059077.7 | 2379322814133.37 | 2748014134079.93 | 2982121853401.96 | 3485247846748.56 | 33443136929.319 |
| 2.39792871080426e-06 | 1507466004335.37 | 1888160083909.93 | 2034116931852.19 | 2365795862857.67 | 2732100072406.86 | 2964682806404.74 | 3464512529160.01 | 33159975719.943 |
| 2.40201009464494e-06 | 1499464959983.54 | 1877762785878.56 | 2022790323490.41 | 2352340772192.41 | 2716272954518.67 | 2947340430726.57 | 3443895097380.72 | 32879212021.023 |
| 2.40609842518674e-06 | 1491501976340.42 | 1867418026546.94 | 2011521972554.56 | 2338957201530.94 | 2700532348185.11 | 2930094234133.98 | 3423394926437.34 | 32600825532.971 |
| 2.41019371425326e-06 | 1483576907645.78 | 1857125578570.09 | 2000311618450.39 | 2325644811541.2 | 2684877822970.67 | 2912943726538.01 | 3403011394293.86 | 32324796128.071 |
| 2.41429597368823e-06 | 1475689608406.58 | 1846885215272.45 | 1989159001427.4 | 2312403264163.86 | 2669308950230.16 | 2895888419988.06 | 3382743881841.05 | 32051103849.03 |
| 2.41840521535552e-06 | 1467839933399.19 | 1836696710648.75 | 1978063862578.83 | 2299232222610.5 | 2653825303104.28 | 2878927828665.54 | 3362591772885.81 | 31779728907.532 |
| 2.42252145113922e-06 | 1460027737671.59 | 1826559839364.77 | 1967025943841.85 | 2286131351361.68 | 2638426456515.18 | 2862061468877.63 | 3342554454140.6 | 31510651682.805 |
| 2.42664469294363e-06 | 1452252876545.54 | 1816474376758.11 | 1956044987997.48 | 2273100316165.07 | 2623111987161.94 | 2845288859050.99 | 3322631315212.81 | 31243852720.208 |
| 2.43077495269332e-06 | 1444515205618.74 | 1806440098838.9 | 1945120738670.69 | 2260138784033.48 | 2607881473516.12 | 2828609519725.45 | 3302821748594.26 | 30979312729.82 |
| 2.43491224233315e-06 | 1436814580766.9 | 1796456782290.5 | 1934252940330.28 | 2247246423242.92 | 2592734495817.24 | 2812022973547.7 | 3283125149650.57 | 30717012585.047 |
| 2.43905657382831e-06 | 1429150858145.84 | 1786524204470.17 | 1923441338288.91 | 2234422903330.59 | 2577670636068.23 | 2795528745265.01 | 3263540916610.64 | 30456933321.239 |
| 2.44320795916437e-06 | 1421523894193.54 | 1776642143409.67 | 1912685678702.94 | 2221667895092.89 | 2562689478030.96 | 2779126361718.83 | 3244068450556.1 | 30199056134.319 |
| 2.44736641034727e-06 | 1413933545632.15 | 1766810377815.88 | 1901985708572.37 | 2208981070583.37 | 2547790607221.59 | 2762815351838.57 | 3224707155410.77 | 29943362379.421 |
| 2.45153193940341e-06 | 1406379669469.94 | 1757028687071.36 | 1891341175740.64 | 2196362103110.64 | 2532973610906.06 | 2746595246635.14 | 3205456437930.15 | 29689833569.547 |
| 2.45570455837966e-06 | 1398862123003.32 | 1747296851234.89 | 1880751828894.47 | 2183810667236.34 | 2518238078095.52 | 2730465579194.69 | 3186315707690.92 | 29438451374.226 |
| 2.45988427934339e-06 | 1391380763818.73 | 1737614651041.95 | 1870217417563.68 | 2171326438772.98 | 2503583599541.65 | 2714425884672.22 | 3167284377080.42 | 29189197618.189 |
| 2.46407111438249e-06 | 1383935449794.52 | 1727981867905.26 | 1859737692120.9 | 2158909094781.8 | 2489009767732.14 | 2698475700285.22 | 3148361861286.23 | 28942054280.058 |
| 2.46826507560545e-06 | 1376526039102.83 | 1718398283915.14 | 1849312403781.38 | 2146558313570.67 | 2474516176885.98 | 2682614565307.31 | 3129547578285.61 | 28697003491.04 |
| 2.47246617514135e-06 | 1369152390211.46 | 1708863681839.98 | 1838941304602.6 | 2134273774691.85 | 2460102422948.88 | 2666842021061.85 | 3110840948835.12 | 28454027533.636 |
| 2.47667442513994e-06 | 1361814361885.61 | 1699377845126.61 | 1828624147484.06 | 2122055158939.8 | 2445768103588.59 | 2651157610915.59 | 3092241396460.17 | 28213108840.36 |
| 2.48088983777162e-06 | 1354511813189.71 | 1689940557900.7 | 1818360686166.84 | 2109902148348.98 | 2431512818190.2 | 2635560880272.26 | 3073748347444.53 | 27974229992.47 |
| 2.48511242522753e-06 | 1347244603489.17 | 1680551604967 | 1808150675233.26 | 2097814426191.56 | 2417336167851.52 | 2620051376566.18 | 3055361230820.02 | 27737373718.707 |
| 2.48934219971953e-06 | 1340012592452.07 | 1671210771809.72 | 1797993870106.5 | 2085791676975.21 | 2403237755378.33 | 2604628649255.88 | 3037079478356.02 | 27502522894.046 |
| 2.4935791734803e-06 | 1332815640050.88 | 1661917844592.78 | 1787890027050.14 | 2073833586440.74 | 2389217185279.74 | 2589292249817.68 | 3018902524549.12 | 27269660538.459 |
| 2.49782335876331e-06 | 1325653606564.11 | 1652672610160.06 | 1777838903167.72 | 2061939841559.84 | 2375274063763.38 | 2574041731739.32 | 3000829806612.76 | 27038769815.688 |
| 2.50207476784291e-06 | 1318526352577.97 | 1643474856035.59 | 1767840256402.24 | 2050110130532.73 | 2361407998730.77 | 2558876650513.5 | 2982860764466.86 | 26809834032.025 |
| 2.50633341301432e-06 | 1311433738987.94 | 1634324370423.77 | 1757893845535.69 | 2038344142785.81 | 2347618599772.52 | 2543796563631.52 | 2964994840727.5 | 26582836635.108 |
| 2.5105993065937e-06 | 1304375627000.41 | 1625220942209.54 | 1747999430188.49 | 2026641568969.28 | 2333905478163.59 | 2528801030576.84 | 2947231480696.57 | 26357761212.724 |
| 2.51487246091818e-06 | 1297351878134.18 | 1616164360958.48 | 1738156770818.92 | 2015002100954.77 | 2320268246858.55 | 2513889612818.66 | 2929570132351.47 | 26134591491.617 |
| 2.51915288834586e-06 | 1290362354222.02 | 1607154416916.98 | 1728365628722.58 | 2003425431832.9 | 2306706520486.79 | 2499061873805.5 | 2912010246334.84 | 25913311336.321 |
| 2.52344060125592e-06 | 1283406917412.18 | 1598190901012.25 | 1718625766031.75 | 1991911255910.89 | 2293219915347.73 | 2484317378958.8 | 2894551275944.25 | 25693904747.984 |
| 2.52773561204856e-06 | 1276485430169.83 | 1589273604852.45 | 1708936945714.76 | 1980459268710.05 | 2279808049406.07 | 2469655695666.45 | 2877192677121.98 | 25476355863.219 |
| 2.53203793314512e-06 | 1269597755278.55 | 1580402320726.68 | 1699298931575.35 | 1969069166963.38 | 2266470542286.96 | 2455076393276.4 | 2859933908444.73 | 25260648952.95 |
| 2.53634757698806e-06 | 1262743755841.72 | 1571576841604.99 | 1689711488251.99 | 1957740648613.05 | 2253207015271.2 | 2440579043090.22 | 2842774431113.43 | 25046768421.28 |
| 2.54066455604104e-06 | 1255923295283.94 | 1562796961138.4 | 1680174381217.16 | 1946473412807.89 | 2240017091290.43 | 2426163218356.67 | 2825713708943.03 | 24834698804.362 |
| 2.54498888278891e-06 | 1249136237352.38 | 1554062473658.82 | 1670687376776.64 | 1935267159900.89 | 2226900394922.27 | 2411828494265.26 | 2808751208352.3 | 24624424769.28 |
| 2.54932056973779e-06 | 1242382446118.17 | 1545373174178.98 | 1661250242068.75 | 1924121591446.65 | 2213856552385.55 | 2397574447939.82 | 2791886398353.63 | 24415931112.94 |
| 2.55365962941507e-06 | 1235661785977.65 | 1536728858392.39 | 1651862745063.59 | 1913036410198.82 | 2200885191535.41 | 2383400658432.07 | 2775118750542.93 | 24209202760.974 |
| 2.55800607436947e-06 | 1228974121653.74 | 1528129322673.16 | 1642524654562.25 | 1902011320107.56 | 2187985941858.51 | 2369306706715.2 | 2758447739089.45 | 24004224766.645 |
| 2.56235991717108e-06 | 1222319318197.15 | 1519574364075.91 | 1633235740195.96 | 1891046026316.92 | 2175158434468.11 | 2355292175677.41 | 2741872840725.66 | 23800982309.772 |
| 2.56672117041136e-06 | 1215697240987.67 | 1511063780335.58 | 1623995772425.31 | 1880140235162.22 | 2162402302099.26 | 2341356650115.5 | 2725393534737.18 | 23599460695.654 |
| 2.57108984670322e-06 | 1209107755735.36 | 1502597369867.28 | 1614804522539.33 | 1869293654167.48 | 2149717179103.89 | 2327499716728.41 | 2709009302952.67 | 23399645354.009 |
| 2.57546595868102e-06 | 1202550728481.77 | 1494174931766.03 | 1605661762654.64 | 1858505992042.76 | 2137102701445.99 | 2313720964110.82 | 2692719629733.75 | 23201521837.922 |
| 2.57984951900066e-06 | 1196026025601.09 | 1485796265806.58 | 1596567265714.57 | 1847776958681.51 | 2124558506696.66 | 2300019982746.7 | 2676524001965.01 | 23005075822.799 |
| 2.58424054033953e-06 | 1189533513801.34 | 1477461172443.12 | 1587520805488.18 | 1837106265157.88 | 2112084234029.28 | 2286396365002.86 | 2660421909043.93 | 22810293105.33 |
| 2.58863903539664e-06 | 1183073060125.43 | 1469169452809.03 | 1578522156569.36 | 1826493623724.09 | 2099679524214.58 | 2272849705122.58 | 2644412842870.89 | 22617159602.466 |
| 2.5930450168926e-06 | 1176644531952.34 | 1460920908716.57 | 1569571094375.87 | 1815938747807.69 | 2087344019615.77 | 2259379599219.12 | 2628496297839.18 | 22425661350.396 |
| 2.59745849756966e-06 | 1170247796998.11 | 1452715342656.54 | 1560667395148.31 | 1805441352008.88 | 2075077364183.62 | 2245985645269.33 | 2612671770825.06 | 22235784503.542 |
| 2.60187949019178e-06 | 1163882723316.98 | 1444552557798.01 | 1551810835949.17 | 1795001152097.76 | 2062879203451.53 | 2232667443107.21 | 2596938761177.74 | 22047515333.555 |
| 2.60630800754462e-06 | 1157549179302.37 | 1436432357987.86 | 1543001194661.78 | 1784617865011.61 | 2050749184530.69 | 2219424594417.51 | 2581296770709.55 | 21860840228.323 |
| 2.61074406243562e-06 | 1151247033687.9 | 1428354547750.46 | 1534238249989.27 | 1774291208852.16 | 2038686956105.06 | 2206256702729.28 | 2565745303685.94 | 21675745690.986 |
| 2.61518766769401e-06 | 1144976155548.37 | 1420318932287.28 | 1525521781453.51 | 1764020902882.78 | 2026692168426.54 | 2193163373409.48 | 2550283866815.65 | 21492218338.962 |
| 2.61963883617087e-06 | 1138736414300.76 | 1412325317476.4 | 1516851569394.03 | 1753806667525.73 | 2014764473310 | 2180144213656.58 | 2534911969240.79 | 21310244902.981 |
| 2.62409758073913e-06 | 1132527679705.13 | 1404373509872.11 | 1508227394966.92 | 1743648224359.37 | 2002903524128.34 | 2167198832494.09 | 2519629122527.08 | 21129812226.118 |
| 2.62856391429364e-06 | 1126349821865.54 | 1396463316704.46 | 1499649040143.71 | 1733545296115.36 | 1991108975807.6 | 2154326840764.23 | 2504434840653.91 | 20950907262.852 |
| 2.63303784975122e-06 | 1120202711230.98 | 1388594545878.73 | 1491116287710.24 | 1723497606675.84 | 1979380484821.97 | 2141527851121.48 | 2489328640004.63 | 20773517078.115 |
| 2.63751940005063e-06 | 1114086218596.24 | 1380767005974.94 | 1482628921265.52 | 1713504881070.59 | 1967717709188.92 | 2128801478026.18 | 2474310039356.7 | 20597628846.361 |
| 2.6420085781527e-06 | 1108000215102.72 | 1372980506247.35 | 1474186725220.51 | 1703566845474.23 | 1956120308464.18 | 2116147337738.18 | 2459378559871.96 | 20423229850.634 |
| 2.64650539704028e-06 | 1101944572239.32 | 1365234856623.89 | 1465789484796.98 | 1693683227203.34 | 1944587943736.87 | 2103565048310.38 | 2444533725086.89 | 20250307481.656 |
| 2.65100986971834e-06 | 1095919161843.21 | 1357529867705.62 | 1457436986026.31 | 1683853754713.6 | 1933120277624.48 | 2091054229582.43 | 2429775060902.88 | 20078849236.909 |
| 2.65552200921398e-06 | 1089923856100.67 | 1349865350766.11 | 1449129015748.22 | 1674078157596.94 | 1921716974268.01 | 2078614503174.26 | 2415102095576.5 | 19908842719.732 |
| 2.66004182857648e-06 | 1083958527547.8 | 1342241117750.87 | 1440865361609.57 | 1664356166578.63 | 1910377699326.93 | 2066245492479.78 | 2400514359709.88 | 19740275638.429 |
| 2.66456934087732e-06 | 1078023049071.3 | 1334656981276.75 | 1432645812063.08 | 1654687513514.42 | 1899102119974.28 | 2053946822660.46 | 2386011386241.02 | 19573135805.374 |
| 2.66910455921022e-06 | 1072117293909.22 | 1327112754631.26 | 1424470156366.08 | 1645071931387.61 | 1887889904891.72 | 2041718120638.98 | 2371592710434.16 | 19407411136.135 |
| 2.67364749669121e-06 | 1066241135651.63 | 1319608251771.94 | 1416338184579.21 | 1635509154306.13 | 1876740724264.54 | 2029559015092.88 | 2357257869870.16 | 19243089648.597 |
| 2.67819816645863e-06 | 1060394448241.32 | 1312143287325.68 | 1408249687565.12 | 1625998917499.65 | 1865654249776.74 | 2017469136448.19 | 2343006404436.94 | 19080159462.097 |
| 2.68275658167317e-06 | 1054577105974.48 | 1304717676588.03 | 1400204456987.13 | 1616540957316.63 | 1854630154606.06 | 2005448116873.09 | 2328837856319.87 | 18918608796.566 |
| 2.68732275551796e-06 | 1048788983501.37 | 1297331235522.52 | 1392202285307.95 | 1607135011221.36 | 1843668113419.01 | 1993495590271.57 | 2314751769992.26 | 18758425971.676 |
| 2.69189670119851e-06 | 1043029955826.87 | 1289983780759.88 | 1384242965788.25 | 1597780817791.04 | 1832767802365.95 | 1981611192277.08 | 2300747692205.83 | 18599599405.993 |
| 2.69647843194287e-06 | 1037299898311.19 | 1282675129597.37 | 1376326292485.36 | 1588478116712.8 | 1821928899076.06 | 1969794560246.22 | 2286825171981.21 | 18442117616.146 |
| 2.70106796100155e-06 | 1031598686670.39 | 1275405099997.96 | 1368452060251.88 | 1579226648780.74 | 1811151082652.49 | 1958045333252.39 | 2272983760598.44 | 18285969215.992 |
| 2.70566530164764e-06 | 1025926196976.98 | 1268173510589.57 | 1360620064734.24 | 1570026155892.95 | 1800434033667.31 | 1946363152079.51 | 2259223011587.56 | 18131142915.794 |
| 2.71027046717683e-06 | 1020282305660.48 | 1260980180664.33 | 1352830102371.37 | 1560876381048.51 | 1789777434156.58 | 1934747659215.67 | 2245542480719.15 | 17977627521.402 |
| 2.71488347090741e-06 | 1014666889507.92 | 1253824930177.7 | 1345081970393.19 | 1551777068344.52 | 1779180967615.42 | 1923198498846.87 | 2231941725994.93 | 17825411933.449 |
| 2.71950432618037e-06 | 1009079825664.4 | 1246707579747.71 | 1337375466819.23 | 1542727962973.07 | 1768644318993.02 | 1911715316850.67 | 2218420307638.36 | 17674485146.546 |
| 2.72413304635938e-06 | 1003520991633.56 | 1239627950654.06 | 1329710390457.19 | 1533728811218.27 | 1758167174687.7 | 1900297760789.97 | 2204977788085.33 | 17524836248.484 |
| 2.72876964483088e-06 | 997990265278.06 | 1232585864837.34 | 1322086540901.41 | 1524779360453.19 | 1747749222541.98 | 1888945479906.67 | 2191613731974.74 | 17376454419.449 |
| 2.73341413500408e-06 | 992487524820.046 | 1225581144898.1 | 1314503718531.48 | 1515879359136.87 | 1737390151837.57 | 1877658125115.43 | 2178327706139.29 | 17229328931.237 |
| 2.73806653031101e-06 | 987012648841.596 | 1218613614096 | 1306961724510.66 | 1507028556811.24 | 1727089653290.48 | 1866435348997.4 | 2165119279596.08 | 17083449146.478 |
| 2.74272684420657e-06 | 981565516285.144 | 1211683096348.9 | 1299460360784.45 | 1498226704098.14 | 1716847419046.02 | 1855276805793.94 | 2151988023537.45 | 16938804517.87 |
| 2.74739509016856e-06 | 976146006453.883 | 1204789416231.96 | 1291999430079.04 | 1489473552696.25 | 1706663142673.92 | 1844182151400.42 | 2138933511321.65 | 16795384587.413 |
| 2.75207128169772e-06 | 970753999012.161 | 1197932398976.68 | 1284578735899.78 | 1480768855378.02 | 1696536519163.29 | 1833151043359.94 | 2125955318463.68 | 16653178985.655 |
| 2.75675543231776e-06 | 965389373985.851 | 1191111870469.99 | 1277198082529.67 | 1472112365986.64 | 1686467244917.77 | 1822183140857.1 | 2113053022626.05 | 16512177430.941 |
| 2.76144755557542e-06 | 960052011762.706 | 1184327657253.3 | 1269857275027.74 | 1463503839432.94 | 1676455017750.54 | 1811278104711.81 | 2100226203609.67 | 16372369728.672 |
| 2.76614766504049e-06 | 954741793092.703 | 1177579586521.49 | 1262556119227.58 | 1454943031692.37 | 1666499536879.37 | 1800435597373.04 | 2087474443344.63 | 16233745770.563 |
| 2.77085577430586e-06 | 949458599088.364 | 1170867486121.98 | 1255294421735.69 | 1446429699801.87 | 1656600502921.75 | 1789655282912.64 | 2074797325881.17 | 16096295533.917 |
| 2.77557189698756e-06 | 944202311225.055 | 1164191184553.67 | 1248071989929.9 | 1437963601856.84 | 1646757617889.87 | 1778936827019.12 | 2062194437380.47 | 15960009080.9 |
| 2.78029604672478e-06 | 938972811341.288 | 1157550510965.99 | 1240888631957.82 | 1429544497008.01 | 1636970585185.76 | 1768279896991.48 | 2049665366105.68 | 15824876557.819 |
| 2.78502823717994e-06 | 933769981638.981 | 1150945295157.85 | 1233744156735.16 | 1421172145458.35 | 1627239109596.34 | 1757684161733.04 | 2037209702412.82 | 15690888194.413 |
| 2.7897684820387e-06 | 928593704683.725 | 1144375367576.59 | 1226638373944.18 | 1412846308460.02 | 1617562897288.49 | 1747149291745.26 | 2024827038741.77 | 15558034303.144 |
| 2.79451679501003e-06 | 923443863405.022 | 1137840559316.96 | 1219571094031.99 | 1404566748311.2 | 1607941655804.13 | 1736674959121.59 | 2012516969607.26 | 15426305278.498 |
| 2.79927318982622e-06 | 918320341096.505 | 1131340702120.04 | 1212542128208.97 | 1396333228353.04 | 1598375094055.33 | 1726260837541.3 | 2000279091589.91 | 15295691596.292 |
| 2.80403768024295e-06 | 913223021416.158 | 1124875628372.16 | 1205551288447.06 | 1388145512966.51 | 1588862922319.37 | 1715906602263.38 | 1988113003327.28 | 15166183812.982 |
| 2.80881028003928e-06 | 908151788386.5 | 1118445171103.84 | 1198598387478.14 | 1380003367569.3 | 1579404852233.84 | 1705611930120.37 | 1976018305504.94 | 15037772564.982 |
| 2.81359100301776e-06 | 903106526394.768 | 1112049163988.66 | 1191683238792.34 | 1371906558612.71 | 1570000596791.75 | 1695376499512.29 | 1963994600847.58 | 14910448567.989 |
| 2.81837986300441e-06 | 898087120193.084 | 1105687441342.17 | 1184805656636.34 | 1363854853578.5 | 1560649870336.61 | 1685199990400.47 | 1952041494110.11 | 14784202616.308 |
| 2.82317687384879e-06 | 893093454898.595 | 1099359838120.75 | 1177965456011.71 | 1355848020975.78 | 1551352388557.54 | 1675082084301.53 | 1940158592068.84 | 14659025582.188 |
| 2.82798204942402e-06 | 888125415993.615 | 1093066189920.5 | 1171162452673.18 | 1347885830337.87 | 1542107868484.4 | 1665022464281.22 | 1928345503512.66 | 14534908415.162 |
| 2.83279540362686e-06 | 883182889325.738 | 1086806332976.09 | 1164396463126.94 | 1339968052219.17 | 1532916028482.89 | 1655020814948.39 | 1916601839234.22 | 14411842141.393 |
| 2.8376169503777e-06 | 878265761107.947 | 1080580104159.56 | 1157667304628.92 | 1332094458192.04 | 1523776588249.64 | 1645076822448.92 | 1904927212021.15 | 14289817863.027 |
| 2.84244670362063e-06 | 873373917918.697 | 1074387340979.23 | 1150974795183.04 | 1324264820843.6 | 1514689268807.41 | 1635190174459.64 | 1893321236647.35 | 14168826757.546 |
| 2.84728467732347e-06 | 868507246701.998 | 1068227881578.45 | 1144318753539.53 | 1316478913772.66 | 1505653792500.13 | 1625360560182.32 | 1881783529864.23 | 14048860077.13 |
| 2.85213088547782e-06 | 863665634767.47 | 1062101564734.45 | 1137698999193.08 | 1308736511586.5 | 1496669882988.08 | 1615587670337.61 | 1870313710392.04 | 13929909148.029 |
| 2.85698534209909e-06 | 858848969790.394 | 1056008229857.13 | 1131115352381.18 | 1301037389897.78 | 1487737265243.06 | 1605871197159.05 | 1858911398911.16 | 13811965369.932 |
| 2.86184806122655e-06 | 854057139811.743 | 1049947716987.84 | 1124567634082.3 | 1293381325321.36 | 1478855665543.47 | 1596210834387.03 | 1847576218053.53 | 13695020215.346 |
| 2.86671905692336e-06 | 849290033238.204 | 1043919866798.18 | 1118055666014.16 | 1285768095471.14 | 1470024811469.51 | 1586606277262.81 | 1836307792393.92 | 13579065228.982 |
| 2.87159834327661e-06 | 844547538842.18 | 1037924520588.74 | 1111579270631.88 | 1278197478956.9 | 1461244431898.31 | 1577057222522.53 | 1825105748441.44 | 13464092027.14 |
| 2.87648593439739e-06 | 839829545761.786 | 1031961520287.9 | 1105138271126.27 | 1270669255381.17 | 1452514256999.09 | 1567563368391.24 | 1813969714630.92 | 13350092297.102 |
| 2.88138184442078e-06 | 835135943500.826 | 1026030708450.54 | 1098732491421.97 | 1263183205336.02 | 1443834018228.38 | 1558124414576.91 | 1802899321314.35 | 13237057796.537 |
| 2.88628608750593e-06 | 830466621928.763 | 1020131928256.79 | 1092361756175.7 | 1255739110399.94 | 1435203448325.13 | 1548740062264.54 | 1791894200752.41 | 13124980352.9 |
| 2.8911986778361e-06 | 825821471280.664 | 1014265023510.79 | 1086025890774.38 | 1248336753134.67 | 1426622281305.91 | 1539410014110.16 | 1780953987105.94 | 13013851862.842 |
| 2.89611962961868e-06 | 821200382157.146 | 1008429838639.35 | 1079724721333.39 | 1240975917081.99 | 1418090252460.13 | 1530133974234.93 | 1770078316427.49 | 12903664291.624 |
| 2.90104895708524e-06 | 816603245524.303 | 1002626218690.74 | 1073458074694.67 | 1233656386760.6 | 1409607098345.19 | 1520911648219.22 | 1759266826652.89 | 12794409672.54 |
| 2.90598667449157e-06 | 812029952713.619 | 996854009333.317 | 1067225778424.95 | 1226377947662.94 | 1401172556781.72 | 1511742743096.72 | 1748519157592.81 | 12686080106.334 |
| 2.91093279611773e-06 | 807480395421.868 | 991113056854.269 | 1061027660813.84 | 1219140386252 | 1392786366848.73 | 1502626967348.54 | 1737834950924.39 | 12578667760.634 |
| 2.91588733626809e-06 | 802954465711.01 | 985403208158.28 | 1054863550872.07 | 1211943489958.17 | 1384448268878.91 | 1493564030897.32 | 1727213850182.87 | 12472164869.384 |
| 2.92085030927137e-06 | 798452056008.059 | 979724310766.208 | 1048733278329.54 | 1204787047176.04 | 1376158004453.76 | 1484553645101.39 | 1716655500753.28 | 12366563732.283 |
| 2.92582172948065e-06 | 793973059104.958 | 974076212813.759 | 1042636673633.54 | 1197670847261.28 | 1367915316398.9 | 1475595522748.92 | 1706159549862.08 | 12261856714.228 |
| 2.93080161127347e-06 | 789517368158.425 | 968458763050.139 | 1036573567946.84 | 1190594680527.4 | 1359719948779.24 | 1466689378052.04 | 1695725646568.92 | 12158036244.763 |
| 2.93578996905183e-06 | 785084876689.8 | 962871810836.712 | 1030543793145.84 | 1183558338242.62 | 1351571646894.27 | 1457834926641.07 | 1685353441758.35 | 12055094817.528 |
| 2.94078681724225e-06 | 780675478584.869 | 957315206145.635 | 1024547181818.65 | 1176561612626.68 | 1343470157273.26 | 1449031885558.65 | 1675042588131.62 | 11953024989.722 |
| 2.94579217029578e-06 | 776289068093.688 | 951788799558.505 | 1018583567263.28 | 1169604296847.68 | 1335415227670.58 | 1440279973253.99 | 1664792740198.45 | 11851819381.56 |
| 2.95080604268811e-06 | 771925539830.386 | 946292442264.978 | 1012652783485.67 | 1162686185018.89 | 1327406607060.91 | 1431578909577.05 | 1654603554268.87 | 11751470675.74 |
| 2.95582844891951e-06 | 767584788772.96 | 940825986061.392 | 1006754665197.85 | 1155807072195.57 | 1319444045634.56 | 1422928415772.78 | 1644474688445.05 | 11651971616.919 |
| 2.96085940351499e-06 | 763266710263.063 | 935389283349.378 | 1000889047816.01 | 1148966754371.82 | 1311527294792.7 | 1414328214475.35 | 1634405802613.16 | 11553315011.182 |
| 2.96589892102424e-06 | 758971200005.773 | 929982187134.469 | 995055767458.607 | 1142165028477.37 | 1303656107142.7 | 1405778029702.41 | 1624396558435.32 | 11455493725.524 |
| 2.97094701602174e-06 | 754698154069.356 | 924604551024.694 | 989254660944.442 | 1135401692374.45 | 1295830236493.38 | 1397277586849.35 | 1614446619341.48 | 11358500687.335 |
| 2.97600370310676e-06 | 750447468885.019 | 919256229229.175 | 983485565790.761 | 1128676544854.59 | 1288049437850.36 | 1388826612683.6 | 1604555650521.36 | 11262328883.891 |
| 2.98106899690342e-06 | 746219041246.65 | 913937076556.702 | 977748320211.315 | 1121989385635.44 | 1280313467411.33 | 1380424835338.87 | 1594723318916.5 | 11166971361.841 |
| 2.98614291206074e-06 | 742012768310.548 | 908646948414.318 | 972042763114.446 | 1115340015357.62 | 1272622082561.39 | 1372071984309.51 | 1584949293212.19 | 11072421226.71 |
| 2.99122546325267e-06 | 737828547595.14 | 903385700805.888 | 966368734101.149 | 1108728235581.54 | 1264975041868.41 | 1363767790444.83 | 1575233243829.51 | 10978671642.396 |
| 2.99631666517812e-06 | 733666276980.693 | 898153190330.66 | 960726073463.14 | 1102153848784.24 | 1257372105078.3 | 1355511985943.37 | 1565574842917.45 | 10885715830.68 |
| 3.00141653256106e-06 | 729525854709.012 | 892949274181.827 | 955114622180.915 | 1095616658356.2 | 1249813033110.42 | 1347304304347.34 | 1555973764344.91 | 10793547070.732 |
| 3.00652508015046e-06 | 725407179383.133 | 887773810145.073 | 949534221921.806 | 1089116468598.19 | 1242297588052.91 | 1339144480536.89 | 1546429683692.85 | 10702158698.628 |
| 3.01164232272046e-06 | 721310149966.991 | 882626656597.126 | 943984715038.031 | 1082653084718.08 | 1234825533158.04 | 1331032250724.55 | 1536942278246.45 | 10611544106.868 |
| 3.01676827507028e-06 | 717234665785.102 | 877507672504.288 | 938465944564.746 | 1076226312827.73 | 1227396632837.61 | 1322967352449.6 | 1527511226987.22 | 10521696743.895 |
| 3.02190295202439e-06 | 713180626522.214 | 872416717420.976 | 932977754218.085 | 1069835959939.78 | 1220010652658.3 | 1314949524572.47 | 1518136210585.22 | 10432610113.625 |
| 3.02704636843245e-06 | 709147932222.957 | 867353651488.244 | 927519988393.198 | 1063481833964.48 | 1212667359337.11 | 1306978507269.14 | 1508816911391.26 | 10344277774.976 |
| 3.03219853916941e-06 | 705136483291.488 | 862318335432.31 | 922092492162.295 | 1057163743706.58 | 1205366520736.71 | 1299054042025.62 | 1499553013429.17 | 10256693341.402 |
| 3.03735947913553e-06 | 701146180491.117 | 857310630563.063 | 916695111272.668 | 1050881498862.12 | 1198107905860.87 | 1291175871632.33 | 1490344202388.03 | 10169850480.432 |
| 3.04252920325645e-06 | 697176924943.93 | 852330398772.587 | 911327692144.732 | 1044634910015.33 | 1190891284849.86 | 1283343740178.63 | 1481190165614.49 | 10083742913.211 |
| 3.04770772648319e-06 | 693228618130.403 | 847377502533.656 | 905990081870.041 | 1038423788635.42 | 1183716428975.92 | 1275557393047.23 | 1472090592105.07 | 9998364414.048 |
| 3.05289506379224e-06 | 689301161889 | 842451804898.236 | 900682128209.316 | 1032247947073.46 | 1176583110638.65 | 1267816576908.74 | 1463045172498.53 | 9913708809.962 |
| 3.05809123018556e-06 | 685394458415.774 | 837553169495.983 | 895403679590.462 | 1026107198559.23 | 1169491103360.48 | 1260121039716.12 | 1454053599068.21 | 9829769980.242 |
| 3.06329624069066e-06 | 681508410263.945 | 832681460532.733 | 890154585106.59 | 1020001357198.08 | 1162440181782.13 | 1252470530699.22 | 1445115565714.48 | 9746541855.997 |
| 3.06851011036062e-06 | 677642920343.486 | 827836542788.985 | 884934694514.02 | 1013930237967.75 | 1155430121658.05 | 1244864800359.32 | 1436230767957.11 | 9664018419.723 |
| 3.07373285427413e-06 | 673797891920.679 | 823018281618.382 | 879743858230.307 | 1007893656715.28 | 1148460699851.92 | 1237303600463.67 | 1427398902927.76 | 9582193704.866 |
| 3.07896448753557e-06 | 669973228617.687 | 818226542946.187 | 874581927332.235 | 1001891430153.84 | 1141531694332.11 | 1229786684040.06 | 1418619669362.43 | 9501061795.39 |
| 3.08420502527501e-06 | 666168834412.093 | 813461193267.756 | 869448753553.832 | 995923375859.6 | 1134642884167.22 | 1222313805371.35 | 1409892767594.01 | 9420616825.35 |
| 3.08945448264829e-06 | 662384613636.454 | 808722099647.004 | 864344189284.37 | 989989312268.588 | 1127794049521.52 | 1214884719990.15 | 1401217899544.74 | 9340852978.466 |
| 3.09471287483701e-06 | 658620470977.828 | 804009129714.867 | 859268087566.366 | 984089058673.584 | 1120984971650.5 | 1207499184673.33 | 1392594768718.84 | 9261764487.707 |
| 3.09998021704864e-06 | 654876311477.302 | 799322151667.76 | 854220302093.584 | 978222435220.972 | 1114215432896.42 | 1200156957436.72 | 1384023080195.04 | 9183345634.869 |
| 3.10525652451654e-06 | 651152040529.511 | 794661034266.033 | 849200687209.026 | 972389262907.626 | 1107485216683.78 | 1192857797529.68 | 1375502540619.23 | 9105590750.165 |
| 3.11054181249997e-06 | 647447563882.15 | 790025646832.421 | 844209097902.931 | 966589363577.788 | 1100794107514.91 | 1185601465429.81 | 1367032858197.06 | 9028494211.812 |
| 3.11583609628418e-06 | 643762787635.476 | 785415859250.491 | 839245389810.768 | 960822559919.947 | 1094141890965.52 | 1178387722837.56 | 1358613742686.62 | 8952050445.629 |
| 3.12113939118043e-06 | 640097618241.801 | 780831541963.08 | 834309419211.225 | 955088675463.732 | 1087528353680.24 | 1171216332670.95 | 1350244905391.14 | 8876253924.629 |
| 3.12645171252605e-06 | 636451962504.98 | 776272565970.743 | 829401043024.197 | 949387534576.796 | 1080953283368.23 | 1164087059060.26 | 1341926059151.67 | 8801099168.622 |
| 3.13177307568447e-06 | 632825727579.896 | 771738802830.178 | 824520118808.779 | 943718962461.713 | 1074416468798.74 | 1156999667342.72 | 1333656918339.86 | 8726580743.819 |
| 3.13710349604526e-06 | 629218820971.925 | 767230124652.669 | 819666504761.247 | 938082785152.874 | 1067917699796.7 | 1149953924057.24 | 1325437198850.7 | 8652693262.44 |
| 3.14244298902418e-06 | 625631150536.408 | 762746404102.504 | 814840059713.045 | 932478829513.387 | 1061456767238.35 | 1142949596939.19 | 1317266618095.34 | 8579431382.32 |
| 3.14779157006326e-06 | 622062624478.105 | 758287514395.407 | 810040643128.766 | 926906923231.982 | 1055033463046.84 | 1135986454915.1 | 1309144894993.85 | 8506789806.528 |
| 3.15314925463078e-06 | 618513151350.647 | 753853329296.961 | 805268115104.14 | 921366894819.92 | 1048647580187.86 | 1129064268097.45 | 1301071749968.16 | 8434763282.981 |
| 3.15851605822137e-06 | 614982640055.981 | 749443723121.018 | 800522336364.006 | 915858573607.905 | 1042298912665.28 | 1122182807779.5 | 1293046904934.82 | 8363346604.065 |
| 3.16389199635601e-06 | 611470999843.809 | 745058570728.129 | 795803168260.3 | 910381789743.002 | 1035987255516.79 | 1115341846430 | 1285070083298.01 | 8292534606.26 |
| 3.16927708458211e-06 | 607978140311.014 | 740697747523.946 | 791110472770.031 | 904936374185.557 | 1029712404809.57 | 1108541157688.12 | 1277141009942.37 | 8222322169.763 |
| 3.17467133847356e-06 | 604503971401.087 | 736361129457.636 | 786444112493.256 | 899522158706.119 | 1023474157635.95 | 1101780516358.18 | 1269259411226.01 | 8152704218.122 |
| 3.18007477363072e-06 | 601048403403.542 | 732048593020.289 | 781803950651.065 | 894138975882.373 | 1017272312109.1 | 1095059698404.55 | 1261425014973.45 | 8083675717.866 |
| 3.18548740568053e-06 | 597611346953.331 | 727760015243.325 | 777189851083.548 | 888786659096.075 | 1011106667358.71 | 1088378480946.51 | 1253637550468.65 | 8015231678.142 |
| 3.19090925027652e-06 | 594192713030.242 | 723495273696.893 | 772601678247.779 | 883465042529.98 | 1004977023526.71 | 1081736642253.13 | 1245896748448 | 7947367150.356 |
| 3.19634032309886e-06 | 590792412958.301 | 719254246488.272 | 768039297215.787 | 878173961164.8 | 998883181762.959 | 1075133961738.15 | 1238202341093.42 | 7880077227.81 |
| 3.20178063985442e-06 | 587410358405.164 | 715036812260.273 | 763502573672.533 | 872913250776.139 | 992824944220.979 | 1068570219954.89 | 1230554062025.4 | 7813357045.355 |
| 3.20723021627678e-06 | 584046461381.5 | 710842850189.627 | 758991373913.884 | 867682747931.446 | 986802114053.7 | 1062045198591.17 | 1222951646296.13 | 7747201779.031 |
| 3.21268906812633e-06 | 580700634240.371 | 706672239985.386 | 754505564844.589 | 862482289986.98 | 980814495409.196 | 1055558680464.29 | 1215394830382.61 | 7681606645.726 |
| 3.21815721119026e-06 | 577372789676.608 | 702524861887.31 | 750045013976.249 | 857311715084.759 | 974861893426.442 | 1049110449515.94 | 1207883352179.83 | 7616566902.823 |
| 3.22363466128265e-06 | 574062840726.176 | 698400596664.256 | 745609589425.297 | 852170862149.534 | 968944114231.088 | 1042700290807.18 | 1200416950993.93 | 7552077847.862 |
| 3.22912143424447e-06 | 570770700765.536 | 694299325612.568 | 741199159910.968 | 847059570885.759 | 963060964931.232 | 1036327990513.45 | 1192995367535.43 | 7488134818.199 |
| 3.23461754594368e-06 | 567496283511.001 | 690220930554.463 | 736813594753.275 | 841977681774.565 | 957212253613.217 | 1029993335919.54 | 1185618343912.44 | 7424733190.667 |
| 3.24012301227524e-06 | 564239503018.091 | 686165293836.412 | 732452763870.981 | 836925036070.742 | 951397789337.429 | 1023696115414.64 | 1178285623623.95 | 7361868381.244 |
| 3.24563784916115e-06 | 561000273680.869 | 682132298327.522 | 728116537779.579 | 831901475799.722 | 945617382134.109 | 1017436118487.35 | 1170996951553.07 | 7299535844.721 |
| 3.25116207255052e-06 | 557778510231.291 | 678121827417.921 | 723804787589.261 | 826906843754.577 | 939870842999.185 | 1011213135720.75 | 1163752073960.39 | 7237731074.371 |
| 3.25669569841961e-06 | 554574127738.531 | 674133765017.135 | 719517385002.895 | 821940983493.007 | 934157983890.1 | 1005026958787.43 | 1156550738477.29 | 7176449601.629 |
| 3.26223874277188e-06 | 551387041608.316 | 670167995552.463 | 715254202314.002 | 817003739334.349 | 928478617721.663 | 998877380444.616 | 1149392694099.31 | 7115686995.761 |
| 3.26779122163799e-06 | 548217167582.245 | 666224403967.359 | 711015112404.733 | 812094956356.577 | 922832558361.908 | 992764194529.229 | 1142277691179.53 | 7055438863.55 |
| 3.27335315107594e-06 | 545064421737.115 | 662302875719.8 | 706799988743.843 | 807214480393.323 | 917219620627.965 | 986687195953.018 | 1135205481421.98 | 6995700848.976 |
| 3.27892454717102e-06 | 541928720484.224 | 658403296780.67 | 702608705384.67 | 802362158030.884 | 911639620281.939 | 980646180697.681 | 1128175817875.11 | 6936468632.901 |
| 3.28450542603591e-06 | 538809980568.691 | 654525553632.122 | 698441136963.112 | 797537836605.256 | 906092374026.806 | 974640945810.006 | 1121188454925.19 | 6877737932.756 |
| 3.29009580381072e-06 | 535708119068.748 | 650669533265.958 | 694297158695.609 | 792741364199.154 | 900577699502.32 | 968671289397.035 | 1114243148289.88 | 6819504502.234 |
| 3.29569569666302e-06 | 532623053395.052 | 646835123181.998 | 690176646377.121 | 787972589639.054 | 895095415280.922 | 962737010621.235 | 1107339655011.68 | 6761764130.98 |
| 3.30130512078792e-06 | 529554701289.966 | 643022211386.447 | 686079476379.108 | 783231362492.225 | 889645340863.676 | 956837909695.688 | 1100477733451.5 | 6704512644.288 |
| 3.30692409240807e-06 | 526502980826.858 | 639230686390.269 | 682005525647.512 | 778517533063.784 | 884227296676.206 | 950973787879.303 | 1093657143282.2 | 6647745902.8 |
| 3.31255262777374e-06 | 523467810409.385 | 635460437207.552 | 677954671700.744 | 773830952393.74 | 878841104064.648 | 945144447472.032 | 1086877645482.24 | 6591459802.204 |
| 3.31819074316286e-06 | 520449108770.767 | 631711353353.879 | 673926792627.662 | 769171472254.054 | 873486585291.61 | 939349691810.109 | 1080139002329.2 | 6535650272.939 |
| 3.32383845488107e-06 | 517446794973.072 | 627983324844.692 | 669921767085.562 | 764538945145.706 | 868163563532.152 | 933589325261.305 | 1073440977393.51 | 6480313279.904 |
| 3.32949577926176e-06 | 514460788406.482 | 624276242193.663 | 665939474298.159 | 759933224295.756 | 862871862869.769 | 927863153220.198 | 1066783335532.06 | 6425444822.158 |
| 3.33516273266612e-06 | 511491008788.563 | 620589996411.057 | 661979794053.581 | 755354163654.428 | 857611308292.392 | 922170982103.453 | 1060165842881.94 | 6371040932.641 |
| 3.34083933148318e-06 | 508537376163.528 | 616924479002.1 | 658042606702.355 | 750801617892.185 | 852381725688.397 | 916512619345.132 | 1053588266854.08 | 6317097677.877 |
| 3.34652559212988e-06 | 505599810901.494 | 613279581965.344 | 654127793155.398 | 746275442396.818 | 847182941842.624 | 910887873391.999 | 1047050376127.06 | 6263611157.698 |
| 3.35222153105109e-06 | 502678233697.744 | 609655197791.033 | 650235234882.011 | 741775493270.544 | 842014784432.419 | 905296553698.862 | 1040551940640.85 | 6210577504.958 |
| 3.35792716471967e-06 | 499772565571.97 | 606051219459.469 | 646364813907.872 | 737301627327.095 | 836877082023.67 | 899738470723.917 | 1034092731590.61 | 6157992885.251 |
| 3.36364250963652e-06 | 496882727867.528 | 602467540439.376 | 642516412813.031 | 732853702088.836 | 831769664066.872 | 894213435924.114 | 1027672521420.47 | 6105853496.64 |
| 3.36936758233064e-06 | 494008642250.676 | 598904054686.267 | 638689914729.909 | 728431575783.866 | 826692360893.194 | 888721261750.531 | 1021291083817.42 | 6054155569.378 |
| 3.37510239935914e-06 | 491150230709.817 | 595360656640.807 | 634885203341.299 | 724035107343.146 | 821645003710.56 | 883261761643.779 | 1014948193705.12 | 6002895365.636 |
| 3.38084697730732e-06 | 488307415554.734 | 591837241227.18 | 631102162878.361 | 719664156397.614 | 816627424599.742 | 877834750029.404 | 1008643627237.86 | 5952069179.232 |
| 3.38660133278871e-06 | 485480119415.825 | 588333703851.457 | 627340678118.633 | 715318583275.324 | 811639456510.468 | 872440042313.321 | 1002377161794.39 | 5901673335.366 |
| 3.39236548244512e-06 | 482668265243.33 | 584849940399.956 | 623600634384.029 | 710998248998.581 | 806680933257.534 | 867077454877.252 | 996148575971.936 | 5851704190.351 |
| 3.39813944294668e-06 | 479871776306.555 | 581385847237.614 | 619881917538.85 | 706703015281.079 | 801751689516.94 | 861746805074.187 | 989957649580.097 | 5802158131.351 |
| 3.40392323099189e-06 | 477090576193.1 | 577941321206.348 | 616184413987.793 | 702432744525.061 | 796851560822.026 | 856447911223.859 | 983804163634.879 | 5753031576.12 |
| 3.40971686330769e-06 | 474324588808.074 | 574516259623.429 | 612508010673.962 | 698187299818.469 | 791980383559.629 | 851180592608.233 | 977687900352.688 | 5704320972.742 |
| 3.41552035664947e-06 | 471573738373.308 | 571110560279.841 | 608852595076.877 | 693966544932.11 | 787137994966.244 | 845944669467.01 | 971608643144.365 | 5656022799.376 |
| 3.42133372780114e-06 | 468837949426.577 | 567724121438.655 | 605218055210.498 | 689770344316.824 | 782324233124.205 | 840739962993.154 | 965566176609.251 | 5608133564 |
| 3.42715699357518e-06 | 466117146820.799 | 564356841833.397 | 601604279621.237 | 685598563100.663 | 777538936957.875 | 835566295328.423 | 959560286529.266 | 5560649804.157 |
| 3.4329901708127e-06 | 463411255723.247 | 561008620666.412 | 598011157385.979 | 681451067086.072 | 772781946229.843 | 830423489558.927 | 953590759863.027 | 5513568086.71 |
| 3.43883327638346e-06 | 460720201614.752 | 557679357607.24 | 594438578110.106 | 677327722747.083 | 768053101537.141 | 825311369710.695 | 947657384739.969 | 5466885007.586 |
| 3.44468632718593e-06 | 458043910288.904 | 554368952790.985 | 590886431925.522 | 673228397226.505 | 763352244307.47 | 820229760745.261 | 941759950454.513 | 5420597191.538 |
| 3.45054934014734e-06 | 455382307851.245 | 551077306816.683 | 587354609488.68 | 669152958333.135 | 758679216795.434 | 815178488555.26 | 935898247460.239 | 5374701291.894 |
| 3.45642233222376e-06 | 452735320718.47 | 547804320745.676 | 583843001978.613 | 665101274538.963 | 754033862078.794 | 810157379960.048 | 930072067364.096 | 5329193990.319 |
| 3.46230532040007e-06 | 450102875617.616 | 544549896099.99 | 580351501094.966 | 661073214976.39 | 749416024054.727 | 805166262701.336 | 924281202920.629 | 5284071996.575 |
| 3.46819832169011e-06 | 447484899585.252 | 541313934860.701 | 576879999056.031 | 657068649435.454 | 744825547436.103 | 800204965438.83 | 918525448026.231 | 5239332048.282 |
| 3.47410135313665e-06 | 444881319966.665 | 538096339466.316 | 573428388596.788 | 653087448361.06 | 740262277747.767 | 795273317745.903 | 912804597713.424 | 5194970910.681 |
| 3.48001443181146e-06 | 442292064415.045 | 534897012811.147 | 569996562966.942 | 649129482850.217 | 735726061322.839 | 790371150105.265 | 907118448145.152 | 5150985376.404 |
| 3.4859375748154e-06 | 439717060890.666 | 531715858243.688 | 566584415928.968 | 645194624649.285 | 731216745299.026 | 785498293904.664 | 901466796609.115 | 5107372265.238 |
| 3.4918707992784e-06 | 437156237660.066 | 528552779564.997 | 563191841756.16 | 641282746151.223 | 726734177614.943 | 780654581432.593 | 895849441512.108 | 5064128423.895 |
| 3.49781412235957e-06 | 434609523295.226 | 525407681027.07 | 559818735230.678 | 637393720392.852 | 722278207006.447 | 775839845874.016 | 890266182374.398 | 5021250725.79 |
| 3.50376756124722e-06 | 432076846672.738 | 522280467331.229 | 556464991641.599 | 633527421052.119 | 717848683002.988 | 771053921306.112 | 884716819824.118 | 4978736070.807 |
| 3.50973113315891e-06 | 429558136972.986 | 519171043626.496 | 553130506782.975 | 629683722445.369 | 713445455923.959 | 766296642694.027 | 879201155591.683 | 4936581385.08 |
| 3.51570485534151e-06 | 427053323679.309 | 516079315507.986 | 549815176951.89 | 625862499524.628 | 709068376875.076 | 761567845886.65 | 873718992504.237 | 4894783620.77 |
| 3.52168874507123e-06 | 424562336577.173 | 513005189015.287 | 546518898946.523 | 622063627874.885 | 704717297744.758 | 756867367612.4 | 868270134480.115 | 4853339755.841 |
| 3.52768281965372e-06 | 422085105753.336 | 509948570630.846 | 543241570064.208 | 618286983711.394 | 700392071200.522 | 752195045475.033 | 862854386523.331 | 4812246793.847 |
| 3.53368709642405e-06 | 419621561595.01 | 506909367278.36 | 539983088099.507 | 614532443876.969 | 696092550685.39 | 747550717949.454 | 857471554718.097 | 4771501763.713 |
| 3.53970159274681e-06 | 417171634789.026 | 503887486321.165 | 536743351342.277 | 610799885839.294 | 691818590414.31 | 742934224377.557 | 852121446223.348 | 4731101719.519 |
| 3.54572632601615e-06 | 414735256320.992 | 500882835560.628 | 533522258575.746 | 607089187688.242 | 687570045370.588 | 738345404964.077 | 846803869267.309 | 4691043740.286 |
| 3.5517613136558e-06 | 412312357474.45 | 497895323234.536 | 530319709074.589 | 603400228133.195 | 683346771302.332 | 733784100772.45 | 841518633142.072 | 4651324929.771 |
| 3.55780657311919e-06 | 409902869830.037 | 494924858015.499 | 527135602603.008 | 599732886500.377 | 679148624718.905 | 729250153720.698 | 836265548198.205 | 4611942416.25 |
| 3.56386212188942e-06 | 407506725264.632 | 491971349009.339 | 523969839412.819 | 596087042730.188 | 674975462887.4 | 724743406577.325 | 831044425839.375 | 4572893352.314 |
| 3.56992797747935e-06 | 405123855950.517 | 489034705753.49 | 520822320241.533 | 592462577374.555 | 670827143829.113 | 720263702957.228 | 825855078517 | 4534174914.665 |
| 3.57600415743168e-06 | 402754194354.52 | 486114838215.403 | 517692946310.456 | 588859371594.278 | 666703526316.042 | 715810887317.626 | 820697319724.926 | 4495784303.908 |
| 3.58209067931892e-06 | 400397673237.174 | 483211656790.943 | 514581619322.773 | 585277307156.395 | 662604469867.387 | 711384804954.005 | 815570963994.121 | 4457718744.35 |
| 3.58818756074352e-06 | 398054225651.854 | 480325072302.793 | 511488241461.652 | 581716266431.546 | 658529834746.071 | 706985301996.069 | 810475826887.391 | 4419975483.8 |
| 3.5942948193379e-06 | 395723784943.932 | 477454995998.864 | 508412715388.344 | 578176132391.347 | 654479481955.266 | 702612225403.722 | 805411724994.128 | 4382551793.372 |
| 3.60041247276446e-06 | 393406284749.92 | 474601339550.7 | 505354944240.284 | 574656788605.779 | 650453273234.935 | 698265422963.054 | 800378475925.07 | 4345444967.281 |
| 3.60654053871568e-06 | 391101658996.611 | 471764015051.887 | 502314831629.205 | 571158119240.565 | 646451071058.388 | 693944743282.341 | 795375898307.089 | 4308652322.655 |
| 3.61267903491415e-06 | 388809841900.222 | 468942935016.47 | 499292281639.245 | 567680009054.579 | 642472738628.843 | 689650035788.073 | 790403811778.002 | 4272171199.337 |
| 3.61882797911263e-06 | 386530767965.539 | 466138012377.361 | 496287198825.065 | 564222343397.243 | 638518139876.008 | 685381150720.982 | 785462036981.402 | 4235998959.693 |
| 3.62498738909409e-06 | 384264371985.049 | 463349160484.762 | 493299488209.968 | 560785008205.942 | 634587139452.667 | 681137939132.095 | 780550395561.512 | 4200132988.421 |
| 3.63115728267177e-06 | 382010589038.088 | 460576293104.577 | 490329055284.019 | 557367890003.443 | 630679602731.286 | 676920252878.801 | 775668710158.064 | 4164570692.364 |
| 3.63733767768923e-06 | 379769354489.97 | 457819324416.838 | 487375806002.177 | 553970875895.32 | 626795395800.623 | 672727944620.927 | 770816804401.195 | 4129309500.321 |
| 3.64352859202039e-06 | 377540603991.127 | 455078169014.125 | 484439646782.421 | 550593853567.388 | 622934385462.357 | 668560867816.839 | 765994502906.37 | 4094346862.861 |
| 3.64973004356961e-06 | 375324273476.243 | 452352741899.994 | 481520484503.884 | 547236711283.152 | 619096439227.725 | 664418876719.55 | 761201631269.327 | 4059680252.138 |
| 3.65594205027171e-06 | 373120299163.392 | 449642958487.403 | 478618226504.996 | 543899337881.246 | 615281425314.171 | 660301826372.847 | 756438016061.038 | 4025307161.709 |
| 3.66216463009205e-06 | 370928617553.162 | 446948734597.144 | 475732780581.618 | 540581622772.898 | 611489212642.013 | 656209572607.432 | 751703484822.703 | 3991225106.356 |
| 3.66839780102654e-06 | 368749165427.799 | 444269986456.272 | 472864054985.198 | 537283455939.39 | 607719670831.11 | 652141972037.079 | 746997866060.752 | 3957431621.899 |
| 3.67464158110176e-06 | 366581879850.327 | 441606630696.545 | 470011958420.91 | 534004727929.533 | 603972670197.557 | 648098882054.806 | 742320989241.885 | 3923924265.025 |
| 3.68089598837493e-06 | 364426698163.688 | 438958584352.857 | 467176400045.817 | 530745329857.146 | 600248081750.376 | 644080160829.058 | 737672684788.117 | 3890700613.107 |
| 3.68716104093404e-06 | 362283557989.863 | 436325764861.681 | 464357289467.021 | 527505153398.543 | 596545777188.232 | 640085667299.913 | 733052784071.86 | 3857758264.031 |
| 3.69343675689785e-06 | 360152397229.009 | 433708090059.513 | 461554536739.831 | 524284090790.03 | 592865628896.153 | 636115261175.297 | 728461119411.014 | 3825094836.021 |
| 3.69972315441595e-06 | 358033154058.58 | 431105478181.311 | 458768052365.925 | 521082034825.403 | 589207509942.265 | 632168802927.214 | 723897524064.09 | 3792707967.467 |
| 3.70602025166884e-06 | 355925766932.46 | 428517847858.95 | 455997747291.522 | 517898878853.465 | 585571294074.538 | 628246153787.993 | 719361832225.349 | 3760595316.757 |
| 3.71232806686796e-06 | 353830174580.086 | 425945118119.669 | 453243532905.553 | 514734516775.54 | 581956855717.548 | 624347175746.552 | 714853879019.962 | 3728754562.101 |
| 3.71864661825573e-06 | 351746316005.578 | 423387208384.522 | 450505321037.842 | 511588843042.998 | 578364069969.243 | 620471731544.671 | 710373500499.193 | 3697183401.373 |
| 3.72497592410564e-06 | 349674130486.861 | 420844038466.841 | 447783023957.289 | 508461752654.794 | 574792812597.728 | 616619684673.283 | 705920533635.607 | 3665879551.933 |
| 3.73131600272227e-06 | 347613557574.791 | 418315528570.687 | 445076554370.051 | 505353141154.999 | 571242960038.061 | 612790899368.783 | 701494816318.29 | 3634840750.473 |
| 3.73766687244136e-06 | 345564537092.282 | 415801599289.316 | 442385825417.738 | 502262904630.362 | 567714389389.056 | 608985240609.347 | 697096187348.103 | 3604064752.846 |
| 3.74402855162986e-06 | 343527009133.428 | 413302171603.641 | 439710750675.608 | 499190939707.854 | 564206978410.105 | 605202574111.265 | 692724486432.946 | 3573549333.905 |
| 3.75040105868598e-06 | 341500914062.627 | 410817166880.7 | 437051244150.76 | 496137143552.242 | 560720605518.005 | 601442766325.296 | 688379554183.046 | 3543292287.346 |
| 3.75678441203925e-06 | 339486192513.708 | 408346506872.127 | 434407220280.342 | 493101413863.655 | 557255149783.804 | 597705684433.029 | 684061232106.272 | 3513291425.543 |
| 3.76317863015055e-06 | 337482785389.048 | 405890113712.622 | 431778593929.76 | 490083648875.164 | 553810490929.652 | 593991196343.266 | 679769362603.464 | 3483544579.395 |
| 3.76958373151219e-06 | 335490633858.701 | 403447909918.429 | 429165280390.886 | 487083747350.376 | 550386509325.67 | 590299170688.414 | 675503788963.785 | 3454049598.165 |
| 3.77599973464797e-06 | 333509679359.516 | 401019818385.815 | 426567195380.276 | 484101608581.019 | 546983085986.822 | 586629476820.894 | 671264355360.096 | 3424804349.326 |
| 3.7824266581132e-06 | 331539863594.264 | 398605762389.548 | 423984255037.39 | 481137132384.555 | 543600102569.815 | 582981984809.566 | 667050906844.351 | 3395806718.407 |
| 3.78886452049477e-06 | 329581128530.756 | 396205665581.388 | 421416375922.817 | 478190219101.783 | 540237441369.99 | 579356565436.165 | 662863289343.008 | 3367054608.842 |
| 3.79531334041123e-06 | 327633416400.968 | 393819451988.568 | 418863475016.507 | 475260769594.461 | 536894985318.243 | 575753090191.757 | 658701349652.468 | 3338545941.815 |
| 3.8017731365128e-06 | 325696669700.164 | 391447046012.288 | 416325469715.999 | 472348685242.934 | 533572617977.945 | 572171431273.202 | 654564935434.533 | 3310278656.11 |
| 3.80824392748143e-06 | 323770831186.015 | 389088372426.21 | 413802277834.666 | 469453867943.764 | 530270223541.885 | 568611461579.639 | 650453895211.877 | 3282250707.966 |
| 3.8147257320309e-06 | 321855843877.722 | 386743356374.951 | 411293817599.949 | 466576220107.372 | 526987686829.21 | 565073054708.981 | 646368078363.55 | 3254460070.924 |
| 3.82121856890683e-06 | 319951651055.14 | 384411923372.587 | 408800007651.614 | 463715644655.694 | 523724893282.396 | 561556084954.427 | 642307335120.492 | 3226904735.684 |
| 3.82772245688673e-06 | 318058196257.9 | 382093999301.154 | 406320767039.996 | 460872045019.829 | 520481728964.211 | 558060427300.982 | 638271516561.071 | 3199582709.96 |
| 3.83423741478008e-06 | 316175423284.525 | 379789510409.153 | 403856015224.259 | 458045325137.71 | 517258080554.706 | 554585957422.002 | 634260474606.644 | 3172492018.331 |
| 3.84076346142839e-06 | 314303276191.564 | 377498383310.063 | 401405672070.653 | 455235389451.777 | 514053835348.205 | 551132551675.746 | 630274062017.133 | 3145630702.105 |
| 3.84730061570521e-06 | 312441699292.703 | 375220544980.851 | 398969657850.784 | 452442142906.656 | 510868881250.318 | 547700087101.942 | 626312132386.628 | 3118996819.173 |
| 3.85384889651625e-06 | 310590637157.897 | 372955922760.489 | 396547893239.88 | 449665490946.845 | 507703106774.954 | 544288441418.371 | 622374540139 | 3092588443.869 |
| 3.86040832279936e-06 | 308750034612.484 | 370704444348.473 | 394140299315.065 | 446905339514.417 | 504556401041.358 | 540897493017.463 | 618461140523.548 | 3066403666.833 |
| 3.86697891352465e-06 | 306919836736.315 | 368466037803.345 | 391746797553.641 | 444161595046.718 | 501428653771.149 | 537527120962.906 | 614571789610.65 | 3040440594.871 |
| 3.8735606876945e-06 | 305099988862.875 | 366240631541.219 | 389367309831.368 | 441434164474.079 | 498319755285.374 | 534177204986.274 | 610706344287.447 | 3014697350.818 |
| 3.88015366434365e-06 | 303290436578.406 | 364028154334.311 | 387001758420.753 | 438722955217.542 | 495229596501.575 | 530847625483.664 | 606864662253.542 | 2989172073.403 |
| 3.88675786253923e-06 | 301491125721.033 | 361828535309.468 | 384650065989.345 | 436027875186.578 | 492158068930.866 | 527538263512.346 | 603046602016.715 | 2963862917.114 |
| 3.89337330138081e-06 | 299702002379.885 | 359641703946.71 | 382312155598.028 | 433348832776.831 | 489105064675.023 | 524249000787.438 | 599252022888.665 | 2938768052.065 |
| 3.9000000000005e-06 | 297923012894.226 | 357467590077.765 | 379987950699.327 | 430685736867.855 | 486070476423.579 | 520979719678.578 | 595480784980.768 | 2913885663.865 |